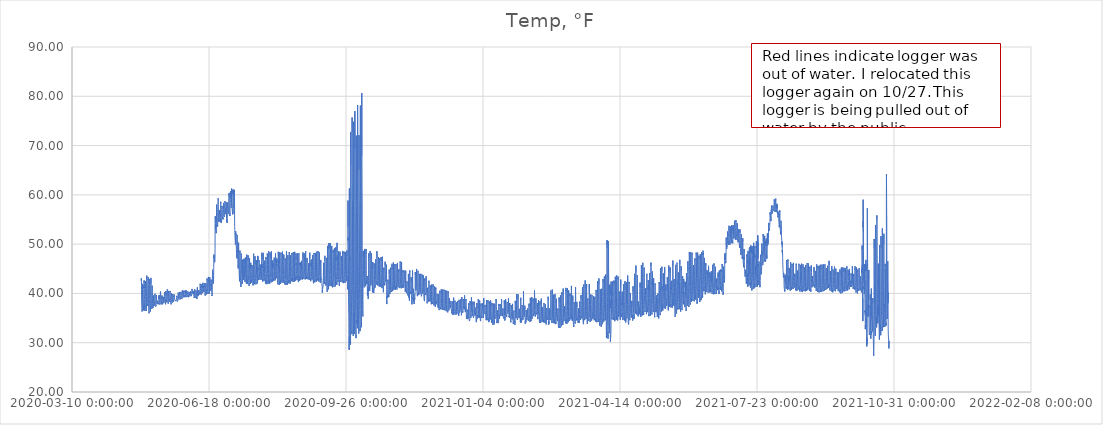
| Category | Temp, °F |
|---|---|
| 43950.547002314815 | 42.613 |
| 43950.58866898149 | 43.057 |
| 43950.63033564815 | 42.999 |
| 43950.672002314815 | 42.439 |
| 43950.71366898149 | 41.648 |
| 43950.75533564815 | 40.74 |
| 43950.797002314815 | 39.659 |
| 43950.83866898149 | 38.636 |
| 43950.88033564815 | 38.038 |
| 43950.922002314815 | 37.555 |
| 43950.96366898149 | 37.188 |
| 43951.00533564815 | 36.899 |
| 43951.047002314815 | 36.648 |
| 43951.08866898149 | 36.474 |
| 43951.13033564815 | 36.339 |
| 43951.172002314815 | 36.281 |
| 43951.21366898149 | 36.165 |
| 43951.25533564815 | 36.184 |
| 43951.297002314815 | 36.319 |
| 43951.33866898149 | 36.609 |
| 43951.38033564815 | 37.42 |
| 43951.422002314815 | 38.906 |
| 43951.46366898149 | 40.779 |
| 43951.50533564815 | 41.937 |
| 43951.547002314815 | 42.13 |
| 43951.58866898149 | 40.991 |
| 43951.63033564815 | 40.914 |
| 43951.672002314815 | 41.512 |
| 43951.71366898149 | 41.281 |
| 43951.75533564815 | 40.084 |
| 43951.797002314815 | 39.312 |
| 43951.83866898149 | 38.829 |
| 43951.88033564815 | 38.288 |
| 43951.922002314815 | 37.98 |
| 43951.96366898149 | 37.69 |
| 43952.00533564815 | 37.42 |
| 43952.047002314815 | 37.169 |
| 43952.08866898149 | 36.995 |
| 43952.13033564815 | 36.841 |
| 43952.172002314815 | 36.667 |
| 43952.21366898149 | 36.57 |
| 43952.25533564815 | 36.435 |
| 43952.297002314815 | 36.416 |
| 43952.33866898149 | 36.705 |
| 43952.38033564815 | 37.671 |
| 43952.422002314815 | 39.234 |
| 43952.46366898149 | 40.547 |
| 43952.50533564815 | 41.435 |
| 43952.547002314815 | 41.146 |
| 43952.58866898149 | 41.821 |
| 43952.63033564815 | 42.651 |
| 43952.672002314815 | 42.767 |
| 43952.71366898149 | 42.014 |
| 43952.75533564815 | 40.76 |
| 43952.797002314815 | 39.717 |
| 43952.83866898149 | 38.752 |
| 43952.88033564815 | 38.134 |
| 43952.922002314815 | 37.651 |
| 43952.96366898149 | 37.246 |
| 43953.00533564815 | 36.995 |
| 43953.047002314815 | 36.86 |
| 43953.08866898149 | 36.686 |
| 43953.13033564815 | 36.551 |
| 43953.172002314815 | 36.435 |
| 43953.21366898149 | 36.339 |
| 43953.25533564815 | 36.281 |
| 43953.297002314815 | 36.3 |
| 43953.33866898149 | 36.609 |
| 43953.38033564815 | 37.632 |
| 43953.422002314815 | 38.752 |
| 43953.46366898149 | 39.678 |
| 43953.50533564815 | 41.223 |
| 43953.547002314815 | 42.014 |
| 43953.58866898149 | 42.478 |
| 43953.63033564815 | 42.362 |
| 43953.672002314815 | 42.014 |
| 43953.71366898149 | 41.03 |
| 43953.75533564815 | 40.161 |
| 43953.797002314815 | 39.466 |
| 43953.83866898149 | 38.926 |
| 43953.88033564815 | 38.559 |
| 43953.922002314815 | 38.231 |
| 43953.96366898149 | 37.883 |
| 43954.00533564815 | 37.497 |
| 43954.047002314815 | 37.207 |
| 43954.08866898149 | 36.956 |
| 43954.13033564815 | 36.783 |
| 43954.172002314815 | 36.648 |
| 43954.21366898149 | 36.532 |
| 43954.25533564815 | 36.435 |
| 43954.297002314815 | 36.474 |
| 43954.33866898149 | 36.821 |
| 43954.38033564815 | 37.825 |
| 43954.422002314815 | 39.37 |
| 43954.46366898149 | 41.03 |
| 43954.50533564815 | 42.42 |
| 43954.547002314815 | 43.346 |
| 43954.58866898149 | 43.617 |
| 43954.63033564815 | 43.636 |
| 43954.672002314815 | 43.153 |
| 43954.71366898149 | 42.42 |
| 43954.75533564815 | 41.455 |
| 43954.797002314815 | 40.47 |
| 43954.83866898149 | 39.485 |
| 43954.88033564815 | 38.733 |
| 43954.922002314815 | 38.153 |
| 43954.96366898149 | 37.941 |
| 43955.00533564815 | 37.806 |
| 43955.047002314815 | 37.709 |
| 43955.08866898149 | 37.594 |
| 43955.13033564815 | 37.555 |
| 43955.172002314815 | 37.516 |
| 43955.21366898149 | 37.458 |
| 43955.25533564815 | 37.4 |
| 43955.297002314815 | 37.381 |
| 43955.33866898149 | 37.594 |
| 43955.38033564815 | 37.864 |
| 43955.422002314815 | 39.505 |
| 43955.46366898149 | 40.702 |
| 43955.50533564815 | 41.802 |
| 43955.547002314815 | 42.922 |
| 43955.58866898149 | 43.308 |
| 43955.63033564815 | 43.308 |
| 43955.672002314815 | 42.632 |
| 43955.71366898149 | 41.783 |
| 43955.75533564815 | 40.953 |
| 43955.797002314815 | 39.852 |
| 43955.83866898149 | 38.675 |
| 43955.88033564815 | 37.902 |
| 43955.922002314815 | 37.458 |
| 43955.96366898149 | 37.13 |
| 43956.00533564815 | 36.802 |
| 43956.047002314815 | 36.532 |
| 43956.08866898149 | 36.377 |
| 43956.13033564815 | 36.261 |
| 43956.172002314815 | 36.146 |
| 43956.21366898149 | 35.972 |
| 43956.25533564815 | 35.875 |
| 43956.297002314815 | 35.837 |
| 43956.33866898149 | 36.204 |
| 43956.38033564815 | 37.246 |
| 43956.422002314815 | 38.733 |
| 43956.46366898149 | 40.335 |
| 43956.50533564815 | 41.609 |
| 43956.547002314815 | 42.478 |
| 43956.58866898149 | 42.941 |
| 43956.63033564815 | 42.864 |
| 43956.672002314815 | 42.4 |
| 43956.71366898149 | 41.628 |
| 43956.75533564815 | 40.721 |
| 43956.797002314815 | 39.717 |
| 43956.83866898149 | 38.829 |
| 43956.88033564815 | 38.269 |
| 43956.922002314815 | 37.864 |
| 43956.96366898149 | 37.516 |
| 43957.00533564815 | 37.285 |
| 43957.047002314815 | 37.092 |
| 43957.08866898149 | 36.86 |
| 43957.13033564815 | 36.744 |
| 43957.172002314815 | 36.57 |
| 43957.21366898149 | 36.339 |
| 43957.25533564815 | 36.204 |
| 43957.297002314815 | 36.223 |
| 43957.33866898149 | 36.59 |
| 43957.38033564815 | 37.497 |
| 43957.422002314815 | 38.983 |
| 43957.46366898149 | 40.663 |
| 43957.50533564815 | 41.686 |
| 43957.547002314815 | 42.613 |
| 43957.58866898149 | 43.153 |
| 43957.63033564815 | 43.076 |
| 43957.672002314815 | 41.976 |
| 43957.71366898149 | 40.779 |
| 43957.75533564815 | 40.084 |
| 43957.797002314815 | 39.621 |
| 43957.83866898149 | 39.119 |
| 43957.88033564815 | 38.636 |
| 43957.922002314815 | 38.269 |
| 43957.96366898149 | 37.999 |
| 43958.00533564815 | 37.748 |
| 43958.047002314815 | 37.574 |
| 43958.08866898149 | 37.381 |
| 43958.13033564815 | 37.227 |
| 43958.172002314815 | 37.092 |
| 43958.21366898149 | 36.956 |
| 43958.25533564815 | 36.879 |
| 43958.297002314815 | 36.918 |
| 43958.33866898149 | 37.188 |
| 43958.38033564815 | 37.922 |
| 43958.422002314815 | 39.331 |
| 43958.46366898149 | 41.03 |
| 43958.50533564815 | 41.57 |
| 43958.547002314815 | 41.667 |
| 43958.58866898149 | 41.165 |
| 43958.63033564815 | 40.47 |
| 43958.672002314815 | 39.505 |
| 43958.71366898149 | 38.983 |
| 43958.75533564815 | 38.462 |
| 43958.797002314815 | 38.018 |
| 43958.83866898149 | 37.651 |
| 43958.88033564815 | 37.497 |
| 43958.922002314815 | 37.323 |
| 43958.96366898149 | 37.323 |
| 43959.00533564815 | 37.265 |
| 43959.047002314815 | 37.285 |
| 43959.08866898149 | 37.246 |
| 43959.13033564815 | 37.072 |
| 43959.172002314815 | 37.014 |
| 43959.21366898149 | 37.014 |
| 43959.25533564815 | 36.995 |
| 43959.297002314815 | 36.995 |
| 43959.33866898149 | 37.188 |
| 43959.38033564815 | 37.651 |
| 43959.422002314815 | 38.288 |
| 43959.46366898149 | 38.829 |
| 43959.50533564815 | 39.331 |
| 43959.547002314815 | 39.582 |
| 43959.58866898149 | 39.64 |
| 43959.63033564815 | 39.582 |
| 43959.672002314815 | 39.08 |
| 43959.71366898149 | 39.08 |
| 43959.75533564815 | 38.733 |
| 43959.797002314815 | 38.327 |
| 43959.83866898149 | 38.192 |
| 43959.88033564815 | 38.057 |
| 43959.922002314815 | 37.98 |
| 43959.96366898149 | 37.941 |
| 43960.00533564815 | 37.825 |
| 43960.047002314815 | 37.806 |
| 43960.08866898149 | 37.767 |
| 43960.13033564815 | 37.709 |
| 43960.172002314815 | 37.516 |
| 43960.21366898149 | 37.439 |
| 43960.25533564815 | 37.42 |
| 43960.297002314815 | 37.478 |
| 43960.33866898149 | 37.69 |
| 43960.38033564815 | 38.173 |
| 43960.422002314815 | 38.848 |
| 43960.46366898149 | 39.35 |
| 43960.50533564815 | 39.717 |
| 43960.547002314815 | 39.91 |
| 43960.58866898149 | 39.949 |
| 43960.63033564815 | 39.717 |
| 43960.672002314815 | 39.003 |
| 43960.71366898149 | 38.539 |
| 43960.75533564815 | 38.385 |
| 43960.797002314815 | 38.038 |
| 43960.83866898149 | 37.825 |
| 43960.88033564815 | 37.806 |
| 43960.922002314815 | 37.709 |
| 43960.96366898149 | 37.651 |
| 43961.00533564815 | 37.594 |
| 43961.047002314815 | 37.478 |
| 43961.08866898149 | 37.4 |
| 43961.13033564815 | 37.323 |
| 43961.172002314815 | 37.285 |
| 43961.21366898149 | 37.246 |
| 43961.25533564815 | 37.169 |
| 43961.297002314815 | 37.188 |
| 43961.33866898149 | 37.536 |
| 43961.38033564815 | 38.076 |
| 43961.422002314815 | 38.752 |
| 43961.46366898149 | 39.138 |
| 43961.50533564815 | 39.621 |
| 43961.547002314815 | 39.312 |
| 43961.58866898149 | 39.621 |
| 43961.63033564815 | 39.563 |
| 43961.672002314815 | 39.601 |
| 43961.71366898149 | 39.196 |
| 43961.75533564815 | 38.733 |
| 43961.797002314815 | 38.482 |
| 43961.83866898149 | 38.25 |
| 43961.88033564815 | 38.173 |
| 43961.922002314815 | 38.153 |
| 43961.96366898149 | 38.115 |
| 43962.00533564815 | 38.038 |
| 43962.047002314815 | 38.038 |
| 43962.08866898149 | 38.038 |
| 43962.13033564815 | 37.98 |
| 43962.172002314815 | 37.902 |
| 43962.21366898149 | 37.825 |
| 43962.25533564815 | 37.825 |
| 43962.297002314815 | 37.922 |
| 43962.33866898149 | 38.115 |
| 43962.38033564815 | 38.211 |
| 43962.422002314815 | 38.153 |
| 43962.46366898149 | 38.288 |
| 43962.50533564815 | 38.52 |
| 43962.547002314815 | 38.578 |
| 43962.58866898149 | 38.578 |
| 43962.63033564815 | 38.424 |
| 43962.672002314815 | 38.636 |
| 43962.71366898149 | 38.597 |
| 43962.75533564815 | 38.443 |
| 43962.797002314815 | 38.25 |
| 43962.83866898149 | 38.192 |
| 43962.88033564815 | 38.173 |
| 43962.922002314815 | 38.038 |
| 43962.96366898149 | 37.98 |
| 43963.00533564815 | 38.038 |
| 43963.047002314815 | 37.883 |
| 43963.08866898149 | 37.864 |
| 43963.13033564815 | 37.883 |
| 43963.172002314815 | 37.806 |
| 43963.21366898149 | 37.806 |
| 43963.25533564815 | 37.767 |
| 43963.297002314815 | 37.864 |
| 43963.33866898149 | 38.095 |
| 43963.38033564815 | 38.578 |
| 43963.422002314815 | 39.312 |
| 43963.46366898149 | 39.041 |
| 43963.50533564815 | 39.408 |
| 43963.547002314815 | 38.848 |
| 43963.58866898149 | 38.926 |
| 43963.63033564815 | 39.659 |
| 43963.672002314815 | 39.119 |
| 43963.71366898149 | 39.408 |
| 43963.75533564815 | 39.099 |
| 43963.797002314815 | 38.752 |
| 43963.83866898149 | 38.424 |
| 43963.88033564815 | 38.211 |
| 43963.922002314815 | 38.115 |
| 43963.96366898149 | 37.999 |
| 43964.00533564815 | 37.98 |
| 43964.047002314815 | 37.825 |
| 43964.08866898149 | 37.767 |
| 43964.13033564815 | 37.69 |
| 43964.172002314815 | 37.729 |
| 43964.21366898149 | 37.671 |
| 43964.25533564815 | 37.632 |
| 43964.297002314815 | 37.69 |
| 43964.33866898149 | 37.999 |
| 43964.38033564815 | 38.462 |
| 43964.422002314815 | 39.177 |
| 43964.46366898149 | 39.678 |
| 43964.50533564815 | 40.103 |
| 43964.547002314815 | 40.238 |
| 43964.58866898149 | 40.393 |
| 43964.63033564815 | 40.2 |
| 43964.672002314815 | 39.64 |
| 43964.71366898149 | 39.35 |
| 43964.75533564815 | 39.119 |
| 43964.797002314815 | 38.829 |
| 43964.83866898149 | 38.559 |
| 43964.88033564815 | 38.346 |
| 43964.922002314815 | 38.308 |
| 43964.96366898149 | 38.269 |
| 43965.00533564815 | 38.173 |
| 43965.047002314815 | 38.153 |
| 43965.08866898149 | 37.999 |
| 43965.13033564815 | 37.922 |
| 43965.172002314815 | 37.806 |
| 43965.21366898149 | 37.806 |
| 43965.25533564815 | 37.787 |
| 43965.297002314815 | 37.825 |
| 43965.33866898149 | 37.999 |
| 43965.38033564815 | 38.192 |
| 43965.422002314815 | 38.713 |
| 43965.46366898149 | 38.887 |
| 43965.50533564815 | 38.887 |
| 43965.547002314815 | 39.254 |
| 43965.58866898149 | 38.848 |
| 43965.63033564815 | 38.964 |
| 43965.672002314815 | 39.563 |
| 43965.71366898149 | 39.408 |
| 43965.75533564815 | 39.177 |
| 43965.797002314815 | 38.81 |
| 43965.83866898149 | 38.501 |
| 43965.88033564815 | 38.288 |
| 43965.922002314815 | 38.211 |
| 43965.96366898149 | 38.134 |
| 43966.00533564815 | 38.057 |
| 43966.047002314815 | 37.98 |
| 43966.08866898149 | 37.883 |
| 43966.13033564815 | 37.806 |
| 43966.172002314815 | 37.767 |
| 43966.21366898149 | 37.825 |
| 43966.25533564815 | 37.806 |
| 43966.297002314815 | 37.883 |
| 43966.33866898149 | 38.115 |
| 43966.38033564815 | 38.385 |
| 43966.422002314815 | 38.655 |
| 43966.46366898149 | 39.061 |
| 43966.50533564815 | 38.964 |
| 43966.547002314815 | 39.003 |
| 43966.58866898149 | 39.138 |
| 43966.63033564815 | 39.292 |
| 43966.672002314815 | 39.273 |
| 43966.71366898149 | 39.312 |
| 43966.75533564815 | 38.906 |
| 43966.797002314815 | 38.655 |
| 43966.83866898149 | 38.462 |
| 43966.88033564815 | 38.385 |
| 43966.922002314815 | 38.25 |
| 43966.96366898149 | 38.231 |
| 43967.00533564815 | 38.115 |
| 43967.047002314815 | 38.115 |
| 43967.08866898149 | 38.115 |
| 43967.13033564815 | 38.115 |
| 43967.172002314815 | 38.095 |
| 43967.21366898149 | 38.038 |
| 43967.25533564815 | 38.115 |
| 43967.297002314815 | 38.115 |
| 43967.33866898149 | 38.269 |
| 43967.38033564815 | 38.694 |
| 43967.422002314815 | 39.254 |
| 43967.46366898149 | 39.717 |
| 43967.50533564815 | 40.026 |
| 43967.547002314815 | 40.238 |
| 43967.58866898149 | 40.2 |
| 43967.63033564815 | 40.2 |
| 43967.672002314815 | 40.026 |
| 43967.71366898149 | 39.621 |
| 43967.75533564815 | 39.292 |
| 43967.797002314815 | 39.061 |
| 43967.83866898149 | 38.79 |
| 43967.88033564815 | 38.655 |
| 43967.922002314815 | 38.539 |
| 43967.96366898149 | 38.385 |
| 43968.00533564815 | 38.25 |
| 43968.047002314815 | 38.115 |
| 43968.08866898149 | 38.018 |
| 43968.13033564815 | 37.941 |
| 43968.172002314815 | 37.941 |
| 43968.21366898149 | 37.864 |
| 43968.25533564815 | 37.806 |
| 43968.297002314815 | 37.844 |
| 43968.33866898149 | 38.115 |
| 43968.38033564815 | 38.636 |
| 43968.422002314815 | 39.331 |
| 43968.46366898149 | 39.91 |
| 43968.50533564815 | 40.18 |
| 43968.547002314815 | 40.489 |
| 43968.58866898149 | 40.354 |
| 43968.63033564815 | 40.026 |
| 43968.672002314815 | 39.794 |
| 43968.71366898149 | 40.084 |
| 43968.75533564815 | 39.659 |
| 43968.797002314815 | 39.408 |
| 43968.83866898149 | 39.041 |
| 43968.88033564815 | 38.887 |
| 43968.922002314815 | 38.733 |
| 43968.96366898149 | 38.617 |
| 43969.00533564815 | 38.462 |
| 43969.047002314815 | 38.346 |
| 43969.08866898149 | 38.288 |
| 43969.13033564815 | 38.211 |
| 43969.172002314815 | 38.269 |
| 43969.21366898149 | 38.153 |
| 43969.25533564815 | 38.115 |
| 43969.297002314815 | 38.115 |
| 43969.33866898149 | 38.385 |
| 43969.38033564815 | 38.733 |
| 43969.422002314815 | 39.505 |
| 43969.46366898149 | 40.2 |
| 43969.50533564815 | 40.567 |
| 43969.547002314815 | 40.76 |
| 43969.58866898149 | 40.817 |
| 43969.63033564815 | 40.895 |
| 43969.672002314815 | 40.682 |
| 43969.71366898149 | 40.373 |
| 43969.75533564815 | 39.929 |
| 43969.797002314815 | 39.717 |
| 43969.83866898149 | 39.292 |
| 43969.88033564815 | 38.983 |
| 43969.922002314815 | 38.733 |
| 43969.96366898149 | 38.559 |
| 43970.00533564815 | 38.404 |
| 43970.047002314815 | 38.308 |
| 43970.08866898149 | 38.173 |
| 43970.13033564815 | 38.153 |
| 43970.172002314815 | 38.095 |
| 43970.21366898149 | 37.98 |
| 43970.25533564815 | 37.922 |
| 43970.297002314815 | 37.999 |
| 43970.33866898149 | 38.327 |
| 43970.38033564815 | 38.945 |
| 43970.422002314815 | 39.678 |
| 43970.46366898149 | 40.238 |
| 43970.50533564815 | 40.354 |
| 43970.547002314815 | 40.509 |
| 43970.58866898149 | 40.547 |
| 43970.63033564815 | 40.045 |
| 43970.672002314815 | 39.929 |
| 43970.71366898149 | 39.698 |
| 43970.75533564815 | 39.485 |
| 43970.797002314815 | 39.215 |
| 43970.83866898149 | 39.119 |
| 43970.88033564815 | 39.022 |
| 43970.922002314815 | 38.868 |
| 43970.96366898149 | 38.79 |
| 43971.00533564815 | 38.694 |
| 43971.047002314815 | 38.578 |
| 43971.08866898149 | 38.578 |
| 43971.13033564815 | 38.424 |
| 43971.172002314815 | 38.366 |
| 43971.21366898149 | 38.346 |
| 43971.25533564815 | 38.327 |
| 43971.297002314815 | 38.288 |
| 43971.33866898149 | 38.52 |
| 43971.38033564815 | 39.003 |
| 43971.422002314815 | 39.408 |
| 43971.46366898149 | 39.872 |
| 43971.50533564815 | 40.103 |
| 43971.547002314815 | 40.296 |
| 43971.58866898149 | 40.509 |
| 43971.63033564815 | 40.489 |
| 43971.672002314815 | 40.238 |
| 43971.71366898149 | 39.968 |
| 43971.75533564815 | 39.601 |
| 43971.797002314815 | 39.254 |
| 43971.83866898149 | 38.868 |
| 43971.88033564815 | 38.694 |
| 43971.922002314815 | 38.559 |
| 43971.96366898149 | 38.443 |
| 43972.00533564815 | 38.231 |
| 43972.047002314815 | 38.115 |
| 43972.08866898149 | 37.999 |
| 43972.13033564815 | 37.922 |
| 43972.172002314815 | 37.902 |
| 43972.21366898149 | 37.806 |
| 43972.25533564815 | 37.825 |
| 43972.297002314815 | 37.787 |
| 43972.33866898149 | 38.095 |
| 43972.38033564815 | 38.443 |
| 43972.422002314815 | 38.964 |
| 43972.46366898149 | 39.389 |
| 43972.50533564815 | 39.736 |
| 43972.547002314815 | 40.045 |
| 43972.58866898149 | 40.084 |
| 43972.63033564815 | 39.852 |
| 43972.672002314815 | 39.717 |
| 43972.71366898149 | 39.659 |
| 43972.75533564815 | 39.35 |
| 43972.797002314815 | 39.119 |
| 43972.83866898149 | 38.926 |
| 43972.88033564815 | 38.752 |
| 43972.922002314815 | 38.636 |
| 43972.96366898149 | 38.559 |
| 43973.00533564815 | 38.52 |
| 43973.047002314815 | 38.366 |
| 43973.08866898149 | 38.134 |
| 43973.13033564815 | 38.115 |
| 43973.172002314815 | 38.018 |
| 43973.21366898149 | 38.095 |
| 43973.25533564815 | 38.095 |
| 43973.297002314815 | 38.057 |
| 43973.33866898149 | 38.327 |
| 43973.38033564815 | 38.79 |
| 43973.422002314815 | 39.177 |
| 43973.46366898149 | 39.485 |
| 43973.50533564815 | 39.678 |
| 43973.547002314815 | 39.852 |
| 43973.58866898149 | 39.872 |
| 43973.63033564815 | 39.794 |
| 43973.672002314815 | 39.621 |
| 43973.71366898149 | 39.447 |
| 43973.75533564815 | 39.234 |
| 43973.797002314815 | 38.926 |
| 43973.83866898149 | 38.79 |
| 43973.88033564815 | 38.636 |
| 43973.922002314815 | 38.578 |
| 43973.96366898149 | 38.52 |
| 43974.00533564815 | 38.443 |
| 43974.047002314815 | 38.308 |
| 43974.08866898149 | 38.25 |
| 43974.13033564815 | 38.211 |
| 43974.172002314815 | 38.192 |
| 43974.21366898149 | 38.153 |
| 43974.25533564815 | 38.192 |
| 43974.297002314815 | 38.288 |
| 43974.33866898149 | 38.578 |
| 43974.38033564815 | 38.964 |
| 43974.422002314815 | 39.119 |
| 43974.46366898149 | 39.505 |
| 43974.50533564815 | 39.273 |
| 43974.547002314815 | 39.331 |
| 43974.58866898149 | 39.756 |
| 43974.63033564815 | 39.736 |
| 43974.672002314815 | 39.814 |
| 43974.71366898149 | 39.698 |
| 43974.75533564815 | 39.678 |
| 43974.797002314815 | 39.389 |
| 43974.83866898149 | 39.177 |
| 43974.88033564815 | 39.061 |
| 43974.922002314815 | 38.906 |
| 43974.96366898149 | 38.868 |
| 43975.00533564815 | 38.752 |
| 43975.047002314815 | 38.733 |
| 43975.08866898149 | 38.733 |
| 43975.13033564815 | 38.694 |
| 43975.172002314815 | 38.655 |
| 43975.21366898149 | 38.636 |
| 43975.25533564815 | 38.578 |
| 43975.297002314815 | 38.713 |
| 43975.33866898149 | 38.597 |
| 43975.38033564815 | 38.694 |
| 43975.422002314815 | 38.868 |
| 43975.46366898149 | 38.848 |
| 43975.50533564815 | 38.501 |
| 43975.547002314815 | 38.79 |
| 43975.58866898149 | 38.52 |
| 43975.63033564815 | 38.752 |
| 43975.672002314815 | 38.52 |
| 43975.71366898149 | 38.636 |
| 43975.75533564815 | 38.636 |
| 43975.797002314815 | 38.655 |
| 43975.83866898149 | 38.52 |
| 43975.88033564815 | 38.404 |
| 43975.922002314815 | 38.346 |
| 43975.96366898149 | 38.308 |
| 43976.00533564815 | 38.346 |
| 43976.047002314815 | 38.346 |
| 43976.08866898149 | 38.269 |
| 43976.13033564815 | 38.288 |
| 43976.172002314815 | 38.327 |
| 43976.21366898149 | 38.462 |
| 43976.25533564815 | 38.539 |
| 43976.297002314815 | 38.52 |
| 43976.33866898149 | 38.559 |
| 43976.38033564815 | 38.81 |
| 43976.422002314815 | 39.119 |
| 43976.46366898149 | 39.273 |
| 43976.50533564815 | 39.505 |
| 43976.547002314815 | 39.292 |
| 43976.58866898149 | 39.37 |
| 43976.63033564815 | 39.428 |
| 43976.672002314815 | 39.138 |
| 43976.71366898149 | 39.234 |
| 43976.75533564815 | 38.945 |
| 43976.797002314815 | 38.79 |
| 43976.83866898149 | 38.559 |
| 43976.88033564815 | 38.52 |
| 43976.922002314815 | 38.482 |
| 43976.96366898149 | 38.385 |
| 43977.00533564815 | 38.346 |
| 43977.047002314815 | 38.327 |
| 43977.08866898149 | 38.269 |
| 43977.13033564815 | 38.327 |
| 43977.172002314815 | 38.366 |
| 43977.21366898149 | 38.443 |
| 43977.25533564815 | 38.462 |
| 43977.297002314815 | 38.559 |
| 43977.33866898149 | 38.81 |
| 43977.38033564815 | 39.196 |
| 43977.422002314815 | 39.736 |
| 43977.46366898149 | 39.814 |
| 43977.50533564815 | 39.659 |
| 43977.547002314815 | 39.717 |
| 43977.58866898149 | 40.161 |
| 43977.63033564815 | 39.756 |
| 43977.672002314815 | 39.485 |
| 43977.71366898149 | 39.273 |
| 43977.75533564815 | 39.466 |
| 43977.797002314815 | 39.196 |
| 43977.83866898149 | 38.983 |
| 43977.88033564815 | 38.906 |
| 43977.922002314815 | 38.926 |
| 43977.96366898149 | 38.887 |
| 43978.00533564815 | 38.848 |
| 43978.047002314815 | 38.771 |
| 43978.08866898149 | 38.79 |
| 43978.13033564815 | 38.752 |
| 43978.172002314815 | 38.79 |
| 43978.21366898149 | 38.829 |
| 43978.25533564815 | 38.887 |
| 43978.297002314815 | 39.022 |
| 43978.33866898149 | 39.196 |
| 43978.38033564815 | 39.582 |
| 43978.422002314815 | 39.968 |
| 43978.46366898149 | 40.219 |
| 43978.50533564815 | 39.872 |
| 43978.547002314815 | 40.007 |
| 43978.58866898149 | 40.18 |
| 43978.63033564815 | 40.238 |
| 43978.672002314815 | 39.64 |
| 43978.71366898149 | 39.447 |
| 43978.75533564815 | 39.234 |
| 43978.797002314815 | 39.273 |
| 43978.83866898149 | 39.061 |
| 43978.88033564815 | 39.003 |
| 43978.922002314815 | 38.906 |
| 43978.96366898149 | 38.829 |
| 43979.00533564815 | 38.79 |
| 43979.047002314815 | 38.79 |
| 43979.08866898149 | 38.752 |
| 43979.13033564815 | 38.79 |
| 43979.172002314815 | 38.752 |
| 43979.21366898149 | 38.733 |
| 43979.25533564815 | 38.79 |
| 43979.297002314815 | 38.887 |
| 43979.33866898149 | 39.099 |
| 43979.38033564815 | 39.505 |
| 43979.422002314815 | 39.833 |
| 43979.46366898149 | 40.103 |
| 43979.50533564815 | 40.316 |
| 43979.547002314815 | 40.354 |
| 43979.58866898149 | 40.451 |
| 43979.63033564815 | 40.316 |
| 43979.672002314815 | 40.373 |
| 43979.71366898149 | 40.007 |
| 43979.75533564815 | 39.91 |
| 43979.797002314815 | 39.621 |
| 43979.83866898149 | 39.428 |
| 43979.88033564815 | 39.389 |
| 43979.922002314815 | 39.254 |
| 43979.96366898149 | 39.119 |
| 43980.00533564815 | 39.08 |
| 43980.047002314815 | 39.061 |
| 43980.08866898149 | 38.983 |
| 43980.13033564815 | 38.945 |
| 43980.172002314815 | 38.906 |
| 43980.21366898149 | 38.868 |
| 43980.25533564815 | 38.945 |
| 43980.297002314815 | 38.964 |
| 43980.33866898149 | 39.177 |
| 43980.38033564815 | 39.428 |
| 43980.422002314815 | 39.891 |
| 43980.46366898149 | 40.335 |
| 43980.50533564815 | 40.316 |
| 43980.547002314815 | 40.624 |
| 43980.58866898149 | 40.682 |
| 43980.63033564815 | 40.316 |
| 43980.672002314815 | 39.987 |
| 43980.71366898149 | 40.084 |
| 43980.75533564815 | 39.833 |
| 43980.797002314815 | 39.736 |
| 43980.83866898149 | 39.601 |
| 43980.88033564815 | 39.428 |
| 43980.922002314815 | 39.234 |
| 43980.96366898149 | 39.196 |
| 43981.00533564815 | 39.215 |
| 43981.047002314815 | 39.138 |
| 43981.08866898149 | 39.157 |
| 43981.13033564815 | 39.138 |
| 43981.172002314815 | 39.061 |
| 43981.21366898149 | 39.061 |
| 43981.25533564815 | 39.061 |
| 43981.297002314815 | 39.099 |
| 43981.33866898149 | 39.331 |
| 43981.38033564815 | 39.563 |
| 43981.422002314815 | 39.968 |
| 43981.46366898149 | 40.528 |
| 43981.50533564815 | 40.528 |
| 43981.547002314815 | 40.489 |
| 43981.58866898149 | 40.065 |
| 43981.63033564815 | 39.91 |
| 43981.672002314815 | 39.794 |
| 43981.71366898149 | 39.717 |
| 43981.75533564815 | 39.678 |
| 43981.797002314815 | 39.621 |
| 43981.83866898149 | 39.447 |
| 43981.88033564815 | 39.331 |
| 43981.922002314815 | 39.234 |
| 43981.96366898149 | 39.157 |
| 43982.00533564815 | 39.215 |
| 43982.047002314815 | 39.254 |
| 43982.08866898149 | 39.37 |
| 43982.13033564815 | 39.312 |
| 43982.172002314815 | 39.292 |
| 43982.21366898149 | 39.234 |
| 43982.25533564815 | 39.177 |
| 43982.297002314815 | 39.138 |
| 43982.33866898149 | 39.312 |
| 43982.38033564815 | 39.698 |
| 43982.422002314815 | 39.949 |
| 43982.46366898149 | 39.929 |
| 43982.50533564815 | 40.084 |
| 43982.547002314815 | 40.567 |
| 43982.58866898149 | 40.373 |
| 43982.63033564815 | 40.258 |
| 43982.672002314815 | 40.451 |
| 43982.71366898149 | 40.547 |
| 43982.75533564815 | 40.354 |
| 43982.797002314815 | 40.065 |
| 43982.83866898149 | 39.794 |
| 43982.88033564815 | 39.621 |
| 43982.922002314815 | 39.485 |
| 43982.96366898149 | 39.389 |
| 43983.00533564815 | 39.389 |
| 43983.047002314815 | 39.331 |
| 43983.08866898149 | 39.312 |
| 43983.13033564815 | 39.35 |
| 43983.172002314815 | 39.234 |
| 43983.21366898149 | 39.138 |
| 43983.25533564815 | 39.215 |
| 43983.297002314815 | 39.312 |
| 43983.33866898149 | 39.37 |
| 43983.38033564815 | 39.543 |
| 43983.422002314815 | 39.91 |
| 43983.46366898149 | 40.2 |
| 43983.50533564815 | 39.987 |
| 43983.547002314815 | 40.567 |
| 43983.58866898149 | 40.373 |
| 43983.63033564815 | 40.393 |
| 43983.672002314815 | 40.431 |
| 43983.71366898149 | 40.065 |
| 43983.75533564815 | 40.007 |
| 43983.797002314815 | 39.814 |
| 43983.83866898149 | 39.582 |
| 43983.88033564815 | 39.466 |
| 43983.922002314815 | 39.428 |
| 43983.96366898149 | 39.389 |
| 43984.00533564815 | 39.292 |
| 43984.047002314815 | 39.312 |
| 43984.08866898149 | 39.273 |
| 43984.13033564815 | 39.312 |
| 43984.172002314815 | 39.37 |
| 43984.21366898149 | 39.505 |
| 43984.25533564815 | 39.428 |
| 43984.297002314815 | 39.408 |
| 43984.33866898149 | 39.485 |
| 43984.38033564815 | 39.621 |
| 43984.422002314815 | 39.814 |
| 43984.46366898149 | 39.794 |
| 43984.50533564815 | 40.18 |
| 43984.547002314815 | 40.412 |
| 43984.58866898149 | 40.586 |
| 43984.63033564815 | 40.354 |
| 43984.672002314815 | 40.258 |
| 43984.71366898149 | 40.277 |
| 43984.75533564815 | 40.142 |
| 43984.797002314815 | 39.968 |
| 43984.83866898149 | 39.717 |
| 43984.88033564815 | 39.466 |
| 43984.922002314815 | 39.331 |
| 43984.96366898149 | 39.408 |
| 43985.00533564815 | 39.331 |
| 43985.047002314815 | 39.234 |
| 43985.08866898149 | 39.35 |
| 43985.13033564815 | 39.466 |
| 43985.172002314815 | 39.312 |
| 43985.21366898149 | 39.312 |
| 43985.25533564815 | 39.447 |
| 43985.297002314815 | 39.659 |
| 43985.33866898149 | 39.621 |
| 43985.38033564815 | 39.659 |
| 43985.422002314815 | 39.833 |
| 43985.46366898149 | 39.949 |
| 43985.50533564815 | 39.775 |
| 43985.547002314815 | 39.852 |
| 43985.58866898149 | 40.238 |
| 43985.63033564815 | 40.354 |
| 43985.672002314815 | 40.2 |
| 43985.71366898149 | 39.968 |
| 43985.75533564815 | 39.929 |
| 43985.797002314815 | 39.64 |
| 43985.83866898149 | 39.621 |
| 43985.88033564815 | 39.466 |
| 43985.922002314815 | 39.389 |
| 43985.96366898149 | 39.331 |
| 43986.00533564815 | 39.35 |
| 43986.047002314815 | 39.37 |
| 43986.08866898149 | 39.37 |
| 43986.13033564815 | 39.505 |
| 43986.172002314815 | 39.428 |
| 43986.21366898149 | 39.292 |
| 43986.25533564815 | 39.234 |
| 43986.297002314815 | 39.312 |
| 43986.33866898149 | 39.601 |
| 43986.38033564815 | 39.949 |
| 43986.422002314815 | 40.393 |
| 43986.46366898149 | 40.258 |
| 43986.50533564815 | 40.412 |
| 43986.547002314815 | 40.065 |
| 43986.58866898149 | 40.2 |
| 43986.63033564815 | 39.949 |
| 43986.672002314815 | 40.316 |
| 43986.71366898149 | 40.18 |
| 43986.75533564815 | 39.968 |
| 43986.797002314815 | 39.794 |
| 43986.83866898149 | 39.678 |
| 43986.88033564815 | 39.621 |
| 43986.922002314815 | 39.485 |
| 43986.96366898149 | 39.447 |
| 43987.00533564815 | 39.485 |
| 43987.047002314815 | 39.582 |
| 43987.08866898149 | 39.466 |
| 43987.13033564815 | 39.408 |
| 43987.172002314815 | 39.37 |
| 43987.21366898149 | 39.428 |
| 43987.25533564815 | 39.524 |
| 43987.297002314815 | 39.447 |
| 43987.33866898149 | 39.717 |
| 43987.38033564815 | 39.968 |
| 43987.422002314815 | 40.161 |
| 43987.46366898149 | 40.354 |
| 43987.50533564815 | 40.335 |
| 43987.547002314815 | 40.624 |
| 43987.58866898149 | 40.798 |
| 43987.63033564815 | 40.914 |
| 43987.672002314815 | 40.779 |
| 43987.71366898149 | 40.528 |
| 43987.75533564815 | 40.296 |
| 43987.797002314815 | 40.2 |
| 43987.83866898149 | 39.968 |
| 43987.88033564815 | 39.852 |
| 43987.922002314815 | 39.929 |
| 43987.96366898149 | 39.833 |
| 43988.00533564815 | 39.872 |
| 43988.047002314815 | 39.891 |
| 43988.08866898149 | 39.852 |
| 43988.13033564815 | 39.833 |
| 43988.172002314815 | 39.833 |
| 43988.21366898149 | 39.852 |
| 43988.25533564815 | 39.852 |
| 43988.297002314815 | 39.794 |
| 43988.33866898149 | 39.91 |
| 43988.38033564815 | 39.891 |
| 43988.422002314815 | 40.026 |
| 43988.46366898149 | 40.142 |
| 43988.50533564815 | 40.065 |
| 43988.547002314815 | 40.509 |
| 43988.58866898149 | 40.509 |
| 43988.63033564815 | 40.065 |
| 43988.672002314815 | 40.18 |
| 43988.71366898149 | 40.277 |
| 43988.75533564815 | 40.219 |
| 43988.797002314815 | 40.122 |
| 43988.83866898149 | 39.794 |
| 43988.88033564815 | 39.794 |
| 43988.922002314815 | 39.756 |
| 43988.96366898149 | 39.736 |
| 43989.00533564815 | 39.621 |
| 43989.047002314815 | 39.37 |
| 43989.08866898149 | 39.331 |
| 43989.13033564815 | 39.099 |
| 43989.172002314815 | 39.061 |
| 43989.21366898149 | 39.003 |
| 43989.25533564815 | 39.003 |
| 43989.297002314815 | 39.138 |
| 43989.33866898149 | 39.35 |
| 43989.38033564815 | 39.852 |
| 43989.422002314815 | 40.296 |
| 43989.46366898149 | 40.605 |
| 43989.50533564815 | 40.837 |
| 43989.547002314815 | 40.895 |
| 43989.58866898149 | 40.914 |
| 43989.63033564815 | 40.953 |
| 43989.672002314815 | 40.721 |
| 43989.71366898149 | 40.74 |
| 43989.75533564815 | 40.721 |
| 43989.797002314815 | 40.528 |
| 43989.83866898149 | 40.142 |
| 43989.88033564815 | 39.852 |
| 43989.922002314815 | 39.621 |
| 43989.96366898149 | 39.563 |
| 43990.00533564815 | 39.447 |
| 43990.047002314815 | 39.331 |
| 43990.08866898149 | 39.312 |
| 43990.13033564815 | 39.196 |
| 43990.172002314815 | 39.215 |
| 43990.21366898149 | 39.157 |
| 43990.25533564815 | 39.119 |
| 43990.297002314815 | 39.119 |
| 43990.33866898149 | 39.331 |
| 43990.38033564815 | 39.563 |
| 43990.422002314815 | 39.91 |
| 43990.46366898149 | 40.373 |
| 43990.50533564815 | 40.47 |
| 43990.547002314815 | 40.509 |
| 43990.58866898149 | 40.586 |
| 43990.63033564815 | 40.682 |
| 43990.672002314815 | 40.682 |
| 43990.71366898149 | 40.624 |
| 43990.75533564815 | 40.489 |
| 43990.797002314815 | 40.238 |
| 43990.83866898149 | 39.852 |
| 43990.88033564815 | 39.659 |
| 43990.922002314815 | 39.505 |
| 43990.96366898149 | 39.678 |
| 43991.00533564815 | 39.331 |
| 43991.047002314815 | 39.119 |
| 43991.08866898149 | 39.099 |
| 43991.13033564815 | 38.868 |
| 43991.172002314815 | 38.906 |
| 43991.21366898149 | 38.906 |
| 43991.25533564815 | 39.003 |
| 43991.297002314815 | 39.234 |
| 43991.33866898149 | 39.37 |
| 43991.38033564815 | 39.389 |
| 43991.422002314815 | 39.543 |
| 43991.46366898149 | 40.373 |
| 43991.50533564815 | 41.242 |
| 43991.547002314815 | 40.489 |
| 43991.58866898149 | 40.007 |
| 43991.63033564815 | 40.084 |
| 43991.672002314815 | 39.717 |
| 43991.71366898149 | 39.64 |
| 43991.75533564815 | 39.659 |
| 43991.797002314815 | 39.563 |
| 43991.83866898149 | 39.447 |
| 43991.88033564815 | 39.485 |
| 43991.922002314815 | 39.582 |
| 43991.96366898149 | 39.717 |
| 43992.00533564815 | 39.736 |
| 43992.047002314815 | 39.601 |
| 43992.08866898149 | 39.659 |
| 43992.13033564815 | 39.717 |
| 43992.172002314815 | 39.91 |
| 43992.21366898149 | 39.949 |
| 43992.25533564815 | 39.756 |
| 43992.297002314815 | 39.64 |
| 43992.33866898149 | 39.756 |
| 43992.38033564815 | 40.026 |
| 43992.422002314815 | 40.258 |
| 43992.46366898149 | 40.084 |
| 43992.50533564815 | 40.335 |
| 43992.547002314815 | 40.258 |
| 43992.58866898149 | 40.663 |
| 43992.63033564815 | 40.721 |
| 43992.672002314815 | 40.76 |
| 43992.71366898149 | 40.682 |
| 43992.75533564815 | 40.489 |
| 43992.797002314815 | 40.296 |
| 43992.83866898149 | 40.18 |
| 43992.88033564815 | 40.103 |
| 43992.922002314815 | 40.026 |
| 43992.96366898149 | 40.026 |
| 43993.00533564815 | 40.026 |
| 43993.047002314815 | 39.929 |
| 43993.08866898149 | 39.794 |
| 43993.13033564815 | 39.756 |
| 43993.172002314815 | 39.678 |
| 43993.21366898149 | 39.678 |
| 43993.25533564815 | 39.698 |
| 43993.297002314815 | 39.678 |
| 43993.33866898149 | 39.872 |
| 43993.38033564815 | 40.258 |
| 43993.422002314815 | 40.837 |
| 43993.46366898149 | 41.3 |
| 43993.50533564815 | 41.609 |
| 43993.547002314815 | 41.956 |
| 43993.58866898149 | 41.976 |
| 43993.63033564815 | 41.686 |
| 43993.672002314815 | 41.628 |
| 43993.71366898149 | 41.609 |
| 43993.75533564815 | 41.319 |
| 43993.797002314815 | 40.933 |
| 43993.83866898149 | 40.605 |
| 43993.88033564815 | 40.296 |
| 43993.922002314815 | 40.2 |
| 43993.96366898149 | 40.065 |
| 43994.00533564815 | 39.968 |
| 43994.047002314815 | 39.91 |
| 43994.08866898149 | 39.929 |
| 43994.13033564815 | 39.891 |
| 43994.172002314815 | 39.872 |
| 43994.21366898149 | 39.736 |
| 43994.25533564815 | 39.678 |
| 43994.297002314815 | 39.736 |
| 43994.33866898149 | 40.007 |
| 43994.38033564815 | 40.47 |
| 43994.422002314815 | 41.011 |
| 43994.46366898149 | 41.532 |
| 43994.50533564815 | 41.821 |
| 43994.547002314815 | 41.937 |
| 43994.58866898149 | 41.879 |
| 43994.63033564815 | 41.821 |
| 43994.672002314815 | 41.319 |
| 43994.71366898149 | 41.03 |
| 43994.75533564815 | 41.049 |
| 43994.797002314815 | 40.837 |
| 43994.83866898149 | 40.509 |
| 43994.88033564815 | 40.354 |
| 43994.922002314815 | 40.258 |
| 43994.96366898149 | 40.122 |
| 43995.00533564815 | 40.026 |
| 43995.047002314815 | 39.968 |
| 43995.08866898149 | 39.929 |
| 43995.13033564815 | 39.929 |
| 43995.172002314815 | 39.949 |
| 43995.21366898149 | 40.007 |
| 43995.25533564815 | 39.949 |
| 43995.297002314815 | 39.987 |
| 43995.33866898149 | 40.412 |
| 43995.38033564815 | 40.547 |
| 43995.422002314815 | 40.972 |
| 43995.46366898149 | 41.455 |
| 43995.50533564815 | 41.744 |
| 43995.547002314815 | 42.15 |
| 43995.58866898149 | 41.339 |
| 43995.63033564815 | 41.03 |
| 43995.672002314815 | 41.474 |
| 43995.71366898149 | 41.377 |
| 43995.75533564815 | 41.319 |
| 43995.797002314815 | 41.242 |
| 43995.83866898149 | 41.03 |
| 43995.88033564815 | 40.875 |
| 43995.922002314815 | 40.837 |
| 43995.96366898149 | 40.721 |
| 43996.00533564815 | 40.528 |
| 43996.047002314815 | 40.528 |
| 43996.08866898149 | 40.489 |
| 43996.13033564815 | 40.316 |
| 43996.172002314815 | 40.258 |
| 43996.21366898149 | 40.316 |
| 43996.25533564815 | 40.238 |
| 43996.297002314815 | 40.219 |
| 43996.33866898149 | 40.316 |
| 43996.38033564815 | 40.528 |
| 43996.422002314815 | 40.663 |
| 43996.46366898149 | 41.493 |
| 43996.50533564815 | 41.802 |
| 43996.547002314815 | 41.783 |
| 43996.58866898149 | 41.725 |
| 43996.63033564815 | 41.899 |
| 43996.672002314815 | 42.053 |
| 43996.71366898149 | 41.802 |
| 43996.75533564815 | 41.59 |
| 43996.797002314815 | 41.242 |
| 43996.83866898149 | 40.972 |
| 43996.88033564815 | 40.837 |
| 43996.922002314815 | 40.702 |
| 43996.96366898149 | 40.586 |
| 43997.00533564815 | 40.489 |
| 43997.047002314815 | 40.354 |
| 43997.08866898149 | 40.122 |
| 43997.13033564815 | 39.794 |
| 43997.172002314815 | 39.698 |
| 43997.21366898149 | 39.563 |
| 43997.25533564815 | 39.466 |
| 43997.297002314815 | 39.678 |
| 43997.33866898149 | 39.91 |
| 43997.38033564815 | 40.354 |
| 43997.422002314815 | 40.74 |
| 43997.46366898149 | 40.798 |
| 43997.50533564815 | 41.049 |
| 43997.547002314815 | 41.763 |
| 43997.58866898149 | 42.034 |
| 43997.63033564815 | 42.188 |
| 43997.672002314815 | 42.111 |
| 43997.71366898149 | 42.092 |
| 43997.75533564815 | 41.725 |
| 43997.797002314815 | 41.397 |
| 43997.83866898149 | 41.146 |
| 43997.88033564815 | 40.991 |
| 43997.922002314815 | 40.875 |
| 43997.96366898149 | 40.817 |
| 43998.00533564815 | 40.702 |
| 43998.047002314815 | 40.509 |
| 43998.08866898149 | 40.296 |
| 43998.13033564815 | 40.084 |
| 43998.172002314815 | 39.929 |
| 43998.21366898149 | 39.814 |
| 43998.25533564815 | 39.794 |
| 43998.297002314815 | 39.794 |
| 43998.33866898149 | 40.219 |
| 43998.38033564815 | 40.702 |
| 43998.422002314815 | 41.184 |
| 43998.46366898149 | 41.763 |
| 43998.50533564815 | 42.207 |
| 43998.547002314815 | 42.362 |
| 43998.58866898149 | 43.018 |
| 43998.63033564815 | 42.902 |
| 43998.672002314815 | 42.651 |
| 43998.71366898149 | 42.343 |
| 43998.75533564815 | 42.111 |
| 43998.797002314815 | 41.551 |
| 43998.83866898149 | 41.242 |
| 43998.88033564815 | 40.991 |
| 43998.922002314815 | 40.817 |
| 43998.96366898149 | 40.702 |
| 43999.00533564815 | 40.547 |
| 43999.047002314815 | 40.412 |
| 43999.08866898149 | 40.316 |
| 43999.13033564815 | 40.2 |
| 43999.172002314815 | 40.026 |
| 43999.21366898149 | 40.007 |
| 43999.25533564815 | 39.929 |
| 43999.297002314815 | 39.929 |
| 43999.33866898149 | 40.219 |
| 43999.38033564815 | 40.914 |
| 43999.422002314815 | 41.744 |
| 43999.46366898149 | 42.4 |
| 43999.50533564815 | 42.941 |
| 43999.547002314815 | 43.346 |
| 43999.58866898149 | 43.424 |
| 43999.63033564815 | 43.385 |
| 43999.672002314815 | 43.134 |
| 43999.71366898149 | 42.96 |
| 43999.75533564815 | 42.632 |
| 43999.797002314815 | 42.285 |
| 43999.83866898149 | 41.976 |
| 43999.88033564815 | 41.609 |
| 43999.922002314815 | 41.416 |
| 43999.96366898149 | 41.107 |
| 44000.00533564815 | 40.895 |
| 44000.047002314815 | 40.663 |
| 44000.08866898149 | 40.354 |
| 44000.13033564815 | 40.122 |
| 44000.172002314815 | 39.949 |
| 44000.21366898149 | 39.891 |
| 44000.25533564815 | 39.814 |
| 44000.297002314815 | 39.852 |
| 44000.33866898149 | 40.084 |
| 44000.38033564815 | 40.644 |
| 44000.422002314815 | 41.512 |
| 44000.46366898149 | 41.995 |
| 44000.50533564815 | 42.516 |
| 44000.547002314815 | 43.308 |
| 44000.58866898149 | 42.15 |
| 44000.63033564815 | 41.86 |
| 44000.672002314815 | 41.937 |
| 44000.71366898149 | 41.551 |
| 44000.75533564815 | 41.474 |
| 44000.797002314815 | 41.377 |
| 44000.83866898149 | 41.126 |
| 44000.88033564815 | 41.049 |
| 44000.922002314815 | 40.779 |
| 44000.96366898149 | 40.663 |
| 44001.00533564815 | 40.663 |
| 44001.047002314815 | 40.547 |
| 44001.08866898149 | 40.605 |
| 44001.13033564815 | 40.74 |
| 44001.172002314815 | 40.74 |
| 44001.21366898149 | 40.605 |
| 44001.25533564815 | 40.76 |
| 44001.297002314815 | 40.74 |
| 44001.33866898149 | 40.663 |
| 44001.38033564815 | 40.76 |
| 44001.422002314815 | 40.895 |
| 44001.46366898149 | 41.319 |
| 44001.50533564815 | 42.806 |
| 44001.547002314815 | 42.246 |
| 44001.58866898149 | 41.377 |
| 44001.63033564815 | 41.435 |
| 44001.672002314815 | 41.937 |
| 44001.71366898149 | 41.899 |
| 44001.75533564815 | 41.841 |
| 44001.797002314815 | 41.59 |
| 44001.83866898149 | 41.146 |
| 44001.88033564815 | 40.837 |
| 44001.922002314815 | 40.663 |
| 44001.96366898149 | 40.47 |
| 44002.00533564815 | 40.335 |
| 44002.047002314815 | 40.142 |
| 44002.08866898149 | 40.007 |
| 44002.13033564815 | 39.756 |
| 44002.172002314815 | 39.505 |
| 44002.21366898149 | 39.408 |
| 44002.25533564815 | 39.312 |
| 44002.297002314815 | 39.35 |
| 44002.33866898149 | 39.775 |
| 44002.38033564815 | 40.489 |
| 44002.422002314815 | 41.551 |
| 44002.46366898149 | 42.787 |
| 44002.50533564815 | 43.694 |
| 44002.547002314815 | 44.447 |
| 44002.58866898149 | 44.794 |
| 44002.63033564815 | 44.91 |
| 44002.672002314815 | 44.814 |
| 44002.71366898149 | 44.466 |
| 44002.75533564815 | 43.945 |
| 44002.797002314815 | 43.559 |
| 44002.83866898149 | 43.211 |
| 44002.88033564815 | 42.787 |
| 44002.922002314815 | 42.439 |
| 44002.96366898149 | 42.227 |
| 44003.00533564815 | 42.265 |
| 44003.047002314815 | 42.362 |
| 44003.08866898149 | 42.323 |
| 44003.13033564815 | 42.092 |
| 44003.172002314815 | 42.014 |
| 44003.21366898149 | 42.014 |
| 44003.25533564815 | 42.034 |
| 44003.297002314815 | 42.169 |
| 44003.33866898149 | 42.671 |
| 44003.38033564815 | 43.559 |
| 44003.422002314815 | 44.64 |
| 44003.46366898149 | 45.277 |
| 44003.50533564815 | 46.204 |
| 44003.547002314815 | 47.632 |
| 44003.58866898149 | 47.15 |
| 44003.63033564815 | 47.439 |
| 44003.672002314815 | 47.883 |
| 44003.71366898149 | 47.632 |
| 44003.75533564815 | 47.265 |
| 44003.797002314815 | 47.343 |
| 44003.83866898149 | 46.841 |
| 44003.88033564815 | 46.532 |
| 44003.922002314815 | 46.358 |
| 44003.96366898149 | 46.416 |
| 44004.00533564815 | 46.3 |
| 44004.047002314815 | 46.281 |
| 44004.08866898149 | 46.204 |
| 44004.13033564815 | 46.165 |
| 44004.172002314815 | 46.184 |
| 44004.21366898149 | 46.204 |
| 44004.25533564815 | 46.165 |
| 44004.297002314815 | 46.281 |
| 44004.33866898149 | 46.628 |
| 44004.38033564815 | 47.42 |
| 44004.422002314815 | 49.177 |
| 44004.46366898149 | 54.119 |
| 44004.50533564815 | 55.026 |
| 44004.547002314815 | 55.431 |
| 44004.58866898149 | 55.625 |
| 44004.63033564815 | 55.682 |
| 44004.672002314815 | 54.852 |
| 44004.71366898149 | 54.196 |
| 44004.75533564815 | 53.25 |
| 44004.797002314815 | 53.038 |
| 44004.83866898149 | 53.984 |
| 44004.88033564815 | 53.655 |
| 44004.922002314815 | 53.385 |
| 44004.96366898149 | 53.211 |
| 44005.00533564815 | 53.076 |
| 44005.047002314815 | 52.922 |
| 44005.08866898149 | 52.69 |
| 44005.13033564815 | 52.555 |
| 44005.172002314815 | 52.458 |
| 44005.21366898149 | 52.285 |
| 44005.25533564815 | 52.227 |
| 44005.297002314815 | 52.227 |
| 44005.33866898149 | 52.652 |
| 44005.38033564815 | 53.443 |
| 44005.422002314815 | 54.698 |
| 44005.46366898149 | 55.682 |
| 44005.50533564815 | 56.416 |
| 44005.547002314815 | 57.671 |
| 44005.58866898149 | 58.018 |
| 44005.63033564815 | 57.922 |
| 44005.672002314815 | 57.478 |
| 44005.71366898149 | 56.686 |
| 44005.75533564815 | 56.107 |
| 44005.797002314815 | 55.489 |
| 44005.83866898149 | 55.219 |
| 44005.88033564815 | 54.852 |
| 44005.922002314815 | 54.389 |
| 44005.96366898149 | 54.157 |
| 44006.00533564815 | 53.984 |
| 44006.047002314815 | 53.964 |
| 44006.08866898149 | 53.829 |
| 44006.13033564815 | 53.829 |
| 44006.172002314815 | 53.694 |
| 44006.21366898149 | 53.52 |
| 44006.25533564815 | 53.482 |
| 44006.297002314815 | 53.559 |
| 44006.33866898149 | 53.829 |
| 44006.38033564815 | 54.563 |
| 44006.422002314815 | 55.586 |
| 44006.46366898149 | 56.474 |
| 44006.50533564815 | 56.609 |
| 44006.547002314815 | 57.555 |
| 44006.58866898149 | 57.767 |
| 44006.63033564815 | 58.076 |
| 44006.672002314815 | 59.293 |
| 44006.71366898149 | 59.08 |
| 44006.75533564815 | 57.883 |
| 44006.797002314815 | 56.551 |
| 44006.83866898149 | 56.339 |
| 44006.88033564815 | 55.702 |
| 44006.922002314815 | 55.374 |
| 44006.96366898149 | 55.161 |
| 44007.00533564815 | 54.987 |
| 44007.047002314815 | 54.814 |
| 44007.08866898149 | 54.698 |
| 44007.13033564815 | 54.505 |
| 44007.172002314815 | 54.486 |
| 44007.21366898149 | 54.582 |
| 44007.25533564815 | 54.524 |
| 44007.297002314815 | 54.524 |
| 44007.33866898149 | 54.698 |
| 44007.38033564815 | 55.296 |
| 44007.422002314815 | 55.933 |
| 44007.46366898149 | 56.551 |
| 44007.50533564815 | 56.899 |
| 44007.547002314815 | 56.995 |
| 44007.58866898149 | 55.972 |
| 44007.63033564815 | 56.088 |
| 44007.672002314815 | 56.764 |
| 44007.71366898149 | 56.686 |
| 44007.75533564815 | 56.204 |
| 44007.797002314815 | 55.798 |
| 44007.83866898149 | 55.586 |
| 44007.88033564815 | 55.084 |
| 44007.922002314815 | 54.659 |
| 44007.96366898149 | 54.756 |
| 44008.00533564815 | 54.949 |
| 44008.047002314815 | 54.968 |
| 44008.08866898149 | 54.852 |
| 44008.13033564815 | 54.775 |
| 44008.172002314815 | 54.698 |
| 44008.21366898149 | 54.543 |
| 44008.25533564815 | 54.486 |
| 44008.297002314815 | 54.563 |
| 44008.33866898149 | 54.872 |
| 44008.38033564815 | 55.451 |
| 44008.422002314815 | 56.242 |
| 44008.46366898149 | 57.208 |
| 44008.50533564815 | 58.057 |
| 44008.547002314815 | 58.598 |
| 44008.58866898149 | 58.269 |
| 44008.63033564815 | 58.038 |
| 44008.672002314815 | 57.903 |
| 44008.71366898149 | 57.401 |
| 44008.75533564815 | 56.551 |
| 44008.797002314815 | 56.339 |
| 44008.83866898149 | 55.393 |
| 44008.88033564815 | 54.698 |
| 44008.922002314815 | 54.35 |
| 44008.96366898149 | 54.466 |
| 44009.00533564815 | 54.659 |
| 44009.047002314815 | 54.505 |
| 44009.08866898149 | 54.312 |
| 44009.13033564815 | 54.312 |
| 44009.172002314815 | 54.621 |
| 44009.21366898149 | 54.756 |
| 44009.25533564815 | 54.852 |
| 44009.297002314815 | 55.084 |
| 44009.33866898149 | 55.451 |
| 44009.38033564815 | 56.011 |
| 44009.422002314815 | 56.686 |
| 44009.46366898149 | 57.053 |
| 44009.50533564815 | 57.401 |
| 44009.547002314815 | 57.748 |
| 44009.58866898149 | 57.381 |
| 44009.63033564815 | 57.092 |
| 44009.672002314815 | 56.513 |
| 44009.71366898149 | 56.146 |
| 44009.75533564815 | 55.663 |
| 44009.797002314815 | 55.2 |
| 44009.83866898149 | 55.219 |
| 44009.88033564815 | 55.489 |
| 44009.922002314815 | 55.605 |
| 44009.96366898149 | 55.625 |
| 44010.00533564815 | 55.412 |
| 44010.047002314815 | 55.374 |
| 44010.08866898149 | 55.277 |
| 44010.13033564815 | 55.181 |
| 44010.172002314815 | 55.219 |
| 44010.21366898149 | 55.123 |
| 44010.25533564815 | 55.026 |
| 44010.297002314815 | 55.142 |
| 44010.33866898149 | 55.412 |
| 44010.38033564815 | 55.914 |
| 44010.422002314815 | 55.972 |
| 44010.46366898149 | 56.069 |
| 44010.50533564815 | 56.957 |
| 44010.547002314815 | 57.71 |
| 44010.58866898149 | 58.366 |
| 44010.63033564815 | 58.366 |
| 44010.672002314815 | 58.25 |
| 44010.71366898149 | 57.825 |
| 44010.75533564815 | 57.227 |
| 44010.797002314815 | 56.86 |
| 44010.83866898149 | 56.435 |
| 44010.88033564815 | 56.204 |
| 44010.922002314815 | 55.991 |
| 44010.96366898149 | 55.856 |
| 44011.00533564815 | 55.779 |
| 44011.047002314815 | 55.702 |
| 44011.08866898149 | 55.644 |
| 44011.13033564815 | 55.682 |
| 44011.172002314815 | 55.682 |
| 44011.21366898149 | 55.644 |
| 44011.25533564815 | 55.528 |
| 44011.297002314815 | 55.567 |
| 44011.33866898149 | 55.76 |
| 44011.38033564815 | 56.088 |
| 44011.422002314815 | 56.918 |
| 44011.46366898149 | 58.154 |
| 44011.50533564815 | 58.462 |
| 44011.547002314815 | 58.617 |
| 44011.58866898149 | 58.752 |
| 44011.63033564815 | 58.636 |
| 44011.672002314815 | 58.849 |
| 44011.71366898149 | 58.578 |
| 44011.75533564815 | 58.52 |
| 44011.797002314815 | 58.231 |
| 44011.83866898149 | 58.192 |
| 44011.88033564815 | 57.941 |
| 44011.922002314815 | 57.671 |
| 44011.96366898149 | 57.401 |
| 44012.00533564815 | 57.15 |
| 44012.047002314815 | 56.841 |
| 44012.08866898149 | 56.686 |
| 44012.13033564815 | 56.416 |
| 44012.172002314815 | 56.262 |
| 44012.21366898149 | 56.088 |
| 44012.25533564815 | 55.991 |
| 44012.297002314815 | 55.933 |
| 44012.33866898149 | 55.953 |
| 44012.38033564815 | 56.049 |
| 44012.422002314815 | 57.072 |
| 44012.46366898149 | 57.632 |
| 44012.50533564815 | 58.018 |
| 44012.547002314815 | 58.289 |
| 44012.58866898149 | 58.52 |
| 44012.63033564815 | 58.057 |
| 44012.672002314815 | 57.748 |
| 44012.71366898149 | 56.937 |
| 44012.75533564815 | 56.146 |
| 44012.797002314815 | 55.277 |
| 44012.83866898149 | 54.891 |
| 44012.88033564815 | 54.563 |
| 44012.922002314815 | 54.524 |
| 44012.96366898149 | 54.563 |
| 44013.00533564815 | 54.794 |
| 44013.047002314815 | 54.794 |
| 44013.08866898149 | 54.659 |
| 44013.13033564815 | 54.601 |
| 44013.172002314815 | 54.524 |
| 44013.21366898149 | 54.35 |
| 44013.25533564815 | 54.312 |
| 44013.297002314815 | 54.37 |
| 44013.33866898149 | 54.582 |
| 44013.38033564815 | 55.451 |
| 44013.422002314815 | 56.455 |
| 44013.46366898149 | 57.208 |
| 44013.50533564815 | 57.922 |
| 44013.547002314815 | 58.424 |
| 44013.58866898149 | 58.52 |
| 44013.63033564815 | 58.617 |
| 44013.672002314815 | 58.308 |
| 44013.71366898149 | 57.632 |
| 44013.75533564815 | 57.806 |
| 44013.797002314815 | 57.767 |
| 44013.83866898149 | 57.478 |
| 44013.88033564815 | 57.323 |
| 44013.922002314815 | 57.246 |
| 44013.96366898149 | 57.439 |
| 44014.00533564815 | 57.13 |
| 44014.047002314815 | 56.995 |
| 44014.08866898149 | 56.783 |
| 44014.13033564815 | 56.493 |
| 44014.172002314815 | 56.3 |
| 44014.21366898149 | 56.126 |
| 44014.25533564815 | 55.953 |
| 44014.297002314815 | 55.972 |
| 44014.33866898149 | 56.242 |
| 44014.38033564815 | 56.802 |
| 44014.422002314815 | 57.883 |
| 44014.46366898149 | 58.81 |
| 44014.50533564815 | 59.196 |
| 44014.547002314815 | 59.466 |
| 44014.58866898149 | 59.794 |
| 44014.63033564815 | 60.354 |
| 44014.672002314815 | 59.717 |
| 44014.71366898149 | 59.37 |
| 44014.75533564815 | 58.366 |
| 44014.797002314815 | 58.154 |
| 44014.83866898149 | 57.71 |
| 44014.88033564815 | 57.304 |
| 44014.922002314815 | 57.072 |
| 44014.96366898149 | 56.957 |
| 44015.00533564815 | 56.86 |
| 44015.047002314815 | 56.783 |
| 44015.08866898149 | 56.628 |
| 44015.13033564815 | 56.377 |
| 44015.172002314815 | 56.146 |
| 44015.21366898149 | 55.933 |
| 44015.25533564815 | 55.76 |
| 44015.297002314815 | 55.721 |
| 44015.33866898149 | 56.262 |
| 44015.38033564815 | 56.937 |
| 44015.422002314815 | 58.211 |
| 44015.46366898149 | 59.119 |
| 44015.50533564815 | 59.949 |
| 44015.547002314815 | 60.47 |
| 44015.58866898149 | 59.389 |
| 44015.63033564815 | 59.852 |
| 44015.672002314815 | 60.779 |
| 44015.71366898149 | 60.895 |
| 44015.75533564815 | 60.354 |
| 44015.797002314815 | 59.563 |
| 44015.83866898149 | 59.37 |
| 44015.88033564815 | 59.235 |
| 44015.922002314815 | 59.042 |
| 44015.96366898149 | 58.926 |
| 44016.00533564815 | 58.598 |
| 44016.047002314815 | 58.462 |
| 44016.08866898149 | 58.231 |
| 44016.13033564815 | 58.038 |
| 44016.172002314815 | 57.883 |
| 44016.21366898149 | 57.671 |
| 44016.25533564815 | 57.478 |
| 44016.297002314815 | 57.401 |
| 44016.33866898149 | 57.632 |
| 44016.38033564815 | 58.269 |
| 44016.422002314815 | 59.428 |
| 44016.46366898149 | 60.567 |
| 44016.50533564815 | 61.281 |
| 44016.547002314815 | 61.397 |
| 44016.58866898149 | 59.621 |
| 44016.63033564815 | 58.945 |
| 44016.672002314815 | 58.289 |
| 44016.71366898149 | 58.057 |
| 44016.75533564815 | 58.134 |
| 44016.797002314815 | 57.941 |
| 44016.83866898149 | 57.69 |
| 44016.88033564815 | 57.401 |
| 44016.922002314815 | 57.169 |
| 44016.96366898149 | 56.899 |
| 44017.00533564815 | 56.744 |
| 44017.047002314815 | 56.59 |
| 44017.08866898149 | 56.397 |
| 44017.13033564815 | 56.281 |
| 44017.172002314815 | 56.146 |
| 44017.21366898149 | 56.049 |
| 44017.25533564815 | 55.856 |
| 44017.297002314815 | 55.856 |
| 44017.33866898149 | 56.184 |
| 44017.38033564815 | 56.86 |
| 44017.422002314815 | 58.154 |
| 44017.46366898149 | 59.37 |
| 44017.50533564815 | 60.47 |
| 44017.547002314815 | 60.142 |
| 44017.58866898149 | 61.049 |
| 44017.63033564815 | 60.296 |
| 44017.672002314815 | 60.991 |
| 44017.71366898149 | 60.412 |
| 44017.75533564815 | 59.563 |
| 44017.797002314815 | 59.157 |
| 44017.83866898149 | 58.81 |
| 44017.88033564815 | 58.501 |
| 44017.922002314815 | 58.211 |
| 44017.96366898149 | 57.729 |
| 44018.00533564815 | 57.265 |
| 44018.047002314815 | 57.13 |
| 44018.08866898149 | 57.015 |
| 44018.13033564815 | 56.783 |
| 44018.172002314815 | 56.57 |
| 44018.21366898149 | 56.358 |
| 44018.25533564815 | 56.204 |
| 44018.297002314815 | 56.146 |
| 44018.33866898149 | 56.397 |
| 44018.38033564815 | 57.092 |
| 44018.422002314815 | 58.462 |
| 44018.46366898149 | 59.91 |
| 44018.50533564815 | 59.582 |
| 44018.547002314815 | 61.011 |
| 44018.58866898149 | 60.721 |
| 44018.63033564815 | 60.528 |
| 44018.672002314815 | 57.285 |
| 44018.71366898149 | 54.408 |
| 44018.75533564815 | 53.617 |
| 44018.797002314815 | 53.018 |
| 44018.83866898149 | 52.729 |
| 44018.88033564815 | 52.304 |
| 44018.922002314815 | 52.053 |
| 44018.96366898149 | 51.802 |
| 44019.00533564815 | 51.397 |
| 44019.047002314815 | 51.223 |
| 44019.08866898149 | 51.069 |
| 44019.13033564815 | 51.069 |
| 44019.172002314815 | 50.605 |
| 44019.21366898149 | 50.393 |
| 44019.25533564815 | 50.161 |
| 44019.297002314815 | 49.93 |
| 44019.33866898149 | 50.258 |
| 44019.38033564815 | 50.798 |
| 44019.422002314815 | 51.86 |
| 44019.46366898149 | 52.613 |
| 44019.50533564815 | 52.208 |
| 44019.547002314815 | 51.802 |
| 44019.58866898149 | 51.86 |
| 44019.63033564815 | 52.111 |
| 44019.672002314815 | 52.265 |
| 44019.71366898149 | 52.285 |
| 44019.75533564815 | 51.802 |
| 44019.797002314815 | 51.339 |
| 44019.83866898149 | 50.682 |
| 44019.88033564815 | 49.987 |
| 44019.922002314815 | 49.466 |
| 44019.96366898149 | 49.157 |
| 44020.00533564815 | 48.964 |
| 44020.047002314815 | 48.636 |
| 44020.08866898149 | 48.308 |
| 44020.13033564815 | 48.018 |
| 44020.172002314815 | 47.729 |
| 44020.21366898149 | 47.401 |
| 44020.25533564815 | 47.15 |
| 44020.297002314815 | 47.15 |
| 44020.33866898149 | 47.343 |
| 44020.38033564815 | 47.98 |
| 44020.422002314815 | 49.331 |
| 44020.46366898149 | 50.47 |
| 44020.50533564815 | 51.281 |
| 44020.547002314815 | 51.86 |
| 44020.58866898149 | 51.995 |
| 44020.63033564815 | 51.609 |
| 44020.672002314815 | 50.953 |
| 44020.71366898149 | 50.335 |
| 44020.75533564815 | 49.582 |
| 44020.797002314815 | 48.848 |
| 44020.83866898149 | 48.096 |
| 44020.88033564815 | 47.748 |
| 44020.922002314815 | 47.458 |
| 44020.96366898149 | 47.265 |
| 44021.00533564815 | 46.899 |
| 44021.047002314815 | 46.667 |
| 44021.08866898149 | 46.397 |
| 44021.13033564815 | 46.068 |
| 44021.172002314815 | 45.76 |
| 44021.21366898149 | 45.451 |
| 44021.25533564815 | 45.258 |
| 44021.297002314815 | 45.084 |
| 44021.33866898149 | 45.277 |
| 44021.38033564815 | 45.837 |
| 44021.422002314815 | 47.053 |
| 44021.46366898149 | 47.709 |
| 44021.50533564815 | 49.312 |
| 44021.547002314815 | 50.084 |
| 44021.58866898149 | 50.296 |
| 44021.63033564815 | 49.93 |
| 44021.672002314815 | 49.679 |
| 44021.71366898149 | 48.984 |
| 44021.75533564815 | 48.153 |
| 44021.797002314815 | 47.265 |
| 44021.83866898149 | 46.474 |
| 44021.88033564815 | 45.76 |
| 44021.922002314815 | 45.123 |
| 44021.96366898149 | 44.756 |
| 44022.00533564815 | 44.466 |
| 44022.047002314815 | 44.196 |
| 44022.08866898149 | 43.771 |
| 44022.13033564815 | 43.482 |
| 44022.172002314815 | 43.134 |
| 44022.21366898149 | 42.883 |
| 44022.25533564815 | 42.98 |
| 44022.297002314815 | 42.458 |
| 44022.33866898149 | 42.613 |
| 44022.38033564815 | 43.327 |
| 44022.422002314815 | 44.698 |
| 44022.46366898149 | 46.358 |
| 44022.50533564815 | 47.458 |
| 44022.547002314815 | 48.25 |
| 44022.58866898149 | 48.694 |
| 44022.63033564815 | 48.694 |
| 44022.672002314815 | 48.231 |
| 44022.71366898149 | 47.401 |
| 44022.75533564815 | 46.59 |
| 44022.797002314815 | 45.779 |
| 44022.83866898149 | 44.929 |
| 44022.88033564815 | 44.177 |
| 44022.922002314815 | 43.617 |
| 44022.96366898149 | 43.25 |
| 44023.00533564815 | 42.941 |
| 44023.047002314815 | 42.594 |
| 44023.08866898149 | 42.304 |
| 44023.13033564815 | 42.072 |
| 44023.172002314815 | 41.841 |
| 44023.21366898149 | 41.59 |
| 44023.25533564815 | 41.339 |
| 44023.297002314815 | 41.204 |
| 44023.33866898149 | 41.377 |
| 44023.38033564815 | 42.092 |
| 44023.422002314815 | 43.482 |
| 44023.46366898149 | 45.296 |
| 44023.50533564815 | 46.783 |
| 44023.547002314815 | 47.787 |
| 44023.58866898149 | 48.076 |
| 44023.63033564815 | 48.192 |
| 44023.672002314815 | 47.767 |
| 44023.71366898149 | 47.072 |
| 44023.75533564815 | 46.262 |
| 44023.797002314815 | 45.451 |
| 44023.83866898149 | 44.814 |
| 44023.88033564815 | 44.35 |
| 44023.922002314815 | 43.81 |
| 44023.96366898149 | 43.424 |
| 44024.00533564815 | 43.134 |
| 44024.047002314815 | 43.057 |
| 44024.08866898149 | 42.613 |
| 44024.13033564815 | 42.478 |
| 44024.172002314815 | 42.285 |
| 44024.21366898149 | 42.092 |
| 44024.25533564815 | 41.918 |
| 44024.297002314815 | 41.802 |
| 44024.33866898149 | 42.014 |
| 44024.38033564815 | 42.729 |
| 44024.422002314815 | 44.08 |
| 44024.46366898149 | 45.702 |
| 44024.50533564815 | 46.648 |
| 44024.547002314815 | 46.57 |
| 44024.58866898149 | 45.277 |
| 44024.63033564815 | 44.331 |
| 44024.672002314815 | 45.721 |
| 44024.71366898149 | 46.86 |
| 44024.75533564815 | 46.609 |
| 44024.797002314815 | 45.644 |
| 44024.83866898149 | 44.543 |
| 44024.88033564815 | 44.157 |
| 44024.922002314815 | 43.868 |
| 44024.96366898149 | 43.578 |
| 44025.00533564815 | 43.482 |
| 44025.047002314815 | 43.79 |
| 44025.08866898149 | 43.559 |
| 44025.13033564815 | 43.501 |
| 44025.172002314815 | 43.173 |
| 44025.21366898149 | 42.941 |
| 44025.25533564815 | 42.729 |
| 44025.297002314815 | 42.748 |
| 44025.33866898149 | 42.845 |
| 44025.38033564815 | 43.501 |
| 44025.422002314815 | 44.485 |
| 44025.46366898149 | 44.292 |
| 44025.50533564815 | 43.926 |
| 44025.547002314815 | 45.74 |
| 44025.58866898149 | 47.053 |
| 44025.63033564815 | 46.57 |
| 44025.672002314815 | 46.841 |
| 44025.71366898149 | 45.953 |
| 44025.75533564815 | 45.76 |
| 44025.797002314815 | 45.161 |
| 44025.83866898149 | 44.215 |
| 44025.88033564815 | 43.559 |
| 44025.922002314815 | 43.366 |
| 44025.96366898149 | 43.231 |
| 44026.00533564815 | 43.192 |
| 44026.047002314815 | 43.057 |
| 44026.08866898149 | 42.787 |
| 44026.13033564815 | 42.613 |
| 44026.172002314815 | 42.362 |
| 44026.21366898149 | 42.285 |
| 44026.25533564815 | 42.265 |
| 44026.297002314815 | 42.227 |
| 44026.33866898149 | 42.362 |
| 44026.38033564815 | 42.825 |
| 44026.422002314815 | 43.54 |
| 44026.46366898149 | 45.026 |
| 44026.50533564815 | 45.76 |
| 44026.547002314815 | 46.744 |
| 44026.58866898149 | 47.265 |
| 44026.63033564815 | 47.053 |
| 44026.672002314815 | 45.373 |
| 44026.71366898149 | 44.814 |
| 44026.75533564815 | 44.601 |
| 44026.797002314815 | 44.119 |
| 44026.83866898149 | 43.636 |
| 44026.88033564815 | 43.366 |
| 44026.922002314815 | 43.192 |
| 44026.96366898149 | 43.25 |
| 44027.00533564815 | 43.269 |
| 44027.047002314815 | 43.038 |
| 44027.08866898149 | 42.632 |
| 44027.13033564815 | 42.458 |
| 44027.172002314815 | 42.343 |
| 44027.21366898149 | 42.227 |
| 44027.25533564815 | 42.014 |
| 44027.297002314815 | 41.956 |
| 44027.33866898149 | 42.014 |
| 44027.38033564815 | 42.69 |
| 44027.422002314815 | 44.099 |
| 44027.46366898149 | 46.455 |
| 44027.50533564815 | 47.246 |
| 44027.547002314815 | 47.864 |
| 44027.58866898149 | 47.709 |
| 44027.63033564815 | 46.513 |
| 44027.672002314815 | 46.397 |
| 44027.71366898149 | 45.798 |
| 44027.75533564815 | 44.949 |
| 44027.797002314815 | 44.35 |
| 44027.83866898149 | 44.003 |
| 44027.88033564815 | 43.617 |
| 44027.922002314815 | 43.327 |
| 44027.96366898149 | 43.038 |
| 44028.00533564815 | 42.709 |
| 44028.047002314815 | 42.574 |
| 44028.08866898149 | 42.362 |
| 44028.13033564815 | 42.15 |
| 44028.172002314815 | 42.034 |
| 44028.21366898149 | 41.976 |
| 44028.25533564815 | 41.899 |
| 44028.297002314815 | 41.841 |
| 44028.33866898149 | 41.995 |
| 44028.38033564815 | 42.69 |
| 44028.422002314815 | 43.945 |
| 44028.46366898149 | 45.779 |
| 44028.50533564815 | 46.783 |
| 44028.547002314815 | 47.729 |
| 44028.58866898149 | 46.686 |
| 44028.63033564815 | 44.987 |
| 44028.672002314815 | 44.292 |
| 44028.71366898149 | 44.119 |
| 44028.75533564815 | 43.578 |
| 44028.797002314815 | 43.424 |
| 44028.83866898149 | 43.346 |
| 44028.88033564815 | 43.134 |
| 44028.922002314815 | 42.98 |
| 44028.96366898149 | 42.651 |
| 44029.00533564815 | 42.439 |
| 44029.047002314815 | 42.285 |
| 44029.08866898149 | 42.188 |
| 44029.13033564815 | 41.995 |
| 44029.172002314815 | 41.821 |
| 44029.21366898149 | 41.686 |
| 44029.25533564815 | 41.532 |
| 44029.297002314815 | 41.628 |
| 44029.33866898149 | 41.918 |
| 44029.38033564815 | 42.555 |
| 44029.422002314815 | 43.868 |
| 44029.46366898149 | 45.798 |
| 44029.50533564815 | 45.103 |
| 44029.547002314815 | 46.59 |
| 44029.58866898149 | 47.169 |
| 44029.63033564815 | 46.609 |
| 44029.672002314815 | 45.837 |
| 44029.71366898149 | 45.895 |
| 44029.75533564815 | 45.2 |
| 44029.797002314815 | 44.119 |
| 44029.83866898149 | 43.829 |
| 44029.88033564815 | 43.327 |
| 44029.922002314815 | 42.902 |
| 44029.96366898149 | 42.806 |
| 44030.00533564815 | 42.748 |
| 44030.047002314815 | 42.497 |
| 44030.08866898149 | 42.362 |
| 44030.13033564815 | 42.227 |
| 44030.172002314815 | 42.169 |
| 44030.21366898149 | 42.053 |
| 44030.25533564815 | 41.918 |
| 44030.297002314815 | 41.841 |
| 44030.33866898149 | 41.976 |
| 44030.38033564815 | 42.748 |
| 44030.422002314815 | 44.408 |
| 44030.46366898149 | 46.223 |
| 44030.50533564815 | 46.377 |
| 44030.547002314815 | 45.644 |
| 44030.58866898149 | 45.219 |
| 44030.63033564815 | 45.509 |
| 44030.672002314815 | 45.412 |
| 44030.71366898149 | 45.74 |
| 44030.75533564815 | 45.316 |
| 44030.797002314815 | 44.428 |
| 44030.83866898149 | 43.926 |
| 44030.88033564815 | 43.346 |
| 44030.922002314815 | 43.018 |
| 44030.96366898149 | 42.69 |
| 44031.00533564815 | 42.516 |
| 44031.047002314815 | 42.42 |
| 44031.08866898149 | 42.265 |
| 44031.13033564815 | 42.188 |
| 44031.172002314815 | 42.111 |
| 44031.21366898149 | 42.034 |
| 44031.25533564815 | 42.034 |
| 44031.297002314815 | 42.072 |
| 44031.33866898149 | 42.265 |
| 44031.38033564815 | 42.806 |
| 44031.422002314815 | 43.964 |
| 44031.46366898149 | 45.47 |
| 44031.50533564815 | 45.721 |
| 44031.547002314815 | 45.451 |
| 44031.58866898149 | 44.775 |
| 44031.63033564815 | 44.292 |
| 44031.672002314815 | 43.868 |
| 44031.71366898149 | 43.984 |
| 44031.75533564815 | 43.829 |
| 44031.797002314815 | 43.52 |
| 44031.83866898149 | 43.153 |
| 44031.88033564815 | 42.941 |
| 44031.922002314815 | 42.825 |
| 44031.96366898149 | 42.536 |
| 44032.00533564815 | 42.265 |
| 44032.047002314815 | 42.111 |
| 44032.08866898149 | 41.937 |
| 44032.13033564815 | 41.783 |
| 44032.172002314815 | 41.628 |
| 44032.21366898149 | 41.551 |
| 44032.25533564815 | 41.493 |
| 44032.297002314815 | 41.551 |
| 44032.33866898149 | 41.744 |
| 44032.38033564815 | 42.497 |
| 44032.422002314815 | 43.926 |
| 44032.46366898149 | 45.76 |
| 44032.50533564815 | 47.092 |
| 44032.547002314815 | 48.057 |
| 44032.58866898149 | 47.883 |
| 44032.63033564815 | 47.42 |
| 44032.672002314815 | 46.995 |
| 44032.71366898149 | 46.493 |
| 44032.75533564815 | 45.509 |
| 44032.797002314815 | 44.524 |
| 44032.83866898149 | 43.733 |
| 44032.88033564815 | 43.095 |
| 44032.922002314815 | 42.709 |
| 44032.96366898149 | 42.516 |
| 44033.00533564815 | 42.343 |
| 44033.047002314815 | 42.246 |
| 44033.08866898149 | 42.13 |
| 44033.13033564815 | 42.072 |
| 44033.172002314815 | 41.879 |
| 44033.21366898149 | 41.802 |
| 44033.25533564815 | 41.706 |
| 44033.297002314815 | 41.686 |
| 44033.33866898149 | 41.918 |
| 44033.38033564815 | 42.632 |
| 44033.422002314815 | 44.138 |
| 44033.46366898149 | 45.798 |
| 44033.50533564815 | 46.783 |
| 44033.547002314815 | 46.937 |
| 44033.58866898149 | 47.536 |
| 44033.63033564815 | 47.69 |
| 44033.672002314815 | 45.914 |
| 44033.71366898149 | 45.103 |
| 44033.75533564815 | 44.563 |
| 44033.797002314815 | 44.254 |
| 44033.83866898149 | 43.926 |
| 44033.88033564815 | 43.269 |
| 44033.922002314815 | 42.96 |
| 44033.96366898149 | 42.864 |
| 44034.00533564815 | 42.69 |
| 44034.047002314815 | 42.439 |
| 44034.08866898149 | 42.343 |
| 44034.13033564815 | 42.265 |
| 44034.172002314815 | 42.13 |
| 44034.21366898149 | 41.976 |
| 44034.25533564815 | 41.841 |
| 44034.297002314815 | 41.937 |
| 44034.33866898149 | 42.092 |
| 44034.38033564815 | 42.69 |
| 44034.422002314815 | 43.984 |
| 44034.46366898149 | 45.238 |
| 44034.50533564815 | 45.393 |
| 44034.547002314815 | 46.744 |
| 44034.58866898149 | 45.644 |
| 44034.63033564815 | 45.296 |
| 44034.672002314815 | 45.509 |
| 44034.71366898149 | 44.157 |
| 44034.75533564815 | 43.868 |
| 44034.797002314815 | 43.964 |
| 44034.83866898149 | 43.617 |
| 44034.88033564815 | 43.289 |
| 44034.922002314815 | 42.98 |
| 44034.96366898149 | 42.787 |
| 44035.00533564815 | 42.671 |
| 44035.047002314815 | 42.594 |
| 44035.08866898149 | 42.536 |
| 44035.13033564815 | 42.516 |
| 44035.172002314815 | 42.381 |
| 44035.21366898149 | 42.207 |
| 44035.25533564815 | 42.034 |
| 44035.297002314815 | 41.918 |
| 44035.33866898149 | 42.13 |
| 44035.38033564815 | 42.825 |
| 44035.422002314815 | 44.254 |
| 44035.46366898149 | 45.991 |
| 44035.50533564815 | 47.401 |
| 44035.547002314815 | 46.455 |
| 44035.58866898149 | 46.493 |
| 44035.63033564815 | 47.613 |
| 44035.672002314815 | 46.474 |
| 44035.71366898149 | 44.833 |
| 44035.75533564815 | 45.2 |
| 44035.797002314815 | 44.872 |
| 44035.83866898149 | 44.119 |
| 44035.88033564815 | 43.713 |
| 44035.922002314815 | 43.501 |
| 44035.96366898149 | 43.462 |
| 44036.00533564815 | 43.134 |
| 44036.047002314815 | 42.922 |
| 44036.08866898149 | 42.883 |
| 44036.13033564815 | 42.845 |
| 44036.172002314815 | 42.748 |
| 44036.21366898149 | 42.709 |
| 44036.25533564815 | 42.651 |
| 44036.297002314815 | 42.651 |
| 44036.33866898149 | 42.709 |
| 44036.38033564815 | 43.057 |
| 44036.422002314815 | 44.331 |
| 44036.46366898149 | 44.814 |
| 44036.50533564815 | 45.798 |
| 44036.547002314815 | 46.686 |
| 44036.58866898149 | 46.841 |
| 44036.63033564815 | 46.339 |
| 44036.672002314815 | 46.493 |
| 44036.71366898149 | 46.03 |
| 44036.75533564815 | 45.045 |
| 44036.797002314815 | 44.428 |
| 44036.83866898149 | 44.061 |
| 44036.88033564815 | 43.655 |
| 44036.922002314815 | 43.424 |
| 44036.96366898149 | 43.54 |
| 44037.00533564815 | 43.79 |
| 44037.047002314815 | 43.559 |
| 44037.08866898149 | 43.25 |
| 44037.13033564815 | 43.095 |
| 44037.172002314815 | 43.018 |
| 44037.21366898149 | 42.941 |
| 44037.25533564815 | 42.787 |
| 44037.297002314815 | 42.767 |
| 44037.33866898149 | 43.076 |
| 44037.38033564815 | 43.559 |
| 44037.422002314815 | 44.022 |
| 44037.46366898149 | 45.103 |
| 44037.50533564815 | 45.084 |
| 44037.547002314815 | 44.64 |
| 44037.58866898149 | 44.273 |
| 44037.63033564815 | 45.412 |
| 44037.672002314815 | 45.837 |
| 44037.71366898149 | 45.084 |
| 44037.75533564815 | 44.794 |
| 44037.797002314815 | 44.679 |
| 44037.83866898149 | 44.234 |
| 44037.88033564815 | 44.003 |
| 44037.922002314815 | 44.234 |
| 44037.96366898149 | 44.177 |
| 44038.00533564815 | 43.829 |
| 44038.047002314815 | 43.424 |
| 44038.08866898149 | 43.231 |
| 44038.13033564815 | 43.038 |
| 44038.172002314815 | 42.825 |
| 44038.21366898149 | 42.748 |
| 44038.25533564815 | 42.69 |
| 44038.297002314815 | 42.69 |
| 44038.33866898149 | 42.941 |
| 44038.38033564815 | 43.424 |
| 44038.422002314815 | 44.543 |
| 44038.46366898149 | 46.435 |
| 44038.50533564815 | 46.86 |
| 44038.547002314815 | 47.922 |
| 44038.58866898149 | 48.25 |
| 44038.63033564815 | 46.937 |
| 44038.672002314815 | 45.74 |
| 44038.71366898149 | 45.431 |
| 44038.75533564815 | 45.895 |
| 44038.797002314815 | 45.161 |
| 44038.83866898149 | 44.466 |
| 44038.88033564815 | 43.887 |
| 44038.922002314815 | 43.52 |
| 44038.96366898149 | 43.211 |
| 44039.00533564815 | 43.057 |
| 44039.047002314815 | 42.98 |
| 44039.08866898149 | 42.845 |
| 44039.13033564815 | 42.709 |
| 44039.172002314815 | 42.555 |
| 44039.21366898149 | 42.4 |
| 44039.25533564815 | 42.343 |
| 44039.297002314815 | 42.227 |
| 44039.33866898149 | 42.42 |
| 44039.38033564815 | 43.038 |
| 44039.422002314815 | 44.196 |
| 44039.46366898149 | 45.605 |
| 44039.50533564815 | 47.092 |
| 44039.547002314815 | 48.231 |
| 44039.58866898149 | 48.076 |
| 44039.63033564815 | 46.841 |
| 44039.672002314815 | 46.763 |
| 44039.71366898149 | 46.455 |
| 44039.75533564815 | 45.644 |
| 44039.797002314815 | 45.103 |
| 44039.83866898149 | 44.273 |
| 44039.88033564815 | 43.713 |
| 44039.922002314815 | 43.308 |
| 44039.96366898149 | 43.038 |
| 44040.00533564815 | 42.922 |
| 44040.047002314815 | 42.806 |
| 44040.08866898149 | 42.69 |
| 44040.13033564815 | 42.632 |
| 44040.172002314815 | 42.555 |
| 44040.21366898149 | 42.497 |
| 44040.25533564815 | 42.42 |
| 44040.297002314815 | 42.478 |
| 44040.33866898149 | 42.632 |
| 44040.38033564815 | 42.96 |
| 44040.422002314815 | 43.269 |
| 44040.46366898149 | 44.041 |
| 44040.50533564815 | 44.756 |
| 44040.547002314815 | 45.296 |
| 44040.58866898149 | 44.659 |
| 44040.63033564815 | 45.605 |
| 44040.672002314815 | 46.648 |
| 44040.71366898149 | 45.953 |
| 44040.75533564815 | 44.64 |
| 44040.797002314815 | 44.466 |
| 44040.83866898149 | 44.003 |
| 44040.88033564815 | 43.366 |
| 44040.922002314815 | 42.941 |
| 44040.96366898149 | 42.709 |
| 44041.00533564815 | 42.651 |
| 44041.047002314815 | 42.536 |
| 44041.08866898149 | 42.478 |
| 44041.13033564815 | 42.439 |
| 44041.172002314815 | 42.227 |
| 44041.21366898149 | 41.995 |
| 44041.25533564815 | 41.879 |
| 44041.297002314815 | 41.937 |
| 44041.33866898149 | 42.13 |
| 44041.38033564815 | 42.787 |
| 44041.422002314815 | 44.041 |
| 44041.46366898149 | 45.76 |
| 44041.50533564815 | 47.053 |
| 44041.547002314815 | 47.381 |
| 44041.58866898149 | 47.207 |
| 44041.63033564815 | 46.937 |
| 44041.672002314815 | 46.416 |
| 44041.71366898149 | 46.204 |
| 44041.75533564815 | 45.547 |
| 44041.797002314815 | 44.775 |
| 44041.83866898149 | 43.79 |
| 44041.88033564815 | 43.173 |
| 44041.922002314815 | 42.806 |
| 44041.96366898149 | 42.632 |
| 44042.00533564815 | 42.458 |
| 44042.047002314815 | 42.323 |
| 44042.08866898149 | 42.188 |
| 44042.13033564815 | 42.13 |
| 44042.172002314815 | 41.995 |
| 44042.21366898149 | 41.879 |
| 44042.25533564815 | 41.706 |
| 44042.297002314815 | 41.725 |
| 44042.33866898149 | 41.995 |
| 44042.38033564815 | 42.787 |
| 44042.422002314815 | 44.177 |
| 44042.46366898149 | 46.068 |
| 44042.50533564815 | 47.285 |
| 44042.547002314815 | 48.096 |
| 44042.58866898149 | 48.192 |
| 44042.63033564815 | 48.153 |
| 44042.672002314815 | 47.671 |
| 44042.71366898149 | 46.918 |
| 44042.75533564815 | 45.895 |
| 44042.797002314815 | 44.833 |
| 44042.83866898149 | 44.061 |
| 44042.88033564815 | 43.52 |
| 44042.922002314815 | 43.231 |
| 44042.96366898149 | 43.095 |
| 44043.00533564815 | 42.864 |
| 44043.047002314815 | 42.651 |
| 44043.08866898149 | 42.497 |
| 44043.13033564815 | 42.304 |
| 44043.172002314815 | 42.13 |
| 44043.21366898149 | 41.995 |
| 44043.25533564815 | 41.899 |
| 44043.297002314815 | 41.841 |
| 44043.33866898149 | 42.014 |
| 44043.38033564815 | 42.651 |
| 44043.422002314815 | 44.022 |
| 44043.46366898149 | 45.895 |
| 44043.50533564815 | 47.265 |
| 44043.547002314815 | 48.153 |
| 44043.58866898149 | 48.559 |
| 44043.63033564815 | 48.25 |
| 44043.672002314815 | 47.304 |
| 44043.71366898149 | 46.455 |
| 44043.75533564815 | 45.74 |
| 44043.797002314815 | 45.2 |
| 44043.83866898149 | 44.312 |
| 44043.88033564815 | 43.578 |
| 44043.922002314815 | 43.308 |
| 44043.96366898149 | 43.115 |
| 44044.00533564815 | 42.941 |
| 44044.047002314815 | 42.748 |
| 44044.08866898149 | 42.574 |
| 44044.13033564815 | 42.516 |
| 44044.172002314815 | 42.381 |
| 44044.21366898149 | 42.227 |
| 44044.25533564815 | 42.053 |
| 44044.297002314815 | 41.956 |
| 44044.33866898149 | 42.13 |
| 44044.38033564815 | 42.806 |
| 44044.422002314815 | 44.08 |
| 44044.46366898149 | 45.76 |
| 44044.50533564815 | 47.053 |
| 44044.547002314815 | 47.98 |
| 44044.58866898149 | 48.327 |
| 44044.63033564815 | 48.308 |
| 44044.672002314815 | 47.13 |
| 44044.71366898149 | 45.489 |
| 44044.75533564815 | 45.103 |
| 44044.797002314815 | 44.621 |
| 44044.83866898149 | 44.138 |
| 44044.88033564815 | 43.733 |
| 44044.922002314815 | 43.578 |
| 44044.96366898149 | 43.617 |
| 44045.00533564815 | 43.308 |
| 44045.047002314815 | 42.96 |
| 44045.08866898149 | 42.806 |
| 44045.13033564815 | 42.748 |
| 44045.172002314815 | 42.574 |
| 44045.21366898149 | 42.497 |
| 44045.25533564815 | 42.362 |
| 44045.297002314815 | 42.246 |
| 44045.33866898149 | 42.362 |
| 44045.38033564815 | 42.96 |
| 44045.422002314815 | 44.292 |
| 44045.46366898149 | 46.03 |
| 44045.50533564815 | 47.343 |
| 44045.547002314815 | 47.864 |
| 44045.58866898149 | 48.559 |
| 44045.63033564815 | 48.153 |
| 44045.672002314815 | 46.821 |
| 44045.71366898149 | 45.586 |
| 44045.75533564815 | 45.18 |
| 44045.797002314815 | 44.833 |
| 44045.83866898149 | 44.138 |
| 44045.88033564815 | 43.713 |
| 44045.922002314815 | 43.308 |
| 44045.96366898149 | 43.076 |
| 44046.00533564815 | 42.883 |
| 44046.047002314815 | 42.748 |
| 44046.08866898149 | 42.69 |
| 44046.13033564815 | 42.536 |
| 44046.172002314815 | 42.439 |
| 44046.21366898149 | 42.323 |
| 44046.25533564815 | 42.227 |
| 44046.297002314815 | 42.227 |
| 44046.33866898149 | 42.42 |
| 44046.38033564815 | 43.018 |
| 44046.422002314815 | 44.37 |
| 44046.46366898149 | 46.262 |
| 44046.50533564815 | 46.686 |
| 44046.547002314815 | 45.702 |
| 44046.58866898149 | 45.624 |
| 44046.63033564815 | 45.316 |
| 44046.672002314815 | 46.126 |
| 44046.71366898149 | 45.933 |
| 44046.75533564815 | 45.123 |
| 44046.797002314815 | 44.466 |
| 44046.83866898149 | 43.81 |
| 44046.88033564815 | 43.52 |
| 44046.922002314815 | 43.25 |
| 44046.96366898149 | 43.173 |
| 44047.00533564815 | 43.095 |
| 44047.047002314815 | 42.922 |
| 44047.08866898149 | 42.922 |
| 44047.13033564815 | 42.902 |
| 44047.172002314815 | 42.806 |
| 44047.21366898149 | 42.536 |
| 44047.25533564815 | 42.478 |
| 44047.297002314815 | 42.497 |
| 44047.33866898149 | 42.748 |
| 44047.38033564815 | 43.308 |
| 44047.422002314815 | 44.428 |
| 44047.46366898149 | 46.011 |
| 44047.50533564815 | 46.879 |
| 44047.547002314815 | 47.053 |
| 44047.58866898149 | 46.841 |
| 44047.63033564815 | 47.246 |
| 44047.672002314815 | 46.397 |
| 44047.71366898149 | 46.03 |
| 44047.75533564815 | 45.509 |
| 44047.797002314815 | 44.64 |
| 44047.83866898149 | 43.945 |
| 44047.88033564815 | 43.462 |
| 44047.922002314815 | 43.173 |
| 44047.96366898149 | 42.941 |
| 44048.00533564815 | 43.057 |
| 44048.047002314815 | 43.115 |
| 44048.08866898149 | 43.173 |
| 44048.13033564815 | 42.941 |
| 44048.172002314815 | 42.806 |
| 44048.21366898149 | 42.748 |
| 44048.25533564815 | 42.651 |
| 44048.297002314815 | 42.555 |
| 44048.33866898149 | 42.748 |
| 44048.38033564815 | 43.308 |
| 44048.422002314815 | 44.582 |
| 44048.46366898149 | 46.184 |
| 44048.50533564815 | 47.516 |
| 44048.547002314815 | 48.134 |
| 44048.58866898149 | 47.034 |
| 44048.63033564815 | 47.362 |
| 44048.672002314815 | 47.072 |
| 44048.71366898149 | 46.821 |
| 44048.75533564815 | 45.991 |
| 44048.797002314815 | 45.103 |
| 44048.83866898149 | 44.485 |
| 44048.88033564815 | 43.655 |
| 44048.922002314815 | 43.346 |
| 44048.96366898149 | 43.327 |
| 44049.00533564815 | 43.25 |
| 44049.047002314815 | 43.095 |
| 44049.08866898149 | 42.999 |
| 44049.13033564815 | 43.038 |
| 44049.172002314815 | 42.999 |
| 44049.21366898149 | 42.98 |
| 44049.25533564815 | 42.98 |
| 44049.297002314815 | 42.98 |
| 44049.33866898149 | 43.057 |
| 44049.38033564815 | 43.636 |
| 44049.422002314815 | 44.428 |
| 44049.46366898149 | 46.493 |
| 44049.50533564815 | 46.223 |
| 44049.547002314815 | 47.053 |
| 44049.58866898149 | 46.397 |
| 44049.63033564815 | 46.165 |
| 44049.672002314815 | 45.644 |
| 44049.71366898149 | 45.875 |
| 44049.75533564815 | 45.509 |
| 44049.797002314815 | 44.601 |
| 44049.83866898149 | 43.868 |
| 44049.88033564815 | 43.733 |
| 44049.922002314815 | 43.134 |
| 44049.96366898149 | 42.787 |
| 44050.00533564815 | 42.536 |
| 44050.047002314815 | 42.304 |
| 44050.08866898149 | 42.188 |
| 44050.13033564815 | 42.092 |
| 44050.172002314815 | 42.014 |
| 44050.21366898149 | 41.937 |
| 44050.25533564815 | 41.86 |
| 44050.297002314815 | 41.821 |
| 44050.33866898149 | 42.072 |
| 44050.38033564815 | 42.709 |
| 44050.422002314815 | 44.196 |
| 44050.46366898149 | 46.068 |
| 44050.50533564815 | 47.323 |
| 44050.547002314815 | 48.038 |
| 44050.58866898149 | 48.443 |
| 44050.63033564815 | 48.385 |
| 44050.672002314815 | 47.748 |
| 44050.71366898149 | 46.783 |
| 44050.75533564815 | 45.721 |
| 44050.797002314815 | 44.698 |
| 44050.83866898149 | 43.887 |
| 44050.88033564815 | 43.385 |
| 44050.922002314815 | 42.98 |
| 44050.96366898149 | 42.787 |
| 44051.00533564815 | 42.574 |
| 44051.047002314815 | 42.381 |
| 44051.08866898149 | 42.188 |
| 44051.13033564815 | 42.072 |
| 44051.172002314815 | 41.956 |
| 44051.21366898149 | 41.86 |
| 44051.25533564815 | 41.802 |
| 44051.297002314815 | 41.706 |
| 44051.33866898149 | 41.899 |
| 44051.38033564815 | 42.613 |
| 44051.422002314815 | 44.041 |
| 44051.46366898149 | 45.856 |
| 44051.50533564815 | 47.15 |
| 44051.547002314815 | 47.922 |
| 44051.58866898149 | 48.327 |
| 44051.63033564815 | 48.192 |
| 44051.672002314815 | 47.613 |
| 44051.71366898149 | 46.725 |
| 44051.75533564815 | 45.644 |
| 44051.797002314815 | 44.466 |
| 44051.83866898149 | 43.675 |
| 44051.88033564815 | 43.134 |
| 44051.922002314815 | 42.922 |
| 44051.96366898149 | 42.748 |
| 44052.00533564815 | 42.536 |
| 44052.047002314815 | 42.42 |
| 44052.08866898149 | 42.304 |
| 44052.13033564815 | 42.188 |
| 44052.172002314815 | 42.111 |
| 44052.21366898149 | 41.937 |
| 44052.25533564815 | 41.899 |
| 44052.297002314815 | 41.899 |
| 44052.33866898149 | 42.092 |
| 44052.38033564815 | 42.69 |
| 44052.422002314815 | 44.022 |
| 44052.46366898149 | 45.991 |
| 44052.50533564815 | 47.207 |
| 44052.547002314815 | 47.98 |
| 44052.58866898149 | 48.25 |
| 44052.63033564815 | 47.941 |
| 44052.672002314815 | 47.343 |
| 44052.71366898149 | 46.532 |
| 44052.75533564815 | 45.47 |
| 44052.797002314815 | 44.582 |
| 44052.83866898149 | 43.829 |
| 44052.88033564815 | 43.424 |
| 44052.922002314815 | 43.115 |
| 44052.96366898149 | 42.922 |
| 44053.00533564815 | 42.787 |
| 44053.047002314815 | 42.69 |
| 44053.08866898149 | 42.594 |
| 44053.13033564815 | 42.439 |
| 44053.172002314815 | 42.343 |
| 44053.21366898149 | 42.323 |
| 44053.25533564815 | 42.285 |
| 44053.297002314815 | 42.188 |
| 44053.33866898149 | 42.323 |
| 44053.38033564815 | 42.902 |
| 44053.422002314815 | 44.138 |
| 44053.46366898149 | 45.76 |
| 44053.50533564815 | 46.493 |
| 44053.547002314815 | 47.613 |
| 44053.58866898149 | 48.482 |
| 44053.63033564815 | 48.057 |
| 44053.672002314815 | 47.053 |
| 44053.71366898149 | 45.875 |
| 44053.75533564815 | 45.084 |
| 44053.797002314815 | 44.505 |
| 44053.83866898149 | 43.906 |
| 44053.88033564815 | 43.443 |
| 44053.922002314815 | 43.231 |
| 44053.96366898149 | 42.941 |
| 44054.00533564815 | 42.671 |
| 44054.047002314815 | 42.516 |
| 44054.08866898149 | 42.42 |
| 44054.13033564815 | 42.343 |
| 44054.172002314815 | 42.323 |
| 44054.21366898149 | 42.285 |
| 44054.25533564815 | 42.246 |
| 44054.297002314815 | 42.188 |
| 44054.33866898149 | 42.42 |
| 44054.38033564815 | 42.787 |
| 44054.422002314815 | 43.906 |
| 44054.46366898149 | 45.316 |
| 44054.50533564815 | 45.412 |
| 44054.547002314815 | 46.474 |
| 44054.58866898149 | 47.883 |
| 44054.63033564815 | 47.053 |
| 44054.672002314815 | 47.207 |
| 44054.71366898149 | 46.57 |
| 44054.75533564815 | 45.451 |
| 44054.797002314815 | 44.756 |
| 44054.83866898149 | 43.771 |
| 44054.88033564815 | 43.211 |
| 44054.922002314815 | 42.864 |
| 44054.96366898149 | 42.651 |
| 44055.00533564815 | 42.42 |
| 44055.047002314815 | 42.285 |
| 44055.08866898149 | 42.227 |
| 44055.13033564815 | 42.072 |
| 44055.172002314815 | 42.053 |
| 44055.21366898149 | 41.899 |
| 44055.25533564815 | 41.841 |
| 44055.297002314815 | 41.821 |
| 44055.33866898149 | 42.169 |
| 44055.38033564815 | 42.748 |
| 44055.422002314815 | 43.887 |
| 44055.46366898149 | 45.663 |
| 44055.50533564815 | 46.011 |
| 44055.547002314815 | 46.744 |
| 44055.58866898149 | 47.111 |
| 44055.63033564815 | 47.111 |
| 44055.672002314815 | 46.628 |
| 44055.71366898149 | 46.281 |
| 44055.75533564815 | 45.123 |
| 44055.797002314815 | 44.35 |
| 44055.83866898149 | 43.559 |
| 44055.88033564815 | 43.038 |
| 44055.922002314815 | 42.825 |
| 44055.96366898149 | 42.69 |
| 44056.00533564815 | 42.42 |
| 44056.047002314815 | 42.188 |
| 44056.08866898149 | 42.111 |
| 44056.13033564815 | 41.976 |
| 44056.172002314815 | 41.879 |
| 44056.21366898149 | 41.725 |
| 44056.25533564815 | 41.628 |
| 44056.297002314815 | 41.551 |
| 44056.33866898149 | 41.899 |
| 44056.38033564815 | 42.613 |
| 44056.422002314815 | 44.37 |
| 44056.46366898149 | 46.319 |
| 44056.50533564815 | 48.25 |
| 44056.547002314815 | 48.578 |
| 44056.58866898149 | 48.482 |
| 44056.63033564815 | 48.192 |
| 44056.672002314815 | 47.748 |
| 44056.71366898149 | 46.879 |
| 44056.75533564815 | 45.605 |
| 44056.797002314815 | 44.524 |
| 44056.83866898149 | 43.829 |
| 44056.88033564815 | 43.308 |
| 44056.922002314815 | 42.902 |
| 44056.96366898149 | 42.69 |
| 44057.00533564815 | 42.632 |
| 44057.047002314815 | 42.536 |
| 44057.08866898149 | 42.4 |
| 44057.13033564815 | 42.304 |
| 44057.172002314815 | 42.092 |
| 44057.21366898149 | 41.899 |
| 44057.25533564815 | 41.763 |
| 44057.297002314815 | 41.706 |
| 44057.33866898149 | 41.976 |
| 44057.38033564815 | 42.651 |
| 44057.422002314815 | 44.041 |
| 44057.46366898149 | 45.682 |
| 44057.50533564815 | 46.918 |
| 44057.547002314815 | 47.748 |
| 44057.58866898149 | 47.941 |
| 44057.63033564815 | 47.671 |
| 44057.672002314815 | 47.034 |
| 44057.71366898149 | 46.011 |
| 44057.75533564815 | 45.045 |
| 44057.797002314815 | 44.292 |
| 44057.83866898149 | 43.694 |
| 44057.88033564815 | 43.346 |
| 44057.922002314815 | 43.018 |
| 44057.96366898149 | 42.767 |
| 44058.00533564815 | 42.574 |
| 44058.047002314815 | 42.516 |
| 44058.08866898149 | 42.4 |
| 44058.13033564815 | 42.304 |
| 44058.172002314815 | 42.169 |
| 44058.21366898149 | 42.072 |
| 44058.25533564815 | 41.976 |
| 44058.297002314815 | 41.899 |
| 44058.33866898149 | 42.13 |
| 44058.38033564815 | 42.806 |
| 44058.422002314815 | 44.157 |
| 44058.46366898149 | 45.991 |
| 44058.50533564815 | 47.458 |
| 44058.547002314815 | 48.153 |
| 44058.58866898149 | 48.385 |
| 44058.63033564815 | 48.076 |
| 44058.672002314815 | 47.343 |
| 44058.71366898149 | 46.397 |
| 44058.75533564815 | 45.412 |
| 44058.797002314815 | 44.466 |
| 44058.83866898149 | 43.694 |
| 44058.88033564815 | 43.211 |
| 44058.922002314815 | 42.845 |
| 44058.96366898149 | 42.613 |
| 44059.00533564815 | 42.458 |
| 44059.047002314815 | 42.304 |
| 44059.08866898149 | 42.207 |
| 44059.13033564815 | 42.227 |
| 44059.172002314815 | 42.111 |
| 44059.21366898149 | 41.976 |
| 44059.25533564815 | 41.879 |
| 44059.297002314815 | 41.918 |
| 44059.33866898149 | 42.13 |
| 44059.38033564815 | 42.748 |
| 44059.422002314815 | 43.984 |
| 44059.46366898149 | 45.47 |
| 44059.50533564815 | 46.532 |
| 44059.547002314815 | 47.304 |
| 44059.58866898149 | 47.767 |
| 44059.63033564815 | 47.748 |
| 44059.672002314815 | 47.15 |
| 44059.71366898149 | 46.377 |
| 44059.75533564815 | 45.547 |
| 44059.797002314815 | 44.582 |
| 44059.83866898149 | 43.733 |
| 44059.88033564815 | 43.327 |
| 44059.922002314815 | 43.115 |
| 44059.96366898149 | 42.941 |
| 44060.00533564815 | 42.709 |
| 44060.047002314815 | 42.632 |
| 44060.08866898149 | 42.594 |
| 44060.13033564815 | 42.555 |
| 44060.172002314815 | 42.478 |
| 44060.21366898149 | 42.458 |
| 44060.25533564815 | 42.362 |
| 44060.297002314815 | 42.362 |
| 44060.33866898149 | 42.555 |
| 44060.38033564815 | 43.153 |
| 44060.422002314815 | 44.292 |
| 44060.46366898149 | 45.875 |
| 44060.50533564815 | 47.207 |
| 44060.547002314815 | 47.98 |
| 44060.58866898149 | 48.211 |
| 44060.63033564815 | 47.806 |
| 44060.672002314815 | 47.304 |
| 44060.71366898149 | 46.397 |
| 44060.75533564815 | 45.586 |
| 44060.797002314815 | 44.756 |
| 44060.83866898149 | 43.926 |
| 44060.88033564815 | 43.771 |
| 44060.922002314815 | 43.482 |
| 44060.96366898149 | 43.231 |
| 44061.00533564815 | 43.076 |
| 44061.047002314815 | 42.922 |
| 44061.08866898149 | 42.922 |
| 44061.13033564815 | 42.767 |
| 44061.172002314815 | 42.671 |
| 44061.21366898149 | 42.536 |
| 44061.25533564815 | 42.381 |
| 44061.297002314815 | 42.4 |
| 44061.33866898149 | 42.574 |
| 44061.38033564815 | 43.231 |
| 44061.422002314815 | 44.447 |
| 44061.46366898149 | 45.895 |
| 44061.50533564815 | 47.343 |
| 44061.547002314815 | 48.366 |
| 44061.58866898149 | 48.482 |
| 44061.63033564815 | 47.864 |
| 44061.672002314815 | 46.262 |
| 44061.71366898149 | 45.798 |
| 44061.75533564815 | 45.296 |
| 44061.797002314815 | 44.794 |
| 44061.83866898149 | 43.984 |
| 44061.88033564815 | 43.424 |
| 44061.922002314815 | 43.192 |
| 44061.96366898149 | 43.018 |
| 44062.00533564815 | 42.941 |
| 44062.047002314815 | 42.787 |
| 44062.08866898149 | 42.613 |
| 44062.13033564815 | 42.516 |
| 44062.172002314815 | 42.516 |
| 44062.21366898149 | 42.478 |
| 44062.25533564815 | 42.323 |
| 44062.297002314815 | 42.323 |
| 44062.33866898149 | 42.497 |
| 44062.38033564815 | 43.134 |
| 44062.422002314815 | 44.389 |
| 44062.46366898149 | 46.068 |
| 44062.50533564815 | 47.652 |
| 44062.547002314815 | 48.443 |
| 44062.58866898149 | 47.941 |
| 44062.63033564815 | 47.555 |
| 44062.672002314815 | 47.246 |
| 44062.71366898149 | 45.837 |
| 44062.75533564815 | 44.814 |
| 44062.797002314815 | 44.292 |
| 44062.83866898149 | 43.733 |
| 44062.88033564815 | 43.655 |
| 44062.922002314815 | 43.655 |
| 44062.96366898149 | 43.501 |
| 44063.00533564815 | 43.327 |
| 44063.047002314815 | 43.211 |
| 44063.08866898149 | 43.018 |
| 44063.13033564815 | 42.845 |
| 44063.172002314815 | 42.69 |
| 44063.21366898149 | 42.555 |
| 44063.25533564815 | 42.536 |
| 44063.297002314815 | 42.516 |
| 44063.33866898149 | 42.729 |
| 44063.38033564815 | 43.424 |
| 44063.422002314815 | 44.756 |
| 44063.46366898149 | 46.493 |
| 44063.50533564815 | 48.096 |
| 44063.547002314815 | 48.192 |
| 44063.58866898149 | 46.763 |
| 44063.63033564815 | 45.779 |
| 44063.672002314815 | 46.184 |
| 44063.71366898149 | 45.74 |
| 44063.75533564815 | 45.393 |
| 44063.797002314815 | 44.987 |
| 44063.83866898149 | 44.466 |
| 44063.88033564815 | 44.292 |
| 44063.922002314815 | 44.099 |
| 44063.96366898149 | 43.848 |
| 44064.00533564815 | 43.617 |
| 44064.047002314815 | 43.308 |
| 44064.08866898149 | 43.173 |
| 44064.13033564815 | 42.999 |
| 44064.172002314815 | 42.825 |
| 44064.21366898149 | 42.748 |
| 44064.25533564815 | 42.69 |
| 44064.297002314815 | 42.709 |
| 44064.33866898149 | 42.922 |
| 44064.38033564815 | 43.617 |
| 44064.422002314815 | 44.775 |
| 44064.46366898149 | 46.262 |
| 44064.50533564815 | 47.613 |
| 44064.547002314815 | 48.134 |
| 44064.58866898149 | 48.308 |
| 44064.63033564815 | 48.038 |
| 44064.672002314815 | 47.246 |
| 44064.71366898149 | 46.435 |
| 44064.75533564815 | 45.586 |
| 44064.797002314815 | 44.794 |
| 44064.83866898149 | 44.041 |
| 44064.88033564815 | 43.52 |
| 44064.922002314815 | 43.173 |
| 44064.96366898149 | 42.999 |
| 44065.00533564815 | 42.845 |
| 44065.047002314815 | 42.671 |
| 44065.08866898149 | 42.613 |
| 44065.13033564815 | 42.536 |
| 44065.172002314815 | 42.594 |
| 44065.21366898149 | 42.439 |
| 44065.25533564815 | 42.304 |
| 44065.297002314815 | 42.227 |
| 44065.33866898149 | 42.458 |
| 44065.38033564815 | 42.999 |
| 44065.422002314815 | 44.08 |
| 44065.46366898149 | 45.624 |
| 44065.50533564815 | 46.976 |
| 44065.547002314815 | 47.864 |
| 44065.58866898149 | 48.153 |
| 44065.63033564815 | 47.902 |
| 44065.672002314815 | 47.362 |
| 44065.71366898149 | 46.455 |
| 44065.75533564815 | 45.451 |
| 44065.797002314815 | 44.64 |
| 44065.83866898149 | 43.829 |
| 44065.88033564815 | 43.54 |
| 44065.922002314815 | 43.327 |
| 44065.96366898149 | 43.211 |
| 44066.00533564815 | 43.057 |
| 44066.047002314815 | 42.902 |
| 44066.08866898149 | 42.787 |
| 44066.13033564815 | 42.69 |
| 44066.172002314815 | 42.574 |
| 44066.21366898149 | 42.478 |
| 44066.25533564815 | 42.458 |
| 44066.297002314815 | 42.458 |
| 44066.33866898149 | 42.729 |
| 44066.38033564815 | 43.404 |
| 44066.422002314815 | 44.119 |
| 44066.46366898149 | 45.258 |
| 44066.50533564815 | 46.165 |
| 44066.547002314815 | 45.624 |
| 44066.58866898149 | 46.262 |
| 44066.63033564815 | 46.397 |
| 44066.672002314815 | 45.586 |
| 44066.71366898149 | 45.045 |
| 44066.75533564815 | 44.601 |
| 44066.797002314815 | 44.292 |
| 44066.83866898149 | 43.848 |
| 44066.88033564815 | 43.559 |
| 44066.922002314815 | 43.346 |
| 44066.96366898149 | 43.095 |
| 44067.00533564815 | 42.98 |
| 44067.047002314815 | 42.806 |
| 44067.08866898149 | 42.748 |
| 44067.13033564815 | 42.69 |
| 44067.172002314815 | 42.748 |
| 44067.21366898149 | 42.748 |
| 44067.25533564815 | 42.787 |
| 44067.297002314815 | 42.767 |
| 44067.33866898149 | 42.902 |
| 44067.38033564815 | 43.501 |
| 44067.422002314815 | 44.273 |
| 44067.46366898149 | 45.586 |
| 44067.50533564815 | 46.068 |
| 44067.547002314815 | 46.609 |
| 44067.58866898149 | 45.953 |
| 44067.63033564815 | 45.509 |
| 44067.672002314815 | 46.068 |
| 44067.71366898149 | 46.242 |
| 44067.75533564815 | 44.891 |
| 44067.797002314815 | 44.582 |
| 44067.83866898149 | 44.157 |
| 44067.88033564815 | 43.848 |
| 44067.922002314815 | 43.829 |
| 44067.96366898149 | 43.713 |
| 44068.00533564815 | 43.578 |
| 44068.047002314815 | 43.308 |
| 44068.08866898149 | 43.076 |
| 44068.13033564815 | 42.96 |
| 44068.172002314815 | 42.941 |
| 44068.21366898149 | 42.845 |
| 44068.25533564815 | 42.787 |
| 44068.297002314815 | 42.767 |
| 44068.33866898149 | 42.864 |
| 44068.38033564815 | 43.366 |
| 44068.422002314815 | 44.485 |
| 44068.46366898149 | 45.991 |
| 44068.50533564815 | 47.401 |
| 44068.547002314815 | 47.767 |
| 44068.58866898149 | 48.308 |
| 44068.63033564815 | 47.072 |
| 44068.672002314815 | 45.682 |
| 44068.71366898149 | 45.161 |
| 44068.75533564815 | 44.736 |
| 44068.797002314815 | 44.563 |
| 44068.83866898149 | 44.099 |
| 44068.88033564815 | 43.694 |
| 44068.922002314815 | 43.52 |
| 44068.96366898149 | 43.443 |
| 44069.00533564815 | 43.25 |
| 44069.047002314815 | 43.231 |
| 44069.08866898149 | 43.289 |
| 44069.13033564815 | 43.173 |
| 44069.172002314815 | 43.076 |
| 44069.21366898149 | 42.98 |
| 44069.25533564815 | 42.883 |
| 44069.297002314815 | 43.018 |
| 44069.33866898149 | 43.269 |
| 44069.38033564815 | 43.81 |
| 44069.422002314815 | 44.35 |
| 44069.46366898149 | 46.184 |
| 44069.50533564815 | 47.613 |
| 44069.547002314815 | 48.115 |
| 44069.58866898149 | 46.513 |
| 44069.63033564815 | 45.258 |
| 44069.672002314815 | 44.968 |
| 44069.71366898149 | 44.968 |
| 44069.75533564815 | 44.949 |
| 44069.797002314815 | 44.505 |
| 44069.83866898149 | 44.138 |
| 44069.88033564815 | 43.771 |
| 44069.922002314815 | 43.617 |
| 44069.96366898149 | 43.424 |
| 44070.00533564815 | 43.385 |
| 44070.047002314815 | 43.25 |
| 44070.08866898149 | 43.192 |
| 44070.13033564815 | 42.999 |
| 44070.172002314815 | 43.134 |
| 44070.21366898149 | 42.845 |
| 44070.25533564815 | 42.748 |
| 44070.297002314815 | 42.787 |
| 44070.33866898149 | 42.922 |
| 44070.38033564815 | 43.501 |
| 44070.422002314815 | 44.64 |
| 44070.46366898149 | 46.339 |
| 44070.50533564815 | 47.574 |
| 44070.547002314815 | 48.578 |
| 44070.58866898149 | 48.231 |
| 44070.63033564815 | 47.362 |
| 44070.672002314815 | 46.532 |
| 44070.71366898149 | 46.725 |
| 44070.75533564815 | 45.76 |
| 44070.797002314815 | 44.91 |
| 44070.83866898149 | 44.312 |
| 44070.88033564815 | 43.829 |
| 44070.922002314815 | 43.578 |
| 44070.96366898149 | 43.482 |
| 44071.00533564815 | 43.25 |
| 44071.047002314815 | 43.076 |
| 44071.08866898149 | 42.941 |
| 44071.13033564815 | 42.883 |
| 44071.172002314815 | 42.864 |
| 44071.21366898149 | 42.922 |
| 44071.25533564815 | 42.96 |
| 44071.297002314815 | 42.941 |
| 44071.33866898149 | 43.038 |
| 44071.38033564815 | 43.54 |
| 44071.422002314815 | 44.234 |
| 44071.46366898149 | 45.219 |
| 44071.50533564815 | 47.207 |
| 44071.547002314815 | 46.319 |
| 44071.58866898149 | 45.045 |
| 44071.63033564815 | 44.852 |
| 44071.672002314815 | 44.621 |
| 44071.71366898149 | 44.37 |
| 44071.75533564815 | 44.254 |
| 44071.797002314815 | 43.964 |
| 44071.83866898149 | 43.694 |
| 44071.88033564815 | 43.501 |
| 44071.922002314815 | 43.424 |
| 44071.96366898149 | 43.269 |
| 44072.00533564815 | 43.095 |
| 44072.047002314815 | 42.941 |
| 44072.08866898149 | 42.922 |
| 44072.13033564815 | 42.883 |
| 44072.172002314815 | 42.787 |
| 44072.21366898149 | 42.748 |
| 44072.25533564815 | 42.864 |
| 44072.297002314815 | 42.922 |
| 44072.33866898149 | 43.057 |
| 44072.38033564815 | 43.385 |
| 44072.422002314815 | 43.675 |
| 44072.46366898149 | 43.675 |
| 44072.50533564815 | 44.138 |
| 44072.547002314815 | 44.331 |
| 44072.58866898149 | 44.505 |
| 44072.63033564815 | 45.547 |
| 44072.672002314815 | 46.146 |
| 44072.71366898149 | 45.895 |
| 44072.75533564815 | 45.354 |
| 44072.797002314815 | 44.679 |
| 44072.83866898149 | 44.022 |
| 44072.88033564815 | 43.655 |
| 44072.922002314815 | 43.308 |
| 44072.96366898149 | 43.095 |
| 44073.00533564815 | 43.153 |
| 44073.047002314815 | 43.095 |
| 44073.08866898149 | 42.98 |
| 44073.13033564815 | 42.767 |
| 44073.172002314815 | 42.613 |
| 44073.21366898149 | 42.594 |
| 44073.25533564815 | 42.574 |
| 44073.297002314815 | 42.574 |
| 44073.33866898149 | 42.748 |
| 44073.38033564815 | 43.289 |
| 44073.422002314815 | 44.524 |
| 44073.46366898149 | 46.223 |
| 44073.50533564815 | 47.169 |
| 44073.547002314815 | 48.269 |
| 44073.58866898149 | 47.169 |
| 44073.63033564815 | 45.431 |
| 44073.672002314815 | 44.968 |
| 44073.71366898149 | 45.065 |
| 44073.75533564815 | 44.987 |
| 44073.797002314815 | 44.37 |
| 44073.83866898149 | 43.81 |
| 44073.88033564815 | 43.501 |
| 44073.922002314815 | 43.289 |
| 44073.96366898149 | 43.424 |
| 44074.00533564815 | 43.289 |
| 44074.047002314815 | 42.98 |
| 44074.08866898149 | 42.806 |
| 44074.13033564815 | 42.69 |
| 44074.172002314815 | 42.594 |
| 44074.21366898149 | 42.478 |
| 44074.25533564815 | 42.381 |
| 44074.297002314815 | 42.304 |
| 44074.33866898149 | 42.362 |
| 44074.38033564815 | 42.999 |
| 44074.422002314815 | 44.157 |
| 44074.46366898149 | 45.682 |
| 44074.50533564815 | 46.146 |
| 44074.547002314815 | 45.451 |
| 44074.58866898149 | 46.377 |
| 44074.63033564815 | 46.3 |
| 44074.672002314815 | 46.879 |
| 44074.71366898149 | 45.586 |
| 44074.75533564815 | 44.524 |
| 44074.797002314815 | 44.099 |
| 44074.83866898149 | 43.713 |
| 44074.88033564815 | 43.54 |
| 44074.922002314815 | 43.424 |
| 44074.96366898149 | 43.346 |
| 44075.00533564815 | 43.25 |
| 44075.047002314815 | 43.231 |
| 44075.08866898149 | 43.134 |
| 44075.13033564815 | 43.038 |
| 44075.172002314815 | 42.941 |
| 44075.21366898149 | 42.806 |
| 44075.25533564815 | 42.69 |
| 44075.297002314815 | 42.748 |
| 44075.33866898149 | 42.941 |
| 44075.38033564815 | 43.269 |
| 44075.422002314815 | 44.157 |
| 44075.46366898149 | 44.524 |
| 44075.50533564815 | 45.837 |
| 44075.547002314815 | 46.976 |
| 44075.58866898149 | 47.748 |
| 44075.63033564815 | 47.632 |
| 44075.672002314815 | 47.034 |
| 44075.71366898149 | 46.204 |
| 44075.75533564815 | 45.296 |
| 44075.797002314815 | 44.37 |
| 44075.83866898149 | 43.694 |
| 44075.88033564815 | 43.366 |
| 44075.922002314815 | 43.076 |
| 44075.96366898149 | 42.922 |
| 44076.00533564815 | 42.632 |
| 44076.047002314815 | 42.516 |
| 44076.08866898149 | 42.458 |
| 44076.13033564815 | 42.362 |
| 44076.172002314815 | 42.323 |
| 44076.21366898149 | 42.169 |
| 44076.25533564815 | 42.072 |
| 44076.297002314815 | 42.053 |
| 44076.33866898149 | 42.111 |
| 44076.38033564815 | 42.767 |
| 44076.422002314815 | 43.945 |
| 44076.46366898149 | 45.798 |
| 44076.50533564815 | 47.246 |
| 44076.547002314815 | 47.864 |
| 44076.58866898149 | 48.211 |
| 44076.63033564815 | 47.999 |
| 44076.672002314815 | 47.343 |
| 44076.71366898149 | 46.513 |
| 44076.75533564815 | 45.644 |
| 44076.797002314815 | 44.717 |
| 44076.83866898149 | 44.041 |
| 44076.88033564815 | 43.617 |
| 44076.922002314815 | 43.289 |
| 44076.96366898149 | 43.018 |
| 44077.00533564815 | 42.806 |
| 44077.047002314815 | 42.671 |
| 44077.08866898149 | 42.497 |
| 44077.13033564815 | 42.381 |
| 44077.172002314815 | 42.265 |
| 44077.21366898149 | 42.227 |
| 44077.25533564815 | 42.188 |
| 44077.297002314815 | 42.092 |
| 44077.33866898149 | 42.285 |
| 44077.38033564815 | 42.922 |
| 44077.422002314815 | 44.003 |
| 44077.46366898149 | 45.818 |
| 44077.50533564815 | 47.207 |
| 44077.547002314815 | 47.883 |
| 44077.58866898149 | 48.211 |
| 44077.63033564815 | 48.038 |
| 44077.672002314815 | 47.362 |
| 44077.71366898149 | 46.513 |
| 44077.75533564815 | 45.567 |
| 44077.797002314815 | 44.659 |
| 44077.83866898149 | 43.926 |
| 44077.88033564815 | 43.482 |
| 44077.922002314815 | 43.269 |
| 44077.96366898149 | 43.076 |
| 44078.00533564815 | 42.922 |
| 44078.047002314815 | 42.845 |
| 44078.08866898149 | 42.767 |
| 44078.13033564815 | 42.632 |
| 44078.172002314815 | 42.536 |
| 44078.21366898149 | 42.362 |
| 44078.25533564815 | 42.285 |
| 44078.297002314815 | 42.265 |
| 44078.33866898149 | 42.362 |
| 44078.38033564815 | 42.999 |
| 44078.422002314815 | 44.138 |
| 44078.46366898149 | 45.991 |
| 44078.50533564815 | 47.439 |
| 44078.547002314815 | 48.115 |
| 44078.58866898149 | 48.462 |
| 44078.63033564815 | 48.231 |
| 44078.672002314815 | 47.516 |
| 44078.71366898149 | 46.706 |
| 44078.75533564815 | 45.624 |
| 44078.797002314815 | 44.833 |
| 44078.83866898149 | 44.196 |
| 44078.88033564815 | 43.848 |
| 44078.922002314815 | 43.655 |
| 44078.96366898149 | 43.462 |
| 44079.00533564815 | 43.308 |
| 44079.047002314815 | 43.211 |
| 44079.08866898149 | 43.057 |
| 44079.13033564815 | 42.902 |
| 44079.172002314815 | 42.806 |
| 44079.21366898149 | 42.651 |
| 44079.25533564815 | 42.613 |
| 44079.297002314815 | 42.555 |
| 44079.33866898149 | 42.632 |
| 44079.38033564815 | 43.134 |
| 44079.422002314815 | 44.312 |
| 44079.46366898149 | 46.223 |
| 44079.50533564815 | 47.574 |
| 44079.547002314815 | 48.308 |
| 44079.58866898149 | 48.597 |
| 44079.63033564815 | 48.192 |
| 44079.672002314815 | 47.401 |
| 44079.71366898149 | 46.493 |
| 44079.75533564815 | 45.489 |
| 44079.797002314815 | 44.601 |
| 44079.83866898149 | 43.926 |
| 44079.88033564815 | 43.482 |
| 44079.922002314815 | 43.211 |
| 44079.96366898149 | 43.076 |
| 44080.00533564815 | 42.922 |
| 44080.047002314815 | 42.767 |
| 44080.08866898149 | 42.594 |
| 44080.13033564815 | 42.458 |
| 44080.172002314815 | 42.381 |
| 44080.21366898149 | 42.343 |
| 44080.25533564815 | 42.285 |
| 44080.297002314815 | 42.207 |
| 44080.33866898149 | 42.42 |
| 44080.38033564815 | 43.095 |
| 44080.422002314815 | 44.273 |
| 44080.46366898149 | 45.933 |
| 44080.50533564815 | 47.381 |
| 44080.547002314815 | 47.96 |
| 44080.58866898149 | 48.308 |
| 44080.63033564815 | 47.787 |
| 44080.672002314815 | 46.957 |
| 44080.71366898149 | 45.933 |
| 44080.75533564815 | 45.316 |
| 44080.797002314815 | 44.601 |
| 44080.83866898149 | 43.926 |
| 44080.88033564815 | 43.597 |
| 44080.922002314815 | 43.501 |
| 44080.96366898149 | 43.346 |
| 44081.00533564815 | 43.095 |
| 44081.047002314815 | 42.922 |
| 44081.08866898149 | 42.864 |
| 44081.13033564815 | 42.69 |
| 44081.172002314815 | 42.458 |
| 44081.21366898149 | 42.304 |
| 44081.25533564815 | 42.265 |
| 44081.297002314815 | 42.188 |
| 44081.33866898149 | 42.362 |
| 44081.38033564815 | 42.941 |
| 44081.422002314815 | 43.868 |
| 44081.46366898149 | 45.316 |
| 44081.50533564815 | 46.455 |
| 44081.547002314815 | 46.783 |
| 44081.58866898149 | 46.725 |
| 44081.63033564815 | 46.609 |
| 44081.672002314815 | 46.204 |
| 44081.71366898149 | 45.74 |
| 44081.75533564815 | 45.026 |
| 44081.797002314815 | 44.254 |
| 44081.83866898149 | 43.617 |
| 44081.88033564815 | 43.269 |
| 44081.922002314815 | 43.115 |
| 44081.96366898149 | 43.095 |
| 44082.00533564815 | 43.134 |
| 44082.047002314815 | 43.153 |
| 44082.08866898149 | 43.192 |
| 44082.13033564815 | 43.134 |
| 44082.172002314815 | 42.96 |
| 44082.21366898149 | 42.806 |
| 44082.25533564815 | 42.613 |
| 44082.297002314815 | 42.458 |
| 44082.33866898149 | 42.246 |
| 44082.38033564815 | 41.976 |
| 44082.422002314815 | 41.995 |
| 44082.46366898149 | 42.15 |
| 44082.50533564815 | 42.15 |
| 44082.547002314815 | 42.15 |
| 44082.58866898149 | 41.937 |
| 44082.63033564815 | 41.358 |
| 44082.672002314815 | 41.358 |
| 44082.71366898149 | 40.47 |
| 44082.75533564815 | 40.161 |
| 44082.797002314815 | 40.76 |
| 44082.83866898149 | 40.895 |
| 44082.88033564815 | 40.875 |
| 44082.922002314815 | 40.895 |
| 44082.96366898149 | 40.953 |
| 44083.00533564815 | 40.991 |
| 44083.047002314815 | 41.068 |
| 44083.08866898149 | 41.146 |
| 44083.13033564815 | 41.223 |
| 44083.172002314815 | 41.146 |
| 44083.21366898149 | 41.242 |
| 44083.25533564815 | 41.281 |
| 44083.297002314815 | 41.319 |
| 44083.33866898149 | 41.532 |
| 44083.38033564815 | 41.783 |
| 44083.422002314815 | 42.304 |
| 44083.46366898149 | 43.617 |
| 44083.50533564815 | 44.215 |
| 44083.547002314815 | 44.37 |
| 44083.58866898149 | 45.161 |
| 44083.63033564815 | 46.204 |
| 44083.672002314815 | 45.451 |
| 44083.71366898149 | 44.428 |
| 44083.75533564815 | 43.733 |
| 44083.797002314815 | 43.134 |
| 44083.83866898149 | 42.748 |
| 44083.88033564815 | 42.497 |
| 44083.922002314815 | 42.381 |
| 44083.96366898149 | 42.246 |
| 44084.00533564815 | 42.169 |
| 44084.047002314815 | 42.072 |
| 44084.08866898149 | 42.014 |
| 44084.13033564815 | 41.976 |
| 44084.172002314815 | 42.053 |
| 44084.21366898149 | 42.227 |
| 44084.25533564815 | 42.15 |
| 44084.297002314815 | 42.169 |
| 44084.33866898149 | 41.976 |
| 44084.38033564815 | 42.265 |
| 44084.422002314815 | 43.173 |
| 44084.46366898149 | 45.509 |
| 44084.50533564815 | 46.937 |
| 44084.547002314815 | 47.632 |
| 44084.58866898149 | 46.918 |
| 44084.63033564815 | 45.567 |
| 44084.672002314815 | 44.814 |
| 44084.71366898149 | 44.196 |
| 44084.75533564815 | 43.636 |
| 44084.797002314815 | 42.902 |
| 44084.83866898149 | 42.4 |
| 44084.88033564815 | 42.092 |
| 44084.922002314815 | 41.976 |
| 44084.96366898149 | 41.86 |
| 44085.00533564815 | 41.744 |
| 44085.047002314815 | 41.686 |
| 44085.08866898149 | 41.628 |
| 44085.13033564815 | 41.57 |
| 44085.172002314815 | 41.648 |
| 44085.21366898149 | 41.59 |
| 44085.25533564815 | 41.667 |
| 44085.297002314815 | 41.628 |
| 44085.33866898149 | 41.763 |
| 44085.38033564815 | 41.841 |
| 44085.422002314815 | 42.111 |
| 44085.46366898149 | 42.632 |
| 44085.50533564815 | 43.095 |
| 44085.547002314815 | 44.698 |
| 44085.58866898149 | 46.86 |
| 44085.63033564815 | 47.207 |
| 44085.672002314815 | 46.648 |
| 44085.71366898149 | 45.76 |
| 44085.75533564815 | 45.277 |
| 44085.797002314815 | 43.868 |
| 44085.83866898149 | 42.806 |
| 44085.88033564815 | 42.15 |
| 44085.922002314815 | 41.686 |
| 44085.96366898149 | 41.377 |
| 44086.00533564815 | 41.165 |
| 44086.047002314815 | 40.972 |
| 44086.08866898149 | 40.875 |
| 44086.13033564815 | 40.817 |
| 44086.172002314815 | 40.721 |
| 44086.21366898149 | 40.586 |
| 44086.25533564815 | 40.393 |
| 44086.297002314815 | 40.316 |
| 44086.33866898149 | 40.702 |
| 44086.38033564815 | 41.918 |
| 44086.422002314815 | 43.52 |
| 44086.46366898149 | 48.115 |
| 44086.50533564815 | 49.408 |
| 44086.547002314815 | 49.061 |
| 44086.58866898149 | 49.64 |
| 44086.63033564815 | 49.177 |
| 44086.672002314815 | 48.462 |
| 44086.71366898149 | 47.439 |
| 44086.75533564815 | 46.146 |
| 44086.797002314815 | 44.698 |
| 44086.83866898149 | 43.733 |
| 44086.88033564815 | 43.231 |
| 44086.922002314815 | 42.825 |
| 44086.96366898149 | 42.536 |
| 44087.00533564815 | 42.169 |
| 44087.047002314815 | 41.841 |
| 44087.08866898149 | 41.667 |
| 44087.13033564815 | 41.455 |
| 44087.172002314815 | 41.088 |
| 44087.21366898149 | 40.837 |
| 44087.25533564815 | 40.663 |
| 44087.297002314815 | 40.663 |
| 44087.33866898149 | 40.914 |
| 44087.38033564815 | 42.13 |
| 44087.422002314815 | 43.675 |
| 44087.46366898149 | 49.331 |
| 44087.50533564815 | 49.852 |
| 44087.547002314815 | 49.119 |
| 44087.58866898149 | 50.2 |
| 44087.63033564815 | 49.582 |
| 44087.672002314815 | 48.791 |
| 44087.71366898149 | 48.096 |
| 44087.75533564815 | 46.725 |
| 44087.797002314815 | 45.644 |
| 44087.83866898149 | 45.084 |
| 44087.88033564815 | 44.138 |
| 44087.922002314815 | 43.713 |
| 44087.96366898149 | 42.999 |
| 44088.00533564815 | 42.651 |
| 44088.047002314815 | 42.478 |
| 44088.08866898149 | 42.285 |
| 44088.13033564815 | 42.111 |
| 44088.172002314815 | 41.899 |
| 44088.21366898149 | 41.706 |
| 44088.25533564815 | 41.532 |
| 44088.297002314815 | 41.397 |
| 44088.33866898149 | 41.667 |
| 44088.38033564815 | 42.709 |
| 44088.422002314815 | 44.119 |
| 44088.46366898149 | 48.289 |
| 44088.50533564815 | 49.563 |
| 44088.547002314815 | 49.37 |
| 44088.58866898149 | 50.219 |
| 44088.63033564815 | 49.949 |
| 44088.672002314815 | 49.061 |
| 44088.71366898149 | 47.806 |
| 44088.75533564815 | 46.435 |
| 44088.797002314815 | 45.489 |
| 44088.83866898149 | 44.601 |
| 44088.88033564815 | 43.848 |
| 44088.922002314815 | 43.25 |
| 44088.96366898149 | 42.922 |
| 44089.00533564815 | 42.69 |
| 44089.047002314815 | 42.478 |
| 44089.08866898149 | 42.265 |
| 44089.13033564815 | 42.014 |
| 44089.172002314815 | 41.802 |
| 44089.21366898149 | 41.648 |
| 44089.25533564815 | 41.455 |
| 44089.297002314815 | 41.339 |
| 44089.33866898149 | 41.493 |
| 44089.38033564815 | 42.439 |
| 44089.422002314815 | 43.829 |
| 44089.46366898149 | 48.192 |
| 44089.50533564815 | 49.138 |
| 44089.547002314815 | 49.254 |
| 44089.58866898149 | 49.64 |
| 44089.63033564815 | 48.964 |
| 44089.672002314815 | 48.134 |
| 44089.71366898149 | 47.323 |
| 44089.75533564815 | 46.204 |
| 44089.797002314815 | 44.891 |
| 44089.83866898149 | 44.08 |
| 44089.88033564815 | 43.404 |
| 44089.922002314815 | 42.883 |
| 44089.96366898149 | 42.516 |
| 44090.00533564815 | 42.15 |
| 44090.047002314815 | 41.918 |
| 44090.08866898149 | 41.725 |
| 44090.13033564815 | 41.532 |
| 44090.172002314815 | 41.339 |
| 44090.21366898149 | 41.242 |
| 44090.25533564815 | 41.146 |
| 44090.297002314815 | 41.049 |
| 44090.33866898149 | 41.435 |
| 44090.38033564815 | 42.381 |
| 44090.422002314815 | 43.559 |
| 44090.46366898149 | 47.227 |
| 44090.50533564815 | 47.922 |
| 44090.547002314815 | 48.54 |
| 44090.58866898149 | 48.868 |
| 44090.63033564815 | 48.752 |
| 44090.672002314815 | 48.115 |
| 44090.71366898149 | 47.188 |
| 44090.75533564815 | 45.914 |
| 44090.797002314815 | 44.929 |
| 44090.83866898149 | 44.157 |
| 44090.88033564815 | 43.713 |
| 44090.922002314815 | 43.25 |
| 44090.96366898149 | 43.038 |
| 44091.00533564815 | 42.709 |
| 44091.047002314815 | 42.478 |
| 44091.08866898149 | 42.246 |
| 44091.13033564815 | 41.976 |
| 44091.172002314815 | 41.821 |
| 44091.21366898149 | 41.59 |
| 44091.25533564815 | 41.358 |
| 44091.297002314815 | 41.3 |
| 44091.33866898149 | 41.59 |
| 44091.38033564815 | 42.574 |
| 44091.422002314815 | 44.003 |
| 44091.46366898149 | 47.922 |
| 44091.50533564815 | 48.366 |
| 44091.547002314815 | 48.771 |
| 44091.58866898149 | 49.196 |
| 44091.63033564815 | 48.829 |
| 44091.672002314815 | 48.25 |
| 44091.71366898149 | 47.458 |
| 44091.75533564815 | 46.474 |
| 44091.797002314815 | 45.007 |
| 44091.83866898149 | 43.945 |
| 44091.88033564815 | 43.694 |
| 44091.922002314815 | 43.385 |
| 44091.96366898149 | 43.038 |
| 44092.00533564815 | 42.632 |
| 44092.047002314815 | 42.4 |
| 44092.08866898149 | 42.072 |
| 44092.13033564815 | 41.879 |
| 44092.172002314815 | 41.744 |
| 44092.21366898149 | 41.57 |
| 44092.25533564815 | 41.435 |
| 44092.297002314815 | 41.416 |
| 44092.33866898149 | 41.725 |
| 44092.38033564815 | 42.902 |
| 44092.422002314815 | 44.428 |
| 44092.46366898149 | 48.694 |
| 44092.50533564815 | 49.37 |
| 44092.547002314815 | 48.636 |
| 44092.58866898149 | 48.134 |
| 44092.63033564815 | 47.227 |
| 44092.672002314815 | 46.86 |
| 44092.71366898149 | 47.188 |
| 44092.75533564815 | 46.513 |
| 44092.797002314815 | 45.412 |
| 44092.83866898149 | 44.428 |
| 44092.88033564815 | 44.099 |
| 44092.922002314815 | 43.655 |
| 44092.96366898149 | 43.269 |
| 44093.00533564815 | 42.845 |
| 44093.047002314815 | 42.941 |
| 44093.08866898149 | 43.018 |
| 44093.13033564815 | 42.613 |
| 44093.172002314815 | 42.516 |
| 44093.21366898149 | 42.304 |
| 44093.25533564815 | 41.976 |
| 44093.297002314815 | 41.725 |
| 44093.33866898149 | 42.4 |
| 44093.38033564815 | 43.269 |
| 44093.422002314815 | 44.466 |
| 44093.46366898149 | 50.258 |
| 44093.50533564815 | 48.443 |
| 44093.547002314815 | 47.613 |
| 44093.58866898149 | 46.995 |
| 44093.63033564815 | 47.439 |
| 44093.672002314815 | 47.709 |
| 44093.71366898149 | 47.439 |
| 44093.75533564815 | 46.319 |
| 44093.797002314815 | 45.103 |
| 44093.83866898149 | 44.408 |
| 44093.88033564815 | 43.52 |
| 44093.922002314815 | 43.385 |
| 44093.96366898149 | 43.018 |
| 44094.00533564815 | 43.327 |
| 44094.047002314815 | 43.115 |
| 44094.08866898149 | 43.269 |
| 44094.13033564815 | 43.269 |
| 44094.172002314815 | 42.806 |
| 44094.21366898149 | 42.381 |
| 44094.25533564815 | 42.323 |
| 44094.297002314815 | 42.343 |
| 44094.33866898149 | 42.709 |
| 44094.38033564815 | 43.424 |
| 44094.422002314815 | 44.003 |
| 44094.46366898149 | 44.756 |
| 44094.50533564815 | 45.47 |
| 44094.547002314815 | 46.435 |
| 44094.58866898149 | 47.999 |
| 44094.63033564815 | 48.54 |
| 44094.672002314815 | 47.632 |
| 44094.71366898149 | 46.59 |
| 44094.75533564815 | 45.451 |
| 44094.797002314815 | 44.447 |
| 44094.83866898149 | 43.578 |
| 44094.88033564815 | 43.211 |
| 44094.922002314815 | 42.864 |
| 44094.96366898149 | 42.536 |
| 44095.00533564815 | 42.014 |
| 44095.047002314815 | 41.995 |
| 44095.08866898149 | 41.821 |
| 44095.13033564815 | 41.725 |
| 44095.172002314815 | 41.512 |
| 44095.21366898149 | 42.188 |
| 44095.25533564815 | 42.15 |
| 44095.297002314815 | 42.111 |
| 44095.33866898149 | 42.285 |
| 44095.38033564815 | 42.825 |
| 44095.422002314815 | 43.945 |
| 44095.46366898149 | 46.262 |
| 44095.50533564815 | 47.458 |
| 44095.547002314815 | 47.458 |
| 44095.58866898149 | 48.462 |
| 44095.63033564815 | 47.69 |
| 44095.672002314815 | 46.648 |
| 44095.71366898149 | 45.74 |
| 44095.75533564815 | 45.238 |
| 44095.797002314815 | 44.736 |
| 44095.83866898149 | 44.041 |
| 44095.88033564815 | 43.617 |
| 44095.922002314815 | 43.385 |
| 44095.96366898149 | 43.173 |
| 44096.00533564815 | 42.98 |
| 44096.047002314815 | 42.787 |
| 44096.08866898149 | 42.632 |
| 44096.13033564815 | 42.536 |
| 44096.172002314815 | 42.42 |
| 44096.21366898149 | 42.323 |
| 44096.25533564815 | 42.246 |
| 44096.297002314815 | 42.188 |
| 44096.33866898149 | 42.227 |
| 44096.38033564815 | 42.69 |
| 44096.422002314815 | 43.81 |
| 44096.46366898149 | 46.068 |
| 44096.50533564815 | 47.613 |
| 44096.547002314815 | 47.458 |
| 44096.58866898149 | 46.513 |
| 44096.63033564815 | 45.431 |
| 44096.672002314815 | 44.891 |
| 44096.71366898149 | 44.736 |
| 44096.75533564815 | 44.428 |
| 44096.797002314815 | 43.964 |
| 44096.83866898149 | 43.636 |
| 44096.88033564815 | 43.501 |
| 44096.922002314815 | 43.482 |
| 44096.96366898149 | 43.308 |
| 44097.00533564815 | 43.115 |
| 44097.047002314815 | 42.902 |
| 44097.08866898149 | 42.845 |
| 44097.13033564815 | 42.941 |
| 44097.172002314815 | 42.941 |
| 44097.21366898149 | 42.671 |
| 44097.25533564815 | 42.458 |
| 44097.297002314815 | 42.265 |
| 44097.33866898149 | 42.246 |
| 44097.38033564815 | 42.748 |
| 44097.422002314815 | 43.752 |
| 44097.46366898149 | 46.011 |
| 44097.50533564815 | 47.729 |
| 44097.547002314815 | 48.231 |
| 44097.58866898149 | 48.617 |
| 44097.63033564815 | 47.999 |
| 44097.672002314815 | 46.609 |
| 44097.71366898149 | 45.296 |
| 44097.75533564815 | 44.621 |
| 44097.797002314815 | 44.003 |
| 44097.83866898149 | 43.617 |
| 44097.88033564815 | 43.346 |
| 44097.922002314815 | 43.115 |
| 44097.96366898149 | 42.864 |
| 44098.00533564815 | 42.632 |
| 44098.047002314815 | 42.555 |
| 44098.08866898149 | 42.304 |
| 44098.13033564815 | 42.285 |
| 44098.172002314815 | 42.169 |
| 44098.21366898149 | 42.092 |
| 44098.25533564815 | 42.034 |
| 44098.297002314815 | 41.899 |
| 44098.33866898149 | 41.995 |
| 44098.38033564815 | 42.516 |
| 44098.422002314815 | 43.771 |
| 44098.46366898149 | 45.219 |
| 44098.50533564815 | 46.609 |
| 44098.547002314815 | 47.497 |
| 44098.58866898149 | 48.482 |
| 44098.63033564815 | 48.636 |
| 44098.672002314815 | 47.883 |
| 44098.71366898149 | 46.802 |
| 44098.75533564815 | 45.798 |
| 44098.797002314815 | 44.659 |
| 44098.83866898149 | 43.887 |
| 44098.88033564815 | 43.482 |
| 44098.922002314815 | 43.231 |
| 44098.96366898149 | 42.999 |
| 44099.00533564815 | 42.864 |
| 44099.047002314815 | 42.69 |
| 44099.08866898149 | 42.555 |
| 44099.13033564815 | 42.362 |
| 44099.172002314815 | 42.362 |
| 44099.21366898149 | 42.265 |
| 44099.25533564815 | 42.15 |
| 44099.297002314815 | 42.13 |
| 44099.33866898149 | 42.169 |
| 44099.38033564815 | 42.632 |
| 44099.422002314815 | 43.771 |
| 44099.46366898149 | 46.319 |
| 44099.50533564815 | 47.883 |
| 44099.547002314815 | 48.173 |
| 44099.58866898149 | 48.385 |
| 44099.63033564815 | 48.366 |
| 44099.672002314815 | 47.594 |
| 44099.71366898149 | 46.513 |
| 44099.75533564815 | 45.412 |
| 44099.797002314815 | 44.466 |
| 44099.83866898149 | 43.829 |
| 44099.88033564815 | 43.482 |
| 44099.922002314815 | 43.269 |
| 44099.96366898149 | 43.173 |
| 44100.00533564815 | 42.999 |
| 44100.047002314815 | 42.864 |
| 44100.08866898149 | 42.748 |
| 44100.13033564815 | 42.651 |
| 44100.172002314815 | 42.478 |
| 44100.21366898149 | 42.439 |
| 44100.25533564815 | 42.381 |
| 44100.297002314815 | 42.381 |
| 44100.33866898149 | 42.536 |
| 44100.38033564815 | 43.018 |
| 44100.422002314815 | 43.771 |
| 44100.46366898149 | 45.74 |
| 44100.50533564815 | 47.207 |
| 44100.547002314815 | 47.458 |
| 44100.58866898149 | 48.462 |
| 44100.63033564815 | 48.713 |
| 44100.672002314815 | 47.555 |
| 44100.71366898149 | 46.455 |
| 44100.75533564815 | 45.412 |
| 44100.797002314815 | 44.505 |
| 44100.83866898149 | 43.868 |
| 44100.88033564815 | 43.617 |
| 44100.922002314815 | 43.482 |
| 44100.96366898149 | 43.482 |
| 44101.00533564815 | 43.308 |
| 44101.047002314815 | 43.289 |
| 44101.08866898149 | 43.269 |
| 44101.13033564815 | 43.095 |
| 44101.172002314815 | 42.922 |
| 44101.21366898149 | 42.748 |
| 44101.25533564815 | 42.246 |
| 44101.297002314815 | 40.837 |
| 44101.33866898149 | 41.667 |
| 44101.38033564815 | 43.713 |
| 44101.422002314815 | 46.397 |
| 44101.46366898149 | 58.849 |
| 44101.50533564815 | 53.424 |
| 44101.547002314815 | 50.818 |
| 44101.58866898149 | 51.3 |
| 44101.63033564815 | 50.489 |
| 44101.672002314815 | 49.987 |
| 44101.71366898149 | 49.485 |
| 44101.75533564815 | 47.458 |
| 44101.797002314815 | 43.771 |
| 44101.83866898149 | 41.3 |
| 44101.88033564815 | 39.312 |
| 44101.922002314815 | 37.516 |
| 44101.96366898149 | 37.072 |
| 44102.00533564815 | 36.204 |
| 44102.047002314815 | 36.126 |
| 44102.08866898149 | 35.47 |
| 44102.13033564815 | 35.238 |
| 44102.172002314815 | 34.138 |
| 44102.21366898149 | 31.397 |
| 44102.25533564815 | 29.833 |
| 44102.297002314815 | 28.559 |
| 44102.33866898149 | 28.404 |
| 44102.38033564815 | 31.377 |
| 44102.422002314815 | 35.721 |
| 44102.46366898149 | 61.3 |
| 44102.50533564815 | 53.984 |
| 44102.547002314815 | 49.254 |
| 44102.58866898149 | 48.231 |
| 44102.63033564815 | 46.995 |
| 44102.672002314815 | 47.401 |
| 44102.71366898149 | 47.478 |
| 44102.75533564815 | 46.59 |
| 44102.797002314815 | 43.057 |
| 44102.83866898149 | 40.277 |
| 44102.88033564815 | 38.192 |
| 44102.922002314815 | 35.644 |
| 44102.96366898149 | 32.767 |
| 44103.00533564815 | 31.628 |
| 44103.047002314815 | 30.721 |
| 44103.08866898149 | 30.315 |
| 44103.13033564815 | 30.084 |
| 44103.172002314815 | 30.412 |
| 44103.21366898149 | 29.601 |
| 44103.25533564815 | 30.258 |
| 44103.297002314815 | 29.717 |
| 44103.33866898149 | 30.084 |
| 44103.38033564815 | 33.964 |
| 44103.422002314815 | 38.617 |
| 44103.46366898149 | 72.768 |
| 44103.50533564815 | 66.03 |
| 44103.547002314815 | 61.899 |
| 44103.58866898149 | 60.586 |
| 44103.63033564815 | 58.52 |
| 44103.672002314815 | 57.922 |
| 44103.71366898149 | 57.632 |
| 44103.75533564815 | 54.794 |
| 44103.797002314815 | 49.254 |
| 44103.83866898149 | 44.428 |
| 44103.88033564815 | 40.972 |
| 44103.922002314815 | 39.485 |
| 44103.96366898149 | 38.076 |
| 44104.00533564815 | 36.705 |
| 44104.047002314815 | 36.377 |
| 44104.08866898149 | 35.624 |
| 44104.13033564815 | 35.122 |
| 44104.172002314815 | 34.157 |
| 44104.21366898149 | 33.366 |
| 44104.25533564815 | 32.304 |
| 44104.297002314815 | 31.744 |
| 44104.33866898149 | 32.574 |
| 44104.38033564815 | 37.304 |
| 44104.422002314815 | 42.188 |
| 44104.46366898149 | 75.702 |
| 44104.50533564815 | 72.69 |
| 44104.547002314815 | 63.791 |
| 44104.58866898149 | 62.362 |
| 44104.63033564815 | 59.756 |
| 44104.672002314815 | 59.08 |
| 44104.71366898149 | 58.347 |
| 44104.75533564815 | 55.914 |
| 44104.797002314815 | 49.466 |
| 44104.83866898149 | 44.987 |
| 44104.88033564815 | 41.763 |
| 44104.922002314815 | 39.543 |
| 44104.96366898149 | 38.095 |
| 44105.00533564815 | 37.806 |
| 44105.047002314815 | 36.841 |
| 44105.08866898149 | 35.837 |
| 44105.13033564815 | 35.103 |
| 44105.172002314815 | 34.138 |
| 44105.21366898149 | 33.404 |
| 44105.25533564815 | 32.825 |
| 44105.297002314815 | 31.667 |
| 44105.33866898149 | 31.358 |
| 44105.38033564815 | 36.165 |
| 44105.422002314815 | 41.358 |
| 44105.46366898149 | 74.833 |
| 44105.50533564815 | 71.185 |
| 44105.547002314815 | 61.455 |
| 44105.58866898149 | 59.563 |
| 44105.63033564815 | 57.536 |
| 44105.672002314815 | 56.879 |
| 44105.71366898149 | 56.532 |
| 44105.75533564815 | 54.292 |
| 44105.797002314815 | 48.443 |
| 44105.83866898149 | 43.848 |
| 44105.88033564815 | 40.682 |
| 44105.922002314815 | 39.003 |
| 44105.96366898149 | 38.462 |
| 44106.00533564815 | 36.59 |
| 44106.047002314815 | 35.431 |
| 44106.08866898149 | 35.875 |
| 44106.13033564815 | 34.891 |
| 44106.172002314815 | 33.52 |
| 44106.21366898149 | 32.883 |
| 44106.25533564815 | 32.729 |
| 44106.297002314815 | 31.802 |
| 44106.33866898149 | 33.462 |
| 44106.38033564815 | 37.748 |
| 44106.422002314815 | 42.265 |
| 44106.46366898149 | 76.995 |
| 44106.50533564815 | 69.37 |
| 44106.547002314815 | 63.038 |
| 44106.58866898149 | 59.968 |
| 44106.63033564815 | 59.601 |
| 44106.672002314815 | 57.825 |
| 44106.71366898149 | 56.783 |
| 44106.75533564815 | 54.099 |
| 44106.797002314815 | 49.717 |
| 44106.83866898149 | 44.91 |
| 44106.88033564815 | 41.319 |
| 44106.922002314815 | 38.829 |
| 44106.96366898149 | 38.25 |
| 44107.00533564815 | 37.014 |
| 44107.047002314815 | 36.551 |
| 44107.08866898149 | 35.817 |
| 44107.13033564815 | 34.891 |
| 44107.172002314815 | 33.037 |
| 44107.21366898149 | 32.4 |
| 44107.25533564815 | 31.763 |
| 44107.297002314815 | 30.933 |
| 44107.33866898149 | 31.841 |
| 44107.38033564815 | 36.03 |
| 44107.422002314815 | 41.551 |
| 44107.46366898149 | 72.015 |
| 44107.50533564815 | 71.841 |
| 44107.547002314815 | 58.964 |
| 44107.58866898149 | 57.806 |
| 44107.63033564815 | 56.532 |
| 44107.672002314815 | 56.165 |
| 44107.71366898149 | 55.625 |
| 44107.75533564815 | 53.404 |
| 44107.797002314815 | 47.922 |
| 44107.83866898149 | 43.52 |
| 44107.88033564815 | 40.972 |
| 44107.922002314815 | 39.312 |
| 44107.96366898149 | 38.288 |
| 44108.00533564815 | 36.319 |
| 44108.047002314815 | 34.485 |
| 44108.08866898149 | 33.887 |
| 44108.13033564815 | 34.582 |
| 44108.172002314815 | 34.254 |
| 44108.21366898149 | 33.617 |
| 44108.25533564815 | 33.366 |
| 44108.297002314815 | 32.941 |
| 44108.33866898149 | 33.231 |
| 44108.38033564815 | 38.346 |
| 44108.422002314815 | 41.088 |
| 44108.46366898149 | 78.231 |
| 44108.50533564815 | 78.134 |
| 44108.547002314815 | 64.35 |
| 44108.58866898149 | 61.706 |
| 44108.63033564815 | 59.312 |
| 44108.672002314815 | 58.289 |
| 44108.71366898149 | 56.764 |
| 44108.75533564815 | 53.771 |
| 44108.797002314815 | 48.675 |
| 44108.83866898149 | 46.184 |
| 44108.88033564815 | 44.775 |
| 44108.922002314815 | 42.439 |
| 44108.96366898149 | 40.065 |
| 44109.00533564815 | 38.559 |
| 44109.047002314815 | 37.497 |
| 44109.08866898149 | 35.856 |
| 44109.13033564815 | 34.833 |
| 44109.172002314815 | 33.81 |
| 44109.21366898149 | 33.095 |
| 44109.25533564815 | 32.362 |
| 44109.297002314815 | 31.86 |
| 44109.33866898149 | 32.227 |
| 44109.38033564815 | 36.512 |
| 44109.422002314815 | 41.686 |
| 44109.46366898149 | 69.293 |
| 44109.50533564815 | 72.111 |
| 44109.547002314815 | 65.065 |
| 44109.58866898149 | 61.262 |
| 44109.63033564815 | 59.196 |
| 44109.672002314815 | 57.98 |
| 44109.71366898149 | 56.667 |
| 44109.75533564815 | 54.061 |
| 44109.797002314815 | 48.945 |
| 44109.83866898149 | 44.466 |
| 44109.88033564815 | 41.628 |
| 44109.922002314815 | 39.987 |
| 44109.96366898149 | 38.79 |
| 44110.00533564815 | 37.536 |
| 44110.047002314815 | 36.57 |
| 44110.08866898149 | 35.644 |
| 44110.13033564815 | 34.891 |
| 44110.172002314815 | 34.389 |
| 44110.21366898149 | 33.52 |
| 44110.25533564815 | 32.343 |
| 44110.297002314815 | 32.42 |
| 44110.33866898149 | 33.366 |
| 44110.38033564815 | 36.744 |
| 44110.422002314815 | 40.991 |
| 44110.46366898149 | 73.791 |
| 44110.50533564815 | 78.096 |
| 44110.547002314815 | 67.073 |
| 44110.58866898149 | 62.922 |
| 44110.63033564815 | 60.663 |
| 44110.672002314815 | 58.906 |
| 44110.71366898149 | 57.188 |
| 44110.75533564815 | 53.308 |
| 44110.797002314815 | 48.153 |
| 44110.83866898149 | 44.679 |
| 44110.88033564815 | 42.227 |
| 44110.922002314815 | 40.065 |
| 44110.96366898149 | 39.099 |
| 44111.00533564815 | 38.655 |
| 44111.047002314815 | 38.038 |
| 44111.08866898149 | 37.014 |
| 44111.13033564815 | 35.953 |
| 44111.172002314815 | 35.161 |
| 44111.21366898149 | 33.404 |
| 44111.25533564815 | 33.153 |
| 44111.297002314815 | 33.636 |
| 44111.33866898149 | 34.543 |
| 44111.38033564815 | 37.767 |
| 44111.422002314815 | 42.034 |
| 44111.46366898149 | 78.366 |
| 44111.50533564815 | 80.644 |
| 44111.547002314815 | 67.941 |
| 44111.58866898149 | 64.1 |
| 44111.63033564815 | 62.246 |
| 44111.672002314815 | 60.528 |
| 44111.71366898149 | 58.887 |
| 44111.75533564815 | 55.451 |
| 44111.797002314815 | 49.698 |
| 44111.83866898149 | 46.319 |
| 44111.88033564815 | 44.814 |
| 44111.922002314815 | 42.13 |
| 44111.96366898149 | 42.42 |
| 44112.00533564815 | 41.068 |
| 44112.047002314815 | 39.968 |
| 44112.08866898149 | 38.578 |
| 44112.13033564815 | 37.478 |
| 44112.172002314815 | 37.285 |
| 44112.21366898149 | 36.57 |
| 44112.25533564815 | 36.01 |
| 44112.297002314815 | 35.354 |
| 44112.33866898149 | 35.663 |
| 44112.38033564815 | 39.022 |
| 44112.422002314815 | 43.192 |
| 44112.46366898149 | 44.949 |
| 44112.50533564815 | 46.899 |
| 44112.547002314815 | 48.269 |
| 44112.58866898149 | 48.636 |
| 44112.63033564815 | 48.443 |
| 44112.672002314815 | 47.458 |
| 44112.71366898149 | 46.126 |
| 44112.75533564815 | 44.833 |
| 44112.797002314815 | 43.829 |
| 44112.83866898149 | 43.25 |
| 44112.88033564815 | 42.941 |
| 44112.922002314815 | 42.632 |
| 44112.96366898149 | 42.42 |
| 44113.00533564815 | 42.246 |
| 44113.047002314815 | 42.072 |
| 44113.08866898149 | 41.937 |
| 44113.13033564815 | 41.841 |
| 44113.172002314815 | 41.783 |
| 44113.21366898149 | 41.551 |
| 44113.25533564815 | 41.397 |
| 44113.297002314815 | 41.242 |
| 44113.33866898149 | 41.223 |
| 44113.38033564815 | 41.57 |
| 44113.422002314815 | 42.516 |
| 44113.46366898149 | 44.775 |
| 44113.50533564815 | 46.899 |
| 44113.547002314815 | 48.404 |
| 44113.58866898149 | 49.022 |
| 44113.63033564815 | 48.829 |
| 44113.672002314815 | 47.381 |
| 44113.71366898149 | 46.3 |
| 44113.75533564815 | 45.451 |
| 44113.797002314815 | 44.601 |
| 44113.83866898149 | 44.119 |
| 44113.88033564815 | 43.655 |
| 44113.922002314815 | 43.308 |
| 44113.96366898149 | 43.038 |
| 44114.00533564815 | 42.787 |
| 44114.047002314815 | 42.497 |
| 44114.08866898149 | 42.246 |
| 44114.13033564815 | 42.111 |
| 44114.172002314815 | 41.937 |
| 44114.21366898149 | 41.821 |
| 44114.25533564815 | 41.686 |
| 44114.297002314815 | 41.532 |
| 44114.33866898149 | 41.474 |
| 44114.38033564815 | 41.667 |
| 44114.422002314815 | 42.69 |
| 44114.46366898149 | 44.814 |
| 44114.50533564815 | 46.821 |
| 44114.547002314815 | 48.173 |
| 44114.58866898149 | 49.022 |
| 44114.63033564815 | 48.887 |
| 44114.672002314815 | 47.98 |
| 44114.71366898149 | 46.937 |
| 44114.75533564815 | 45.702 |
| 44114.797002314815 | 44.621 |
| 44114.83866898149 | 43.984 |
| 44114.88033564815 | 43.617 |
| 44114.922002314815 | 43.25 |
| 44114.96366898149 | 42.883 |
| 44115.00533564815 | 42.555 |
| 44115.047002314815 | 42.304 |
| 44115.08866898149 | 42.111 |
| 44115.13033564815 | 41.918 |
| 44115.172002314815 | 41.841 |
| 44115.21366898149 | 41.744 |
| 44115.25533564815 | 41.783 |
| 44115.297002314815 | 41.725 |
| 44115.33866898149 | 41.821 |
| 44115.38033564815 | 42.381 |
| 44115.422002314815 | 43.076 |
| 44115.46366898149 | 43.54 |
| 44115.50533564815 | 43.424 |
| 44115.547002314815 | 43.308 |
| 44115.58866898149 | 41.551 |
| 44115.63033564815 | 40.238 |
| 44115.672002314815 | 39.582 |
| 44115.71366898149 | 40.489 |
| 44115.75533564815 | 41.204 |
| 44115.797002314815 | 41.088 |
| 44115.83866898149 | 40.837 |
| 44115.88033564815 | 40.431 |
| 44115.922002314815 | 39.736 |
| 44115.96366898149 | 39.466 |
| 44116.00533564815 | 39.389 |
| 44116.047002314815 | 39.254 |
| 44116.08866898149 | 39.099 |
| 44116.13033564815 | 39.138 |
| 44116.172002314815 | 38.887 |
| 44116.21366898149 | 38.79 |
| 44116.25533564815 | 38.906 |
| 44116.297002314815 | 38.829 |
| 44116.33866898149 | 38.926 |
| 44116.38033564815 | 39.196 |
| 44116.422002314815 | 40.219 |
| 44116.46366898149 | 42.574 |
| 44116.50533564815 | 44.814 |
| 44116.547002314815 | 46.435 |
| 44116.58866898149 | 47.845 |
| 44116.63033564815 | 48.134 |
| 44116.672002314815 | 47.053 |
| 44116.71366898149 | 45.567 |
| 44116.75533564815 | 44.466 |
| 44116.797002314815 | 43.173 |
| 44116.83866898149 | 42.072 |
| 44116.88033564815 | 41.628 |
| 44116.922002314815 | 41.474 |
| 44116.96366898149 | 41.377 |
| 44117.00533564815 | 41.261 |
| 44117.047002314815 | 41.088 |
| 44117.08866898149 | 40.933 |
| 44117.13033564815 | 40.817 |
| 44117.172002314815 | 40.779 |
| 44117.21366898149 | 40.682 |
| 44117.25533564815 | 40.624 |
| 44117.297002314815 | 40.509 |
| 44117.33866898149 | 40.489 |
| 44117.38033564815 | 40.702 |
| 44117.422002314815 | 41.744 |
| 44117.46366898149 | 44.003 |
| 44117.50533564815 | 46.03 |
| 44117.547002314815 | 47.401 |
| 44117.58866898149 | 48.289 |
| 44117.63033564815 | 48.617 |
| 44117.672002314815 | 47.458 |
| 44117.71366898149 | 46.204 |
| 44117.75533564815 | 44.929 |
| 44117.797002314815 | 43.848 |
| 44117.83866898149 | 43.057 |
| 44117.88033564815 | 42.729 |
| 44117.922002314815 | 42.4 |
| 44117.96366898149 | 42.188 |
| 44118.00533564815 | 41.918 |
| 44118.047002314815 | 41.841 |
| 44118.08866898149 | 41.667 |
| 44118.13033564815 | 41.686 |
| 44118.172002314815 | 41.59 |
| 44118.21366898149 | 41.512 |
| 44118.25533564815 | 41.628 |
| 44118.297002314815 | 41.609 |
| 44118.33866898149 | 41.609 |
| 44118.38033564815 | 41.821 |
| 44118.422002314815 | 42.632 |
| 44118.46366898149 | 44.679 |
| 44118.50533564815 | 46.319 |
| 44118.547002314815 | 47.516 |
| 44118.58866898149 | 48.115 |
| 44118.63033564815 | 48.115 |
| 44118.672002314815 | 47.188 |
| 44118.71366898149 | 45.972 |
| 44118.75533564815 | 44.833 |
| 44118.797002314815 | 43.964 |
| 44118.83866898149 | 43.501 |
| 44118.88033564815 | 43.173 |
| 44118.922002314815 | 42.748 |
| 44118.96366898149 | 42.343 |
| 44119.00533564815 | 41.956 |
| 44119.047002314815 | 41.744 |
| 44119.08866898149 | 41.609 |
| 44119.13033564815 | 41.435 |
| 44119.172002314815 | 41.242 |
| 44119.21366898149 | 40.895 |
| 44119.25533564815 | 40.702 |
| 44119.297002314815 | 40.489 |
| 44119.33866898149 | 40.219 |
| 44119.38033564815 | 40.354 |
| 44119.422002314815 | 41.068 |
| 44119.46366898149 | 42.767 |
| 44119.50533564815 | 44.35 |
| 44119.547002314815 | 45.624 |
| 44119.58866898149 | 46.358 |
| 44119.63033564815 | 46.223 |
| 44119.672002314815 | 45.007 |
| 44119.71366898149 | 43.655 |
| 44119.75533564815 | 42.536 |
| 44119.797002314815 | 41.628 |
| 44119.83866898149 | 41.146 |
| 44119.88033564815 | 41.03 |
| 44119.922002314815 | 40.875 |
| 44119.96366898149 | 40.817 |
| 44120.00533564815 | 40.624 |
| 44120.047002314815 | 40.47 |
| 44120.08866898149 | 40.373 |
| 44120.13033564815 | 40.296 |
| 44120.172002314815 | 40.2 |
| 44120.21366898149 | 40.084 |
| 44120.25533564815 | 40.007 |
| 44120.297002314815 | 39.91 |
| 44120.33866898149 | 39.987 |
| 44120.38033564815 | 40.277 |
| 44120.422002314815 | 41.146 |
| 44120.46366898149 | 43.559 |
| 44120.50533564815 | 45.373 |
| 44120.547002314815 | 46.088 |
| 44120.58866898149 | 45.895 |
| 44120.63033564815 | 45.837 |
| 44120.672002314815 | 45.509 |
| 44120.71366898149 | 44.698 |
| 44120.75533564815 | 43.675 |
| 44120.797002314815 | 42.767 |
| 44120.83866898149 | 42.188 |
| 44120.88033564815 | 41.86 |
| 44120.922002314815 | 41.609 |
| 44120.96366898149 | 41.493 |
| 44121.00533564815 | 41.397 |
| 44121.047002314815 | 41.377 |
| 44121.08866898149 | 41.319 |
| 44121.13033564815 | 41.146 |
| 44121.172002314815 | 41.165 |
| 44121.21366898149 | 41.146 |
| 44121.25533564815 | 41.165 |
| 44121.297002314815 | 41.165 |
| 44121.33866898149 | 41.126 |
| 44121.38033564815 | 41.725 |
| 44121.422002314815 | 42.613 |
| 44121.46366898149 | 43.578 |
| 44121.50533564815 | 43.964 |
| 44121.547002314815 | 45.084 |
| 44121.58866898149 | 46.223 |
| 44121.63033564815 | 46.899 |
| 44121.672002314815 | 46.165 |
| 44121.71366898149 | 44.968 |
| 44121.75533564815 | 43.926 |
| 44121.797002314815 | 43.018 |
| 44121.83866898149 | 42.651 |
| 44121.88033564815 | 42.536 |
| 44121.922002314815 | 42.478 |
| 44121.96366898149 | 42.323 |
| 44122.00533564815 | 42.188 |
| 44122.047002314815 | 42.014 |
| 44122.08866898149 | 41.918 |
| 44122.13033564815 | 41.802 |
| 44122.172002314815 | 41.706 |
| 44122.21366898149 | 41.609 |
| 44122.25533564815 | 41.686 |
| 44122.297002314815 | 41.744 |
| 44122.33866898149 | 41.783 |
| 44122.38033564815 | 42.169 |
| 44122.422002314815 | 42.767 |
| 44122.46366898149 | 44.543 |
| 44122.50533564815 | 46.3 |
| 44122.547002314815 | 47.767 |
| 44122.58866898149 | 48.559 |
| 44122.63033564815 | 48.424 |
| 44122.672002314815 | 47.304 |
| 44122.71366898149 | 46.165 |
| 44122.75533564815 | 44.872 |
| 44122.797002314815 | 43.829 |
| 44122.83866898149 | 43.501 |
| 44122.88033564815 | 43.289 |
| 44122.922002314815 | 42.98 |
| 44122.96366898149 | 42.632 |
| 44123.00533564815 | 42.42 |
| 44123.047002314815 | 42.188 |
| 44123.08866898149 | 42.034 |
| 44123.13033564815 | 41.841 |
| 44123.172002314815 | 41.628 |
| 44123.21366898149 | 41.609 |
| 44123.25533564815 | 41.628 |
| 44123.297002314815 | 41.706 |
| 44123.33866898149 | 41.706 |
| 44123.38033564815 | 41.821 |
| 44123.422002314815 | 42.555 |
| 44123.46366898149 | 44.234 |
| 44123.50533564815 | 45.779 |
| 44123.547002314815 | 46.879 |
| 44123.58866898149 | 47.034 |
| 44123.63033564815 | 47.343 |
| 44123.672002314815 | 46.976 |
| 44123.71366898149 | 45.798 |
| 44123.75533564815 | 44.543 |
| 44123.797002314815 | 43.482 |
| 44123.83866898149 | 42.922 |
| 44123.88033564815 | 42.651 |
| 44123.922002314815 | 42.594 |
| 44123.96366898149 | 42.42 |
| 44124.00533564815 | 42.227 |
| 44124.047002314815 | 42.014 |
| 44124.08866898149 | 41.918 |
| 44124.13033564815 | 41.744 |
| 44124.172002314815 | 41.686 |
| 44124.21366898149 | 41.57 |
| 44124.25533564815 | 41.397 |
| 44124.297002314815 | 41.358 |
| 44124.33866898149 | 41.3 |
| 44124.38033564815 | 41.3 |
| 44124.422002314815 | 42.111 |
| 44124.46366898149 | 44.138 |
| 44124.50533564815 | 45.895 |
| 44124.547002314815 | 46.937 |
| 44124.58866898149 | 47.188 |
| 44124.63033564815 | 47.227 |
| 44124.672002314815 | 46.783 |
| 44124.71366898149 | 45.76 |
| 44124.75533564815 | 44.621 |
| 44124.797002314815 | 43.655 |
| 44124.83866898149 | 43.115 |
| 44124.88033564815 | 42.806 |
| 44124.922002314815 | 42.555 |
| 44124.96366898149 | 42.265 |
| 44125.00533564815 | 41.995 |
| 44125.047002314815 | 41.821 |
| 44125.08866898149 | 41.648 |
| 44125.13033564815 | 41.493 |
| 44125.172002314815 | 41.358 |
| 44125.21366898149 | 41.319 |
| 44125.25533564815 | 41.339 |
| 44125.297002314815 | 41.223 |
| 44125.33866898149 | 41.223 |
| 44125.38033564815 | 41.319 |
| 44125.422002314815 | 42.15 |
| 44125.46366898149 | 43.984 |
| 44125.50533564815 | 45.354 |
| 44125.547002314815 | 46.513 |
| 44125.58866898149 | 47.381 |
| 44125.63033564815 | 47.516 |
| 44125.672002314815 | 46.59 |
| 44125.71366898149 | 45.354 |
| 44125.75533564815 | 44.234 |
| 44125.797002314815 | 43.346 |
| 44125.83866898149 | 42.902 |
| 44125.88033564815 | 42.497 |
| 44125.922002314815 | 42.227 |
| 44125.96366898149 | 41.976 |
| 44126.00533564815 | 41.763 |
| 44126.047002314815 | 41.628 |
| 44126.08866898149 | 41.416 |
| 44126.13033564815 | 41.339 |
| 44126.172002314815 | 41.261 |
| 44126.21366898149 | 41.242 |
| 44126.25533564815 | 41.088 |
| 44126.297002314815 | 41.068 |
| 44126.33866898149 | 41.165 |
| 44126.38033564815 | 41.242 |
| 44126.422002314815 | 42.092 |
| 44126.46366898149 | 44.022 |
| 44126.50533564815 | 45.779 |
| 44126.547002314815 | 46.995 |
| 44126.58866898149 | 47.439 |
| 44126.63033564815 | 47.169 |
| 44126.672002314815 | 46.262 |
| 44126.71366898149 | 45.026 |
| 44126.75533564815 | 43.848 |
| 44126.797002314815 | 42.98 |
| 44126.83866898149 | 42.536 |
| 44126.88033564815 | 42.092 |
| 44126.922002314815 | 41.686 |
| 44126.96366898149 | 41.474 |
| 44127.00533564815 | 41.493 |
| 44127.047002314815 | 41.377 |
| 44127.08866898149 | 41.126 |
| 44127.13033564815 | 40.779 |
| 44127.172002314815 | 40.586 |
| 44127.21366898149 | 40.47 |
| 44127.25533564815 | 40.431 |
| 44127.297002314815 | 40.238 |
| 44127.33866898149 | 40.18 |
| 44127.38033564815 | 40.528 |
| 44127.422002314815 | 41.416 |
| 44127.46366898149 | 42.651 |
| 44127.50533564815 | 43.887 |
| 44127.547002314815 | 44.968 |
| 44127.58866898149 | 45.2 |
| 44127.63033564815 | 45.103 |
| 44127.672002314815 | 44.794 |
| 44127.71366898149 | 44.119 |
| 44127.75533564815 | 43.269 |
| 44127.797002314815 | 42.516 |
| 44127.83866898149 | 42.111 |
| 44127.88033564815 | 42.072 |
| 44127.922002314815 | 42.072 |
| 44127.96366898149 | 42.188 |
| 44128.00533564815 | 42.15 |
| 44128.047002314815 | 41.879 |
| 44128.08866898149 | 41.725 |
| 44128.13033564815 | 41.706 |
| 44128.172002314815 | 41.706 |
| 44128.21366898149 | 41.648 |
| 44128.25533564815 | 41.57 |
| 44128.297002314815 | 41.493 |
| 44128.33866898149 | 41.493 |
| 44128.38033564815 | 41.628 |
| 44128.422002314815 | 42.13 |
| 44128.46366898149 | 43.617 |
| 44128.50533564815 | 45.373 |
| 44128.547002314815 | 46.435 |
| 44128.58866898149 | 45.76 |
| 44128.63033564815 | 44.91 |
| 44128.672002314815 | 44.447 |
| 44128.71366898149 | 44.003 |
| 44128.75533564815 | 43.617 |
| 44128.797002314815 | 43.25 |
| 44128.83866898149 | 43.038 |
| 44128.88033564815 | 42.825 |
| 44128.922002314815 | 42.594 |
| 44128.96366898149 | 42.497 |
| 44129.00533564815 | 42.381 |
| 44129.047002314815 | 42.381 |
| 44129.08866898149 | 42.458 |
| 44129.13033564815 | 42.381 |
| 44129.172002314815 | 42.381 |
| 44129.21366898149 | 42.323 |
| 44129.25533564815 | 42.246 |
| 44129.297002314815 | 42.227 |
| 44129.33866898149 | 42.323 |
| 44129.38033564815 | 42.439 |
| 44129.422002314815 | 42.883 |
| 44129.46366898149 | 44.157 |
| 44129.50533564815 | 45.837 |
| 44129.547002314815 | 45.393 |
| 44129.58866898149 | 43.868 |
| 44129.63033564815 | 42.458 |
| 44129.672002314815 | 40.721 |
| 44129.71366898149 | 39.543 |
| 44129.75533564815 | 38.385 |
| 44129.797002314815 | 37.844 |
| 44129.83866898149 | 38.404 |
| 44129.88033564815 | 39.138 |
| 44129.922002314815 | 39.408 |
| 44129.96366898149 | 39.215 |
| 44130.00533564815 | 39.234 |
| 44130.047002314815 | 39.099 |
| 44130.08866898149 | 39.389 |
| 44130.13033564815 | 39.621 |
| 44130.172002314815 | 39.582 |
| 44130.21366898149 | 39.408 |
| 44130.25533564815 | 39.312 |
| 44130.297002314815 | 39.408 |
| 44130.33866898149 | 39.312 |
| 44130.38033564815 | 39.254 |
| 44130.422002314815 | 39.698 |
| 44130.46366898149 | 40.277 |
| 44130.50533564815 | 40.798 |
| 44130.547002314815 | 41.783 |
| 44130.58866898149 | 42.497 |
| 44130.63033564815 | 42.787 |
| 44130.672002314815 | 42.227 |
| 44130.71366898149 | 41.281 |
| 44130.75533564815 | 40.509 |
| 44130.797002314815 | 39.949 |
| 44130.83866898149 | 39.717 |
| 44130.88033564815 | 39.601 |
| 44130.922002314815 | 39.428 |
| 44130.96366898149 | 39.659 |
| 44131.00533564815 | 39.91 |
| 44131.047002314815 | 39.852 |
| 44131.08866898149 | 39.485 |
| 44131.13033564815 | 39.234 |
| 44131.172002314815 | 39.138 |
| 44131.21366898149 | 39.177 |
| 44131.25533564815 | 39.196 |
| 44131.297002314815 | 39.177 |
| 44131.33866898149 | 39.234 |
| 44131.38033564815 | 39.505 |
| 44131.422002314815 | 40.393 |
| 44131.46366898149 | 41.995 |
| 44131.50533564815 | 43.713 |
| 44131.547002314815 | 44.833 |
| 44131.58866898149 | 44.987 |
| 44131.63033564815 | 43.984 |
| 44131.672002314815 | 42.883 |
| 44131.71366898149 | 41.59 |
| 44131.75533564815 | 40.779 |
| 44131.797002314815 | 40.354 |
| 44131.83866898149 | 40.219 |
| 44131.88033564815 | 40.103 |
| 44131.922002314815 | 40.084 |
| 44131.96366898149 | 40.026 |
| 44132.00533564815 | 39.872 |
| 44132.047002314815 | 39.852 |
| 44132.08866898149 | 39.736 |
| 44132.13033564815 | 39.775 |
| 44132.172002314815 | 39.794 |
| 44132.21366898149 | 39.756 |
| 44132.25533564815 | 39.814 |
| 44132.297002314815 | 39.891 |
| 44132.33866898149 | 39.929 |
| 44132.38033564815 | 40.122 |
| 44132.422002314815 | 40.817 |
| 44132.46366898149 | 42.362 |
| 44132.50533564815 | 44.061 |
| 44132.547002314815 | 44.968 |
| 44132.58866898149 | 45.219 |
| 44132.63033564815 | 44.872 |
| 44132.672002314815 | 44.022 |
| 44132.71366898149 | 42.864 |
| 44132.75533564815 | 41.918 |
| 44132.797002314815 | 41.416 |
| 44132.83866898149 | 41.146 |
| 44132.88033564815 | 40.953 |
| 44132.922002314815 | 40.76 |
| 44132.96366898149 | 40.644 |
| 44133.00533564815 | 40.547 |
| 44133.047002314815 | 40.354 |
| 44133.08866898149 | 40.316 |
| 44133.13033564815 | 40.277 |
| 44133.172002314815 | 40.258 |
| 44133.21366898149 | 40.277 |
| 44133.25533564815 | 40.277 |
| 44133.297002314815 | 40.316 |
| 44133.33866898149 | 40.373 |
| 44133.38033564815 | 40.586 |
| 44133.422002314815 | 41.532 |
| 44133.46366898149 | 43.173 |
| 44133.50533564815 | 44.621 |
| 44133.547002314815 | 45.605 |
| 44133.58866898149 | 46.011 |
| 44133.63033564815 | 45.818 |
| 44133.672002314815 | 44.794 |
| 44133.71366898149 | 43.559 |
| 44133.75533564815 | 42.574 |
| 44133.797002314815 | 41.763 |
| 44133.83866898149 | 41.3 |
| 44133.88033564815 | 41.03 |
| 44133.922002314815 | 40.798 |
| 44133.96366898149 | 40.721 |
| 44134.00533564815 | 40.624 |
| 44134.047002314815 | 40.47 |
| 44134.08866898149 | 40.47 |
| 44134.13033564815 | 40.509 |
| 44134.172002314815 | 40.47 |
| 44134.21366898149 | 40.431 |
| 44134.25533564815 | 40.431 |
| 44134.297002314815 | 40.373 |
| 44134.33866898149 | 40.393 |
| 44134.38033564815 | 40.605 |
| 44134.422002314815 | 41.435 |
| 44134.46366898149 | 42.98 |
| 44134.50533564815 | 44.485 |
| 44134.547002314815 | 45.76 |
| 44134.58866898149 | 46.262 |
| 44134.63033564815 | 45.837 |
| 44134.672002314815 | 44.794 |
| 44134.71366898149 | 43.733 |
| 44134.75533564815 | 42.632 |
| 44134.797002314815 | 41.899 |
| 44134.83866898149 | 41.512 |
| 44134.88033564815 | 41.204 |
| 44134.922002314815 | 40.991 |
| 44134.96366898149 | 40.914 |
| 44135.00533564815 | 40.856 |
| 44135.047002314815 | 40.779 |
| 44135.08866898149 | 40.702 |
| 44135.13033564815 | 40.702 |
| 44135.172002314815 | 40.76 |
| 44135.21366898149 | 40.779 |
| 44135.25533564815 | 40.74 |
| 44135.297002314815 | 40.76 |
| 44135.33866898149 | 40.779 |
| 44135.38033564815 | 40.914 |
| 44135.422002314815 | 41.802 |
| 44135.46366898149 | 43.269 |
| 44135.50533564815 | 44.601 |
| 44135.547002314815 | 45.412 |
| 44135.58866898149 | 45.933 |
| 44135.63033564815 | 45.682 |
| 44135.672002314815 | 44.833 |
| 44135.71366898149 | 43.733 |
| 44135.75533564815 | 42.729 |
| 44135.797002314815 | 41.976 |
| 44135.83866898149 | 41.551 |
| 44135.88033564815 | 41.204 |
| 44135.922002314815 | 40.991 |
| 44135.96366898149 | 40.856 |
| 44136.00533564815 | 40.798 |
| 44136.047002314815 | 40.721 |
| 44136.047002314815 | 40.644 |
| 44136.08866898149 | 40.586 |
| 44136.13033564815 | 40.567 |
| 44136.172002314815 | 40.586 |
| 44136.21366898149 | 40.586 |
| 44136.25533564815 | 40.605 |
| 44136.297002314815 | 40.605 |
| 44136.33866898149 | 40.76 |
| 44136.38033564815 | 41.57 |
| 44136.422002314815 | 43.076 |
| 44136.46366898149 | 44.582 |
| 44136.50533564815 | 45.586 |
| 44136.547002314815 | 45.933 |
| 44136.58866898149 | 45.605 |
| 44136.63033564815 | 44.872 |
| 44136.672002314815 | 43.848 |
| 44136.71366898149 | 42.883 |
| 44136.75533564815 | 42.169 |
| 44136.797002314815 | 41.706 |
| 44136.83866898149 | 41.416 |
| 44136.88033564815 | 41.223 |
| 44136.922002314815 | 41.03 |
| 44136.96366898149 | 40.914 |
| 44137.00533564815 | 40.875 |
| 44137.047002314815 | 40.837 |
| 44137.08866898149 | 40.856 |
| 44137.13033564815 | 40.798 |
| 44137.172002314815 | 40.779 |
| 44137.21366898149 | 40.76 |
| 44137.25533564815 | 40.76 |
| 44137.297002314815 | 40.76 |
| 44137.33866898149 | 41.011 |
| 44137.38033564815 | 41.725 |
| 44137.422002314815 | 43.153 |
| 44137.46366898149 | 44.601 |
| 44137.50533564815 | 45.875 |
| 44137.547002314815 | 46.184 |
| 44137.58866898149 | 45.818 |
| 44137.63033564815 | 45.026 |
| 44137.672002314815 | 44.022 |
| 44137.71366898149 | 43.076 |
| 44137.75533564815 | 42.381 |
| 44137.797002314815 | 41.995 |
| 44137.83866898149 | 41.706 |
| 44137.88033564815 | 41.435 |
| 44137.922002314815 | 41.281 |
| 44137.96366898149 | 41.204 |
| 44138.00533564815 | 41.126 |
| 44138.047002314815 | 41.107 |
| 44138.08866898149 | 41.107 |
| 44138.13033564815 | 41.088 |
| 44138.172002314815 | 41.068 |
| 44138.21366898149 | 41.068 |
| 44138.25533564815 | 41.126 |
| 44138.297002314815 | 41.204 |
| 44138.33866898149 | 41.416 |
| 44138.38033564815 | 41.841 |
| 44138.422002314815 | 42.941 |
| 44138.46366898149 | 43.559 |
| 44138.50533564815 | 44.447 |
| 44138.547002314815 | 44.91 |
| 44138.58866898149 | 45.084 |
| 44138.63033564815 | 44.987 |
| 44138.672002314815 | 44.292 |
| 44138.71366898149 | 43.597 |
| 44138.75533564815 | 42.922 |
| 44138.797002314815 | 42.381 |
| 44138.83866898149 | 41.879 |
| 44138.88033564815 | 41.57 |
| 44138.922002314815 | 41.435 |
| 44138.96366898149 | 41.3 |
| 44139.00533564815 | 41.242 |
| 44139.047002314815 | 41.184 |
| 44139.08866898149 | 41.088 |
| 44139.13033564815 | 41.107 |
| 44139.172002314815 | 41.068 |
| 44139.21366898149 | 41.088 |
| 44139.25533564815 | 41.088 |
| 44139.297002314815 | 41.126 |
| 44139.33866898149 | 41.339 |
| 44139.38033564815 | 42.188 |
| 44139.422002314815 | 43.636 |
| 44139.46366898149 | 44.968 |
| 44139.50533564815 | 46.011 |
| 44139.547002314815 | 46.493 |
| 44139.58866898149 | 46.262 |
| 44139.63033564815 | 45.065 |
| 44139.672002314815 | 44.157 |
| 44139.71366898149 | 43.404 |
| 44139.75533564815 | 42.902 |
| 44139.797002314815 | 42.536 |
| 44139.83866898149 | 42.111 |
| 44139.88033564815 | 41.841 |
| 44139.922002314815 | 41.667 |
| 44139.96366898149 | 41.512 |
| 44140.00533564815 | 41.435 |
| 44140.047002314815 | 41.358 |
| 44140.08866898149 | 41.261 |
| 44140.13033564815 | 41.184 |
| 44140.172002314815 | 41.204 |
| 44140.21366898149 | 41.088 |
| 44140.25533564815 | 41.049 |
| 44140.297002314815 | 41.049 |
| 44140.33866898149 | 41.184 |
| 44140.38033564815 | 41.841 |
| 44140.422002314815 | 43.231 |
| 44140.46366898149 | 44.756 |
| 44140.50533564815 | 45.953 |
| 44140.547002314815 | 46.377 |
| 44140.58866898149 | 46.165 |
| 44140.63033564815 | 45.393 |
| 44140.672002314815 | 44.389 |
| 44140.71366898149 | 43.501 |
| 44140.75533564815 | 42.825 |
| 44140.797002314815 | 42.323 |
| 44140.83866898149 | 42.014 |
| 44140.88033564815 | 41.783 |
| 44140.922002314815 | 41.609 |
| 44140.96366898149 | 41.416 |
| 44141.00533564815 | 41.339 |
| 44141.047002314815 | 41.242 |
| 44141.08866898149 | 41.146 |
| 44141.13033564815 | 41.126 |
| 44141.172002314815 | 41.088 |
| 44141.21366898149 | 41.03 |
| 44141.25533564815 | 40.972 |
| 44141.297002314815 | 41.03 |
| 44141.33866898149 | 41.184 |
| 44141.38033564815 | 41.667 |
| 44141.422002314815 | 42.69 |
| 44141.46366898149 | 43.964 |
| 44141.50533564815 | 44.717 |
| 44141.547002314815 | 44.563 |
| 44141.58866898149 | 44.254 |
| 44141.63033564815 | 43.906 |
| 44141.672002314815 | 43.617 |
| 44141.71366898149 | 43.192 |
| 44141.75533564815 | 42.864 |
| 44141.797002314815 | 42.536 |
| 44141.83866898149 | 42.304 |
| 44141.88033564815 | 42.13 |
| 44141.922002314815 | 41.956 |
| 44141.96366898149 | 41.725 |
| 44142.00533564815 | 41.377 |
| 44142.047002314815 | 41.223 |
| 44142.08866898149 | 41.165 |
| 44142.13033564815 | 41.088 |
| 44142.172002314815 | 41.068 |
| 44142.21366898149 | 41.146 |
| 44142.25533564815 | 41.165 |
| 44142.297002314815 | 41.223 |
| 44142.33866898149 | 41.377 |
| 44142.38033564815 | 42.072 |
| 44142.422002314815 | 43.54 |
| 44142.46366898149 | 44.621 |
| 44142.50533564815 | 44.601 |
| 44142.547002314815 | 44.35 |
| 44142.58866898149 | 44.312 |
| 44142.63033564815 | 44.196 |
| 44142.672002314815 | 44.099 |
| 44142.71366898149 | 43.675 |
| 44142.75533564815 | 43.211 |
| 44142.797002314815 | 42.845 |
| 44142.83866898149 | 42.671 |
| 44142.88033564815 | 42.516 |
| 44142.922002314815 | 42.458 |
| 44142.96366898149 | 42.362 |
| 44143.00533564815 | 42.265 |
| 44143.047002314815 | 42.227 |
| 44143.08866898149 | 42.188 |
| 44143.13033564815 | 41.474 |
| 44143.172002314815 | 41.049 |
| 44143.21366898149 | 40.74 |
| 44143.25533564815 | 40.702 |
| 44143.297002314815 | 40.335 |
| 44143.33866898149 | 40.277 |
| 44143.38033564815 | 40.933 |
| 44143.422002314815 | 41.744 |
| 44143.46366898149 | 42.941 |
| 44143.50533564815 | 44.215 |
| 44143.547002314815 | 44.621 |
| 44143.58866898149 | 44.621 |
| 44143.63033564815 | 44.041 |
| 44143.672002314815 | 43.115 |
| 44143.71366898149 | 42.111 |
| 44143.75533564815 | 41.474 |
| 44143.797002314815 | 41.126 |
| 44143.83866898149 | 40.953 |
| 44143.88033564815 | 41.126 |
| 44143.922002314815 | 41.068 |
| 44143.96366898149 | 40.991 |
| 44144.00533564815 | 40.489 |
| 44144.047002314815 | 40.354 |
| 44144.08866898149 | 40.065 |
| 44144.13033564815 | 40.219 |
| 44144.172002314815 | 40.065 |
| 44144.21366898149 | 40.219 |
| 44144.25533564815 | 40.238 |
| 44144.297002314815 | 40.18 |
| 44144.33866898149 | 40.431 |
| 44144.38033564815 | 40.914 |
| 44144.422002314815 | 41.184 |
| 44144.46366898149 | 41.686 |
| 44144.50533564815 | 42.439 |
| 44144.547002314815 | 42.536 |
| 44144.58866898149 | 41.976 |
| 44144.63033564815 | 41.146 |
| 44144.672002314815 | 40.47 |
| 44144.71366898149 | 40.605 |
| 44144.75533564815 | 40.354 |
| 44144.797002314815 | 40.084 |
| 44144.83866898149 | 40.103 |
| 44144.88033564815 | 39.968 |
| 44144.922002314815 | 39.814 |
| 44144.96366898149 | 39.929 |
| 44145.00533564815 | 39.949 |
| 44145.047002314815 | 39.987 |
| 44145.08866898149 | 39.929 |
| 44145.13033564815 | 39.949 |
| 44145.172002314815 | 39.814 |
| 44145.21366898149 | 39.621 |
| 44145.25533564815 | 39.582 |
| 44145.297002314815 | 39.466 |
| 44145.33866898149 | 39.563 |
| 44145.38033564815 | 40.065 |
| 44145.422002314815 | 40.933 |
| 44145.46366898149 | 42.13 |
| 44145.50533564815 | 43.211 |
| 44145.547002314815 | 43.964 |
| 44145.58866898149 | 43.578 |
| 44145.63033564815 | 42.671 |
| 44145.672002314815 | 41.319 |
| 44145.71366898149 | 40.335 |
| 44145.75533564815 | 39.929 |
| 44145.797002314815 | 39.601 |
| 44145.83866898149 | 39.447 |
| 44145.88033564815 | 39.312 |
| 44145.922002314815 | 39.428 |
| 44145.96366898149 | 39.331 |
| 44146.00533564815 | 39.582 |
| 44146.047002314815 | 39.678 |
| 44146.08866898149 | 39.331 |
| 44146.13033564815 | 39.041 |
| 44146.172002314815 | 39.389 |
| 44146.21366898149 | 39.949 |
| 44146.25533564815 | 38.81 |
| 44146.297002314815 | 38.501 |
| 44146.33866898149 | 38.443 |
| 44146.38033564815 | 39.138 |
| 44146.422002314815 | 40.972 |
| 44146.46366898149 | 42.536 |
| 44146.50533564815 | 43.906 |
| 44146.547002314815 | 44.659 |
| 44146.58866898149 | 44.312 |
| 44146.63033564815 | 43.115 |
| 44146.672002314815 | 41.667 |
| 44146.71366898149 | 40.702 |
| 44146.75533564815 | 40.219 |
| 44146.797002314815 | 39.872 |
| 44146.83866898149 | 39.852 |
| 44146.88033564815 | 39.852 |
| 44146.922002314815 | 39.929 |
| 44146.96366898149 | 40.065 |
| 44147.00533564815 | 40.238 |
| 44147.047002314815 | 40.373 |
| 44147.08866898149 | 40.431 |
| 44147.13033564815 | 40.258 |
| 44147.172002314815 | 40.373 |
| 44147.21366898149 | 40.161 |
| 44147.25533564815 | 39.987 |
| 44147.297002314815 | 39.852 |
| 44147.33866898149 | 39.891 |
| 44147.38033564815 | 40.258 |
| 44147.422002314815 | 40.644 |
| 44147.46366898149 | 41.821 |
| 44147.50533564815 | 42.729 |
| 44147.547002314815 | 43.289 |
| 44147.58866898149 | 43.192 |
| 44147.63033564815 | 42.285 |
| 44147.672002314815 | 41.455 |
| 44147.71366898149 | 40.509 |
| 44147.75533564815 | 39.852 |
| 44147.797002314815 | 39.234 |
| 44147.83866898149 | 38.829 |
| 44147.88033564815 | 38.501 |
| 44147.922002314815 | 38.25 |
| 44147.96366898149 | 38.018 |
| 44148.00533564815 | 37.922 |
| 44148.047002314815 | 37.844 |
| 44148.08866898149 | 37.787 |
| 44148.13033564815 | 37.709 |
| 44148.172002314815 | 37.748 |
| 44148.21366898149 | 37.709 |
| 44148.25533564815 | 37.883 |
| 44148.297002314815 | 37.902 |
| 44148.33866898149 | 37.864 |
| 44148.38033564815 | 39.254 |
| 44148.422002314815 | 40.991 |
| 44148.46366898149 | 42.13 |
| 44148.50533564815 | 44.003 |
| 44148.547002314815 | 44.679 |
| 44148.58866898149 | 44.505 |
| 44148.63033564815 | 43.79 |
| 44148.672002314815 | 42.536 |
| 44148.71366898149 | 41.435 |
| 44148.75533564815 | 40.779 |
| 44148.797002314815 | 40.586 |
| 44148.83866898149 | 40.451 |
| 44148.88033564815 | 40.065 |
| 44148.922002314815 | 40.142 |
| 44148.96366898149 | 40.431 |
| 44149.00533564815 | 40.393 |
| 44149.047002314815 | 40.451 |
| 44149.08866898149 | 40.393 |
| 44149.13033564815 | 40.451 |
| 44149.172002314815 | 40.933 |
| 44149.21366898149 | 40.817 |
| 44149.25533564815 | 40.528 |
| 44149.297002314815 | 40.007 |
| 44149.33866898149 | 40.045 |
| 44149.38033564815 | 38.366 |
| 44149.422002314815 | 38.404 |
| 44149.46366898149 | 39.157 |
| 44149.50533564815 | 39.698 |
| 44149.547002314815 | 39.968 |
| 44149.58866898149 | 40.026 |
| 44149.63033564815 | 39.659 |
| 44149.672002314815 | 38.501 |
| 44149.71366898149 | 37.864 |
| 44149.75533564815 | 37.844 |
| 44149.797002314815 | 38.057 |
| 44149.83866898149 | 38.327 |
| 44149.88033564815 | 38.752 |
| 44149.922002314815 | 39.157 |
| 44149.96366898149 | 39.234 |
| 44150.00533564815 | 39.041 |
| 44150.047002314815 | 38.617 |
| 44150.08866898149 | 38.617 |
| 44150.13033564815 | 38.752 |
| 44150.172002314815 | 38.752 |
| 44150.21366898149 | 38.79 |
| 44150.25533564815 | 39.099 |
| 44150.297002314815 | 39.37 |
| 44150.33866898149 | 39.485 |
| 44150.38033564815 | 39.929 |
| 44150.422002314815 | 40.431 |
| 44150.46366898149 | 40.953 |
| 44150.50533564815 | 41.841 |
| 44150.547002314815 | 43.559 |
| 44150.58866898149 | 44.35 |
| 44150.63033564815 | 43.713 |
| 44150.672002314815 | 42.594 |
| 44150.71366898149 | 41.763 |
| 44150.75533564815 | 41.339 |
| 44150.797002314815 | 41.126 |
| 44150.83866898149 | 40.972 |
| 44150.88033564815 | 40.914 |
| 44150.922002314815 | 40.856 |
| 44150.96366898149 | 40.798 |
| 44151.00533564815 | 40.779 |
| 44151.047002314815 | 40.76 |
| 44151.08866898149 | 40.663 |
| 44151.13033564815 | 40.605 |
| 44151.172002314815 | 40.509 |
| 44151.21366898149 | 40.682 |
| 44151.25533564815 | 40.895 |
| 44151.297002314815 | 40.991 |
| 44151.33866898149 | 40.953 |
| 44151.38033564815 | 41.03 |
| 44151.422002314815 | 41.937 |
| 44151.46366898149 | 43.076 |
| 44151.50533564815 | 44.389 |
| 44151.547002314815 | 44.968 |
| 44151.58866898149 | 44.814 |
| 44151.63033564815 | 43.984 |
| 44151.672002314815 | 42.806 |
| 44151.71366898149 | 41.763 |
| 44151.75533564815 | 41.068 |
| 44151.797002314815 | 40.528 |
| 44151.83866898149 | 40.296 |
| 44151.88033564815 | 40.065 |
| 44151.922002314815 | 39.929 |
| 44151.96366898149 | 39.717 |
| 44152.00533564815 | 39.601 |
| 44152.047002314815 | 39.563 |
| 44152.08866898149 | 39.447 |
| 44152.13033564815 | 39.331 |
| 44152.172002314815 | 39.312 |
| 44152.21366898149 | 39.331 |
| 44152.25533564815 | 39.331 |
| 44152.297002314815 | 39.35 |
| 44152.33866898149 | 39.505 |
| 44152.38033564815 | 39.929 |
| 44152.422002314815 | 41.049 |
| 44152.46366898149 | 42.478 |
| 44152.50533564815 | 44.196 |
| 44152.547002314815 | 44.582 |
| 44152.58866898149 | 44.234 |
| 44152.63033564815 | 43.269 |
| 44152.672002314815 | 42.265 |
| 44152.71366898149 | 41.281 |
| 44152.75533564815 | 40.721 |
| 44152.797002314815 | 40.431 |
| 44152.83866898149 | 40.296 |
| 44152.88033564815 | 40.142 |
| 44152.922002314815 | 39.872 |
| 44152.96366898149 | 39.678 |
| 44153.00533564815 | 39.698 |
| 44153.047002314815 | 39.659 |
| 44153.08866898149 | 39.659 |
| 44153.13033564815 | 39.775 |
| 44153.172002314815 | 39.852 |
| 44153.21366898149 | 39.929 |
| 44153.25533564815 | 39.949 |
| 44153.297002314815 | 39.949 |
| 44153.33866898149 | 39.987 |
| 44153.38033564815 | 40.489 |
| 44153.422002314815 | 41.049 |
| 44153.46366898149 | 41.937 |
| 44153.50533564815 | 43.25 |
| 44153.547002314815 | 43.964 |
| 44153.58866898149 | 43.771 |
| 44153.63033564815 | 42.98 |
| 44153.672002314815 | 41.956 |
| 44153.71366898149 | 41.242 |
| 44153.75533564815 | 40.779 |
| 44153.797002314815 | 40.547 |
| 44153.83866898149 | 40.316 |
| 44153.88033564815 | 40.2 |
| 44153.922002314815 | 39.949 |
| 44153.96366898149 | 39.929 |
| 44154.00533564815 | 39.814 |
| 44154.047002314815 | 39.814 |
| 44154.08866898149 | 39.891 |
| 44154.13033564815 | 40.007 |
| 44154.172002314815 | 40.161 |
| 44154.21366898149 | 40.258 |
| 44154.25533564815 | 40.258 |
| 44154.297002314815 | 40.18 |
| 44154.33866898149 | 40.122 |
| 44154.38033564815 | 40.567 |
| 44154.422002314815 | 41.435 |
| 44154.46366898149 | 42.381 |
| 44154.50533564815 | 43.597 |
| 44154.547002314815 | 43.984 |
| 44154.58866898149 | 43.578 |
| 44154.63033564815 | 42.748 |
| 44154.672002314815 | 41.821 |
| 44154.71366898149 | 40.837 |
| 44154.75533564815 | 40.354 |
| 44154.797002314815 | 40.142 |
| 44154.83866898149 | 39.949 |
| 44154.88033564815 | 39.756 |
| 44154.922002314815 | 39.563 |
| 44154.96366898149 | 39.428 |
| 44155.00533564815 | 39.35 |
| 44155.047002314815 | 39.312 |
| 44155.08866898149 | 39.234 |
| 44155.13033564815 | 39.35 |
| 44155.172002314815 | 39.524 |
| 44155.21366898149 | 39.64 |
| 44155.25533564815 | 39.736 |
| 44155.297002314815 | 39.794 |
| 44155.33866898149 | 39.814 |
| 44155.38033564815 | 40.258 |
| 44155.422002314815 | 41.223 |
| 44155.46366898149 | 42.42 |
| 44155.50533564815 | 43.559 |
| 44155.547002314815 | 43.829 |
| 44155.58866898149 | 43.173 |
| 44155.63033564815 | 42.246 |
| 44155.672002314815 | 41.667 |
| 44155.71366898149 | 41.204 |
| 44155.75533564815 | 40.837 |
| 44155.797002314815 | 40.47 |
| 44155.83866898149 | 40.142 |
| 44155.88033564815 | 39.91 |
| 44155.922002314815 | 39.794 |
| 44155.96366898149 | 39.756 |
| 44156.00533564815 | 39.794 |
| 44156.047002314815 | 39.756 |
| 44156.08866898149 | 39.852 |
| 44156.13033564815 | 39.929 |
| 44156.172002314815 | 40.026 |
| 44156.21366898149 | 40.18 |
| 44156.25533564815 | 40.161 |
| 44156.297002314815 | 40.142 |
| 44156.33866898149 | 40.2 |
| 44156.38033564815 | 40.296 |
| 44156.422002314815 | 40.76 |
| 44156.46366898149 | 41.86 |
| 44156.50533564815 | 43.134 |
| 44156.547002314815 | 43.636 |
| 44156.58866898149 | 43.269 |
| 44156.63033564815 | 42.439 |
| 44156.672002314815 | 41.455 |
| 44156.71366898149 | 40.547 |
| 44156.75533564815 | 40.026 |
| 44156.797002314815 | 39.698 |
| 44156.83866898149 | 39.447 |
| 44156.88033564815 | 39.234 |
| 44156.922002314815 | 39.099 |
| 44156.96366898149 | 38.983 |
| 44157.00533564815 | 38.868 |
| 44157.047002314815 | 38.713 |
| 44157.08866898149 | 38.597 |
| 44157.13033564815 | 38.52 |
| 44157.172002314815 | 38.52 |
| 44157.21366898149 | 38.52 |
| 44157.25533564815 | 38.443 |
| 44157.297002314815 | 38.443 |
| 44157.33866898149 | 38.501 |
| 44157.38033564815 | 38.964 |
| 44157.422002314815 | 40.045 |
| 44157.46366898149 | 41.455 |
| 44157.50533564815 | 42.748 |
| 44157.547002314815 | 43.057 |
| 44157.58866898149 | 42.42 |
| 44157.63033564815 | 41.223 |
| 44157.672002314815 | 40.489 |
| 44157.71366898149 | 40.084 |
| 44157.75533564815 | 39.717 |
| 44157.797002314815 | 39.736 |
| 44157.83866898149 | 39.852 |
| 44157.88033564815 | 39.814 |
| 44157.922002314815 | 39.929 |
| 44157.96366898149 | 40.007 |
| 44158.00533564815 | 40.045 |
| 44158.047002314815 | 39.891 |
| 44158.08866898149 | 39.678 |
| 44158.13033564815 | 39.64 |
| 44158.172002314815 | 39.678 |
| 44158.21366898149 | 39.814 |
| 44158.25533564815 | 39.814 |
| 44158.297002314815 | 39.872 |
| 44158.33866898149 | 39.968 |
| 44158.38033564815 | 40.219 |
| 44158.422002314815 | 41.242 |
| 44158.46366898149 | 42.497 |
| 44158.50533564815 | 43.482 |
| 44158.547002314815 | 42.922 |
| 44158.58866898149 | 42.323 |
| 44158.63033564815 | 41.686 |
| 44158.672002314815 | 41.204 |
| 44158.71366898149 | 40.547 |
| 44158.75533564815 | 40.373 |
| 44158.797002314815 | 40.219 |
| 44158.83866898149 | 40.103 |
| 44158.88033564815 | 39.987 |
| 44158.922002314815 | 39.987 |
| 44158.96366898149 | 39.852 |
| 44159.00533564815 | 39.736 |
| 44159.047002314815 | 39.891 |
| 44159.08866898149 | 39.698 |
| 44159.13033564815 | 39.254 |
| 44159.172002314815 | 38.636 |
| 44159.21366898149 | 37.999 |
| 44159.25533564815 | 37.96 |
| 44159.297002314815 | 38.346 |
| 44159.33866898149 | 38.636 |
| 44159.38033564815 | 38.829 |
| 44159.422002314815 | 39.408 |
| 44159.46366898149 | 40.354 |
| 44159.50533564815 | 40.76 |
| 44159.547002314815 | 41.146 |
| 44159.58866898149 | 40.972 |
| 44159.63033564815 | 40.586 |
| 44159.672002314815 | 39.949 |
| 44159.71366898149 | 39.408 |
| 44159.75533564815 | 39.196 |
| 44159.797002314815 | 39.234 |
| 44159.83866898149 | 39.234 |
| 44159.88033564815 | 39.196 |
| 44159.922002314815 | 39.177 |
| 44159.96366898149 | 39.061 |
| 44160.00533564815 | 38.848 |
| 44160.047002314815 | 38.636 |
| 44160.08866898149 | 38.443 |
| 44160.13033564815 | 38.346 |
| 44160.172002314815 | 38.288 |
| 44160.21366898149 | 38.231 |
| 44160.25533564815 | 38.211 |
| 44160.297002314815 | 38.192 |
| 44160.33866898149 | 38.25 |
| 44160.38033564815 | 38.752 |
| 44160.422002314815 | 40.065 |
| 44160.46366898149 | 41.3 |
| 44160.50533564815 | 42.574 |
| 44160.547002314815 | 42.632 |
| 44160.58866898149 | 42.227 |
| 44160.63033564815 | 41.435 |
| 44160.672002314815 | 40.489 |
| 44160.71366898149 | 39.736 |
| 44160.75533564815 | 39.37 |
| 44160.797002314815 | 39.157 |
| 44160.83866898149 | 39.003 |
| 44160.88033564815 | 38.906 |
| 44160.922002314815 | 38.81 |
| 44160.96366898149 | 38.713 |
| 44161.00533564815 | 38.617 |
| 44161.047002314815 | 38.539 |
| 44161.08866898149 | 38.482 |
| 44161.13033564815 | 38.482 |
| 44161.172002314815 | 38.424 |
| 44161.21366898149 | 38.52 |
| 44161.25533564815 | 38.385 |
| 44161.297002314815 | 38.424 |
| 44161.33866898149 | 38.578 |
| 44161.38033564815 | 39.157 |
| 44161.422002314815 | 40.142 |
| 44161.46366898149 | 40.817 |
| 44161.50533564815 | 41.667 |
| 44161.547002314815 | 41.648 |
| 44161.58866898149 | 40.972 |
| 44161.63033564815 | 40.354 |
| 44161.672002314815 | 39.756 |
| 44161.71366898149 | 39.177 |
| 44161.75533564815 | 39.08 |
| 44161.797002314815 | 38.983 |
| 44161.83866898149 | 38.733 |
| 44161.88033564815 | 38.52 |
| 44161.922002314815 | 38.636 |
| 44161.96366898149 | 38.636 |
| 44162.00533564815 | 38.539 |
| 44162.047002314815 | 38.404 |
| 44162.08866898149 | 38.443 |
| 44162.13033564815 | 38.52 |
| 44162.172002314815 | 38.404 |
| 44162.21366898149 | 38.076 |
| 44162.25533564815 | 37.902 |
| 44162.297002314815 | 37.806 |
| 44162.33866898149 | 37.806 |
| 44162.38033564815 | 38.173 |
| 44162.422002314815 | 39.234 |
| 44162.46366898149 | 40.567 |
| 44162.50533564815 | 41.783 |
| 44162.547002314815 | 41.783 |
| 44162.58866898149 | 41.358 |
| 44162.63033564815 | 40.74 |
| 44162.672002314815 | 39.794 |
| 44162.71366898149 | 39.061 |
| 44162.75533564815 | 38.655 |
| 44162.797002314815 | 38.366 |
| 44162.83866898149 | 38.192 |
| 44162.88033564815 | 38.115 |
| 44162.922002314815 | 38.057 |
| 44162.96366898149 | 38.018 |
| 44163.00533564815 | 37.999 |
| 44163.047002314815 | 37.941 |
| 44163.08866898149 | 37.883 |
| 44163.13033564815 | 37.922 |
| 44163.172002314815 | 37.864 |
| 44163.21366898149 | 37.864 |
| 44163.25533564815 | 37.806 |
| 44163.297002314815 | 37.787 |
| 44163.33866898149 | 37.825 |
| 44163.38033564815 | 38.211 |
| 44163.422002314815 | 39.331 |
| 44163.46366898149 | 40.624 |
| 44163.50533564815 | 41.841 |
| 44163.547002314815 | 41.841 |
| 44163.58866898149 | 41.261 |
| 44163.63033564815 | 40.431 |
| 44163.672002314815 | 39.563 |
| 44163.71366898149 | 38.887 |
| 44163.75533564815 | 38.597 |
| 44163.797002314815 | 38.424 |
| 44163.83866898149 | 38.308 |
| 44163.88033564815 | 38.173 |
| 44163.922002314815 | 38.115 |
| 44163.96366898149 | 38.018 |
| 44164.00533564815 | 37.941 |
| 44164.047002314815 | 37.806 |
| 44164.08866898149 | 37.767 |
| 44164.13033564815 | 37.729 |
| 44164.172002314815 | 37.709 |
| 44164.21366898149 | 37.671 |
| 44164.25533564815 | 37.574 |
| 44164.297002314815 | 37.536 |
| 44164.33866898149 | 37.594 |
| 44164.38033564815 | 38.018 |
| 44164.422002314815 | 39.099 |
| 44164.46366898149 | 40.277 |
| 44164.50533564815 | 41.416 |
| 44164.547002314815 | 41.416 |
| 44164.58866898149 | 40.933 |
| 44164.63033564815 | 40.045 |
| 44164.672002314815 | 39.177 |
| 44164.71366898149 | 38.52 |
| 44164.75533564815 | 38.288 |
| 44164.797002314815 | 38.057 |
| 44164.83866898149 | 37.922 |
| 44164.88033564815 | 37.806 |
| 44164.922002314815 | 37.69 |
| 44164.96366898149 | 37.613 |
| 44165.00533564815 | 37.516 |
| 44165.047002314815 | 37.439 |
| 44165.08866898149 | 37.362 |
| 44165.13033564815 | 37.343 |
| 44165.172002314815 | 37.323 |
| 44165.21366898149 | 37.246 |
| 44165.25533564815 | 37.227 |
| 44165.297002314815 | 37.207 |
| 44165.33866898149 | 37.304 |
| 44165.38033564815 | 37.709 |
| 44165.422002314815 | 38.906 |
| 44165.46366898149 | 40.122 |
| 44165.50533564815 | 41.204 |
| 44165.547002314815 | 41.281 |
| 44165.58866898149 | 40.76 |
| 44165.63033564815 | 39.833 |
| 44165.672002314815 | 39.003 |
| 44165.71366898149 | 38.366 |
| 44165.75533564815 | 38.038 |
| 44165.797002314815 | 37.844 |
| 44165.83866898149 | 37.806 |
| 44165.88033564815 | 37.748 |
| 44165.922002314815 | 37.69 |
| 44165.96366898149 | 37.671 |
| 44166.00533564815 | 37.651 |
| 44166.047002314815 | 37.748 |
| 44166.08866898149 | 37.767 |
| 44166.13033564815 | 37.806 |
| 44166.172002314815 | 37.825 |
| 44166.21366898149 | 37.748 |
| 44166.25533564815 | 37.883 |
| 44166.297002314815 | 37.883 |
| 44166.33866898149 | 37.729 |
| 44166.38033564815 | 37.864 |
| 44166.422002314815 | 38.501 |
| 44166.46366898149 | 39.408 |
| 44166.50533564815 | 39.929 |
| 44166.547002314815 | 39.833 |
| 44166.58866898149 | 39.659 |
| 44166.63033564815 | 39.119 |
| 44166.672002314815 | 38.52 |
| 44166.71366898149 | 37.96 |
| 44166.75533564815 | 37.806 |
| 44166.797002314815 | 37.69 |
| 44166.83866898149 | 37.516 |
| 44166.88033564815 | 37.536 |
| 44166.922002314815 | 37.729 |
| 44166.96366898149 | 37.787 |
| 44167.00533564815 | 37.883 |
| 44167.047002314815 | 37.806 |
| 44167.08866898149 | 37.632 |
| 44167.13033564815 | 37.439 |
| 44167.172002314815 | 37.4 |
| 44167.21366898149 | 37.362 |
| 44167.25533564815 | 37.304 |
| 44167.297002314815 | 37.092 |
| 44167.33866898149 | 37.034 |
| 44167.38033564815 | 37.188 |
| 44167.422002314815 | 37.941 |
| 44167.46366898149 | 38.887 |
| 44167.50533564815 | 39.872 |
| 44167.547002314815 | 39.949 |
| 44167.58866898149 | 39.428 |
| 44167.63033564815 | 38.617 |
| 44167.672002314815 | 37.767 |
| 44167.71366898149 | 37.092 |
| 44167.75533564815 | 36.841 |
| 44167.797002314815 | 36.802 |
| 44167.83866898149 | 36.841 |
| 44167.88033564815 | 36.802 |
| 44167.922002314815 | 36.705 |
| 44167.96366898149 | 36.648 |
| 44168.00533564815 | 36.609 |
| 44168.047002314815 | 36.493 |
| 44168.08866898149 | 36.532 |
| 44168.13033564815 | 36.57 |
| 44168.172002314815 | 36.532 |
| 44168.21366898149 | 36.474 |
| 44168.25533564815 | 36.512 |
| 44168.297002314815 | 36.474 |
| 44168.33866898149 | 36.455 |
| 44168.38033564815 | 36.879 |
| 44168.422002314815 | 37.806 |
| 44168.46366898149 | 39.08 |
| 44168.50533564815 | 40.316 |
| 44168.547002314815 | 40.547 |
| 44168.58866898149 | 40.026 |
| 44168.63033564815 | 39.138 |
| 44168.672002314815 | 38.25 |
| 44168.71366898149 | 37.594 |
| 44168.75533564815 | 37.304 |
| 44168.797002314815 | 37.169 |
| 44168.83866898149 | 37.072 |
| 44168.88033564815 | 37.053 |
| 44168.922002314815 | 36.937 |
| 44168.96366898149 | 36.937 |
| 44169.00533564815 | 36.879 |
| 44169.047002314815 | 36.879 |
| 44169.08866898149 | 36.802 |
| 44169.13033564815 | 36.841 |
| 44169.172002314815 | 36.841 |
| 44169.21366898149 | 36.802 |
| 44169.25533564815 | 36.783 |
| 44169.297002314815 | 36.821 |
| 44169.33866898149 | 36.841 |
| 44169.38033564815 | 37.188 |
| 44169.422002314815 | 38.231 |
| 44169.46366898149 | 39.389 |
| 44169.50533564815 | 40.567 |
| 44169.547002314815 | 40.817 |
| 44169.58866898149 | 40.296 |
| 44169.63033564815 | 39.563 |
| 44169.672002314815 | 38.655 |
| 44169.71366898149 | 37.96 |
| 44169.75533564815 | 37.613 |
| 44169.797002314815 | 37.4 |
| 44169.83866898149 | 37.304 |
| 44169.88033564815 | 37.188 |
| 44169.922002314815 | 37.188 |
| 44169.96366898149 | 37.053 |
| 44170.00533564815 | 37.034 |
| 44170.047002314815 | 36.956 |
| 44170.08866898149 | 36.879 |
| 44170.13033564815 | 36.783 |
| 44170.172002314815 | 36.763 |
| 44170.21366898149 | 36.705 |
| 44170.25533564815 | 36.686 |
| 44170.297002314815 | 36.725 |
| 44170.33866898149 | 36.705 |
| 44170.38033564815 | 37.072 |
| 44170.422002314815 | 38.038 |
| 44170.46366898149 | 39.234 |
| 44170.50533564815 | 40.528 |
| 44170.547002314815 | 40.779 |
| 44170.58866898149 | 40.431 |
| 44170.63033564815 | 39.582 |
| 44170.672002314815 | 38.597 |
| 44170.71366898149 | 37.902 |
| 44170.75533564815 | 37.536 |
| 44170.797002314815 | 37.323 |
| 44170.83866898149 | 37.111 |
| 44170.88033564815 | 37.034 |
| 44170.922002314815 | 36.956 |
| 44170.96366898149 | 36.918 |
| 44171.00533564815 | 36.86 |
| 44171.047002314815 | 36.841 |
| 44171.08866898149 | 36.725 |
| 44171.13033564815 | 36.628 |
| 44171.172002314815 | 36.686 |
| 44171.21366898149 | 36.609 |
| 44171.25533564815 | 36.532 |
| 44171.297002314815 | 36.551 |
| 44171.33866898149 | 36.628 |
| 44171.38033564815 | 36.956 |
| 44171.422002314815 | 37.999 |
| 44171.46366898149 | 39.196 |
| 44171.50533564815 | 40.451 |
| 44171.547002314815 | 40.76 |
| 44171.58866898149 | 40.489 |
| 44171.63033564815 | 39.563 |
| 44171.672002314815 | 38.655 |
| 44171.71366898149 | 37.902 |
| 44171.75533564815 | 37.555 |
| 44171.797002314815 | 37.343 |
| 44171.83866898149 | 37.169 |
| 44171.88033564815 | 37.014 |
| 44171.922002314815 | 36.956 |
| 44171.96366898149 | 36.841 |
| 44172.00533564815 | 36.802 |
| 44172.047002314815 | 36.763 |
| 44172.08866898149 | 36.725 |
| 44172.13033564815 | 36.667 |
| 44172.172002314815 | 36.628 |
| 44172.21366898149 | 36.59 |
| 44172.25533564815 | 36.57 |
| 44172.297002314815 | 36.474 |
| 44172.33866898149 | 36.455 |
| 44172.38033564815 | 36.841 |
| 44172.422002314815 | 37.825 |
| 44172.46366898149 | 39.003 |
| 44172.50533564815 | 40.354 |
| 44172.547002314815 | 40.605 |
| 44172.58866898149 | 40.065 |
| 44172.63033564815 | 39.157 |
| 44172.672002314815 | 38.288 |
| 44172.71366898149 | 37.748 |
| 44172.75533564815 | 37.381 |
| 44172.797002314815 | 37.13 |
| 44172.83866898149 | 36.976 |
| 44172.88033564815 | 36.879 |
| 44172.922002314815 | 36.802 |
| 44172.96366898149 | 36.667 |
| 44173.00533564815 | 36.648 |
| 44173.047002314815 | 36.59 |
| 44173.08866898149 | 36.512 |
| 44173.13033564815 | 36.397 |
| 44173.172002314815 | 36.339 |
| 44173.21366898149 | 36.3 |
| 44173.25533564815 | 36.261 |
| 44173.297002314815 | 36.281 |
| 44173.33866898149 | 36.281 |
| 44173.38033564815 | 36.648 |
| 44173.422002314815 | 37.69 |
| 44173.46366898149 | 38.829 |
| 44173.50533564815 | 40.238 |
| 44173.547002314815 | 40.547 |
| 44173.58866898149 | 40.219 |
| 44173.63033564815 | 39.312 |
| 44173.672002314815 | 38.366 |
| 44173.71366898149 | 37.632 |
| 44173.75533564815 | 37.227 |
| 44173.797002314815 | 36.937 |
| 44173.83866898149 | 36.802 |
| 44173.88033564815 | 36.725 |
| 44173.922002314815 | 36.59 |
| 44173.96366898149 | 36.532 |
| 44174.00533564815 | 36.377 |
| 44174.047002314815 | 36.339 |
| 44174.08866898149 | 36.281 |
| 44174.13033564815 | 36.223 |
| 44174.172002314815 | 36.204 |
| 44174.21366898149 | 36.165 |
| 44174.25533564815 | 36.126 |
| 44174.297002314815 | 36.107 |
| 44174.33866898149 | 36.184 |
| 44174.38033564815 | 36.493 |
| 44174.422002314815 | 37.478 |
| 44174.46366898149 | 38.733 |
| 44174.50533564815 | 40.142 |
| 44174.547002314815 | 40.431 |
| 44174.58866898149 | 40.122 |
| 44174.63033564815 | 39.389 |
| 44174.672002314815 | 38.539 |
| 44174.71366898149 | 37.729 |
| 44174.75533564815 | 37.304 |
| 44174.797002314815 | 37.053 |
| 44174.83866898149 | 36.918 |
| 44174.88033564815 | 36.802 |
| 44174.922002314815 | 36.744 |
| 44174.96366898149 | 36.725 |
| 44175.00533564815 | 36.628 |
| 44175.047002314815 | 36.57 |
| 44175.08866898149 | 36.628 |
| 44175.13033564815 | 36.667 |
| 44175.172002314815 | 36.725 |
| 44175.21366898149 | 36.725 |
| 44175.25533564815 | 36.763 |
| 44175.297002314815 | 36.802 |
| 44175.33866898149 | 36.899 |
| 44175.38033564815 | 37.246 |
| 44175.422002314815 | 37.767 |
| 44175.46366898149 | 38.327 |
| 44175.50533564815 | 39.022 |
| 44175.547002314815 | 39.215 |
| 44175.58866898149 | 38.964 |
| 44175.63033564815 | 38.578 |
| 44175.672002314815 | 38.211 |
| 44175.71366898149 | 37.864 |
| 44175.75533564815 | 37.748 |
| 44175.797002314815 | 37.671 |
| 44175.83866898149 | 37.555 |
| 44175.88033564815 | 37.458 |
| 44175.922002314815 | 37.304 |
| 44175.96366898149 | 37.265 |
| 44176.00533564815 | 37.246 |
| 44176.047002314815 | 37.304 |
| 44176.08866898149 | 37.285 |
| 44176.13033564815 | 37.246 |
| 44176.172002314815 | 37.207 |
| 44176.21366898149 | 37.246 |
| 44176.25533564815 | 37.149 |
| 44176.297002314815 | 37.111 |
| 44176.33866898149 | 37.072 |
| 44176.38033564815 | 37.13 |
| 44176.422002314815 | 37.729 |
| 44176.46366898149 | 38.443 |
| 44176.50533564815 | 38.539 |
| 44176.547002314815 | 38.211 |
| 44176.58866898149 | 37.574 |
| 44176.63033564815 | 36.841 |
| 44176.672002314815 | 36.744 |
| 44176.71366898149 | 36.763 |
| 44176.75533564815 | 36.821 |
| 44176.797002314815 | 36.879 |
| 44176.83866898149 | 36.841 |
| 44176.88033564815 | 36.802 |
| 44176.922002314815 | 36.802 |
| 44176.96366898149 | 36.705 |
| 44177.00533564815 | 36.628 |
| 44177.047002314815 | 36.59 |
| 44177.08866898149 | 36.397 |
| 44177.13033564815 | 36.184 |
| 44177.172002314815 | 35.953 |
| 44177.21366898149 | 35.914 |
| 44177.25533564815 | 36.126 |
| 44177.297002314815 | 36.204 |
| 44177.33866898149 | 36.358 |
| 44177.38033564815 | 36.648 |
| 44177.422002314815 | 36.995 |
| 44177.46366898149 | 37.536 |
| 44177.50533564815 | 38.134 |
| 44177.547002314815 | 38.385 |
| 44177.58866898149 | 38.25 |
| 44177.63033564815 | 37.825 |
| 44177.672002314815 | 37.478 |
| 44177.71366898149 | 37.188 |
| 44177.75533564815 | 36.937 |
| 44177.797002314815 | 36.319 |
| 44177.83866898149 | 35.895 |
| 44177.88033564815 | 35.76 |
| 44177.922002314815 | 35.798 |
| 44177.96366898149 | 35.798 |
| 44178.00533564815 | 35.779 |
| 44178.047002314815 | 35.702 |
| 44178.08866898149 | 35.624 |
| 44178.13033564815 | 35.605 |
| 44178.172002314815 | 35.47 |
| 44178.21366898149 | 35.586 |
| 44178.25533564815 | 35.721 |
| 44178.297002314815 | 35.702 |
| 44178.33866898149 | 35.431 |
| 44178.38033564815 | 35.682 |
| 44178.422002314815 | 36.397 |
| 44178.46366898149 | 37.594 |
| 44178.50533564815 | 38.829 |
| 44178.547002314815 | 39.138 |
| 44178.58866898149 | 39.022 |
| 44178.63033564815 | 38.288 |
| 44178.672002314815 | 37.343 |
| 44178.71366898149 | 36.648 |
| 44178.75533564815 | 36.242 |
| 44178.797002314815 | 35.933 |
| 44178.83866898149 | 35.837 |
| 44178.88033564815 | 35.837 |
| 44178.922002314815 | 35.76 |
| 44178.96366898149 | 35.721 |
| 44179.00533564815 | 35.702 |
| 44179.047002314815 | 35.682 |
| 44179.08866898149 | 35.779 |
| 44179.13033564815 | 35.875 |
| 44179.172002314815 | 35.875 |
| 44179.21366898149 | 35.895 |
| 44179.25533564815 | 35.972 |
| 44179.297002314815 | 36.242 |
| 44179.33866898149 | 36.435 |
| 44179.38033564815 | 36.802 |
| 44179.422002314815 | 37.458 |
| 44179.46366898149 | 37.999 |
| 44179.50533564815 | 38.52 |
| 44179.547002314815 | 38.578 |
| 44179.58866898149 | 38.269 |
| 44179.63033564815 | 38.115 |
| 44179.672002314815 | 37.69 |
| 44179.71366898149 | 37.149 |
| 44179.75533564815 | 36.86 |
| 44179.797002314815 | 36.86 |
| 44179.83866898149 | 36.628 |
| 44179.88033564815 | 36.455 |
| 44179.922002314815 | 36.319 |
| 44179.96366898149 | 36.261 |
| 44180.00533564815 | 36.3 |
| 44180.047002314815 | 36.281 |
| 44180.08866898149 | 36.223 |
| 44180.13033564815 | 36.126 |
| 44180.172002314815 | 35.972 |
| 44180.21366898149 | 35.837 |
| 44180.25533564815 | 35.682 |
| 44180.297002314815 | 35.605 |
| 44180.33866898149 | 35.74 |
| 44180.38033564815 | 35.991 |
| 44180.422002314815 | 36.358 |
| 44180.46366898149 | 36.841 |
| 44180.50533564815 | 37.767 |
| 44180.547002314815 | 38.192 |
| 44180.58866898149 | 38.076 |
| 44180.63033564815 | 37.439 |
| 44180.672002314815 | 36.802 |
| 44180.71366898149 | 36.358 |
| 44180.75533564815 | 36.126 |
| 44180.797002314815 | 36.107 |
| 44180.83866898149 | 35.953 |
| 44180.88033564815 | 35.837 |
| 44180.922002314815 | 35.779 |
| 44180.96366898149 | 35.856 |
| 44181.00533564815 | 35.991 |
| 44181.047002314815 | 36.184 |
| 44181.08866898149 | 36.281 |
| 44181.13033564815 | 36.319 |
| 44181.172002314815 | 36.358 |
| 44181.21366898149 | 36.377 |
| 44181.25533564815 | 36.377 |
| 44181.297002314815 | 36.455 |
| 44181.33866898149 | 36.59 |
| 44181.38033564815 | 36.744 |
| 44181.422002314815 | 37.381 |
| 44181.46366898149 | 38.057 |
| 44181.50533564815 | 38.25 |
| 44181.547002314815 | 38.462 |
| 44181.58866898149 | 38.617 |
| 44181.63033564815 | 38.25 |
| 44181.672002314815 | 37.632 |
| 44181.71366898149 | 37.304 |
| 44181.75533564815 | 37.072 |
| 44181.797002314815 | 36.899 |
| 44181.83866898149 | 36.744 |
| 44181.88033564815 | 36.532 |
| 44181.922002314815 | 36.3 |
| 44181.96366898149 | 36.165 |
| 44182.00533564815 | 35.953 |
| 44182.047002314815 | 35.798 |
| 44182.08866898149 | 35.682 |
| 44182.13033564815 | 35.663 |
| 44182.172002314815 | 35.586 |
| 44182.21366898149 | 35.528 |
| 44182.25533564815 | 35.431 |
| 44182.297002314815 | 35.238 |
| 44182.33866898149 | 35.315 |
| 44182.38033564815 | 35.509 |
| 44182.422002314815 | 36.281 |
| 44182.46366898149 | 37.381 |
| 44182.50533564815 | 38.192 |
| 44182.547002314815 | 38.694 |
| 44182.58866898149 | 38.559 |
| 44182.63033564815 | 38.308 |
| 44182.672002314815 | 37.748 |
| 44182.71366898149 | 37.227 |
| 44182.75533564815 | 36.763 |
| 44182.797002314815 | 36.377 |
| 44182.83866898149 | 36.165 |
| 44182.88033564815 | 36.107 |
| 44182.922002314815 | 36.319 |
| 44182.96366898149 | 36.339 |
| 44183.00533564815 | 36.242 |
| 44183.047002314815 | 36.397 |
| 44183.08866898149 | 36.435 |
| 44183.13033564815 | 36.512 |
| 44183.172002314815 | 36.57 |
| 44183.21366898149 | 36.705 |
| 44183.25533564815 | 36.744 |
| 44183.297002314815 | 36.686 |
| 44183.33866898149 | 36.686 |
| 44183.38033564815 | 36.628 |
| 44183.422002314815 | 36.841 |
| 44183.46366898149 | 37.497 |
| 44183.50533564815 | 38.288 |
| 44183.547002314815 | 38.752 |
| 44183.58866898149 | 38.076 |
| 44183.63033564815 | 37.748 |
| 44183.672002314815 | 37.42 |
| 44183.71366898149 | 37.014 |
| 44183.75533564815 | 36.841 |
| 44183.797002314815 | 36.648 |
| 44183.83866898149 | 36.493 |
| 44183.88033564815 | 36.435 |
| 44183.922002314815 | 36.455 |
| 44183.96366898149 | 36.416 |
| 44184.00533564815 | 36.3 |
| 44184.047002314815 | 36.242 |
| 44184.08866898149 | 36.165 |
| 44184.13033564815 | 36.088 |
| 44184.172002314815 | 35.933 |
| 44184.21366898149 | 35.74 |
| 44184.25533564815 | 35.566 |
| 44184.297002314815 | 35.566 |
| 44184.33866898149 | 35.605 |
| 44184.38033564815 | 35.914 |
| 44184.422002314815 | 36.628 |
| 44184.46366898149 | 37.594 |
| 44184.50533564815 | 38.713 |
| 44184.547002314815 | 39.254 |
| 44184.58866898149 | 39.099 |
| 44184.63033564815 | 38.559 |
| 44184.672002314815 | 37.902 |
| 44184.71366898149 | 37.227 |
| 44184.75533564815 | 36.802 |
| 44184.797002314815 | 36.648 |
| 44184.83866898149 | 36.686 |
| 44184.88033564815 | 36.841 |
| 44184.922002314815 | 36.763 |
| 44184.96366898149 | 36.705 |
| 44185.00533564815 | 36.628 |
| 44185.047002314815 | 36.532 |
| 44185.08866898149 | 36.319 |
| 44185.13033564815 | 36.088 |
| 44185.172002314815 | 36.01 |
| 44185.21366898149 | 35.953 |
| 44185.25533564815 | 35.972 |
| 44185.297002314815 | 36.01 |
| 44185.33866898149 | 36.146 |
| 44185.38033564815 | 36.377 |
| 44185.422002314815 | 36.899 |
| 44185.46366898149 | 37.42 |
| 44185.50533564815 | 38.173 |
| 44185.547002314815 | 38.868 |
| 44185.58866898149 | 38.829 |
| 44185.63033564815 | 38.443 |
| 44185.672002314815 | 38.038 |
| 44185.71366898149 | 37.478 |
| 44185.75533564815 | 37.092 |
| 44185.797002314815 | 36.976 |
| 44185.83866898149 | 37.13 |
| 44185.88033564815 | 37.246 |
| 44185.922002314815 | 37.323 |
| 44185.96366898149 | 37.304 |
| 44186.00533564815 | 37.285 |
| 44186.047002314815 | 37.323 |
| 44186.08866898149 | 37.323 |
| 44186.13033564815 | 37.246 |
| 44186.172002314815 | 37.072 |
| 44186.21366898149 | 36.899 |
| 44186.25533564815 | 36.783 |
| 44186.297002314815 | 36.725 |
| 44186.33866898149 | 36.802 |
| 44186.38033564815 | 37.207 |
| 44186.422002314815 | 37.806 |
| 44186.46366898149 | 38.617 |
| 44186.50533564815 | 39.621 |
| 44186.547002314815 | 39.717 |
| 44186.58866898149 | 39.621 |
| 44186.63033564815 | 39.099 |
| 44186.672002314815 | 38.346 |
| 44186.71366898149 | 37.709 |
| 44186.75533564815 | 37.304 |
| 44186.797002314815 | 37.053 |
| 44186.83866898149 | 36.86 |
| 44186.88033564815 | 36.686 |
| 44186.922002314815 | 36.532 |
| 44186.96366898149 | 36.435 |
| 44187.00533564815 | 36.416 |
| 44187.047002314815 | 36.377 |
| 44187.08866898149 | 36.261 |
| 44187.13033564815 | 36.204 |
| 44187.172002314815 | 36.184 |
| 44187.21366898149 | 36.242 |
| 44187.25533564815 | 36.184 |
| 44187.297002314815 | 36.184 |
| 44187.33866898149 | 36.165 |
| 44187.38033564815 | 36.339 |
| 44187.422002314815 | 37.246 |
| 44187.46366898149 | 38.366 |
| 44187.50533564815 | 38.636 |
| 44187.547002314815 | 38.848 |
| 44187.58866898149 | 38.733 |
| 44187.63033564815 | 38.501 |
| 44187.672002314815 | 38.153 |
| 44187.71366898149 | 37.69 |
| 44187.75533564815 | 37.323 |
| 44187.797002314815 | 36.204 |
| 44187.83866898149 | 35.721 |
| 44187.88033564815 | 35.142 |
| 44187.922002314815 | 34.833 |
| 44187.96366898149 | 34.833 |
| 44188.00533564815 | 34.929 |
| 44188.047002314815 | 35.007 |
| 44188.08866898149 | 35.103 |
| 44188.13033564815 | 35.277 |
| 44188.172002314815 | 35.393 |
| 44188.21366898149 | 35.373 |
| 44188.25533564815 | 35.238 |
| 44188.297002314815 | 35.219 |
| 44188.33866898149 | 35.084 |
| 44188.38033564815 | 35.2 |
| 44188.422002314815 | 35.702 |
| 44188.46366898149 | 36.126 |
| 44188.50533564815 | 36.455 |
| 44188.547002314815 | 36.705 |
| 44188.58866898149 | 36.416 |
| 44188.63033564815 | 36.107 |
| 44188.672002314815 | 35.682 |
| 44188.71366898149 | 35.277 |
| 44188.75533564815 | 34.794 |
| 44188.797002314815 | 34.678 |
| 44188.83866898149 | 34.775 |
| 44188.88033564815 | 34.736 |
| 44188.922002314815 | 34.891 |
| 44188.96366898149 | 34.833 |
| 44189.00533564815 | 34.91 |
| 44189.047002314815 | 34.968 |
| 44189.08866898149 | 34.833 |
| 44189.13033564815 | 34.736 |
| 44189.172002314815 | 34.717 |
| 44189.21366898149 | 34.775 |
| 44189.25533564815 | 34.987 |
| 44189.297002314815 | 35.2 |
| 44189.33866898149 | 35.354 |
| 44189.38033564815 | 35.489 |
| 44189.422002314815 | 35.991 |
| 44189.46366898149 | 36.705 |
| 44189.50533564815 | 37.381 |
| 44189.547002314815 | 37.98 |
| 44189.58866898149 | 37.69 |
| 44189.63033564815 | 36.667 |
| 44189.672002314815 | 35.76 |
| 44189.71366898149 | 35.2 |
| 44189.75533564815 | 35.045 |
| 44189.797002314815 | 34.891 |
| 44189.83866898149 | 34.717 |
| 44189.88033564815 | 34.601 |
| 44189.922002314815 | 34.485 |
| 44189.96366898149 | 34.505 |
| 44190.00533564815 | 34.524 |
| 44190.047002314815 | 34.447 |
| 44190.08866898149 | 34.427 |
| 44190.13033564815 | 34.389 |
| 44190.172002314815 | 34.408 |
| 44190.21366898149 | 34.485 |
| 44190.25533564815 | 34.524 |
| 44190.297002314815 | 34.466 |
| 44190.33866898149 | 34.427 |
| 44190.38033564815 | 34.698 |
| 44190.422002314815 | 35.624 |
| 44190.46366898149 | 36.802 |
| 44190.50533564815 | 38.038 |
| 44190.547002314815 | 38.443 |
| 44190.58866898149 | 38.288 |
| 44190.63033564815 | 37.594 |
| 44190.672002314815 | 36.763 |
| 44190.71366898149 | 36.049 |
| 44190.75533564815 | 35.644 |
| 44190.797002314815 | 35.47 |
| 44190.83866898149 | 35.373 |
| 44190.88033564815 | 35.354 |
| 44190.922002314815 | 35.373 |
| 44190.96366898149 | 35.373 |
| 44191.00533564815 | 35.296 |
| 44191.047002314815 | 35.335 |
| 44191.08866898149 | 35.2 |
| 44191.13033564815 | 35.065 |
| 44191.172002314815 | 35.045 |
| 44191.21366898149 | 35.007 |
| 44191.25533564815 | 35.103 |
| 44191.297002314815 | 35.084 |
| 44191.33866898149 | 35.142 |
| 44191.38033564815 | 35.335 |
| 44191.422002314815 | 36.165 |
| 44191.46366898149 | 37.381 |
| 44191.50533564815 | 38.597 |
| 44191.547002314815 | 39.196 |
| 44191.58866898149 | 39.234 |
| 44191.63033564815 | 38.675 |
| 44191.672002314815 | 37.729 |
| 44191.71366898149 | 36.899 |
| 44191.75533564815 | 36.416 |
| 44191.797002314815 | 36.3 |
| 44191.83866898149 | 36.261 |
| 44191.88033564815 | 36.281 |
| 44191.922002314815 | 36.339 |
| 44191.96366898149 | 36.281 |
| 44192.00533564815 | 36.223 |
| 44192.047002314815 | 36.049 |
| 44192.08866898149 | 35.76 |
| 44192.13033564815 | 35.875 |
| 44192.172002314815 | 35.721 |
| 44192.21366898149 | 35.412 |
| 44192.25533564815 | 35.451 |
| 44192.297002314815 | 35.47 |
| 44192.33866898149 | 35.663 |
| 44192.38033564815 | 36.204 |
| 44192.422002314815 | 36.995 |
| 44192.46366898149 | 37.478 |
| 44192.50533564815 | 37.787 |
| 44192.547002314815 | 37.941 |
| 44192.58866898149 | 38.327 |
| 44192.63033564815 | 38.173 |
| 44192.672002314815 | 37.555 |
| 44192.71366898149 | 36.899 |
| 44192.75533564815 | 36.435 |
| 44192.797002314815 | 36.165 |
| 44192.83866898149 | 35.895 |
| 44192.88033564815 | 35.566 |
| 44192.922002314815 | 35.335 |
| 44192.96366898149 | 35.2 |
| 44193.00533564815 | 35.065 |
| 44193.047002314815 | 35.007 |
| 44193.08866898149 | 34.987 |
| 44193.13033564815 | 35.103 |
| 44193.172002314815 | 35.296 |
| 44193.21366898149 | 35.2 |
| 44193.25533564815 | 35.161 |
| 44193.297002314815 | 35.18 |
| 44193.33866898149 | 35.412 |
| 44193.38033564815 | 35.509 |
| 44193.422002314815 | 35.972 |
| 44193.46366898149 | 36.628 |
| 44193.50533564815 | 37.594 |
| 44193.547002314815 | 38.308 |
| 44193.58866898149 | 38.288 |
| 44193.63033564815 | 37.806 |
| 44193.672002314815 | 37.227 |
| 44193.71366898149 | 36.686 |
| 44193.75533564815 | 36.435 |
| 44193.797002314815 | 36.319 |
| 44193.83866898149 | 36.281 |
| 44193.88033564815 | 35.895 |
| 44193.922002314815 | 35.76 |
| 44193.96366898149 | 35.74 |
| 44194.00533564815 | 35.837 |
| 44194.047002314815 | 35.895 |
| 44194.08866898149 | 35.817 |
| 44194.13033564815 | 35.875 |
| 44194.172002314815 | 36.165 |
| 44194.21366898149 | 36.107 |
| 44194.25533564815 | 35.798 |
| 44194.297002314815 | 35.489 |
| 44194.33866898149 | 35.663 |
| 44194.38033564815 | 36.068 |
| 44194.422002314815 | 36.744 |
| 44194.46366898149 | 37.111 |
| 44194.50533564815 | 37.072 |
| 44194.547002314815 | 36.956 |
| 44194.58866898149 | 36.763 |
| 44194.63033564815 | 36.3 |
| 44194.672002314815 | 35.798 |
| 44194.71366898149 | 35.566 |
| 44194.75533564815 | 35.354 |
| 44194.797002314815 | 35.142 |
| 44194.83866898149 | 34.91 |
| 44194.88033564815 | 34.756 |
| 44194.922002314815 | 34.621 |
| 44194.96366898149 | 34.505 |
| 44195.00533564815 | 34.389 |
| 44195.047002314815 | 34.331 |
| 44195.08866898149 | 34.234 |
| 44195.13033564815 | 34.176 |
| 44195.172002314815 | 34.099 |
| 44195.21366898149 | 34.099 |
| 44195.25533564815 | 34.061 |
| 44195.297002314815 | 34.022 |
| 44195.33866898149 | 33.983 |
| 44195.38033564815 | 34.138 |
| 44195.422002314815 | 34.968 |
| 44195.46366898149 | 36.107 |
| 44195.50533564815 | 37.458 |
| 44195.547002314815 | 38.057 |
| 44195.58866898149 | 37.902 |
| 44195.63033564815 | 36.995 |
| 44195.672002314815 | 36.01 |
| 44195.71366898149 | 35.431 |
| 44195.75533564815 | 35.2 |
| 44195.797002314815 | 34.929 |
| 44195.83866898149 | 34.833 |
| 44195.88033564815 | 34.833 |
| 44195.922002314815 | 34.833 |
| 44195.96366898149 | 35.045 |
| 44196.00533564815 | 35.161 |
| 44196.047002314815 | 35.219 |
| 44196.08866898149 | 35.2 |
| 44196.13033564815 | 35.238 |
| 44196.172002314815 | 35.451 |
| 44196.21366898149 | 35.47 |
| 44196.25533564815 | 35.47 |
| 44196.297002314815 | 35.296 |
| 44196.33866898149 | 35.219 |
| 44196.38033564815 | 35.682 |
| 44196.422002314815 | 36.474 |
| 44196.46366898149 | 37.285 |
| 44196.50533564815 | 37.941 |
| 44196.547002314815 | 38.829 |
| 44196.58866898149 | 38.964 |
| 44196.63033564815 | 38.269 |
| 44196.672002314815 | 37.536 |
| 44196.71366898149 | 36.783 |
| 44196.75533564815 | 36.242 |
| 44196.797002314815 | 35.972 |
| 44196.83866898149 | 35.895 |
| 44196.88033564815 | 35.953 |
| 44196.922002314815 | 35.817 |
| 44196.96366898149 | 35.509 |
| 44197.00533564815 | 35.277 |
| 44197.047002314815 | 35.122 |
| 44197.08866898149 | 35.045 |
| 44197.13033564815 | 34.949 |
| 44197.172002314815 | 35.007 |
| 44197.21366898149 | 35.18 |
| 44197.25533564815 | 35.354 |
| 44197.297002314815 | 35.296 |
| 44197.33866898149 | 35.122 |
| 44197.38033564815 | 35.122 |
| 44197.422002314815 | 35.914 |
| 44197.46366898149 | 36.86 |
| 44197.50533564815 | 38.115 |
| 44197.547002314815 | 38.578 |
| 44197.58866898149 | 38.192 |
| 44197.63033564815 | 37.632 |
| 44197.672002314815 | 36.686 |
| 44197.71366898149 | 36.068 |
| 44197.75533564815 | 35.721 |
| 44197.797002314815 | 35.566 |
| 44197.83866898149 | 35.644 |
| 44197.88033564815 | 35.412 |
| 44197.922002314815 | 35.18 |
| 44197.96366898149 | 34.968 |
| 44198.00533564815 | 34.833 |
| 44198.047002314815 | 34.64 |
| 44198.08866898149 | 34.621 |
| 44198.13033564815 | 34.505 |
| 44198.172002314815 | 34.466 |
| 44198.21366898149 | 34.389 |
| 44198.25533564815 | 34.408 |
| 44198.297002314815 | 34.621 |
| 44198.33866898149 | 34.852 |
| 44198.38033564815 | 35.219 |
| 44198.422002314815 | 35.837 |
| 44198.46366898149 | 36.59 |
| 44198.50533564815 | 37.594 |
| 44198.547002314815 | 37.941 |
| 44198.58866898149 | 37.825 |
| 44198.63033564815 | 37.362 |
| 44198.672002314815 | 36.628 |
| 44198.71366898149 | 36.088 |
| 44198.75533564815 | 35.721 |
| 44198.797002314815 | 35.47 |
| 44198.83866898149 | 35.393 |
| 44198.88033564815 | 35.451 |
| 44198.922002314815 | 35.354 |
| 44198.96366898149 | 35.219 |
| 44199.00533564815 | 35.026 |
| 44199.047002314815 | 35.026 |
| 44199.08866898149 | 35.026 |
| 44199.13033564815 | 35.007 |
| 44199.172002314815 | 34.949 |
| 44199.21366898149 | 34.929 |
| 44199.25533564815 | 34.968 |
| 44199.297002314815 | 35.122 |
| 44199.33866898149 | 35.489 |
| 44199.38033564815 | 35.682 |
| 44199.422002314815 | 36.3 |
| 44199.46366898149 | 37.149 |
| 44199.50533564815 | 37.69 |
| 44199.547002314815 | 37.864 |
| 44199.58866898149 | 38.018 |
| 44199.63033564815 | 37.864 |
| 44199.672002314815 | 37.458 |
| 44199.71366898149 | 36.899 |
| 44199.75533564815 | 36.59 |
| 44199.797002314815 | 36.455 |
| 44199.83866898149 | 36.339 |
| 44199.88033564815 | 36.184 |
| 44199.922002314815 | 36.165 |
| 44199.96366898149 | 36.281 |
| 44200.00533564815 | 36.204 |
| 44200.047002314815 | 35.991 |
| 44200.08866898149 | 35.76 |
| 44200.13033564815 | 35.682 |
| 44200.172002314815 | 35.605 |
| 44200.21366898149 | 35.335 |
| 44200.25533564815 | 35.045 |
| 44200.297002314815 | 34.968 |
| 44200.33866898149 | 34.91 |
| 44200.38033564815 | 35.122 |
| 44200.422002314815 | 35.895 |
| 44200.46366898149 | 36.86 |
| 44200.50533564815 | 38.327 |
| 44200.547002314815 | 39.041 |
| 44200.58866898149 | 38.926 |
| 44200.63033564815 | 38.173 |
| 44200.672002314815 | 37.304 |
| 44200.71366898149 | 36.59 |
| 44200.75533564815 | 36.068 |
| 44200.797002314815 | 35.875 |
| 44200.83866898149 | 35.875 |
| 44200.88033564815 | 36.03 |
| 44200.922002314815 | 36.126 |
| 44200.96366898149 | 36.184 |
| 44201.00533564815 | 36.261 |
| 44201.047002314815 | 36.165 |
| 44201.08866898149 | 36.165 |
| 44201.13033564815 | 36.184 |
| 44201.172002314815 | 36.126 |
| 44201.21366898149 | 35.856 |
| 44201.25533564815 | 35.721 |
| 44201.297002314815 | 35.798 |
| 44201.33866898149 | 36.03 |
| 44201.38033564815 | 36.126 |
| 44201.422002314815 | 36.512 |
| 44201.46366898149 | 37.111 |
| 44201.50533564815 | 37.671 |
| 44201.547002314815 | 37.246 |
| 44201.58866898149 | 36.59 |
| 44201.63033564815 | 36.744 |
| 44201.672002314815 | 36.628 |
| 44201.71366898149 | 36.03 |
| 44201.75533564815 | 35.547 |
| 44201.797002314815 | 35.509 |
| 44201.83866898149 | 35.489 |
| 44201.88033564815 | 35.47 |
| 44201.922002314815 | 35.47 |
| 44201.96366898149 | 35.431 |
| 44202.00533564815 | 35.489 |
| 44202.047002314815 | 35.489 |
| 44202.08866898149 | 35.373 |
| 44202.13033564815 | 35.277 |
| 44202.172002314815 | 35.393 |
| 44202.21366898149 | 35.2 |
| 44202.25533564815 | 34.891 |
| 44202.297002314815 | 34.756 |
| 44202.33866898149 | 34.582 |
| 44202.38033564815 | 34.659 |
| 44202.422002314815 | 35.451 |
| 44202.46366898149 | 36.512 |
| 44202.50533564815 | 37.98 |
| 44202.547002314815 | 38.636 |
| 44202.58866898149 | 38.501 |
| 44202.63033564815 | 37.922 |
| 44202.672002314815 | 36.995 |
| 44202.71366898149 | 36.223 |
| 44202.75533564815 | 35.721 |
| 44202.797002314815 | 35.47 |
| 44202.83866898149 | 35.161 |
| 44202.88033564815 | 34.968 |
| 44202.922002314815 | 34.814 |
| 44202.96366898149 | 34.717 |
| 44203.00533564815 | 34.563 |
| 44203.047002314815 | 34.505 |
| 44203.08866898149 | 34.447 |
| 44203.13033564815 | 34.485 |
| 44203.172002314815 | 34.427 |
| 44203.21366898149 | 34.485 |
| 44203.25533564815 | 34.524 |
| 44203.297002314815 | 34.621 |
| 44203.33866898149 | 34.775 |
| 44203.38033564815 | 35.045 |
| 44203.422002314815 | 35.412 |
| 44203.46366898149 | 36.242 |
| 44203.50533564815 | 37.806 |
| 44203.547002314815 | 38.636 |
| 44203.58866898149 | 38.81 |
| 44203.63033564815 | 38.231 |
| 44203.672002314815 | 37.227 |
| 44203.71366898149 | 36.184 |
| 44203.75533564815 | 35.566 |
| 44203.797002314815 | 35.296 |
| 44203.83866898149 | 35.2 |
| 44203.88033564815 | 34.987 |
| 44203.922002314815 | 34.891 |
| 44203.96366898149 | 34.775 |
| 44204.00533564815 | 34.659 |
| 44204.047002314815 | 34.582 |
| 44204.08866898149 | 34.447 |
| 44204.13033564815 | 34.543 |
| 44204.172002314815 | 34.756 |
| 44204.21366898149 | 34.678 |
| 44204.25533564815 | 34.427 |
| 44204.297002314815 | 34.254 |
| 44204.33866898149 | 34.176 |
| 44204.38033564815 | 34.292 |
| 44204.422002314815 | 35.084 |
| 44204.46366898149 | 36.184 |
| 44204.50533564815 | 37.613 |
| 44204.547002314815 | 38.385 |
| 44204.58866898149 | 38.443 |
| 44204.63033564815 | 37.748 |
| 44204.672002314815 | 36.821 |
| 44204.71366898149 | 35.991 |
| 44204.75533564815 | 35.509 |
| 44204.797002314815 | 35.2 |
| 44204.83866898149 | 35.142 |
| 44204.88033564815 | 35.2 |
| 44204.922002314815 | 35.219 |
| 44204.96366898149 | 35.277 |
| 44205.00533564815 | 35.277 |
| 44205.047002314815 | 35.2 |
| 44205.08866898149 | 35.084 |
| 44205.13033564815 | 34.987 |
| 44205.172002314815 | 35.007 |
| 44205.21366898149 | 34.949 |
| 44205.25533564815 | 34.717 |
| 44205.297002314815 | 34.678 |
| 44205.33866898149 | 34.736 |
| 44205.38033564815 | 34.871 |
| 44205.422002314815 | 35.509 |
| 44205.46366898149 | 36.532 |
| 44205.50533564815 | 37.883 |
| 44205.547002314815 | 38.597 |
| 44205.58866898149 | 38.482 |
| 44205.63033564815 | 37.709 |
| 44205.672002314815 | 36.995 |
| 44205.71366898149 | 36.281 |
| 44205.75533564815 | 35.953 |
| 44205.797002314815 | 35.76 |
| 44205.83866898149 | 35.509 |
| 44205.88033564815 | 35.296 |
| 44205.922002314815 | 35.451 |
| 44205.96366898149 | 35.393 |
| 44206.00533564815 | 35.084 |
| 44206.047002314815 | 34.794 |
| 44206.08866898149 | 34.543 |
| 44206.13033564815 | 34.466 |
| 44206.172002314815 | 34.292 |
| 44206.21366898149 | 34.099 |
| 44206.25533564815 | 34.041 |
| 44206.297002314815 | 34.003 |
| 44206.33866898149 | 33.983 |
| 44206.38033564815 | 34.119 |
| 44206.422002314815 | 34.833 |
| 44206.46366898149 | 36.01 |
| 44206.50533564815 | 37.458 |
| 44206.547002314815 | 38.076 |
| 44206.58866898149 | 38.038 |
| 44206.63033564815 | 37.42 |
| 44206.672002314815 | 36.532 |
| 44206.71366898149 | 35.76 |
| 44206.75533564815 | 35.238 |
| 44206.797002314815 | 34.929 |
| 44206.83866898149 | 34.698 |
| 44206.88033564815 | 34.505 |
| 44206.922002314815 | 34.331 |
| 44206.96366898149 | 34.196 |
| 44207.00533564815 | 34.119 |
| 44207.047002314815 | 33.983 |
| 44207.08866898149 | 33.887 |
| 44207.13033564815 | 33.771 |
| 44207.172002314815 | 33.732 |
| 44207.21366898149 | 33.694 |
| 44207.25533564815 | 33.636 |
| 44207.297002314815 | 33.559 |
| 44207.33866898149 | 33.539 |
| 44207.38033564815 | 33.694 |
| 44207.422002314815 | 34.524 |
| 44207.46366898149 | 35.74 |
| 44207.50533564815 | 37.149 |
| 44207.547002314815 | 37.922 |
| 44207.58866898149 | 38.057 |
| 44207.63033564815 | 37.439 |
| 44207.672002314815 | 36.435 |
| 44207.71366898149 | 35.605 |
| 44207.75533564815 | 35.065 |
| 44207.797002314815 | 34.698 |
| 44207.83866898149 | 34.447 |
| 44207.88033564815 | 34.254 |
| 44207.922002314815 | 34.119 |
| 44207.96366898149 | 33.906 |
| 44208.00533564815 | 33.906 |
| 44208.047002314815 | 33.771 |
| 44208.08866898149 | 33.732 |
| 44208.13033564815 | 33.694 |
| 44208.172002314815 | 33.636 |
| 44208.21366898149 | 33.636 |
| 44208.25533564815 | 33.636 |
| 44208.297002314815 | 33.655 |
| 44208.33866898149 | 33.675 |
| 44208.38033564815 | 33.906 |
| 44208.422002314815 | 34.756 |
| 44208.46366898149 | 35.914 |
| 44208.50533564815 | 37.42 |
| 44208.547002314815 | 37.922 |
| 44208.58866898149 | 37.748 |
| 44208.63033564815 | 36.995 |
| 44208.672002314815 | 36.339 |
| 44208.71366898149 | 35.798 |
| 44208.75533564815 | 35.373 |
| 44208.797002314815 | 35.065 |
| 44208.83866898149 | 34.852 |
| 44208.88033564815 | 34.775 |
| 44208.922002314815 | 34.698 |
| 44208.96366898149 | 34.794 |
| 44209.00533564815 | 34.814 |
| 44209.047002314815 | 34.891 |
| 44209.08866898149 | 34.91 |
| 44209.13033564815 | 34.871 |
| 44209.172002314815 | 34.814 |
| 44209.21366898149 | 34.698 |
| 44209.25533564815 | 34.698 |
| 44209.297002314815 | 34.717 |
| 44209.33866898149 | 34.833 |
| 44209.38033564815 | 35.142 |
| 44209.422002314815 | 35.875 |
| 44209.46366898149 | 36.995 |
| 44209.50533564815 | 38.327 |
| 44209.547002314815 | 38.868 |
| 44209.58866898149 | 38.926 |
| 44209.63033564815 | 38.675 |
| 44209.672002314815 | 38.115 |
| 44209.71366898149 | 37.343 |
| 44209.75533564815 | 36.551 |
| 44209.797002314815 | 36.126 |
| 44209.83866898149 | 36.184 |
| 44209.88033564815 | 36.3 |
| 44209.922002314815 | 36.01 |
| 44209.96366898149 | 35.721 |
| 44210.00533564815 | 35.393 |
| 44210.047002314815 | 34.987 |
| 44210.08866898149 | 34.408 |
| 44210.13033564815 | 33.983 |
| 44210.172002314815 | 33.887 |
| 44210.21366898149 | 33.964 |
| 44210.25533564815 | 34.003 |
| 44210.297002314815 | 34.08 |
| 44210.33866898149 | 34.157 |
| 44210.38033564815 | 34.447 |
| 44210.422002314815 | 35.219 |
| 44210.46366898149 | 35.856 |
| 44210.50533564815 | 36.261 |
| 44210.547002314815 | 36.57 |
| 44210.58866898149 | 36.532 |
| 44210.63033564815 | 36.126 |
| 44210.672002314815 | 35.412 |
| 44210.71366898149 | 34.64 |
| 44210.75533564815 | 34.176 |
| 44210.797002314815 | 34.119 |
| 44210.83866898149 | 34.119 |
| 44210.88033564815 | 34.08 |
| 44210.922002314815 | 34.099 |
| 44210.96366898149 | 34.08 |
| 44211.00533564815 | 34.215 |
| 44211.047002314815 | 34.273 |
| 44211.08866898149 | 34.234 |
| 44211.13033564815 | 34.157 |
| 44211.172002314815 | 34.138 |
| 44211.21366898149 | 34.119 |
| 44211.25533564815 | 33.964 |
| 44211.297002314815 | 33.906 |
| 44211.33866898149 | 33.926 |
| 44211.38033564815 | 34.196 |
| 44211.422002314815 | 35.045 |
| 44211.46366898149 | 36.165 |
| 44211.50533564815 | 37.4 |
| 44211.547002314815 | 37.864 |
| 44211.58866898149 | 37.806 |
| 44211.63033564815 | 37.439 |
| 44211.672002314815 | 36.628 |
| 44211.71366898149 | 35.875 |
| 44211.75533564815 | 35.431 |
| 44211.797002314815 | 35.335 |
| 44211.83866898149 | 35.103 |
| 44211.88033564815 | 34.91 |
| 44211.922002314815 | 34.833 |
| 44211.96366898149 | 34.794 |
| 44212.00533564815 | 34.814 |
| 44212.047002314815 | 35.026 |
| 44212.08866898149 | 35.18 |
| 44212.13033564815 | 35.238 |
| 44212.172002314815 | 35.354 |
| 44212.21366898149 | 35.47 |
| 44212.25533564815 | 35.451 |
| 44212.297002314815 | 35.412 |
| 44212.33866898149 | 35.354 |
| 44212.38033564815 | 35.547 |
| 44212.422002314815 | 36.126 |
| 44212.46366898149 | 36.686 |
| 44212.50533564815 | 37.825 |
| 44212.547002314815 | 37.96 |
| 44212.58866898149 | 37.825 |
| 44212.63033564815 | 37.362 |
| 44212.672002314815 | 36.783 |
| 44212.71366898149 | 36.223 |
| 44212.75533564815 | 35.74 |
| 44212.797002314815 | 35.682 |
| 44212.83866898149 | 35.74 |
| 44212.88033564815 | 35.798 |
| 44212.922002314815 | 35.702 |
| 44212.96366898149 | 35.586 |
| 44213.00533564815 | 35.393 |
| 44213.047002314815 | 35.258 |
| 44213.08866898149 | 35.258 |
| 44213.13033564815 | 35.315 |
| 44213.172002314815 | 35.489 |
| 44213.21366898149 | 35.528 |
| 44213.25533564815 | 35.451 |
| 44213.297002314815 | 35.451 |
| 44213.33866898149 | 35.586 |
| 44213.38033564815 | 35.875 |
| 44213.422002314815 | 36.455 |
| 44213.46366898149 | 37.246 |
| 44213.50533564815 | 38.153 |
| 44213.547002314815 | 38.829 |
| 44213.58866898149 | 38.81 |
| 44213.63033564815 | 38.173 |
| 44213.672002314815 | 37.362 |
| 44213.71366898149 | 36.763 |
| 44213.75533564815 | 36.455 |
| 44213.797002314815 | 36.3 |
| 44213.83866898149 | 36.126 |
| 44213.88033564815 | 36.126 |
| 44213.922002314815 | 35.933 |
| 44213.96366898149 | 35.798 |
| 44214.00533564815 | 35.721 |
| 44214.047002314815 | 35.817 |
| 44214.08866898149 | 35.837 |
| 44214.13033564815 | 35.837 |
| 44214.172002314815 | 35.798 |
| 44214.21366898149 | 35.702 |
| 44214.25533564815 | 35.644 |
| 44214.297002314815 | 35.624 |
| 44214.33866898149 | 35.431 |
| 44214.38033564815 | 35.586 |
| 44214.422002314815 | 36.165 |
| 44214.46366898149 | 36.551 |
| 44214.50533564815 | 36.725 |
| 44214.547002314815 | 36.937 |
| 44214.58866898149 | 37.111 |
| 44214.63033564815 | 36.937 |
| 44214.672002314815 | 36.416 |
| 44214.71366898149 | 35.74 |
| 44214.75533564815 | 35.373 |
| 44214.797002314815 | 35.238 |
| 44214.83866898149 | 35.122 |
| 44214.88033564815 | 35.026 |
| 44214.922002314815 | 35.161 |
| 44214.96366898149 | 35.238 |
| 44215.00533564815 | 35.161 |
| 44215.047002314815 | 35.277 |
| 44215.08866898149 | 35.277 |
| 44215.13033564815 | 35.238 |
| 44215.172002314815 | 34.987 |
| 44215.21366898149 | 34.891 |
| 44215.25533564815 | 34.987 |
| 44215.297002314815 | 35.122 |
| 44215.33866898149 | 35.122 |
| 44215.38033564815 | 35.238 |
| 44215.422002314815 | 35.798 |
| 44215.46366898149 | 36.725 |
| 44215.50533564815 | 37.922 |
| 44215.547002314815 | 38.597 |
| 44215.58866898149 | 38.655 |
| 44215.63033564815 | 37.825 |
| 44215.672002314815 | 36.435 |
| 44215.71366898149 | 35.566 |
| 44215.75533564815 | 35.238 |
| 44215.797002314815 | 35.007 |
| 44215.83866898149 | 34.775 |
| 44215.88033564815 | 34.621 |
| 44215.922002314815 | 34.505 |
| 44215.96366898149 | 34.427 |
| 44216.00533564815 | 34.37 |
| 44216.047002314815 | 34.389 |
| 44216.08866898149 | 34.35 |
| 44216.13033564815 | 34.35 |
| 44216.172002314815 | 34.543 |
| 44216.21366898149 | 34.698 |
| 44216.25533564815 | 34.871 |
| 44216.297002314815 | 35.065 |
| 44216.33866898149 | 35.258 |
| 44216.38033564815 | 35.47 |
| 44216.422002314815 | 36.261 |
| 44216.46366898149 | 37.69 |
| 44216.50533564815 | 38.81 |
| 44216.547002314815 | 38.983 |
| 44216.58866898149 | 38.887 |
| 44216.63033564815 | 38.153 |
| 44216.672002314815 | 37.381 |
| 44216.71366898149 | 36.609 |
| 44216.75533564815 | 35.875 |
| 44216.797002314815 | 35.663 |
| 44216.83866898149 | 35.682 |
| 44216.88033564815 | 35.76 |
| 44216.922002314815 | 35.76 |
| 44216.96366898149 | 35.682 |
| 44217.00533564815 | 35.624 |
| 44217.047002314815 | 35.586 |
| 44217.08866898149 | 35.489 |
| 44217.13033564815 | 35.47 |
| 44217.172002314815 | 35.431 |
| 44217.21366898149 | 35.2 |
| 44217.25533564815 | 35.045 |
| 44217.297002314815 | 35.142 |
| 44217.33866898149 | 35.238 |
| 44217.38033564815 | 35.509 |
| 44217.422002314815 | 36.107 |
| 44217.46366898149 | 37.207 |
| 44217.50533564815 | 37.96 |
| 44217.547002314815 | 37.96 |
| 44217.58866898149 | 37.806 |
| 44217.63033564815 | 38.25 |
| 44217.672002314815 | 38.038 |
| 44217.71366898149 | 37.362 |
| 44217.75533564815 | 36.648 |
| 44217.797002314815 | 36.319 |
| 44217.83866898149 | 36.242 |
| 44217.88033564815 | 36.126 |
| 44217.922002314815 | 36.088 |
| 44217.96366898149 | 35.991 |
| 44218.00533564815 | 35.972 |
| 44218.047002314815 | 35.933 |
| 44218.08866898149 | 35.914 |
| 44218.13033564815 | 35.953 |
| 44218.172002314815 | 35.914 |
| 44218.21366898149 | 35.875 |
| 44218.25533564815 | 35.875 |
| 44218.297002314815 | 35.914 |
| 44218.33866898149 | 35.914 |
| 44218.38033564815 | 36.107 |
| 44218.422002314815 | 36.397 |
| 44218.46366898149 | 36.744 |
| 44218.50533564815 | 37.246 |
| 44218.547002314815 | 37.729 |
| 44218.58866898149 | 38.983 |
| 44218.63033564815 | 39.061 |
| 44218.672002314815 | 37.787 |
| 44218.71366898149 | 36.648 |
| 44218.75533564815 | 36.165 |
| 44218.797002314815 | 36.165 |
| 44218.83866898149 | 35.991 |
| 44218.88033564815 | 35.817 |
| 44218.922002314815 | 35.682 |
| 44218.96366898149 | 35.509 |
| 44219.00533564815 | 35.335 |
| 44219.047002314815 | 35.219 |
| 44219.08866898149 | 35.084 |
| 44219.13033564815 | 35.122 |
| 44219.172002314815 | 35.335 |
| 44219.21366898149 | 35.47 |
| 44219.25533564815 | 35.315 |
| 44219.297002314815 | 35.045 |
| 44219.33866898149 | 34.968 |
| 44219.38033564815 | 35.238 |
| 44219.422002314815 | 36.088 |
| 44219.46366898149 | 37.227 |
| 44219.50533564815 | 38.057 |
| 44219.547002314815 | 37.999 |
| 44219.58866898149 | 37.594 |
| 44219.63033564815 | 37.207 |
| 44219.672002314815 | 36.648 |
| 44219.71366898149 | 36.184 |
| 44219.75533564815 | 35.663 |
| 44219.797002314815 | 35.373 |
| 44219.83866898149 | 35.412 |
| 44219.88033564815 | 35.528 |
| 44219.922002314815 | 35.451 |
| 44219.96366898149 | 35.335 |
| 44220.00533564815 | 35.238 |
| 44220.047002314815 | 35.161 |
| 44220.08866898149 | 34.775 |
| 44220.13033564815 | 34.601 |
| 44220.172002314815 | 34.427 |
| 44220.21366898149 | 34.234 |
| 44220.25533564815 | 34.138 |
| 44220.297002314815 | 34.061 |
| 44220.33866898149 | 34.061 |
| 44220.38033564815 | 34.408 |
| 44220.422002314815 | 35.47 |
| 44220.46366898149 | 36.744 |
| 44220.50533564815 | 37.072 |
| 44220.547002314815 | 37.362 |
| 44220.58866898149 | 37.651 |
| 44220.63033564815 | 37.632 |
| 44220.672002314815 | 36.918 |
| 44220.71366898149 | 36.319 |
| 44220.75533564815 | 35.875 |
| 44220.797002314815 | 35.76 |
| 44220.83866898149 | 35.624 |
| 44220.88033564815 | 35.547 |
| 44220.922002314815 | 35.489 |
| 44220.96366898149 | 35.431 |
| 44221.00533564815 | 35.258 |
| 44221.047002314815 | 35.161 |
| 44221.08866898149 | 35.084 |
| 44221.13033564815 | 35.142 |
| 44221.172002314815 | 35.2 |
| 44221.21366898149 | 35.142 |
| 44221.25533564815 | 34.987 |
| 44221.297002314815 | 34.756 |
| 44221.33866898149 | 34.601 |
| 44221.38033564815 | 34.891 |
| 44221.422002314815 | 35.798 |
| 44221.46366898149 | 36.532 |
| 44221.50533564815 | 37.381 |
| 44221.547002314815 | 37.651 |
| 44221.58866898149 | 37.883 |
| 44221.63033564815 | 37.42 |
| 44221.672002314815 | 36.802 |
| 44221.71366898149 | 36.223 |
| 44221.75533564815 | 35.644 |
| 44221.797002314815 | 35.451 |
| 44221.83866898149 | 35.335 |
| 44221.88033564815 | 35.065 |
| 44221.922002314815 | 34.833 |
| 44221.96366898149 | 34.621 |
| 44222.00533564815 | 34.331 |
| 44222.047002314815 | 34.022 |
| 44222.08866898149 | 33.964 |
| 44222.13033564815 | 33.81 |
| 44222.172002314815 | 33.906 |
| 44222.21366898149 | 34.08 |
| 44222.25533564815 | 34.157 |
| 44222.297002314815 | 34.312 |
| 44222.33866898149 | 34.563 |
| 44222.38033564815 | 34.91 |
| 44222.422002314815 | 35.528 |
| 44222.46366898149 | 36.261 |
| 44222.50533564815 | 36.397 |
| 44222.547002314815 | 36.435 |
| 44222.58866898149 | 36.512 |
| 44222.63033564815 | 36.261 |
| 44222.672002314815 | 35.779 |
| 44222.71366898149 | 35.315 |
| 44222.75533564815 | 34.814 |
| 44222.797002314815 | 34.601 |
| 44222.83866898149 | 34.601 |
| 44222.88033564815 | 34.621 |
| 44222.922002314815 | 34.601 |
| 44222.96366898149 | 34.582 |
| 44223.00533564815 | 34.736 |
| 44223.047002314815 | 34.756 |
| 44223.08866898149 | 34.505 |
| 44223.13033564815 | 34.138 |
| 44223.172002314815 | 33.868 |
| 44223.21366898149 | 33.732 |
| 44223.25533564815 | 33.617 |
| 44223.297002314815 | 33.482 |
| 44223.33866898149 | 33.424 |
| 44223.38033564815 | 33.578 |
| 44223.422002314815 | 34.485 |
| 44223.46366898149 | 35.991 |
| 44223.50533564815 | 37.729 |
| 44223.547002314815 | 38.482 |
| 44223.58866898149 | 38.482 |
| 44223.63033564815 | 37.98 |
| 44223.672002314815 | 37.516 |
| 44223.71366898149 | 36.705 |
| 44223.75533564815 | 36.126 |
| 44223.797002314815 | 35.875 |
| 44223.83866898149 | 35.76 |
| 44223.88033564815 | 35.509 |
| 44223.922002314815 | 35.451 |
| 44223.96366898149 | 35.393 |
| 44224.00533564815 | 35.431 |
| 44224.047002314815 | 35.2 |
| 44224.08866898149 | 34.968 |
| 44224.13033564815 | 34.929 |
| 44224.172002314815 | 34.929 |
| 44224.21366898149 | 34.968 |
| 44224.25533564815 | 34.987 |
| 44224.297002314815 | 35.007 |
| 44224.33866898149 | 35.122 |
| 44224.38033564815 | 35.547 |
| 44224.422002314815 | 36.416 |
| 44224.46366898149 | 37.536 |
| 44224.50533564815 | 38.906 |
| 44224.547002314815 | 39.852 |
| 44224.58866898149 | 39.929 |
| 44224.63033564815 | 39.099 |
| 44224.672002314815 | 38.018 |
| 44224.71366898149 | 36.821 |
| 44224.75533564815 | 36.107 |
| 44224.797002314815 | 35.74 |
| 44224.83866898149 | 35.489 |
| 44224.88033564815 | 35.238 |
| 44224.922002314815 | 34.987 |
| 44224.96366898149 | 34.891 |
| 44225.00533564815 | 34.794 |
| 44225.047002314815 | 34.659 |
| 44225.08866898149 | 34.621 |
| 44225.13033564815 | 34.621 |
| 44225.172002314815 | 34.64 |
| 44225.21366898149 | 34.659 |
| 44225.25533564815 | 34.833 |
| 44225.297002314815 | 34.949 |
| 44225.33866898149 | 35.045 |
| 44225.38033564815 | 35.393 |
| 44225.422002314815 | 36.512 |
| 44225.46366898149 | 37.902 |
| 44225.50533564815 | 39.389 |
| 44225.547002314815 | 39.833 |
| 44225.58866898149 | 39.717 |
| 44225.63033564815 | 38.926 |
| 44225.672002314815 | 37.806 |
| 44225.71366898149 | 36.995 |
| 44225.75533564815 | 36.57 |
| 44225.797002314815 | 36.223 |
| 44225.83866898149 | 36.01 |
| 44225.88033564815 | 35.663 |
| 44225.922002314815 | 35.354 |
| 44225.96366898149 | 35.393 |
| 44226.00533564815 | 35.47 |
| 44226.047002314815 | 35.315 |
| 44226.08866898149 | 35.219 |
| 44226.13033564815 | 35.258 |
| 44226.172002314815 | 35.238 |
| 44226.21366898149 | 35.161 |
| 44226.25533564815 | 35.045 |
| 44226.297002314815 | 34.949 |
| 44226.33866898149 | 35.007 |
| 44226.38033564815 | 35.393 |
| 44226.422002314815 | 35.991 |
| 44226.46366898149 | 36.242 |
| 44226.50533564815 | 36.59 |
| 44226.547002314815 | 36.879 |
| 44226.58866898149 | 36.956 |
| 44226.63033564815 | 36.783 |
| 44226.672002314815 | 36.281 |
| 44226.71366898149 | 35.76 |
| 44226.75533564815 | 35.354 |
| 44226.797002314815 | 35.161 |
| 44226.83866898149 | 35.065 |
| 44226.88033564815 | 34.968 |
| 44226.922002314815 | 35.026 |
| 44226.96366898149 | 35.045 |
| 44227.00533564815 | 35.103 |
| 44227.047002314815 | 35.065 |
| 44227.08866898149 | 34.949 |
| 44227.13033564815 | 34.814 |
| 44227.172002314815 | 34.563 |
| 44227.21366898149 | 34.35 |
| 44227.25533564815 | 34.215 |
| 44227.297002314815 | 34.215 |
| 44227.33866898149 | 34.099 |
| 44227.38033564815 | 34.215 |
| 44227.422002314815 | 35.142 |
| 44227.46366898149 | 36.57 |
| 44227.50533564815 | 38.231 |
| 44227.547002314815 | 39.119 |
| 44227.58866898149 | 39.312 |
| 44227.63033564815 | 38.655 |
| 44227.672002314815 | 37.497 |
| 44227.71366898149 | 36.455 |
| 44227.75533564815 | 35.624 |
| 44227.797002314815 | 35.103 |
| 44227.83866898149 | 34.814 |
| 44227.88033564815 | 34.601 |
| 44227.922002314815 | 34.37 |
| 44227.96366898149 | 34.215 |
| 44228.00533564815 | 34.119 |
| 44228.047002314815 | 34.061 |
| 44228.08866898149 | 33.964 |
| 44228.13033564815 | 33.983 |
| 44228.172002314815 | 34.003 |
| 44228.21366898149 | 33.983 |
| 44228.25533564815 | 33.983 |
| 44228.297002314815 | 34.003 |
| 44228.33866898149 | 33.945 |
| 44228.38033564815 | 34.215 |
| 44228.422002314815 | 35.065 |
| 44228.46366898149 | 36.261 |
| 44228.50533564815 | 37.13 |
| 44228.547002314815 | 37.323 |
| 44228.58866898149 | 37.632 |
| 44228.63033564815 | 37.748 |
| 44228.672002314815 | 37.42 |
| 44228.71366898149 | 36.705 |
| 44228.75533564815 | 36.204 |
| 44228.797002314815 | 35.779 |
| 44228.83866898149 | 35.451 |
| 44228.88033564815 | 35.354 |
| 44228.922002314815 | 35.2 |
| 44228.96366898149 | 35.084 |
| 44229.00533564815 | 34.987 |
| 44229.047002314815 | 34.794 |
| 44229.08866898149 | 34.659 |
| 44229.13033564815 | 34.64 |
| 44229.172002314815 | 34.601 |
| 44229.21366898149 | 34.543 |
| 44229.25533564815 | 34.563 |
| 44229.297002314815 | 34.717 |
| 44229.33866898149 | 34.987 |
| 44229.38033564815 | 35.547 |
| 44229.422002314815 | 36.435 |
| 44229.46366898149 | 37.748 |
| 44229.50533564815 | 39.312 |
| 44229.547002314815 | 40.489 |
| 44229.58866898149 | 39.891 |
| 44229.63033564815 | 39.061 |
| 44229.672002314815 | 38.192 |
| 44229.71366898149 | 37.111 |
| 44229.75533564815 | 36.281 |
| 44229.797002314815 | 35.875 |
| 44229.83866898149 | 35.586 |
| 44229.88033564815 | 35.412 |
| 44229.922002314815 | 35.277 |
| 44229.96366898149 | 35.219 |
| 44230.00533564815 | 35.2 |
| 44230.047002314815 | 35.277 |
| 44230.08866898149 | 35.277 |
| 44230.13033564815 | 35.161 |
| 44230.172002314815 | 35.2 |
| 44230.21366898149 | 35.2 |
| 44230.25533564815 | 35.335 |
| 44230.297002314815 | 35.509 |
| 44230.33866898149 | 35.914 |
| 44230.38033564815 | 36.455 |
| 44230.422002314815 | 37.13 |
| 44230.46366898149 | 37.497 |
| 44230.50533564815 | 37.323 |
| 44230.547002314815 | 37.439 |
| 44230.58866898149 | 36.841 |
| 44230.63033564815 | 36.088 |
| 44230.672002314815 | 35.798 |
| 44230.71366898149 | 35.663 |
| 44230.75533564815 | 35.47 |
| 44230.797002314815 | 34.485 |
| 44230.83866898149 | 33.848 |
| 44230.88033564815 | 33.945 |
| 44230.922002314815 | 34.312 |
| 44230.96366898149 | 34.485 |
| 44231.00533564815 | 34.563 |
| 44231.047002314815 | 34.543 |
| 44231.08866898149 | 34.621 |
| 44231.13033564815 | 34.659 |
| 44231.172002314815 | 34.659 |
| 44231.21366898149 | 34.331 |
| 44231.25533564815 | 34.119 |
| 44231.297002314815 | 33.983 |
| 44231.33866898149 | 33.983 |
| 44231.38033564815 | 34.563 |
| 44231.422002314815 | 35.489 |
| 44231.46366898149 | 36.223 |
| 44231.50533564815 | 36.648 |
| 44231.547002314815 | 36.802 |
| 44231.58866898149 | 36.493 |
| 44231.63033564815 | 36.242 |
| 44231.672002314815 | 36.068 |
| 44231.71366898149 | 35.798 |
| 44231.75533564815 | 35.065 |
| 44231.797002314815 | 34.814 |
| 44231.83866898149 | 34.678 |
| 44231.88033564815 | 34.601 |
| 44231.922002314815 | 34.485 |
| 44231.96366898149 | 34.466 |
| 44232.00533564815 | 34.601 |
| 44232.047002314815 | 34.717 |
| 44232.08866898149 | 34.794 |
| 44232.13033564815 | 34.698 |
| 44232.172002314815 | 34.756 |
| 44232.21366898149 | 34.833 |
| 44232.25533564815 | 34.833 |
| 44232.297002314815 | 34.814 |
| 44232.33866898149 | 34.91 |
| 44232.38033564815 | 35.103 |
| 44232.422002314815 | 35.354 |
| 44232.46366898149 | 35.837 |
| 44232.50533564815 | 36.532 |
| 44232.547002314815 | 36.956 |
| 44232.58866898149 | 36.956 |
| 44232.63033564815 | 36.744 |
| 44232.672002314815 | 36.281 |
| 44232.71366898149 | 35.837 |
| 44232.75533564815 | 35.47 |
| 44232.797002314815 | 35.296 |
| 44232.83866898149 | 35.084 |
| 44232.88033564815 | 34.891 |
| 44232.922002314815 | 34.736 |
| 44232.96366898149 | 34.775 |
| 44233.00533564815 | 34.698 |
| 44233.047002314815 | 34.64 |
| 44233.08866898149 | 34.543 |
| 44233.13033564815 | 34.447 |
| 44233.172002314815 | 34.408 |
| 44233.21366898149 | 34.35 |
| 44233.25533564815 | 34.35 |
| 44233.297002314815 | 34.466 |
| 44233.33866898149 | 34.601 |
| 44233.38033564815 | 34.968 |
| 44233.422002314815 | 35.47 |
| 44233.46366898149 | 35.972 |
| 44233.50533564815 | 36.86 |
| 44233.547002314815 | 37.709 |
| 44233.58866898149 | 37.806 |
| 44233.63033564815 | 37.922 |
| 44233.672002314815 | 37.323 |
| 44233.71366898149 | 36.339 |
| 44233.75533564815 | 35.547 |
| 44233.797002314815 | 35.18 |
| 44233.83866898149 | 34.987 |
| 44233.88033564815 | 35.084 |
| 44233.922002314815 | 35.065 |
| 44233.96366898149 | 35.084 |
| 44234.00533564815 | 35.084 |
| 44234.047002314815 | 35.122 |
| 44234.08866898149 | 35.084 |
| 44234.13033564815 | 35.065 |
| 44234.172002314815 | 35.103 |
| 44234.21366898149 | 35.084 |
| 44234.25533564815 | 34.929 |
| 44234.297002314815 | 34.524 |
| 44234.33866898149 | 34.234 |
| 44234.38033564815 | 34.215 |
| 44234.422002314815 | 35.373 |
| 44234.46366898149 | 36.686 |
| 44234.50533564815 | 38.327 |
| 44234.547002314815 | 39.099 |
| 44234.58866898149 | 39.061 |
| 44234.63033564815 | 38.288 |
| 44234.672002314815 | 37.034 |
| 44234.71366898149 | 35.74 |
| 44234.75533564815 | 34.91 |
| 44234.797002314815 | 34.621 |
| 44234.83866898149 | 34.563 |
| 44234.88033564815 | 34.524 |
| 44234.922002314815 | 34.678 |
| 44234.96366898149 | 34.563 |
| 44235.00533564815 | 34.543 |
| 44235.047002314815 | 34.389 |
| 44235.08866898149 | 34.273 |
| 44235.13033564815 | 34.312 |
| 44235.172002314815 | 34.485 |
| 44235.21366898149 | 34.543 |
| 44235.25533564815 | 34.678 |
| 44235.297002314815 | 34.814 |
| 44235.33866898149 | 34.852 |
| 44235.38033564815 | 35.103 |
| 44235.422002314815 | 35.856 |
| 44235.46366898149 | 37.072 |
| 44235.50533564815 | 38.578 |
| 44235.547002314815 | 39.273 |
| 44235.58866898149 | 39.138 |
| 44235.63033564815 | 38.385 |
| 44235.672002314815 | 37.188 |
| 44235.71366898149 | 36.068 |
| 44235.75533564815 | 35.2 |
| 44235.797002314815 | 34.852 |
| 44235.83866898149 | 34.814 |
| 44235.88033564815 | 34.833 |
| 44235.922002314815 | 34.814 |
| 44235.96366898149 | 34.852 |
| 44236.00533564815 | 34.968 |
| 44236.047002314815 | 35.103 |
| 44236.08866898149 | 35.238 |
| 44236.13033564815 | 35.238 |
| 44236.172002314815 | 35.335 |
| 44236.21366898149 | 35.373 |
| 44236.25533564815 | 35.393 |
| 44236.297002314815 | 35.373 |
| 44236.33866898149 | 35.566 |
| 44236.38033564815 | 36.088 |
| 44236.422002314815 | 36.59 |
| 44236.46366898149 | 37.246 |
| 44236.50533564815 | 38.231 |
| 44236.547002314815 | 38.983 |
| 44236.58866898149 | 38.945 |
| 44236.63033564815 | 38.404 |
| 44236.672002314815 | 37.613 |
| 44236.71366898149 | 36.783 |
| 44236.75533564815 | 36.184 |
| 44236.797002314815 | 35.624 |
| 44236.83866898149 | 35.412 |
| 44236.88033564815 | 35.451 |
| 44236.922002314815 | 35.566 |
| 44236.96366898149 | 35.721 |
| 44237.00533564815 | 35.76 |
| 44237.047002314815 | 35.74 |
| 44237.08866898149 | 35.74 |
| 44237.13033564815 | 35.798 |
| 44237.172002314815 | 35.817 |
| 44237.21366898149 | 35.76 |
| 44237.25533564815 | 35.721 |
| 44237.297002314815 | 35.74 |
| 44237.33866898149 | 35.817 |
| 44237.38033564815 | 35.933 |
| 44237.422002314815 | 36.261 |
| 44237.46366898149 | 36.609 |
| 44237.50533564815 | 37.072 |
| 44237.547002314815 | 39.312 |
| 44237.58866898149 | 40.586 |
| 44237.63033564815 | 40.586 |
| 44237.672002314815 | 39.234 |
| 44237.71366898149 | 37.632 |
| 44237.75533564815 | 36.532 |
| 44237.797002314815 | 35.817 |
| 44237.83866898149 | 35.566 |
| 44237.88033564815 | 35.509 |
| 44237.922002314815 | 35.586 |
| 44237.96366898149 | 35.528 |
| 44238.00533564815 | 35.566 |
| 44238.047002314815 | 35.586 |
| 44238.08866898149 | 35.315 |
| 44238.13033564815 | 35.122 |
| 44238.172002314815 | 35.142 |
| 44238.21366898149 | 35.354 |
| 44238.25533564815 | 35.451 |
| 44238.297002314815 | 35.296 |
| 44238.33866898149 | 35.161 |
| 44238.38033564815 | 35.277 |
| 44238.422002314815 | 35.76 |
| 44238.46366898149 | 36.358 |
| 44238.50533564815 | 36.686 |
| 44238.547002314815 | 38.346 |
| 44238.58866898149 | 38.983 |
| 44238.63033564815 | 38.868 |
| 44238.672002314815 | 38.115 |
| 44238.71366898149 | 37.227 |
| 44238.75533564815 | 36.493 |
| 44238.797002314815 | 36.01 |
| 44238.83866898149 | 35.837 |
| 44238.88033564815 | 35.74 |
| 44238.922002314815 | 35.721 |
| 44238.96366898149 | 35.682 |
| 44239.00533564815 | 35.721 |
| 44239.047002314815 | 35.721 |
| 44239.08866898149 | 35.76 |
| 44239.13033564815 | 35.798 |
| 44239.172002314815 | 35.798 |
| 44239.21366898149 | 35.702 |
| 44239.25533564815 | 35.663 |
| 44239.297002314815 | 35.624 |
| 44239.33866898149 | 35.837 |
| 44239.38033564815 | 36.088 |
| 44239.422002314815 | 36.397 |
| 44239.46366898149 | 36.744 |
| 44239.50533564815 | 37.014 |
| 44239.547002314815 | 37.536 |
| 44239.58866898149 | 37.709 |
| 44239.63033564815 | 38.038 |
| 44239.672002314815 | 37.941 |
| 44239.71366898149 | 37.207 |
| 44239.75533564815 | 36.339 |
| 44239.797002314815 | 36.03 |
| 44239.83866898149 | 35.895 |
| 44239.88033564815 | 35.721 |
| 44239.922002314815 | 35.663 |
| 44239.96366898149 | 35.335 |
| 44240.00533564815 | 34.794 |
| 44240.047002314815 | 34.814 |
| 44240.08866898149 | 35.2 |
| 44240.13033564815 | 35.451 |
| 44240.172002314815 | 35.489 |
| 44240.21366898149 | 35.509 |
| 44240.25533564815 | 35.489 |
| 44240.297002314815 | 35.547 |
| 44240.33866898149 | 35.682 |
| 44240.38033564815 | 35.991 |
| 44240.422002314815 | 36.802 |
| 44240.46366898149 | 37.98 |
| 44240.50533564815 | 38.636 |
| 44240.547002314815 | 38.462 |
| 44240.58866898149 | 37.864 |
| 44240.63033564815 | 37.729 |
| 44240.672002314815 | 37.362 |
| 44240.71366898149 | 36.744 |
| 44240.75533564815 | 36.242 |
| 44240.797002314815 | 35.837 |
| 44240.83866898149 | 35.644 |
| 44240.88033564815 | 35.586 |
| 44240.922002314815 | 35.47 |
| 44240.96366898149 | 35.335 |
| 44241.00533564815 | 35.122 |
| 44241.047002314815 | 34.91 |
| 44241.08866898149 | 34.621 |
| 44241.13033564815 | 34.563 |
| 44241.172002314815 | 34.447 |
| 44241.21366898149 | 34.273 |
| 44241.25533564815 | 34.196 |
| 44241.297002314815 | 34.138 |
| 44241.33866898149 | 34.061 |
| 44241.38033564815 | 34.312 |
| 44241.422002314815 | 35.412 |
| 44241.46366898149 | 36.821 |
| 44241.50533564815 | 37.4 |
| 44241.547002314815 | 38.134 |
| 44241.58866898149 | 38.404 |
| 44241.63033564815 | 37.709 |
| 44241.672002314815 | 36.648 |
| 44241.71366898149 | 35.547 |
| 44241.75533564815 | 34.678 |
| 44241.797002314815 | 34.061 |
| 44241.83866898149 | 33.868 |
| 44241.88033564815 | 33.887 |
| 44241.922002314815 | 33.926 |
| 44241.96366898149 | 34.196 |
| 44242.00533564815 | 34.331 |
| 44242.047002314815 | 34.234 |
| 44242.08866898149 | 34.08 |
| 44242.13033564815 | 34.08 |
| 44242.172002314815 | 34.022 |
| 44242.21366898149 | 34.08 |
| 44242.25533564815 | 34.041 |
| 44242.297002314815 | 33.926 |
| 44242.33866898149 | 34.119 |
| 44242.38033564815 | 34.698 |
| 44242.422002314815 | 35.914 |
| 44242.46366898149 | 36.126 |
| 44242.50533564815 | 37.748 |
| 44242.547002314815 | 38.945 |
| 44242.58866898149 | 38.81 |
| 44242.63033564815 | 38.211 |
| 44242.672002314815 | 37.497 |
| 44242.71366898149 | 36.358 |
| 44242.75533564815 | 35.663 |
| 44242.797002314815 | 35.142 |
| 44242.83866898149 | 34.929 |
| 44242.88033564815 | 34.833 |
| 44242.922002314815 | 34.794 |
| 44242.96366898149 | 34.717 |
| 44243.00533564815 | 34.775 |
| 44243.047002314815 | 34.794 |
| 44243.08866898149 | 34.505 |
| 44243.13033564815 | 34.389 |
| 44243.172002314815 | 34.447 |
| 44243.21366898149 | 34.35 |
| 44243.25533564815 | 34.254 |
| 44243.297002314815 | 34.119 |
| 44243.33866898149 | 34.119 |
| 44243.38033564815 | 34.756 |
| 44243.422002314815 | 35.895 |
| 44243.46366898149 | 36.995 |
| 44243.50533564815 | 37.207 |
| 44243.547002314815 | 37.053 |
| 44243.58866898149 | 36.937 |
| 44243.63033564815 | 36.705 |
| 44243.672002314815 | 36.358 |
| 44243.71366898149 | 35.76 |
| 44243.75533564815 | 35.084 |
| 44243.797002314815 | 34.775 |
| 44243.83866898149 | 34.794 |
| 44243.88033564815 | 34.794 |
| 44243.922002314815 | 34.563 |
| 44243.96366898149 | 34.35 |
| 44244.00533564815 | 34.138 |
| 44244.047002314815 | 34.119 |
| 44244.08866898149 | 34.061 |
| 44244.13033564815 | 34.061 |
| 44244.172002314815 | 34.061 |
| 44244.21366898149 | 34.119 |
| 44244.25533564815 | 34.041 |
| 44244.297002314815 | 34.041 |
| 44244.33866898149 | 34.176 |
| 44244.38033564815 | 34.736 |
| 44244.422002314815 | 35.914 |
| 44244.46366898149 | 37.169 |
| 44244.50533564815 | 38.038 |
| 44244.547002314815 | 37.787 |
| 44244.58866898149 | 37.014 |
| 44244.63033564815 | 36.339 |
| 44244.672002314815 | 36.068 |
| 44244.71366898149 | 35.663 |
| 44244.75533564815 | 35.084 |
| 44244.797002314815 | 34.64 |
| 44244.83866898149 | 34.408 |
| 44244.88033564815 | 34.273 |
| 44244.922002314815 | 34.312 |
| 44244.96366898149 | 34.273 |
| 44245.00533564815 | 34.312 |
| 44245.047002314815 | 34.35 |
| 44245.08866898149 | 34.37 |
| 44245.13033564815 | 34.427 |
| 44245.172002314815 | 34.447 |
| 44245.21366898149 | 34.408 |
| 44245.25533564815 | 34.234 |
| 44245.297002314815 | 34.003 |
| 44245.33866898149 | 34.215 |
| 44245.38033564815 | 34.756 |
| 44245.422002314815 | 35.914 |
| 44245.46366898149 | 37.053 |
| 44245.50533564815 | 37.767 |
| 44245.547002314815 | 36.802 |
| 44245.58866898149 | 36.339 |
| 44245.63033564815 | 36.068 |
| 44245.672002314815 | 36.107 |
| 44245.71366898149 | 35.509 |
| 44245.75533564815 | 34.698 |
| 44245.797002314815 | 34.408 |
| 44245.83866898149 | 34.196 |
| 44245.88033564815 | 34.119 |
| 44245.922002314815 | 34.022 |
| 44245.96366898149 | 33.926 |
| 44246.00533564815 | 33.713 |
| 44246.047002314815 | 33.617 |
| 44246.08866898149 | 33.578 |
| 44246.13033564815 | 33.52 |
| 44246.172002314815 | 33.752 |
| 44246.21366898149 | 33.964 |
| 44246.25533564815 | 34.138 |
| 44246.297002314815 | 34.215 |
| 44246.33866898149 | 34.427 |
| 44246.38033564815 | 34.968 |
| 44246.422002314815 | 35.47 |
| 44246.46366898149 | 35.991 |
| 44246.50533564815 | 36.493 |
| 44246.547002314815 | 37.014 |
| 44246.58866898149 | 37.149 |
| 44246.63033564815 | 37.014 |
| 44246.672002314815 | 36.551 |
| 44246.71366898149 | 36.03 |
| 44246.75533564815 | 35.528 |
| 44246.797002314815 | 35.393 |
| 44246.83866898149 | 35.277 |
| 44246.88033564815 | 35.277 |
| 44246.922002314815 | 35.2 |
| 44246.96366898149 | 34.949 |
| 44247.00533564815 | 34.929 |
| 44247.047002314815 | 34.891 |
| 44247.08866898149 | 34.775 |
| 44247.13033564815 | 34.698 |
| 44247.172002314815 | 34.717 |
| 44247.21366898149 | 34.64 |
| 44247.25533564815 | 34.775 |
| 44247.297002314815 | 34.987 |
| 44247.33866898149 | 35.354 |
| 44247.38033564815 | 36.068 |
| 44247.422002314815 | 37.497 |
| 44247.46366898149 | 38.404 |
| 44247.50533564815 | 38.964 |
| 44247.547002314815 | 39.331 |
| 44247.58866898149 | 39.177 |
| 44247.63033564815 | 38.675 |
| 44247.672002314815 | 37.98 |
| 44247.71366898149 | 36.763 |
| 44247.75533564815 | 34.563 |
| 44247.797002314815 | 33.675 |
| 44247.83866898149 | 33.945 |
| 44247.88033564815 | 34.35 |
| 44247.922002314815 | 34.524 |
| 44247.96366898149 | 34.524 |
| 44248.00533564815 | 34.234 |
| 44248.047002314815 | 33.983 |
| 44248.08866898149 | 34.041 |
| 44248.13033564815 | 33.926 |
| 44248.172002314815 | 33.752 |
| 44248.21366898149 | 33.848 |
| 44248.25533564815 | 33.964 |
| 44248.297002314815 | 33.983 |
| 44248.33866898149 | 34.003 |
| 44248.38033564815 | 34.524 |
| 44248.422002314815 | 35.451 |
| 44248.46366898149 | 35.972 |
| 44248.50533564815 | 36.956 |
| 44248.547002314815 | 36.242 |
| 44248.58866898149 | 36.648 |
| 44248.63033564815 | 36.223 |
| 44248.672002314815 | 35.624 |
| 44248.71366898149 | 35.103 |
| 44248.75533564815 | 34.929 |
| 44248.797002314815 | 34.814 |
| 44248.83866898149 | 34.852 |
| 44248.88033564815 | 34.717 |
| 44248.922002314815 | 34.582 |
| 44248.96366898149 | 34.505 |
| 44249.00533564815 | 34.563 |
| 44249.047002314815 | 34.717 |
| 44249.08866898149 | 34.736 |
| 44249.13033564815 | 34.833 |
| 44249.172002314815 | 34.871 |
| 44249.21366898149 | 34.929 |
| 44249.25533564815 | 34.949 |
| 44249.297002314815 | 35.026 |
| 44249.33866898149 | 35.2 |
| 44249.38033564815 | 35.547 |
| 44249.422002314815 | 36.879 |
| 44249.46366898149 | 38.636 |
| 44249.50533564815 | 40.045 |
| 44249.547002314815 | 40.567 |
| 44249.58866898149 | 40.354 |
| 44249.63033564815 | 39.563 |
| 44249.672002314815 | 38.288 |
| 44249.71366898149 | 36.86 |
| 44249.75533564815 | 35.875 |
| 44249.797002314815 | 35.335 |
| 44249.83866898149 | 35.084 |
| 44249.88033564815 | 34.833 |
| 44249.922002314815 | 34.678 |
| 44249.96366898149 | 34.505 |
| 44250.00533564815 | 34.408 |
| 44250.047002314815 | 34.389 |
| 44250.08866898149 | 34.292 |
| 44250.13033564815 | 34.157 |
| 44250.172002314815 | 34.041 |
| 44250.21366898149 | 34.041 |
| 44250.25533564815 | 34.099 |
| 44250.297002314815 | 34.234 |
| 44250.33866898149 | 34.447 |
| 44250.38033564815 | 35.2 |
| 44250.422002314815 | 36.995 |
| 44250.46366898149 | 38.694 |
| 44250.50533564815 | 40.103 |
| 44250.547002314815 | 40.779 |
| 44250.58866898149 | 40.817 |
| 44250.63033564815 | 39.968 |
| 44250.672002314815 | 38.636 |
| 44250.71366898149 | 37.227 |
| 44250.75533564815 | 36.01 |
| 44250.797002314815 | 35.161 |
| 44250.83866898149 | 34.833 |
| 44250.88033564815 | 34.717 |
| 44250.922002314815 | 34.678 |
| 44250.96366898149 | 34.717 |
| 44251.00533564815 | 34.756 |
| 44251.047002314815 | 34.505 |
| 44251.08866898149 | 34.234 |
| 44251.13033564815 | 34.003 |
| 44251.172002314815 | 33.868 |
| 44251.21366898149 | 33.868 |
| 44251.25533564815 | 33.906 |
| 44251.297002314815 | 33.81 |
| 44251.33866898149 | 33.829 |
| 44251.38033564815 | 34.485 |
| 44251.422002314815 | 36.281 |
| 44251.46366898149 | 37.864 |
| 44251.50533564815 | 39.234 |
| 44251.547002314815 | 39.736 |
| 44251.58866898149 | 39.794 |
| 44251.63033564815 | 39.119 |
| 44251.672002314815 | 37.806 |
| 44251.71366898149 | 36.474 |
| 44251.75533564815 | 35.354 |
| 44251.797002314815 | 34.756 |
| 44251.83866898149 | 34.736 |
| 44251.88033564815 | 34.91 |
| 44251.922002314815 | 34.543 |
| 44251.96366898149 | 34.157 |
| 44252.00533564815 | 33.926 |
| 44252.047002314815 | 34.215 |
| 44252.08866898149 | 34.621 |
| 44252.13033564815 | 34.582 |
| 44252.172002314815 | 34.601 |
| 44252.21366898149 | 34.64 |
| 44252.25533564815 | 34.524 |
| 44252.297002314815 | 34.292 |
| 44252.33866898149 | 34.35 |
| 44252.38033564815 | 34.852 |
| 44252.422002314815 | 36.261 |
| 44252.46366898149 | 37.941 |
| 44252.50533564815 | 39.196 |
| 44252.547002314815 | 39.852 |
| 44252.58866898149 | 39.891 |
| 44252.63033564815 | 38.964 |
| 44252.672002314815 | 37.69 |
| 44252.71366898149 | 36.435 |
| 44252.75533564815 | 35.412 |
| 44252.797002314815 | 34.775 |
| 44252.83866898149 | 34.524 |
| 44252.88033564815 | 34.234 |
| 44252.922002314815 | 34.099 |
| 44252.96366898149 | 33.983 |
| 44253.00533564815 | 33.906 |
| 44253.047002314815 | 33.81 |
| 44253.08866898149 | 33.771 |
| 44253.13033564815 | 33.636 |
| 44253.172002314815 | 33.617 |
| 44253.21366898149 | 33.713 |
| 44253.25533564815 | 33.771 |
| 44253.297002314815 | 33.829 |
| 44253.33866898149 | 33.926 |
| 44253.38033564815 | 34.215 |
| 44253.422002314815 | 35.373 |
| 44253.46366898149 | 36.841 |
| 44253.50533564815 | 38.211 |
| 44253.547002314815 | 38.926 |
| 44253.58866898149 | 39.003 |
| 44253.63033564815 | 37.536 |
| 44253.672002314815 | 36.358 |
| 44253.71366898149 | 35.663 |
| 44253.75533564815 | 35.258 |
| 44253.797002314815 | 35.122 |
| 44253.83866898149 | 35.045 |
| 44253.88033564815 | 35.084 |
| 44253.922002314815 | 35.142 |
| 44253.96366898149 | 35.161 |
| 44254.00533564815 | 35.122 |
| 44254.047002314815 | 35.065 |
| 44254.08866898149 | 34.891 |
| 44254.13033564815 | 34.775 |
| 44254.172002314815 | 34.698 |
| 44254.21366898149 | 34.775 |
| 44254.25533564815 | 34.91 |
| 44254.297002314815 | 34.852 |
| 44254.33866898149 | 34.949 |
| 44254.38033564815 | 34.408 |
| 44254.422002314815 | 34.331 |
| 44254.46366898149 | 34.717 |
| 44254.50533564815 | 35.412 |
| 44254.547002314815 | 35.972 |
| 44254.58866898149 | 36.628 |
| 44254.63033564815 | 36.918 |
| 44254.672002314815 | 36.609 |
| 44254.71366898149 | 35.837 |
| 44254.75533564815 | 34.987 |
| 44254.797002314815 | 34.427 |
| 44254.83866898149 | 34.312 |
| 44254.88033564815 | 34.157 |
| 44254.922002314815 | 33.983 |
| 44254.96366898149 | 33.79 |
| 44255.00533564815 | 33.617 |
| 44255.047002314815 | 33.462 |
| 44255.08866898149 | 33.346 |
| 44255.13033564815 | 33.288 |
| 44255.172002314815 | 33.095 |
| 44255.21366898149 | 33.018 |
| 44255.25533564815 | 33.095 |
| 44255.297002314815 | 33.269 |
| 44255.33866898149 | 33.482 |
| 44255.38033564815 | 34.003 |
| 44255.422002314815 | 35.431 |
| 44255.46366898149 | 37.169 |
| 44255.50533564815 | 38.617 |
| 44255.547002314815 | 39.177 |
| 44255.58866898149 | 39.099 |
| 44255.63033564815 | 38.327 |
| 44255.672002314815 | 37.188 |
| 44255.71366898149 | 35.914 |
| 44255.75533564815 | 34.814 |
| 44255.797002314815 | 34.157 |
| 44255.83866898149 | 33.926 |
| 44255.88033564815 | 33.694 |
| 44255.922002314815 | 33.482 |
| 44255.96366898149 | 33.366 |
| 44256.00533564815 | 33.211 |
| 44256.047002314815 | 33.095 |
| 44256.08866898149 | 33.057 |
| 44256.13033564815 | 32.98 |
| 44256.172002314815 | 32.941 |
| 44256.21366898149 | 32.883 |
| 44256.25533564815 | 32.883 |
| 44256.297002314815 | 32.806 |
| 44256.33866898149 | 32.883 |
| 44256.38033564815 | 33.462 |
| 44256.422002314815 | 35.084 |
| 44256.46366898149 | 37.169 |
| 44256.50533564815 | 38.848 |
| 44256.547002314815 | 39.621 |
| 44256.58866898149 | 39.563 |
| 44256.63033564815 | 39.003 |
| 44256.672002314815 | 37.806 |
| 44256.71366898149 | 36.512 |
| 44256.75533564815 | 35.528 |
| 44256.797002314815 | 34.891 |
| 44256.83866898149 | 34.563 |
| 44256.88033564815 | 34.292 |
| 44256.922002314815 | 34.08 |
| 44256.96366898149 | 33.848 |
| 44257.00533564815 | 33.771 |
| 44257.047002314815 | 33.694 |
| 44257.08866898149 | 33.655 |
| 44257.13033564815 | 33.597 |
| 44257.172002314815 | 33.462 |
| 44257.21366898149 | 33.443 |
| 44257.25533564815 | 33.346 |
| 44257.297002314815 | 33.308 |
| 44257.33866898149 | 33.366 |
| 44257.38033564815 | 33.906 |
| 44257.422002314815 | 35.779 |
| 44257.46366898149 | 37.902 |
| 44257.50533564815 | 39.563 |
| 44257.547002314815 | 40.258 |
| 44257.58866898149 | 40.335 |
| 44257.63033564815 | 39.563 |
| 44257.672002314815 | 38.173 |
| 44257.71366898149 | 36.976 |
| 44257.75533564815 | 35.875 |
| 44257.797002314815 | 35.2 |
| 44257.83866898149 | 34.833 |
| 44257.88033564815 | 34.582 |
| 44257.922002314815 | 34.389 |
| 44257.96366898149 | 34.119 |
| 44258.00533564815 | 33.964 |
| 44258.047002314815 | 33.848 |
| 44258.08866898149 | 33.79 |
| 44258.13033564815 | 33.771 |
| 44258.172002314815 | 33.694 |
| 44258.21366898149 | 33.655 |
| 44258.25533564815 | 33.597 |
| 44258.297002314815 | 33.482 |
| 44258.33866898149 | 33.559 |
| 44258.38033564815 | 34.408 |
| 44258.422002314815 | 36.397 |
| 44258.46366898149 | 38.385 |
| 44258.50533564815 | 40.142 |
| 44258.547002314815 | 40.991 |
| 44258.58866898149 | 40.817 |
| 44258.63033564815 | 39.968 |
| 44258.672002314815 | 38.597 |
| 44258.71366898149 | 37.169 |
| 44258.75533564815 | 36.088 |
| 44258.797002314815 | 35.393 |
| 44258.83866898149 | 34.987 |
| 44258.88033564815 | 34.698 |
| 44258.922002314815 | 34.524 |
| 44258.96366898149 | 34.37 |
| 44259.00533564815 | 34.331 |
| 44259.047002314815 | 34.215 |
| 44259.08866898149 | 34.234 |
| 44259.13033564815 | 34.254 |
| 44259.172002314815 | 34.254 |
| 44259.21366898149 | 34.408 |
| 44259.25533564815 | 34.833 |
| 44259.297002314815 | 35.142 |
| 44259.33866898149 | 34.949 |
| 44259.38033564815 | 35.2 |
| 44259.422002314815 | 35.76 |
| 44259.46366898149 | 36.435 |
| 44259.50533564815 | 36.937 |
| 44259.547002314815 | 37.381 |
| 44259.58866898149 | 37.516 |
| 44259.63033564815 | 36.937 |
| 44259.672002314815 | 36.435 |
| 44259.71366898149 | 35.837 |
| 44259.75533564815 | 35.161 |
| 44259.797002314815 | 35.045 |
| 44259.83866898149 | 35.142 |
| 44259.88033564815 | 35.122 |
| 44259.922002314815 | 35.084 |
| 44259.96366898149 | 35.084 |
| 44260.00533564815 | 34.949 |
| 44260.047002314815 | 34.871 |
| 44260.08866898149 | 34.621 |
| 44260.13033564815 | 34.427 |
| 44260.172002314815 | 34.196 |
| 44260.21366898149 | 34.119 |
| 44260.25533564815 | 34.061 |
| 44260.297002314815 | 33.945 |
| 44260.33866898149 | 33.945 |
| 44260.38033564815 | 34.601 |
| 44260.422002314815 | 36.512 |
| 44260.46366898149 | 38.597 |
| 44260.50533564815 | 40.277 |
| 44260.547002314815 | 41.126 |
| 44260.58866898149 | 41.088 |
| 44260.63033564815 | 40.277 |
| 44260.672002314815 | 38.733 |
| 44260.71366898149 | 37.458 |
| 44260.75533564815 | 36.358 |
| 44260.797002314815 | 35.586 |
| 44260.83866898149 | 35.2 |
| 44260.88033564815 | 34.852 |
| 44260.922002314815 | 34.64 |
| 44260.96366898149 | 34.447 |
| 44261.00533564815 | 34.312 |
| 44261.047002314815 | 34.176 |
| 44261.08866898149 | 34.041 |
| 44261.13033564815 | 34.003 |
| 44261.172002314815 | 33.926 |
| 44261.21366898149 | 33.81 |
| 44261.25533564815 | 33.732 |
| 44261.297002314815 | 33.694 |
| 44261.33866898149 | 33.848 |
| 44261.38033564815 | 34.794 |
| 44261.422002314815 | 36.551 |
| 44261.46366898149 | 38.617 |
| 44261.50533564815 | 40.219 |
| 44261.547002314815 | 41.049 |
| 44261.58866898149 | 41.223 |
| 44261.63033564815 | 40.2 |
| 44261.672002314815 | 38.926 |
| 44261.71366898149 | 37.613 |
| 44261.75533564815 | 36.551 |
| 44261.797002314815 | 35.837 |
| 44261.83866898149 | 35.354 |
| 44261.88033564815 | 35.007 |
| 44261.922002314815 | 34.736 |
| 44261.96366898149 | 34.601 |
| 44262.00533564815 | 34.408 |
| 44262.047002314815 | 34.292 |
| 44262.08866898149 | 34.215 |
| 44262.13033564815 | 34.138 |
| 44262.172002314815 | 34.157 |
| 44262.21366898149 | 34.08 |
| 44262.25533564815 | 34.061 |
| 44262.297002314815 | 34.08 |
| 44262.33866898149 | 34.331 |
| 44262.38033564815 | 35.296 |
| 44262.422002314815 | 37.323 |
| 44262.46366898149 | 39.273 |
| 44262.50533564815 | 40.624 |
| 44262.547002314815 | 40.605 |
| 44262.58866898149 | 40.779 |
| 44262.63033564815 | 40.509 |
| 44262.672002314815 | 39.466 |
| 44262.71366898149 | 38.211 |
| 44262.75533564815 | 37.034 |
| 44262.797002314815 | 36.107 |
| 44262.83866898149 | 35.566 |
| 44262.88033564815 | 35.315 |
| 44262.922002314815 | 35.122 |
| 44262.96366898149 | 34.949 |
| 44263.00533564815 | 34.814 |
| 44263.047002314815 | 34.678 |
| 44263.08866898149 | 34.524 |
| 44263.13033564815 | 34.485 |
| 44263.172002314815 | 34.427 |
| 44263.21366898149 | 34.524 |
| 44263.25533564815 | 34.543 |
| 44263.297002314815 | 34.524 |
| 44263.33866898149 | 34.794 |
| 44263.38033564815 | 35.354 |
| 44263.422002314815 | 36.551 |
| 44263.46366898149 | 38.597 |
| 44263.50533564815 | 39.717 |
| 44263.547002314815 | 39.621 |
| 44263.58866898149 | 39.987 |
| 44263.63033564815 | 39.949 |
| 44263.672002314815 | 39.428 |
| 44263.71366898149 | 38.443 |
| 44263.75533564815 | 37.362 |
| 44263.797002314815 | 36.261 |
| 44263.83866898149 | 35.547 |
| 44263.88033564815 | 35.258 |
| 44263.922002314815 | 35.084 |
| 44263.96366898149 | 35.007 |
| 44264.00533564815 | 34.929 |
| 44264.047002314815 | 34.852 |
| 44264.08866898149 | 34.852 |
| 44264.13033564815 | 34.833 |
| 44264.172002314815 | 34.775 |
| 44264.21366898149 | 34.717 |
| 44264.25533564815 | 34.601 |
| 44264.297002314815 | 34.621 |
| 44264.33866898149 | 34.833 |
| 44264.38033564815 | 35.605 |
| 44264.422002314815 | 37.574 |
| 44264.46366898149 | 39.505 |
| 44264.50533564815 | 40.644 |
| 44264.547002314815 | 41.532 |
| 44264.58866898149 | 41.416 |
| 44264.63033564815 | 39.968 |
| 44264.672002314815 | 38.694 |
| 44264.71366898149 | 37.632 |
| 44264.75533564815 | 36.879 |
| 44264.797002314815 | 36.242 |
| 44264.83866898149 | 35.817 |
| 44264.88033564815 | 35.489 |
| 44264.922002314815 | 35.354 |
| 44264.96366898149 | 35.238 |
| 44265.00533564815 | 35.277 |
| 44265.047002314815 | 35.47 |
| 44265.08866898149 | 34.756 |
| 44265.13033564815 | 34.505 |
| 44265.172002314815 | 34.968 |
| 44265.21366898149 | 34.891 |
| 44265.25533564815 | 34.698 |
| 44265.297002314815 | 34.408 |
| 44265.33866898149 | 34.601 |
| 44265.38033564815 | 34.987 |
| 44265.422002314815 | 35.451 |
| 44265.46366898149 | 37.092 |
| 44265.50533564815 | 39.563 |
| 44265.547002314815 | 39.485 |
| 44265.58866898149 | 38.52 |
| 44265.63033564815 | 37.536 |
| 44265.672002314815 | 36.956 |
| 44265.71366898149 | 35.972 |
| 44265.75533564815 | 35.315 |
| 44265.797002314815 | 34.852 |
| 44265.83866898149 | 34.563 |
| 44265.88033564815 | 34.331 |
| 44265.922002314815 | 34.138 |
| 44265.96366898149 | 34.041 |
| 44266.00533564815 | 33.868 |
| 44266.047002314815 | 33.713 |
| 44266.08866898149 | 33.597 |
| 44266.13033564815 | 33.462 |
| 44266.172002314815 | 33.346 |
| 44266.21366898149 | 33.269 |
| 44266.25533564815 | 33.211 |
| 44266.297002314815 | 33.25 |
| 44266.33866898149 | 33.52 |
| 44266.38033564815 | 34.582 |
| 44266.422002314815 | 36.609 |
| 44266.46366898149 | 37.941 |
| 44266.50533564815 | 37.864 |
| 44266.547002314815 | 38.231 |
| 44266.58866898149 | 38.134 |
| 44266.63033564815 | 38.095 |
| 44266.672002314815 | 37.787 |
| 44266.71366898149 | 36.763 |
| 44266.75533564815 | 35.566 |
| 44266.797002314815 | 34.987 |
| 44266.83866898149 | 34.775 |
| 44266.88033564815 | 34.698 |
| 44266.922002314815 | 34.659 |
| 44266.96366898149 | 34.717 |
| 44267.00533564815 | 34.794 |
| 44267.047002314815 | 34.659 |
| 44267.08866898149 | 34.389 |
| 44267.13033564815 | 34.292 |
| 44267.172002314815 | 34.215 |
| 44267.21366898149 | 34.176 |
| 44267.25533564815 | 34.022 |
| 44267.297002314815 | 33.887 |
| 44267.33866898149 | 34.176 |
| 44267.38033564815 | 35.084 |
| 44267.422002314815 | 37.207 |
| 44267.46366898149 | 39.215 |
| 44267.50533564815 | 40.547 |
| 44267.547002314815 | 41.281 |
| 44267.58866898149 | 40.953 |
| 44267.63033564815 | 39.929 |
| 44267.672002314815 | 38.752 |
| 44267.71366898149 | 37.323 |
| 44267.75533564815 | 36.261 |
| 44267.797002314815 | 35.47 |
| 44267.83866898149 | 35.103 |
| 44267.88033564815 | 34.968 |
| 44267.922002314815 | 34.794 |
| 44267.96366898149 | 34.814 |
| 44268.00533564815 | 34.814 |
| 44268.047002314815 | 34.698 |
| 44268.08866898149 | 34.524 |
| 44268.13033564815 | 34.524 |
| 44268.172002314815 | 34.775 |
| 44268.21366898149 | 34.929 |
| 44268.25533564815 | 34.929 |
| 44268.297002314815 | 34.987 |
| 44268.33866898149 | 35.354 |
| 44268.38033564815 | 35.875 |
| 44268.422002314815 | 37.362 |
| 44268.46366898149 | 38.288 |
| 44268.50533564815 | 38.288 |
| 44268.547002314815 | 38.231 |
| 44268.58866898149 | 37.246 |
| 44268.63033564815 | 36.474 |
| 44268.672002314815 | 36.416 |
| 44268.71366898149 | 36.455 |
| 44268.75533564815 | 35.991 |
| 44268.797002314815 | 35.47 |
| 44268.83866898149 | 35.2 |
| 44268.88033564815 | 35.103 |
| 44268.922002314815 | 35.142 |
| 44268.96366898149 | 34.929 |
| 44269.00533564815 | 34.64 |
| 44269.047002314815 | 34.775 |
| 44269.13033564815 | 34.756 |
| 44269.172002314815 | 34.833 |
| 44269.21366898149 | 34.852 |
| 44269.25533564815 | 34.698 |
| 44269.297002314815 | 34.543 |
| 44269.33866898149 | 34.292 |
| 44269.38033564815 | 34.061 |
| 44269.422002314815 | 34.408 |
| 44269.46366898149 | 35.122 |
| 44269.50533564815 | 35.47 |
| 44269.547002314815 | 36.165 |
| 44269.58866898149 | 36.435 |
| 44269.63033564815 | 36.512 |
| 44269.672002314815 | 36.956 |
| 44269.71366898149 | 36.667 |
| 44269.75533564815 | 35.663 |
| 44269.797002314815 | 34.987 |
| 44269.83866898149 | 34.543 |
| 44269.88033564815 | 34.35 |
| 44269.922002314815 | 34.408 |
| 44269.96366898149 | 34.427 |
| 44270.00533564815 | 34.427 |
| 44270.047002314815 | 34.312 |
| 44270.08866898149 | 34.254 |
| 44270.13033564815 | 34.157 |
| 44270.172002314815 | 34.022 |
| 44270.21366898149 | 34.061 |
| 44270.25533564815 | 34.215 |
| 44270.297002314815 | 34.099 |
| 44270.33866898149 | 34.119 |
| 44270.38033564815 | 34.389 |
| 44270.422002314815 | 34.987 |
| 44270.46366898149 | 35.682 |
| 44270.50533564815 | 37.092 |
| 44270.547002314815 | 37.96 |
| 44270.58866898149 | 38.346 |
| 44270.63033564815 | 38.192 |
| 44270.672002314815 | 37.632 |
| 44270.71366898149 | 37.381 |
| 44270.75533564815 | 37.053 |
| 44270.797002314815 | 36.474 |
| 44270.83866898149 | 36.049 |
| 44270.88033564815 | 35.856 |
| 44270.922002314815 | 35.702 |
| 44270.96366898149 | 35.431 |
| 44271.00533564815 | 35.18 |
| 44271.047002314815 | 35.065 |
| 44271.08866898149 | 34.91 |
| 44271.13033564815 | 34.736 |
| 44271.172002314815 | 34.64 |
| 44271.21366898149 | 34.659 |
| 44271.25533564815 | 34.736 |
| 44271.297002314815 | 34.524 |
| 44271.33866898149 | 34.563 |
| 44271.38033564815 | 34.949 |
| 44271.422002314815 | 35.817 |
| 44271.46366898149 | 37.555 |
| 44271.50533564815 | 38.424 |
| 44271.547002314815 | 39.678 |
| 44271.58866898149 | 38.926 |
| 44271.63033564815 | 38.443 |
| 44271.672002314815 | 37.729 |
| 44271.71366898149 | 36.223 |
| 44271.75533564815 | 35.74 |
| 44271.797002314815 | 35.933 |
| 44271.83866898149 | 35.74 |
| 44271.88033564815 | 35.528 |
| 44271.922002314815 | 35.489 |
| 44271.96366898149 | 35.47 |
| 44272.00533564815 | 35.373 |
| 44272.047002314815 | 35.18 |
| 44272.08866898149 | 35.103 |
| 44272.13033564815 | 35.122 |
| 44272.172002314815 | 35.065 |
| 44272.21366898149 | 34.987 |
| 44272.25533564815 | 34.929 |
| 44272.297002314815 | 34.968 |
| 44272.33866898149 | 34.929 |
| 44272.38033564815 | 35.065 |
| 44272.422002314815 | 35.431 |
| 44272.46366898149 | 36.512 |
| 44272.50533564815 | 38.366 |
| 44272.547002314815 | 39.891 |
| 44272.58866898149 | 41.03 |
| 44272.63033564815 | 41.242 |
| 44272.672002314815 | 40.393 |
| 44272.71366898149 | 39.003 |
| 44272.75533564815 | 37.613 |
| 44272.797002314815 | 36.3 |
| 44272.83866898149 | 35.489 |
| 44272.88033564815 | 35.161 |
| 44272.922002314815 | 34.852 |
| 44272.96366898149 | 34.505 |
| 44273.00533564815 | 34.292 |
| 44273.047002314815 | 34.234 |
| 44273.08866898149 | 34.196 |
| 44273.13033564815 | 34.099 |
| 44273.172002314815 | 34.041 |
| 44273.21366898149 | 34.022 |
| 44273.25533564815 | 33.868 |
| 44273.297002314815 | 33.771 |
| 44273.33866898149 | 33.732 |
| 44273.38033564815 | 34.003 |
| 44273.422002314815 | 35.084 |
| 44273.46366898149 | 37.188 |
| 44273.50533564815 | 39.447 |
| 44273.547002314815 | 41.03 |
| 44273.58866898149 | 41.821 |
| 44273.63033564815 | 41.86 |
| 44273.672002314815 | 41.146 |
| 44273.71366898149 | 39.756 |
| 44273.75533564815 | 38.52 |
| 44273.797002314815 | 37.343 |
| 44273.83866898149 | 36.319 |
| 44273.88033564815 | 35.953 |
| 44273.922002314815 | 35.76 |
| 44273.96366898149 | 35.489 |
| 44274.00533564815 | 35.238 |
| 44274.047002314815 | 35.065 |
| 44274.08866898149 | 34.929 |
| 44274.13033564815 | 34.736 |
| 44274.172002314815 | 34.582 |
| 44274.21366898149 | 34.485 |
| 44274.25533564815 | 34.427 |
| 44274.297002314815 | 34.447 |
| 44274.33866898149 | 34.563 |
| 44274.38033564815 | 34.891 |
| 44274.422002314815 | 35.605 |
| 44274.46366898149 | 37.458 |
| 44274.50533564815 | 39.736 |
| 44274.547002314815 | 41.686 |
| 44274.58866898149 | 42.651 |
| 44274.63033564815 | 42.632 |
| 44274.672002314815 | 41.686 |
| 44274.71366898149 | 40.354 |
| 44274.75533564815 | 38.829 |
| 44274.797002314815 | 37.536 |
| 44274.83866898149 | 36.474 |
| 44274.88033564815 | 35.991 |
| 44274.922002314815 | 35.624 |
| 44274.96366898149 | 35.412 |
| 44275.00533564815 | 35.335 |
| 44275.047002314815 | 35.219 |
| 44275.08866898149 | 35.065 |
| 44275.13033564815 | 34.987 |
| 44275.172002314815 | 34.833 |
| 44275.21366898149 | 34.814 |
| 44275.25533564815 | 34.756 |
| 44275.297002314815 | 34.756 |
| 44275.33866898149 | 34.717 |
| 44275.38033564815 | 35.065 |
| 44275.422002314815 | 36.261 |
| 44275.46366898149 | 38.385 |
| 44275.50533564815 | 40.586 |
| 44275.547002314815 | 41.667 |
| 44275.58866898149 | 41.821 |
| 44275.63033564815 | 41.879 |
| 44275.672002314815 | 41.261 |
| 44275.71366898149 | 40.007 |
| 44275.75533564815 | 38.52 |
| 44275.797002314815 | 37.304 |
| 44275.83866898149 | 36.319 |
| 44275.88033564815 | 35.875 |
| 44275.922002314815 | 35.702 |
| 44275.96366898149 | 35.779 |
| 44276.00533564815 | 35.76 |
| 44276.047002314815 | 35.721 |
| 44276.08866898149 | 34.756 |
| 44276.13033564815 | 33.848 |
| 44276.172002314815 | 34.254 |
| 44276.21366898149 | 35.122 |
| 44276.25533564815 | 35.296 |
| 44276.297002314815 | 35.2 |
| 44276.33866898149 | 35.2 |
| 44276.38033564815 | 35.431 |
| 44276.422002314815 | 36.493 |
| 44276.46366898149 | 37.729 |
| 44276.50533564815 | 38.733 |
| 44276.547002314815 | 38.983 |
| 44276.58866898149 | 38.578 |
| 44276.63033564815 | 38.771 |
| 44276.672002314815 | 38.153 |
| 44276.71366898149 | 37.594 |
| 44276.75533564815 | 37.014 |
| 44276.797002314815 | 36.377 |
| 44276.83866898149 | 35.837 |
| 44276.88033564815 | 35.489 |
| 44276.922002314815 | 35.18 |
| 44276.96366898149 | 35.161 |
| 44277.00533564815 | 35.161 |
| 44277.047002314815 | 35.065 |
| 44277.08866898149 | 34.678 |
| 44277.13033564815 | 34.427 |
| 44277.172002314815 | 34.582 |
| 44277.21366898149 | 34.736 |
| 44277.25533564815 | 34.621 |
| 44277.297002314815 | 34.833 |
| 44277.33866898149 | 35.161 |
| 44277.38033564815 | 35.663 |
| 44277.422002314815 | 36.551 |
| 44277.46366898149 | 38.346 |
| 44277.50533564815 | 40.2 |
| 44277.547002314815 | 41.86 |
| 44277.58866898149 | 41.937 |
| 44277.63033564815 | 41.783 |
| 44277.672002314815 | 40.296 |
| 44277.71366898149 | 38.906 |
| 44277.75533564815 | 37.729 |
| 44277.797002314815 | 36.86 |
| 44277.83866898149 | 36.165 |
| 44277.88033564815 | 35.624 |
| 44277.922002314815 | 35.354 |
| 44277.96366898149 | 35.277 |
| 44278.00533564815 | 35.238 |
| 44278.047002314815 | 35.122 |
| 44278.08866898149 | 34.91 |
| 44278.13033564815 | 34.601 |
| 44278.172002314815 | 34.408 |
| 44278.21366898149 | 34.234 |
| 44278.25533564815 | 34.234 |
| 44278.297002314815 | 34.35 |
| 44278.33866898149 | 34.485 |
| 44278.38033564815 | 34.833 |
| 44278.422002314815 | 35.895 |
| 44278.46366898149 | 37.014 |
| 44278.50533564815 | 37.729 |
| 44278.547002314815 | 38.424 |
| 44278.58866898149 | 39.794 |
| 44278.63033564815 | 39.543 |
| 44278.672002314815 | 38.771 |
| 44278.71366898149 | 37.806 |
| 44278.75533564815 | 37.072 |
| 44278.797002314815 | 36.242 |
| 44278.83866898149 | 35.431 |
| 44278.88033564815 | 34.987 |
| 44278.922002314815 | 34.814 |
| 44278.96366898149 | 34.717 |
| 44279.00533564815 | 34.659 |
| 44279.047002314815 | 34.756 |
| 44279.08866898149 | 34.814 |
| 44279.13033564815 | 34.736 |
| 44279.172002314815 | 34.601 |
| 44279.21366898149 | 34.543 |
| 44279.25533564815 | 34.485 |
| 44279.297002314815 | 34.466 |
| 44279.33866898149 | 34.601 |
| 44279.38033564815 | 34.968 |
| 44279.422002314815 | 35.837 |
| 44279.46366898149 | 37.555 |
| 44279.50533564815 | 39.698 |
| 44279.547002314815 | 39.659 |
| 44279.58866898149 | 39.447 |
| 44279.63033564815 | 38.926 |
| 44279.672002314815 | 38.694 |
| 44279.71366898149 | 38.038 |
| 44279.75533564815 | 37.072 |
| 44279.797002314815 | 36.3 |
| 44279.83866898149 | 35.624 |
| 44279.88033564815 | 35.296 |
| 44279.922002314815 | 35.238 |
| 44279.96366898149 | 35.084 |
| 44280.00533564815 | 34.891 |
| 44280.047002314815 | 34.929 |
| 44280.08866898149 | 35.007 |
| 44280.13033564815 | 34.949 |
| 44280.172002314815 | 34.891 |
| 44280.21366898149 | 34.871 |
| 44280.25533564815 | 34.833 |
| 44280.297002314815 | 34.698 |
| 44280.33866898149 | 34.717 |
| 44280.38033564815 | 35.065 |
| 44280.422002314815 | 35.76 |
| 44280.46366898149 | 37.014 |
| 44280.50533564815 | 37.69 |
| 44280.547002314815 | 38.057 |
| 44280.58866898149 | 38.829 |
| 44280.63033564815 | 39.466 |
| 44280.672002314815 | 39.254 |
| 44280.71366898149 | 38.385 |
| 44280.75533564815 | 37.381 |
| 44280.797002314815 | 36.455 |
| 44280.83866898149 | 35.663 |
| 44280.88033564815 | 35.412 |
| 44280.922002314815 | 35.335 |
| 44280.96366898149 | 35.296 |
| 44281.00533564815 | 35.103 |
| 44281.047002314815 | 35.065 |
| 44281.08866898149 | 35.007 |
| 44281.13033564815 | 34.833 |
| 44281.172002314815 | 34.563 |
| 44281.21366898149 | 34.408 |
| 44281.25533564815 | 34.408 |
| 44281.297002314815 | 34.427 |
| 44281.33866898149 | 34.485 |
| 44281.38033564815 | 35.026 |
| 44281.422002314815 | 35.972 |
| 44281.46366898149 | 37.207 |
| 44281.50533564815 | 38.617 |
| 44281.547002314815 | 39.312 |
| 44281.58866898149 | 38.81 |
| 44281.63033564815 | 38.617 |
| 44281.672002314815 | 38.829 |
| 44281.71366898149 | 37.98 |
| 44281.75533564815 | 36.937 |
| 44281.797002314815 | 36.126 |
| 44281.83866898149 | 35.528 |
| 44281.88033564815 | 35.161 |
| 44281.922002314815 | 35.122 |
| 44281.96366898149 | 35.007 |
| 44282.00533564815 | 34.891 |
| 44282.047002314815 | 34.891 |
| 44282.08866898149 | 34.852 |
| 44282.13033564815 | 34.736 |
| 44282.172002314815 | 34.485 |
| 44282.21366898149 | 34.273 |
| 44282.25533564815 | 34.176 |
| 44282.297002314815 | 34.08 |
| 44282.33866898149 | 34.157 |
| 44282.38033564815 | 34.891 |
| 44282.422002314815 | 36.165 |
| 44282.46366898149 | 37.864 |
| 44282.50533564815 | 39.717 |
| 44282.547002314815 | 40.702 |
| 44282.58866898149 | 40.817 |
| 44282.63033564815 | 40.18 |
| 44282.672002314815 | 38.983 |
| 44282.71366898149 | 37.729 |
| 44282.75533564815 | 36.802 |
| 44282.797002314815 | 35.914 |
| 44282.83866898149 | 35.373 |
| 44282.88033564815 | 35.007 |
| 44282.922002314815 | 34.833 |
| 44282.96366898149 | 34.64 |
| 44283.00533564815 | 34.389 |
| 44283.047002314815 | 34.215 |
| 44283.08866898149 | 34.157 |
| 44283.13033564815 | 34.138 |
| 44283.172002314815 | 34.041 |
| 44283.21366898149 | 34.041 |
| 44283.25533564815 | 34.003 |
| 44283.297002314815 | 34.003 |
| 44283.33866898149 | 34.119 |
| 44283.38033564815 | 34.485 |
| 44283.422002314815 | 35.837 |
| 44283.46366898149 | 38.115 |
| 44283.50533564815 | 40.161 |
| 44283.547002314815 | 41.686 |
| 44283.58866898149 | 42.439 |
| 44283.63033564815 | 42.555 |
| 44283.672002314815 | 41.821 |
| 44283.71366898149 | 40.528 |
| 44283.75533564815 | 39.003 |
| 44283.797002314815 | 37.574 |
| 44283.83866898149 | 36.397 |
| 44283.88033564815 | 35.76 |
| 44283.922002314815 | 35.431 |
| 44283.96366898149 | 35.2 |
| 44284.00533564815 | 34.929 |
| 44284.047002314815 | 34.756 |
| 44284.08866898149 | 34.524 |
| 44284.13033564815 | 34.408 |
| 44284.172002314815 | 34.254 |
| 44284.21366898149 | 34.157 |
| 44284.25533564815 | 34.273 |
| 44284.297002314815 | 34.215 |
| 44284.33866898149 | 34.35 |
| 44284.38033564815 | 34.949 |
| 44284.422002314815 | 36.319 |
| 44284.46366898149 | 38.539 |
| 44284.50533564815 | 40.702 |
| 44284.547002314815 | 42.246 |
| 44284.58866898149 | 43.038 |
| 44284.63033564815 | 42.902 |
| 44284.672002314815 | 41.899 |
| 44284.71366898149 | 40.335 |
| 44284.75533564815 | 38.752 |
| 44284.797002314815 | 37.4 |
| 44284.83866898149 | 36.474 |
| 44284.88033564815 | 35.837 |
| 44284.922002314815 | 35.161 |
| 44284.96366898149 | 34.447 |
| 44285.00533564815 | 34.138 |
| 44285.047002314815 | 34.08 |
| 44285.08866898149 | 33.732 |
| 44285.13033564815 | 33.578 |
| 44285.172002314815 | 33.597 |
| 44285.21366898149 | 33.482 |
| 44285.25533564815 | 33.501 |
| 44285.297002314815 | 33.597 |
| 44285.33866898149 | 33.848 |
| 44285.38033564815 | 34.331 |
| 44285.422002314815 | 35.2 |
| 44285.46366898149 | 36.705 |
| 44285.50533564815 | 38.501 |
| 44285.547002314815 | 39.678 |
| 44285.58866898149 | 40.837 |
| 44285.63033564815 | 40.76 |
| 44285.672002314815 | 40.605 |
| 44285.71366898149 | 39.428 |
| 44285.75533564815 | 37.651 |
| 44285.797002314815 | 36.3 |
| 44285.83866898149 | 35.238 |
| 44285.88033564815 | 34.543 |
| 44285.922002314815 | 34.196 |
| 44285.96366898149 | 34.061 |
| 44286.00533564815 | 33.964 |
| 44286.047002314815 | 33.926 |
| 44286.08866898149 | 33.694 |
| 44286.13033564815 | 33.443 |
| 44286.172002314815 | 33.385 |
| 44286.21366898149 | 33.308 |
| 44286.25533564815 | 33.308 |
| 44286.297002314815 | 33.231 |
| 44286.33866898149 | 33.366 |
| 44286.38033564815 | 33.887 |
| 44286.422002314815 | 35.277 |
| 44286.46366898149 | 37.497 |
| 44286.50533564815 | 39.447 |
| 44286.547002314815 | 40.161 |
| 44286.58866898149 | 40.702 |
| 44286.63033564815 | 40.953 |
| 44286.672002314815 | 40.817 |
| 44286.71366898149 | 39.659 |
| 44286.75533564815 | 38.327 |
| 44286.797002314815 | 36.918 |
| 44286.83866898149 | 35.76 |
| 44286.88033564815 | 35.045 |
| 44286.922002314815 | 34.659 |
| 44286.96366898149 | 34.466 |
| 44287.00533564815 | 34.331 |
| 44287.047002314815 | 34.138 |
| 44287.08866898149 | 34.061 |
| 44287.13033564815 | 33.983 |
| 44287.172002314815 | 33.887 |
| 44287.21366898149 | 33.771 |
| 44287.25533564815 | 33.617 |
| 44287.297002314815 | 33.578 |
| 44287.33866898149 | 33.617 |
| 44287.38033564815 | 34.176 |
| 44287.422002314815 | 35.547 |
| 44287.46366898149 | 37.922 |
| 44287.50533564815 | 40.2 |
| 44287.547002314815 | 41.725 |
| 44287.58866898149 | 42.709 |
| 44287.63033564815 | 42.922 |
| 44287.672002314815 | 42.265 |
| 44287.71366898149 | 40.933 |
| 44287.75533564815 | 39.408 |
| 44287.797002314815 | 37.748 |
| 44287.83866898149 | 36.377 |
| 44287.88033564815 | 35.605 |
| 44287.922002314815 | 35.161 |
| 44287.96366898149 | 34.871 |
| 44288.00533564815 | 34.678 |
| 44288.047002314815 | 34.524 |
| 44288.08866898149 | 34.331 |
| 44288.13033564815 | 34.273 |
| 44288.172002314815 | 34.196 |
| 44288.21366898149 | 34.176 |
| 44288.25533564815 | 34.215 |
| 44288.297002314815 | 34.196 |
| 44288.33866898149 | 34.389 |
| 44288.38033564815 | 34.833 |
| 44288.422002314815 | 36.126 |
| 44288.46366898149 | 38.501 |
| 44288.50533564815 | 40.991 |
| 44288.547002314815 | 42.574 |
| 44288.58866898149 | 43.443 |
| 44288.63033564815 | 43.52 |
| 44288.672002314815 | 42.709 |
| 44288.71366898149 | 41.3 |
| 44288.75533564815 | 39.717 |
| 44288.797002314815 | 38.288 |
| 44288.83866898149 | 36.995 |
| 44288.88033564815 | 36.126 |
| 44288.922002314815 | 35.644 |
| 44288.96366898149 | 35.296 |
| 44289.00533564815 | 35.103 |
| 44289.047002314815 | 34.891 |
| 44289.08866898149 | 34.775 |
| 44289.13033564815 | 34.717 |
| 44289.172002314815 | 34.563 |
| 44289.21366898149 | 34.485 |
| 44289.25533564815 | 34.485 |
| 44289.297002314815 | 34.427 |
| 44289.33866898149 | 34.524 |
| 44289.38033564815 | 35.065 |
| 44289.422002314815 | 36.455 |
| 44289.46366898149 | 38.81 |
| 44289.50533564815 | 41.3 |
| 44289.547002314815 | 43.018 |
| 44289.58866898149 | 43.829 |
| 44289.63033564815 | 43.868 |
| 44289.672002314815 | 42.999 |
| 44289.71366898149 | 41.609 |
| 44289.75533564815 | 39.987 |
| 44289.797002314815 | 38.346 |
| 44289.83866898149 | 36.86 |
| 44289.88033564815 | 35.953 |
| 44289.922002314815 | 35.451 |
| 44289.96366898149 | 33.173 |
| 44290.00533564815 | 32.497 |
| 44290.047002314815 | 31.937 |
| 44290.08866898149 | 31.454 |
| 44290.13033564815 | 30.953 |
| 44290.172002314815 | 32.207 |
| 44290.21366898149 | 31.879 |
| 44290.25533564815 | 31.358 |
| 44290.297002314815 | 31.068 |
| 44290.33866898149 | 31.281 |
| 44290.38033564815 | 32.207 |
| 44290.422002314815 | 35.509 |
| 44290.46366898149 | 43.501 |
| 44290.50533564815 | 50.393 |
| 44290.547002314815 | 50.026 |
| 44290.58866898149 | 50.818 |
| 44290.63033564815 | 49.119 |
| 44290.672002314815 | 46.011 |
| 44290.71366898149 | 44.698 |
| 44290.75533564815 | 42.999 |
| 44290.797002314815 | 39.35 |
| 44290.83866898149 | 38.173 |
| 44290.88033564815 | 36.319 |
| 44290.922002314815 | 34.987 |
| 44290.96366898149 | 34.312 |
| 44291.00533564815 | 33.983 |
| 44291.047002314815 | 33.346 |
| 44291.08866898149 | 32.729 |
| 44291.13033564815 | 32.42 |
| 44291.172002314815 | 31.918 |
| 44291.21366898149 | 31.358 |
| 44291.25533564815 | 30.837 |
| 44291.297002314815 | 32.265 |
| 44291.33866898149 | 32.323 |
| 44291.38033564815 | 33.192 |
| 44291.422002314815 | 39.891 |
| 44291.46366898149 | 45.914 |
| 44291.50533564815 | 46.609 |
| 44291.547002314815 | 50.625 |
| 44291.58866898149 | 50.798 |
| 44291.63033564815 | 49.736 |
| 44291.672002314815 | 45.431 |
| 44291.71366898149 | 44.177 |
| 44291.75533564815 | 42.227 |
| 44291.797002314815 | 38.617 |
| 44291.83866898149 | 36.358 |
| 44291.88033564815 | 35.779 |
| 44291.922002314815 | 34.987 |
| 44291.96366898149 | 34.389 |
| 44292.00533564815 | 33.81 |
| 44292.047002314815 | 33.675 |
| 44292.08866898149 | 33.868 |
| 44292.13033564815 | 33.81 |
| 44292.172002314815 | 32.883 |
| 44292.21366898149 | 32.323 |
| 44292.25533564815 | 32.034 |
| 44292.297002314815 | 32.265 |
| 44292.33866898149 | 32.671 |
| 44292.38033564815 | 36.165 |
| 44292.422002314815 | 39.794 |
| 44292.46366898149 | 41.59 |
| 44292.50533564815 | 40.026 |
| 44292.547002314815 | 41.763 |
| 44292.58866898149 | 37.014 |
| 44292.63033564815 | 38.81 |
| 44292.672002314815 | 37.883 |
| 44292.71366898149 | 34.292 |
| 44292.75533564815 | 32.516 |
| 44292.797002314815 | 32.246 |
| 44292.83866898149 | 32.381 |
| 44292.88033564815 | 32.149 |
| 44292.922002314815 | 31.609 |
| 44292.96366898149 | 30.933 |
| 44293.00533564815 | 30.2 |
| 44293.047002314815 | 30.547 |
| 44293.08866898149 | 30.682 |
| 44293.13033564815 | 30.933 |
| 44293.172002314815 | 30.837 |
| 44293.21366898149 | 31.03 |
| 44293.25533564815 | 31.165 |
| 44293.297002314815 | 31.397 |
| 44293.33866898149 | 31.725 |
| 44293.38033564815 | 32.188 |
| 44293.422002314815 | 32.96 |
| 44293.46366898149 | 36.435 |
| 44293.50533564815 | 42.4 |
| 44293.547002314815 | 40.393 |
| 44293.58866898149 | 40.817 |
| 44293.63033564815 | 39.64 |
| 44293.672002314815 | 40.431 |
| 44293.71366898149 | 40.393 |
| 44293.75533564815 | 38.983 |
| 44293.797002314815 | 37.594 |
| 44293.83866898149 | 36.435 |
| 44293.88033564815 | 35.779 |
| 44293.922002314815 | 35.451 |
| 44293.96366898149 | 35.238 |
| 44294.00533564815 | 35.065 |
| 44294.047002314815 | 34.949 |
| 44294.08866898149 | 34.852 |
| 44294.13033564815 | 34.814 |
| 44294.172002314815 | 34.717 |
| 44294.21366898149 | 34.698 |
| 44294.25533564815 | 34.794 |
| 44294.297002314815 | 35.026 |
| 44294.33866898149 | 35.412 |
| 44294.38033564815 | 36.068 |
| 44294.422002314815 | 37.285 |
| 44294.46366898149 | 39.119 |
| 44294.50533564815 | 39.35 |
| 44294.547002314815 | 39.775 |
| 44294.58866898149 | 40.624 |
| 44294.63033564815 | 41.744 |
| 44294.672002314815 | 42.439 |
| 44294.71366898149 | 41.493 |
| 44294.75533564815 | 39.91 |
| 44294.797002314815 | 38.211 |
| 44294.83866898149 | 36.937 |
| 44294.88033564815 | 36.242 |
| 44294.922002314815 | 35.914 |
| 44294.96366898149 | 35.682 |
| 44295.00533564815 | 35.489 |
| 44295.047002314815 | 35.277 |
| 44295.08866898149 | 35.065 |
| 44295.13033564815 | 35.007 |
| 44295.172002314815 | 34.987 |
| 44295.21366898149 | 34.891 |
| 44295.25533564815 | 34.659 |
| 44295.297002314815 | 34.485 |
| 44295.33866898149 | 34.485 |
| 44295.38033564815 | 35.007 |
| 44295.422002314815 | 35.914 |
| 44295.46366898149 | 38.038 |
| 44295.50533564815 | 39.138 |
| 44295.547002314815 | 40.702 |
| 44295.58866898149 | 42.227 |
| 44295.63033564815 | 42.613 |
| 44295.672002314815 | 41.918 |
| 44295.71366898149 | 40.528 |
| 44295.75533564815 | 39.061 |
| 44295.797002314815 | 37.555 |
| 44295.83866898149 | 36.242 |
| 44295.88033564815 | 35.566 |
| 44295.922002314815 | 35.238 |
| 44295.96366898149 | 35.045 |
| 44296.00533564815 | 34.871 |
| 44296.047002314815 | 34.717 |
| 44296.08866898149 | 34.601 |
| 44296.13033564815 | 34.485 |
| 44296.172002314815 | 34.37 |
| 44296.21366898149 | 34.37 |
| 44296.25533564815 | 34.292 |
| 44296.297002314815 | 34.292 |
| 44296.33866898149 | 34.427 |
| 44296.38033564815 | 35.2 |
| 44296.422002314815 | 36.783 |
| 44296.46366898149 | 39.157 |
| 44296.50533564815 | 41.146 |
| 44296.547002314815 | 42.594 |
| 44296.58866898149 | 43.385 |
| 44296.63033564815 | 43.308 |
| 44296.672002314815 | 42.787 |
| 44296.71366898149 | 41.261 |
| 44296.75533564815 | 39.64 |
| 44296.797002314815 | 38.038 |
| 44296.83866898149 | 36.744 |
| 44296.88033564815 | 36.03 |
| 44296.922002314815 | 35.624 |
| 44296.96366898149 | 35.373 |
| 44297.00533564815 | 35.161 |
| 44297.047002314815 | 35.026 |
| 44297.08866898149 | 35.007 |
| 44297.13033564815 | 34.929 |
| 44297.172002314815 | 34.736 |
| 44297.21366898149 | 34.64 |
| 44297.25533564815 | 34.659 |
| 44297.297002314815 | 34.543 |
| 44297.33866898149 | 34.659 |
| 44297.38033564815 | 35.547 |
| 44297.422002314815 | 37.092 |
| 44297.46366898149 | 39.466 |
| 44297.50533564815 | 41.242 |
| 44297.547002314815 | 42.883 |
| 44297.58866898149 | 43.655 |
| 44297.63033564815 | 43.713 |
| 44297.672002314815 | 42.941 |
| 44297.71366898149 | 41.802 |
| 44297.75533564815 | 40.277 |
| 44297.797002314815 | 38.636 |
| 44297.83866898149 | 37.227 |
| 44297.88033564815 | 36.474 |
| 44297.922002314815 | 35.991 |
| 44297.96366898149 | 35.76 |
| 44298.00533564815 | 35.586 |
| 44298.047002314815 | 35.354 |
| 44298.08866898149 | 35.18 |
| 44298.13033564815 | 35.026 |
| 44298.172002314815 | 34.91 |
| 44298.21366898149 | 34.794 |
| 44298.25533564815 | 34.659 |
| 44298.297002314815 | 34.505 |
| 44298.33866898149 | 34.601 |
| 44298.38033564815 | 35.315 |
| 44298.422002314815 | 36.802 |
| 44298.46366898149 | 39.177 |
| 44298.50533564815 | 41.107 |
| 44298.547002314815 | 42.613 |
| 44298.58866898149 | 43.424 |
| 44298.63033564815 | 43.52 |
| 44298.672002314815 | 42.767 |
| 44298.71366898149 | 41.455 |
| 44298.75533564815 | 39.794 |
| 44298.797002314815 | 38.153 |
| 44298.83866898149 | 37.13 |
| 44298.88033564815 | 36.512 |
| 44298.922002314815 | 35.972 |
| 44298.96366898149 | 35.547 |
| 44299.00533564815 | 35.277 |
| 44299.047002314815 | 35.219 |
| 44299.08866898149 | 35.2 |
| 44299.13033564815 | 35.258 |
| 44299.172002314815 | 35.238 |
| 44299.21366898149 | 35.238 |
| 44299.25533564815 | 35.142 |
| 44299.297002314815 | 35.161 |
| 44299.33866898149 | 35.393 |
| 44299.38033564815 | 35.875 |
| 44299.422002314815 | 36.86 |
| 44299.46366898149 | 38.115 |
| 44299.50533564815 | 39.485 |
| 44299.547002314815 | 40.354 |
| 44299.58866898149 | 39.833 |
| 44299.63033564815 | 39.138 |
| 44299.672002314815 | 38.346 |
| 44299.71366898149 | 37.767 |
| 44299.75533564815 | 36.937 |
| 44299.797002314815 | 36.57 |
| 44299.83866898149 | 36.455 |
| 44299.88033564815 | 36.165 |
| 44299.922002314815 | 35.721 |
| 44299.96366898149 | 35.277 |
| 44300.00533564815 | 34.987 |
| 44300.047002314815 | 34.833 |
| 44300.08866898149 | 34.814 |
| 44300.13033564815 | 34.794 |
| 44300.172002314815 | 34.678 |
| 44300.21366898149 | 34.543 |
| 44300.25533564815 | 34.543 |
| 44300.297002314815 | 34.543 |
| 44300.33866898149 | 34.717 |
| 44300.38033564815 | 35.509 |
| 44300.422002314815 | 37.13 |
| 44300.46366898149 | 39.524 |
| 44300.50533564815 | 41.57 |
| 44300.547002314815 | 42.806 |
| 44300.58866898149 | 41.493 |
| 44300.63033564815 | 39.91 |
| 44300.672002314815 | 39.08 |
| 44300.71366898149 | 38.443 |
| 44300.75533564815 | 37.98 |
| 44300.797002314815 | 37.246 |
| 44300.83866898149 | 36.648 |
| 44300.88033564815 | 36.3 |
| 44300.922002314815 | 36.068 |
| 44300.96366898149 | 35.933 |
| 44301.00533564815 | 35.798 |
| 44301.047002314815 | 35.702 |
| 44301.08866898149 | 35.624 |
| 44301.13033564815 | 35.489 |
| 44301.172002314815 | 35.47 |
| 44301.21366898149 | 35.431 |
| 44301.25533564815 | 35.315 |
| 44301.297002314815 | 35.2 |
| 44301.33866898149 | 35.509 |
| 44301.38033564815 | 36.165 |
| 44301.422002314815 | 37.246 |
| 44301.46366898149 | 38.018 |
| 44301.50533564815 | 37.69 |
| 44301.547002314815 | 39.428 |
| 44301.58866898149 | 40.354 |
| 44301.63033564815 | 39.312 |
| 44301.672002314815 | 36.918 |
| 44301.71366898149 | 36.319 |
| 44301.75533564815 | 36.088 |
| 44301.797002314815 | 35.393 |
| 44301.83866898149 | 35.393 |
| 44301.88033564815 | 35.393 |
| 44301.922002314815 | 35.354 |
| 44301.96366898149 | 35.142 |
| 44302.00533564815 | 34.871 |
| 44302.047002314815 | 34.678 |
| 44302.08866898149 | 34.601 |
| 44302.13033564815 | 34.64 |
| 44302.172002314815 | 34.621 |
| 44302.21366898149 | 34.659 |
| 44302.25533564815 | 34.563 |
| 44302.297002314815 | 34.524 |
| 44302.33866898149 | 34.64 |
| 44302.38033564815 | 35.238 |
| 44302.422002314815 | 36.551 |
| 44302.46366898149 | 38.134 |
| 44302.50533564815 | 40.2 |
| 44302.547002314815 | 41.358 |
| 44302.58866898149 | 41.86 |
| 44302.63033564815 | 40.798 |
| 44302.672002314815 | 40.431 |
| 44302.71366898149 | 40.007 |
| 44302.75533564815 | 38.79 |
| 44302.797002314815 | 37.42 |
| 44302.83866898149 | 36.358 |
| 44302.88033564815 | 35.798 |
| 44302.922002314815 | 35.586 |
| 44302.96366898149 | 35.47 |
| 44303.00533564815 | 35.431 |
| 44303.047002314815 | 35.354 |
| 44303.08866898149 | 35.161 |
| 44303.13033564815 | 35.007 |
| 44303.172002314815 | 34.775 |
| 44303.21366898149 | 34.64 |
| 44303.25533564815 | 34.505 |
| 44303.297002314815 | 34.524 |
| 44303.33866898149 | 34.949 |
| 44303.38033564815 | 35.721 |
| 44303.422002314815 | 36.995 |
| 44303.46366898149 | 38.366 |
| 44303.50533564815 | 38.192 |
| 44303.547002314815 | 39.64 |
| 44303.58866898149 | 41.59 |
| 44303.63033564815 | 42.478 |
| 44303.672002314815 | 42.343 |
| 44303.71366898149 | 40.721 |
| 44303.75533564815 | 39.08 |
| 44303.797002314815 | 37.632 |
| 44303.83866898149 | 36.319 |
| 44303.88033564815 | 35.47 |
| 44303.922002314815 | 35.065 |
| 44303.96366898149 | 34.794 |
| 44304.00533564815 | 34.601 |
| 44304.047002314815 | 34.447 |
| 44304.08866898149 | 34.331 |
| 44304.13033564815 | 34.254 |
| 44304.172002314815 | 34.119 |
| 44304.21366898149 | 34.08 |
| 44304.25533564815 | 34.061 |
| 44304.297002314815 | 34.041 |
| 44304.33866898149 | 34.254 |
| 44304.38033564815 | 35.142 |
| 44304.422002314815 | 36.937 |
| 44304.46366898149 | 39.061 |
| 44304.50533564815 | 40.065 |
| 44304.547002314815 | 40.2 |
| 44304.58866898149 | 41.261 |
| 44304.63033564815 | 42.246 |
| 44304.672002314815 | 41.493 |
| 44304.71366898149 | 40.065 |
| 44304.75533564815 | 38.887 |
| 44304.797002314815 | 37.748 |
| 44304.83866898149 | 36.744 |
| 44304.88033564815 | 35.972 |
| 44304.922002314815 | 35.566 |
| 44304.96366898149 | 35.315 |
| 44305.00533564815 | 35.161 |
| 44305.047002314815 | 34.968 |
| 44305.08866898149 | 34.91 |
| 44305.13033564815 | 35.084 |
| 44305.172002314815 | 35.2 |
| 44305.21366898149 | 35.219 |
| 44305.25533564815 | 35.084 |
| 44305.297002314815 | 35.122 |
| 44305.33866898149 | 35.354 |
| 44305.38033564815 | 36.281 |
| 44305.422002314815 | 37.787 |
| 44305.46366898149 | 39.987 |
| 44305.50533564815 | 41.86 |
| 44305.547002314815 | 43.057 |
| 44305.58866898149 | 43.636 |
| 44305.63033564815 | 43.733 |
| 44305.672002314815 | 42.111 |
| 44305.71366898149 | 39.949 |
| 44305.75533564815 | 38.327 |
| 44305.797002314815 | 37.478 |
| 44305.83866898149 | 36.03 |
| 44305.88033564815 | 35.277 |
| 44305.922002314815 | 34.833 |
| 44305.96366898149 | 34.485 |
| 44306.00533564815 | 34.234 |
| 44306.047002314815 | 34.041 |
| 44306.08866898149 | 33.945 |
| 44306.13033564815 | 34.022 |
| 44306.172002314815 | 33.983 |
| 44306.21366898149 | 33.829 |
| 44306.25533564815 | 33.713 |
| 44306.297002314815 | 33.752 |
| 44306.33866898149 | 34.119 |
| 44306.38033564815 | 35.18 |
| 44306.422002314815 | 36.821 |
| 44306.46366898149 | 39.041 |
| 44306.50533564815 | 40.605 |
| 44306.547002314815 | 41.802 |
| 44306.58866898149 | 42.343 |
| 44306.63033564815 | 42.265 |
| 44306.672002314815 | 41.976 |
| 44306.71366898149 | 40.567 |
| 44306.75533564815 | 39.215 |
| 44306.797002314815 | 37.632 |
| 44306.83866898149 | 36.397 |
| 44306.88033564815 | 35.644 |
| 44306.922002314815 | 35.335 |
| 44306.96366898149 | 35.065 |
| 44307.00533564815 | 34.833 |
| 44307.047002314815 | 34.659 |
| 44307.08866898149 | 34.563 |
| 44307.13033564815 | 34.447 |
| 44307.172002314815 | 34.447 |
| 44307.21366898149 | 34.582 |
| 44307.25533564815 | 34.794 |
| 44307.297002314815 | 35.026 |
| 44307.33866898149 | 35.393 |
| 44307.38033564815 | 36.03 |
| 44307.422002314815 | 37.034 |
| 44307.46366898149 | 37.787 |
| 44307.50533564815 | 38.269 |
| 44307.547002314815 | 39.003 |
| 44307.58866898149 | 40.065 |
| 44307.63033564815 | 39.601 |
| 44307.672002314815 | 38.771 |
| 44307.71366898149 | 38.095 |
| 44307.75533564815 | 37.709 |
| 44307.797002314815 | 37.13 |
| 44307.83866898149 | 36.648 |
| 44307.88033564815 | 36.377 |
| 44307.922002314815 | 36.242 |
| 44307.96366898149 | 36.204 |
| 44308.00533564815 | 36.03 |
| 44308.047002314815 | 35.721 |
| 44308.08866898149 | 35.566 |
| 44308.13033564815 | 35.547 |
| 44308.172002314815 | 35.335 |
| 44308.21366898149 | 35.122 |
| 44308.25533564815 | 35.045 |
| 44308.297002314815 | 35.065 |
| 44308.33866898149 | 35.412 |
| 44308.38033564815 | 35.914 |
| 44308.422002314815 | 36.918 |
| 44308.46366898149 | 37.246 |
| 44308.50533564815 | 37.169 |
| 44308.547002314815 | 37.613 |
| 44308.58866898149 | 38.134 |
| 44308.63033564815 | 38.501 |
| 44308.672002314815 | 38.636 |
| 44308.71366898149 | 37.227 |
| 44308.75533564815 | 35.991 |
| 44308.797002314815 | 35.2 |
| 44308.83866898149 | 35.315 |
| 44308.88033564815 | 35.566 |
| 44308.922002314815 | 35.47 |
| 44308.96366898149 | 35.277 |
| 44309.00533564815 | 35.258 |
| 44309.047002314815 | 35.142 |
| 44309.08866898149 | 34.91 |
| 44309.13033564815 | 34.794 |
| 44309.172002314815 | 34.698 |
| 44309.21366898149 | 34.485 |
| 44309.25533564815 | 34.408 |
| 44309.297002314815 | 34.37 |
| 44309.33866898149 | 34.505 |
| 44309.38033564815 | 35.2 |
| 44309.422002314815 | 36.763 |
| 44309.46366898149 | 39.35 |
| 44309.50533564815 | 41.03 |
| 44309.547002314815 | 41.455 |
| 44309.58866898149 | 40.219 |
| 44309.63033564815 | 38.752 |
| 44309.672002314815 | 38.848 |
| 44309.71366898149 | 38.848 |
| 44309.75533564815 | 38.057 |
| 44309.797002314815 | 37.323 |
| 44309.83866898149 | 36.841 |
| 44309.88033564815 | 36.165 |
| 44309.922002314815 | 35.991 |
| 44309.96366898149 | 35.875 |
| 44310.00533564815 | 35.624 |
| 44310.047002314815 | 35.373 |
| 44310.08866898149 | 35.2 |
| 44310.13033564815 | 35.007 |
| 44310.172002314815 | 34.91 |
| 44310.21366898149 | 34.794 |
| 44310.25533564815 | 34.678 |
| 44310.297002314815 | 34.659 |
| 44310.33866898149 | 34.871 |
| 44310.38033564815 | 35.74 |
| 44310.422002314815 | 37.613 |
| 44310.46366898149 | 39.968 |
| 44310.50533564815 | 41.107 |
| 44310.547002314815 | 42.516 |
| 44310.58866898149 | 43.694 |
| 44310.63033564815 | 43.984 |
| 44310.672002314815 | 42.69 |
| 44310.71366898149 | 40.972 |
| 44310.75533564815 | 39.64 |
| 44310.797002314815 | 38.713 |
| 44310.83866898149 | 37.96 |
| 44310.88033564815 | 37.478 |
| 44310.922002314815 | 37.207 |
| 44310.96366898149 | 36.937 |
| 44311.00533564815 | 36.744 |
| 44311.047002314815 | 36.705 |
| 44311.08866898149 | 36.551 |
| 44311.13033564815 | 36.397 |
| 44311.172002314815 | 36.319 |
| 44311.21366898149 | 36.165 |
| 44311.25533564815 | 35.991 |
| 44311.297002314815 | 35.933 |
| 44311.33866898149 | 36.165 |
| 44311.38033564815 | 36.995 |
| 44311.422002314815 | 38.52 |
| 44311.46366898149 | 40.779 |
| 44311.50533564815 | 42.902 |
| 44311.547002314815 | 44.582 |
| 44311.58866898149 | 45.644 |
| 44311.63033564815 | 45.644 |
| 44311.672002314815 | 44.292 |
| 44311.71366898149 | 42.4 |
| 44311.75533564815 | 41.146 |
| 44311.797002314815 | 39.814 |
| 44311.83866898149 | 38.81 |
| 44311.88033564815 | 37.98 |
| 44311.922002314815 | 37.323 |
| 44311.96366898149 | 36.899 |
| 44312.00533564815 | 36.532 |
| 44312.047002314815 | 36.281 |
| 44312.08866898149 | 36.165 |
| 44312.13033564815 | 36.088 |
| 44312.172002314815 | 35.972 |
| 44312.21366898149 | 35.837 |
| 44312.25533564815 | 35.721 |
| 44312.297002314815 | 35.586 |
| 44312.33866898149 | 35.837 |
| 44312.38033564815 | 36.397 |
| 44312.422002314815 | 37.729 |
| 44312.46366898149 | 39.698 |
| 44312.50533564815 | 41.744 |
| 44312.547002314815 | 43.173 |
| 44312.58866898149 | 43.733 |
| 44312.63033564815 | 43.443 |
| 44312.672002314815 | 42.69 |
| 44312.71366898149 | 41.899 |
| 44312.75533564815 | 40.991 |
| 44312.797002314815 | 39.736 |
| 44312.83866898149 | 38.52 |
| 44312.88033564815 | 37.594 |
| 44312.922002314815 | 37.092 |
| 44312.96366898149 | 36.744 |
| 44313.00533564815 | 36.435 |
| 44313.047002314815 | 36.126 |
| 44313.08866898149 | 35.875 |
| 44313.13033564815 | 35.702 |
| 44313.172002314815 | 35.605 |
| 44313.21366898149 | 35.47 |
| 44313.25533564815 | 35.335 |
| 44313.297002314815 | 35.315 |
| 44313.33866898149 | 35.431 |
| 44313.38033564815 | 36.242 |
| 44313.422002314815 | 37.709 |
| 44313.46366898149 | 38.327 |
| 44313.50533564815 | 38.404 |
| 44313.547002314815 | 37.864 |
| 44313.58866898149 | 36.744 |
| 44313.63033564815 | 36.281 |
| 44313.672002314815 | 35.586 |
| 44313.71366898149 | 35.702 |
| 44313.75533564815 | 36.744 |
| 44313.797002314815 | 37.227 |
| 44313.83866898149 | 36.705 |
| 44313.88033564815 | 36.377 |
| 44313.922002314815 | 36.126 |
| 44313.96366898149 | 36.126 |
| 44314.00533564815 | 36.204 |
| 44314.047002314815 | 36.165 |
| 44314.08866898149 | 36.107 |
| 44314.13033564815 | 35.972 |
| 44314.172002314815 | 35.914 |
| 44314.21366898149 | 35.895 |
| 44314.25533564815 | 35.856 |
| 44314.297002314815 | 35.895 |
| 44314.33866898149 | 36.204 |
| 44314.38033564815 | 37.014 |
| 44314.422002314815 | 37.922 |
| 44314.46366898149 | 38.501 |
| 44314.50533564815 | 39.698 |
| 44314.547002314815 | 41.049 |
| 44314.58866898149 | 41.918 |
| 44314.63033564815 | 41.802 |
| 44314.672002314815 | 42.188 |
| 44314.71366898149 | 42.072 |
| 44314.75533564815 | 41.107 |
| 44314.797002314815 | 39.814 |
| 44314.83866898149 | 38.597 |
| 44314.88033564815 | 37.536 |
| 44314.922002314815 | 36.956 |
| 44314.96366898149 | 36.455 |
| 44315.00533564815 | 36.107 |
| 44315.047002314815 | 35.856 |
| 44315.08866898149 | 35.682 |
| 44315.13033564815 | 35.47 |
| 44315.172002314815 | 35.393 |
| 44315.21366898149 | 35.238 |
| 44315.25533564815 | 35.161 |
| 44315.297002314815 | 35.045 |
| 44315.33866898149 | 35.296 |
| 44315.38033564815 | 36.184 |
| 44315.422002314815 | 38.076 |
| 44315.46366898149 | 40.624 |
| 44315.50533564815 | 42.748 |
| 44315.547002314815 | 44.428 |
| 44315.58866898149 | 45.412 |
| 44315.63033564815 | 45.74 |
| 44315.672002314815 | 44.987 |
| 44315.71366898149 | 43.81 |
| 44315.75533564815 | 42.42 |
| 44315.797002314815 | 40.895 |
| 44315.83866898149 | 39.485 |
| 44315.88033564815 | 38.385 |
| 44315.922002314815 | 37.748 |
| 44315.96366898149 | 37.227 |
| 44316.00533564815 | 36.802 |
| 44316.047002314815 | 36.474 |
| 44316.08866898149 | 36.242 |
| 44316.13033564815 | 36.03 |
| 44316.172002314815 | 35.817 |
| 44316.21366898149 | 35.682 |
| 44316.25533564815 | 35.547 |
| 44316.297002314815 | 35.489 |
| 44316.33866898149 | 35.702 |
| 44316.38033564815 | 36.686 |
| 44316.422002314815 | 38.462 |
| 44316.46366898149 | 40.972 |
| 44316.50533564815 | 43.308 |
| 44316.547002314815 | 44.949 |
| 44316.58866898149 | 45.972 |
| 44316.63033564815 | 46.223 |
| 44316.672002314815 | 45.586 |
| 44316.71366898149 | 44.466 |
| 44316.75533564815 | 43.038 |
| 44316.797002314815 | 41.435 |
| 44316.83866898149 | 40.026 |
| 44316.88033564815 | 38.906 |
| 44316.922002314815 | 38.25 |
| 44316.96366898149 | 37.709 |
| 44317.00533564815 | 37.227 |
| 44317.047002314815 | 36.802 |
| 44317.08866898149 | 36.474 |
| 44317.13033564815 | 36.204 |
| 44317.172002314815 | 35.953 |
| 44317.21366898149 | 35.798 |
| 44317.25533564815 | 35.624 |
| 44317.297002314815 | 35.644 |
| 44317.33866898149 | 35.933 |
| 44317.38033564815 | 36.628 |
| 44317.422002314815 | 38.404 |
| 44317.46366898149 | 41.049 |
| 44317.50533564815 | 42.941 |
| 44317.547002314815 | 44.157 |
| 44317.58866898149 | 44.64 |
| 44317.63033564815 | 45.258 |
| 44317.672002314815 | 44.794 |
| 44317.71366898149 | 43.192 |
| 44317.75533564815 | 41.416 |
| 44317.797002314815 | 40.393 |
| 44317.83866898149 | 39.582 |
| 44317.88033564815 | 38.868 |
| 44317.922002314815 | 38.482 |
| 44317.96366898149 | 38.134 |
| 44318.00533564815 | 37.806 |
| 44318.047002314815 | 37.536 |
| 44318.08866898149 | 37.169 |
| 44318.13033564815 | 36.802 |
| 44318.172002314815 | 36.667 |
| 44318.21366898149 | 36.474 |
| 44318.25533564815 | 36.223 |
| 44318.297002314815 | 36.107 |
| 44318.33866898149 | 36.474 |
| 44318.38033564815 | 37.072 |
| 44318.422002314815 | 37.787 |
| 44318.46366898149 | 39.003 |
| 44318.50533564815 | 39.872 |
| 44318.547002314815 | 41.049 |
| 44318.58866898149 | 40.991 |
| 44318.63033564815 | 39.968 |
| 44318.672002314815 | 40.007 |
| 44318.71366898149 | 40.528 |
| 44318.75533564815 | 40.084 |
| 44318.797002314815 | 39.157 |
| 44318.83866898149 | 38.366 |
| 44318.88033564815 | 37.844 |
| 44318.922002314815 | 37.42 |
| 44318.96366898149 | 37.246 |
| 44319.00533564815 | 37.188 |
| 44319.047002314815 | 37.092 |
| 44319.08866898149 | 37.014 |
| 44319.13033564815 | 36.995 |
| 44319.172002314815 | 36.705 |
| 44319.21366898149 | 36.57 |
| 44319.25533564815 | 36.474 |
| 44319.297002314815 | 36.3 |
| 44319.33866898149 | 35.798 |
| 44319.38033564815 | 36.107 |
| 44319.422002314815 | 36.879 |
| 44319.46366898149 | 38.964 |
| 44319.50533564815 | 39.717 |
| 44319.547002314815 | 41.744 |
| 44319.58866898149 | 43.984 |
| 44319.63033564815 | 43.655 |
| 44319.672002314815 | 42.053 |
| 44319.71366898149 | 41.126 |
| 44319.75533564815 | 40.219 |
| 44319.797002314815 | 38.983 |
| 44319.83866898149 | 38.038 |
| 44319.88033564815 | 37.458 |
| 44319.922002314815 | 37.13 |
| 44319.96366898149 | 36.937 |
| 44320.00533564815 | 36.763 |
| 44320.047002314815 | 36.59 |
| 44320.08866898149 | 36.532 |
| 44320.13033564815 | 36.455 |
| 44320.172002314815 | 36.339 |
| 44320.21366898149 | 36.204 |
| 44320.25533564815 | 36.049 |
| 44320.297002314815 | 36.068 |
| 44320.33866898149 | 36.339 |
| 44320.38033564815 | 37.246 |
| 44320.422002314815 | 38.752 |
| 44320.46366898149 | 40.682 |
| 44320.50533564815 | 41.281 |
| 44320.547002314815 | 40.779 |
| 44320.58866898149 | 41.937 |
| 44320.63033564815 | 42.709 |
| 44320.672002314815 | 42.343 |
| 44320.71366898149 | 40.779 |
| 44320.75533564815 | 39.717 |
| 44320.797002314815 | 38.964 |
| 44320.83866898149 | 37.999 |
| 44320.88033564815 | 37.343 |
| 44320.922002314815 | 37.13 |
| 44320.96366898149 | 37.053 |
| 44321.00533564815 | 36.841 |
| 44321.047002314815 | 36.686 |
| 44321.08866898149 | 35.76 |
| 44321.13033564815 | 35.393 |
| 44321.172002314815 | 35.779 |
| 44321.21366898149 | 36.068 |
| 44321.25533564815 | 36.165 |
| 44321.297002314815 | 36.242 |
| 44321.33866898149 | 36.609 |
| 44321.38033564815 | 37.516 |
| 44321.422002314815 | 39.157 |
| 44321.46366898149 | 40.161 |
| 44321.50533564815 | 40.142 |
| 44321.547002314815 | 41.609 |
| 44321.58866898149 | 42.902 |
| 44321.63033564815 | 44.138 |
| 44321.672002314815 | 44.312 |
| 44321.71366898149 | 43.385 |
| 44321.75533564815 | 41.899 |
| 44321.797002314815 | 40.026 |
| 44321.83866898149 | 38.848 |
| 44321.88033564815 | 37.96 |
| 44321.922002314815 | 37.4 |
| 44321.96366898149 | 36.879 |
| 44322.00533564815 | 36.435 |
| 44322.047002314815 | 36.204 |
| 44322.08866898149 | 36.03 |
| 44322.13033564815 | 35.837 |
| 44322.172002314815 | 35.644 |
| 44322.21366898149 | 35.489 |
| 44322.25533564815 | 35.393 |
| 44322.297002314815 | 35.335 |
| 44322.33866898149 | 35.528 |
| 44322.38033564815 | 36.609 |
| 44322.422002314815 | 38.694 |
| 44322.46366898149 | 41.146 |
| 44322.50533564815 | 43.501 |
| 44322.547002314815 | 45.219 |
| 44322.58866898149 | 45.972 |
| 44322.63033564815 | 46.262 |
| 44322.672002314815 | 45.586 |
| 44322.71366898149 | 44.408 |
| 44322.75533564815 | 43.038 |
| 44322.797002314815 | 41.377 |
| 44322.83866898149 | 39.91 |
| 44322.88033564815 | 38.906 |
| 44322.922002314815 | 38.25 |
| 44322.96366898149 | 37.748 |
| 44323.00533564815 | 37.362 |
| 44323.047002314815 | 36.976 |
| 44323.08866898149 | 36.648 |
| 44323.13033564815 | 36.358 |
| 44323.172002314815 | 36.184 |
| 44323.21366898149 | 35.953 |
| 44323.25533564815 | 35.798 |
| 44323.297002314815 | 35.74 |
| 44323.33866898149 | 36.01 |
| 44323.38033564815 | 36.995 |
| 44323.422002314815 | 39.234 |
| 44323.46366898149 | 41.86 |
| 44323.50533564815 | 42.323 |
| 44323.547002314815 | 41.763 |
| 44323.58866898149 | 42.787 |
| 44323.63033564815 | 44.177 |
| 44323.672002314815 | 44.466 |
| 44323.71366898149 | 43.829 |
| 44323.75533564815 | 42.497 |
| 44323.797002314815 | 41.03 |
| 44323.83866898149 | 39.794 |
| 44323.88033564815 | 38.906 |
| 44323.922002314815 | 38.327 |
| 44323.96366898149 | 37.96 |
| 44324.00533564815 | 37.613 |
| 44324.047002314815 | 37.285 |
| 44324.08866898149 | 36.995 |
| 44324.13033564815 | 36.725 |
| 44324.172002314815 | 36.455 |
| 44324.21366898149 | 36.242 |
| 44324.25533564815 | 36.088 |
| 44324.297002314815 | 36.204 |
| 44324.33866898149 | 36.686 |
| 44324.38033564815 | 37.69 |
| 44324.422002314815 | 38.868 |
| 44324.46366898149 | 40.605 |
| 44324.50533564815 | 42.632 |
| 44324.547002314815 | 43.095 |
| 44324.58866898149 | 41.532 |
| 44324.63033564815 | 41.03 |
| 44324.672002314815 | 40.991 |
| 44324.71366898149 | 40.219 |
| 44324.75533564815 | 39.543 |
| 44324.797002314815 | 39.041 |
| 44324.83866898149 | 38.308 |
| 44324.88033564815 | 37.767 |
| 44324.922002314815 | 37.42 |
| 44324.96366898149 | 37.092 |
| 44325.00533564815 | 36.744 |
| 44325.047002314815 | 36.512 |
| 44325.08866898149 | 36.165 |
| 44325.13033564815 | 35.953 |
| 44325.172002314815 | 35.721 |
| 44325.21366898149 | 35.451 |
| 44325.25533564815 | 35.296 |
| 44325.297002314815 | 35.161 |
| 44325.33866898149 | 35.412 |
| 44325.38033564815 | 36.377 |
| 44325.422002314815 | 38.269 |
| 44325.46366898149 | 39.833 |
| 44325.50533564815 | 40.258 |
| 44325.547002314815 | 41.3 |
| 44325.58866898149 | 42.034 |
| 44325.63033564815 | 41.744 |
| 44325.672002314815 | 41.532 |
| 44325.71366898149 | 40.663 |
| 44325.75533564815 | 39.524 |
| 44325.797002314815 | 38.559 |
| 44325.83866898149 | 37.922 |
| 44325.88033564815 | 37.4 |
| 44325.922002314815 | 37.034 |
| 44325.96366898149 | 36.841 |
| 44326.00533564815 | 36.667 |
| 44326.047002314815 | 36.551 |
| 44326.08866898149 | 36.435 |
| 44326.13033564815 | 36.339 |
| 44326.172002314815 | 36.319 |
| 44326.21366898149 | 36.204 |
| 44326.25533564815 | 36.146 |
| 44326.297002314815 | 36.242 |
| 44326.33866898149 | 36.377 |
| 44326.38033564815 | 36.088 |
| 44326.422002314815 | 36.068 |
| 44326.46366898149 | 36.841 |
| 44326.50533564815 | 37.4 |
| 44326.547002314815 | 38.366 |
| 44326.58866898149 | 39.157 |
| 44326.63033564815 | 39.35 |
| 44326.672002314815 | 39.312 |
| 44326.71366898149 | 39.601 |
| 44326.75533564815 | 39.312 |
| 44326.797002314815 | 37.497 |
| 44326.83866898149 | 36.59 |
| 44326.88033564815 | 36.493 |
| 44326.922002314815 | 36.435 |
| 44326.96366898149 | 36.397 |
| 44327.00533564815 | 36.3 |
| 44327.047002314815 | 36.03 |
| 44327.08866898149 | 35.76 |
| 44327.13033564815 | 35.605 |
| 44327.172002314815 | 35.451 |
| 44327.21366898149 | 35.277 |
| 44327.25533564815 | 35.238 |
| 44327.297002314815 | 35.47 |
| 44327.33866898149 | 35.837 |
| 44327.38033564815 | 36.744 |
| 44327.422002314815 | 38.076 |
| 44327.46366898149 | 38.926 |
| 44327.50533564815 | 38.057 |
| 44327.547002314815 | 38.269 |
| 44327.58866898149 | 38.655 |
| 44327.63033564815 | 39.968 |
| 44327.672002314815 | 40.045 |
| 44327.71366898149 | 39.447 |
| 44327.75533564815 | 39.563 |
| 44327.797002314815 | 38.597 |
| 44327.83866898149 | 37.671 |
| 44327.88033564815 | 37.053 |
| 44327.922002314815 | 36.609 |
| 44327.96366898149 | 36.242 |
| 44328.00533564815 | 36.088 |
| 44328.047002314815 | 35.875 |
| 44328.08866898149 | 35.586 |
| 44328.13033564815 | 35.393 |
| 44328.172002314815 | 35.2 |
| 44328.21366898149 | 35.026 |
| 44328.25533564815 | 34.929 |
| 44328.297002314815 | 35.026 |
| 44328.33866898149 | 35.373 |
| 44328.38033564815 | 36.57 |
| 44328.422002314815 | 38.636 |
| 44328.46366898149 | 40.972 |
| 44328.50533564815 | 41.628 |
| 44328.547002314815 | 41.609 |
| 44328.58866898149 | 42.304 |
| 44328.63033564815 | 42.42 |
| 44328.672002314815 | 42.497 |
| 44328.71366898149 | 41.763 |
| 44328.75533564815 | 40.895 |
| 44328.797002314815 | 39.872 |
| 44328.83866898149 | 38.752 |
| 44328.88033564815 | 37.864 |
| 44328.922002314815 | 37.458 |
| 44328.96366898149 | 37.072 |
| 44329.00533564815 | 36.686 |
| 44329.047002314815 | 36.397 |
| 44329.08866898149 | 36.165 |
| 44329.13033564815 | 36.049 |
| 44329.172002314815 | 35.837 |
| 44329.21366898149 | 35.721 |
| 44329.25533564815 | 35.586 |
| 44329.297002314815 | 35.547 |
| 44329.33866898149 | 35.837 |
| 44329.38033564815 | 37.072 |
| 44329.422002314815 | 39.312 |
| 44329.46366898149 | 41.59 |
| 44329.50533564815 | 43.482 |
| 44329.547002314815 | 44.524 |
| 44329.58866898149 | 45.123 |
| 44329.63033564815 | 44.833 |
| 44329.672002314815 | 43.559 |
| 44329.71366898149 | 42.285 |
| 44329.75533564815 | 41.648 |
| 44329.797002314815 | 40.74 |
| 44329.83866898149 | 39.659 |
| 44329.88033564815 | 38.752 |
| 44329.922002314815 | 38.115 |
| 44329.96366898149 | 37.671 |
| 44330.00533564815 | 37.362 |
| 44330.047002314815 | 37.072 |
| 44330.08866898149 | 36.899 |
| 44330.13033564815 | 36.705 |
| 44330.172002314815 | 36.512 |
| 44330.21366898149 | 36.339 |
| 44330.25533564815 | 36.146 |
| 44330.297002314815 | 36.165 |
| 44330.33866898149 | 36.648 |
| 44330.38033564815 | 37.864 |
| 44330.422002314815 | 39.756 |
| 44330.46366898149 | 42.15 |
| 44330.50533564815 | 44.234 |
| 44330.547002314815 | 45.412 |
| 44330.58866898149 | 44.621 |
| 44330.63033564815 | 42.072 |
| 44330.672002314815 | 40.953 |
| 44330.71366898149 | 41.416 |
| 44330.75533564815 | 41.532 |
| 44330.797002314815 | 40.431 |
| 44330.83866898149 | 39.466 |
| 44330.88033564815 | 38.694 |
| 44330.922002314815 | 38.192 |
| 44330.96366898149 | 37.806 |
| 44331.00533564815 | 37.497 |
| 44331.047002314815 | 37.285 |
| 44331.08866898149 | 37.072 |
| 44331.13033564815 | 36.86 |
| 44331.172002314815 | 36.686 |
| 44331.21366898149 | 36.512 |
| 44331.25533564815 | 36.377 |
| 44331.297002314815 | 36.339 |
| 44331.33866898149 | 36.705 |
| 44331.38033564815 | 37.883 |
| 44331.422002314815 | 39.91 |
| 44331.46366898149 | 41.841 |
| 44331.50533564815 | 41.648 |
| 44331.547002314815 | 42.285 |
| 44331.58866898149 | 44.08 |
| 44331.63033564815 | 43.289 |
| 44331.672002314815 | 43.057 |
| 44331.71366898149 | 43.346 |
| 44331.75533564815 | 42.246 |
| 44331.797002314815 | 41.03 |
| 44331.83866898149 | 40.219 |
| 44331.88033564815 | 39.408 |
| 44331.922002314815 | 38.79 |
| 44331.96366898149 | 38.424 |
| 44332.00533564815 | 38.076 |
| 44332.047002314815 | 37.709 |
| 44332.08866898149 | 37.439 |
| 44332.13033564815 | 37.285 |
| 44332.172002314815 | 37.227 |
| 44332.21366898149 | 37.072 |
| 44332.25533564815 | 36.976 |
| 44332.297002314815 | 36.937 |
| 44332.33866898149 | 37.207 |
| 44332.38033564815 | 38.327 |
| 44332.422002314815 | 40.296 |
| 44332.46366898149 | 41.184 |
| 44332.50533564815 | 41.821 |
| 44332.547002314815 | 43.655 |
| 44332.58866898149 | 45.354 |
| 44332.63033564815 | 43.984 |
| 44332.672002314815 | 42.13 |
| 44332.71366898149 | 41.744 |
| 44332.75533564815 | 40.837 |
| 44332.797002314815 | 40.065 |
| 44332.83866898149 | 39.621 |
| 44332.88033564815 | 39.196 |
| 44332.922002314815 | 38.752 |
| 44332.96366898149 | 38.462 |
| 44333.00533564815 | 38.192 |
| 44333.047002314815 | 37.902 |
| 44333.08866898149 | 37.69 |
| 44333.13033564815 | 37.458 |
| 44333.172002314815 | 37.246 |
| 44333.21366898149 | 37.072 |
| 44333.25533564815 | 36.86 |
| 44333.297002314815 | 36.899 |
| 44333.33866898149 | 37.497 |
| 44333.38033564815 | 38.52 |
| 44333.422002314815 | 40.122 |
| 44333.46366898149 | 41.088 |
| 44333.50533564815 | 41.841 |
| 44333.547002314815 | 41.995 |
| 44333.58866898149 | 41.976 |
| 44333.63033564815 | 40.451 |
| 44333.672002314815 | 39.64 |
| 44333.71366898149 | 39.215 |
| 44333.75533564815 | 39.138 |
| 44333.797002314815 | 39.177 |
| 44333.83866898149 | 38.868 |
| 44333.88033564815 | 38.462 |
| 44333.922002314815 | 38.211 |
| 44333.96366898149 | 37.98 |
| 44334.00533564815 | 37.767 |
| 44334.047002314815 | 37.69 |
| 44334.08866898149 | 37.613 |
| 44334.13033564815 | 37.516 |
| 44334.172002314815 | 37.478 |
| 44334.21366898149 | 37.439 |
| 44334.25533564815 | 37.343 |
| 44334.297002314815 | 37.362 |
| 44334.33866898149 | 37.555 |
| 44334.38033564815 | 38.327 |
| 44334.422002314815 | 40.18 |
| 44334.46366898149 | 42.014 |
| 44334.50533564815 | 43.289 |
| 44334.547002314815 | 42.96 |
| 44334.58866898149 | 41.976 |
| 44334.63033564815 | 41.551 |
| 44334.672002314815 | 41.918 |
| 44334.71366898149 | 41.725 |
| 44334.75533564815 | 41.165 |
| 44334.797002314815 | 40.644 |
| 44334.83866898149 | 39.987 |
| 44334.88033564815 | 39.215 |
| 44334.922002314815 | 38.694 |
| 44334.96366898149 | 38.346 |
| 44335.00533564815 | 37.96 |
| 44335.047002314815 | 37.651 |
| 44335.08866898149 | 37.343 |
| 44335.13033564815 | 37.092 |
| 44335.172002314815 | 36.86 |
| 44335.21366898149 | 36.667 |
| 44335.25533564815 | 36.57 |
| 44335.297002314815 | 36.493 |
| 44335.33866898149 | 36.744 |
| 44335.38033564815 | 37.883 |
| 44335.422002314815 | 39.949 |
| 44335.46366898149 | 42.265 |
| 44335.50533564815 | 43.713 |
| 44335.547002314815 | 45.18 |
| 44335.58866898149 | 45.663 |
| 44335.63033564815 | 44.273 |
| 44335.672002314815 | 43.346 |
| 44335.71366898149 | 41.899 |
| 44335.75533564815 | 40.953 |
| 44335.797002314815 | 40.721 |
| 44335.83866898149 | 40.238 |
| 44335.88033564815 | 39.563 |
| 44335.922002314815 | 39.119 |
| 44335.96366898149 | 38.713 |
| 44336.00533564815 | 38.366 |
| 44336.047002314815 | 38.25 |
| 44336.08866898149 | 38.076 |
| 44336.13033564815 | 37.787 |
| 44336.172002314815 | 37.555 |
| 44336.21366898149 | 37.304 |
| 44336.25533564815 | 37.149 |
| 44336.297002314815 | 37.323 |
| 44336.33866898149 | 37.883 |
| 44336.38033564815 | 38.906 |
| 44336.422002314815 | 40.702 |
| 44336.46366898149 | 43.018 |
| 44336.50533564815 | 44.389 |
| 44336.547002314815 | 45.277 |
| 44336.58866898149 | 45.219 |
| 44336.63033564815 | 44.756 |
| 44336.672002314815 | 45.065 |
| 44336.71366898149 | 44.119 |
| 44336.75533564815 | 43.269 |
| 44336.797002314815 | 42.381 |
| 44336.83866898149 | 41.474 |
| 44336.88033564815 | 40.547 |
| 44336.922002314815 | 39.794 |
| 44336.96366898149 | 39.061 |
| 44337.00533564815 | 38.482 |
| 44337.047002314815 | 37.98 |
| 44337.08866898149 | 37.671 |
| 44337.13033564815 | 37.439 |
| 44337.172002314815 | 37.285 |
| 44337.21366898149 | 37.149 |
| 44337.25533564815 | 37.092 |
| 44337.297002314815 | 37.265 |
| 44337.33866898149 | 37.883 |
| 44337.38033564815 | 39.196 |
| 44337.422002314815 | 40.103 |
| 44337.46366898149 | 40.316 |
| 44337.50533564815 | 40.47 |
| 44337.547002314815 | 40.682 |
| 44337.58866898149 | 41.126 |
| 44337.63033564815 | 41.59 |
| 44337.672002314815 | 42.014 |
| 44337.71366898149 | 42.555 |
| 44337.75533564815 | 42.072 |
| 44337.797002314815 | 41.358 |
| 44337.83866898149 | 40.509 |
| 44337.88033564815 | 39.833 |
| 44337.922002314815 | 39.389 |
| 44337.96366898149 | 38.906 |
| 44338.00533564815 | 38.482 |
| 44338.047002314815 | 38.134 |
| 44338.08866898149 | 37.729 |
| 44338.13033564815 | 37.478 |
| 44338.172002314815 | 37.304 |
| 44338.21366898149 | 37.13 |
| 44338.25533564815 | 37.111 |
| 44338.297002314815 | 36.995 |
| 44338.33866898149 | 37.555 |
| 44338.38033564815 | 39.041 |
| 44338.422002314815 | 40.373 |
| 44338.46366898149 | 40.953 |
| 44338.50533564815 | 42.864 |
| 44338.547002314815 | 45.605 |
| 44338.58866898149 | 46.667 |
| 44338.63033564815 | 45.586 |
| 44338.672002314815 | 43.79 |
| 44338.71366898149 | 43.404 |
| 44338.75533564815 | 42.825 |
| 44338.797002314815 | 41.937 |
| 44338.83866898149 | 41.281 |
| 44338.88033564815 | 40.605 |
| 44338.922002314815 | 40.219 |
| 44338.96366898149 | 39.659 |
| 44339.00533564815 | 39.254 |
| 44339.047002314815 | 39.041 |
| 44339.08866898149 | 38.906 |
| 44339.13033564815 | 38.482 |
| 44339.172002314815 | 38.095 |
| 44339.21366898149 | 37.767 |
| 44339.25533564815 | 37.516 |
| 44339.297002314815 | 37.4 |
| 44339.33866898149 | 37.69 |
| 44339.38033564815 | 38.733 |
| 44339.422002314815 | 39.929 |
| 44339.46366898149 | 42.343 |
| 44339.50533564815 | 42.922 |
| 44339.547002314815 | 41.937 |
| 44339.58866898149 | 41.879 |
| 44339.63033564815 | 41.242 |
| 44339.672002314815 | 41.551 |
| 44339.71366898149 | 41.821 |
| 44339.75533564815 | 41.358 |
| 44339.797002314815 | 40.354 |
| 44339.83866898149 | 39.234 |
| 44339.88033564815 | 38.288 |
| 44339.922002314815 | 37.671 |
| 44339.96366898149 | 37.246 |
| 44340.00533564815 | 36.86 |
| 44340.047002314815 | 36.551 |
| 44340.08866898149 | 36.165 |
| 44340.13033564815 | 35.875 |
| 44340.172002314815 | 35.702 |
| 44340.21366898149 | 35.47 |
| 44340.25533564815 | 35.258 |
| 44340.297002314815 | 35.2 |
| 44340.33866898149 | 35.586 |
| 44340.38033564815 | 36.783 |
| 44340.422002314815 | 38.887 |
| 44340.46366898149 | 41.184 |
| 44340.50533564815 | 43.134 |
| 44340.547002314815 | 44.543 |
| 44340.58866898149 | 45.489 |
| 44340.63033564815 | 45.798 |
| 44340.672002314815 | 45.489 |
| 44340.71366898149 | 44.659 |
| 44340.75533564815 | 43.655 |
| 44340.797002314815 | 42.362 |
| 44340.83866898149 | 41.146 |
| 44340.88033564815 | 40.18 |
| 44340.922002314815 | 39.485 |
| 44340.96366898149 | 38.752 |
| 44341.00533564815 | 38.095 |
| 44341.047002314815 | 37.439 |
| 44341.08866898149 | 36.879 |
| 44341.13033564815 | 36.512 |
| 44341.172002314815 | 36.184 |
| 44341.21366898149 | 35.914 |
| 44341.25533564815 | 35.798 |
| 44341.297002314815 | 35.721 |
| 44341.33866898149 | 36.126 |
| 44341.38033564815 | 37.304 |
| 44341.422002314815 | 39.37 |
| 44341.46366898149 | 41.686 |
| 44341.50533564815 | 43.501 |
| 44341.547002314815 | 45.007 |
| 44341.58866898149 | 45.914 |
| 44341.63033564815 | 46.242 |
| 44341.672002314815 | 46.011 |
| 44341.71366898149 | 45.219 |
| 44341.75533564815 | 44.157 |
| 44341.797002314815 | 43.018 |
| 44341.83866898149 | 41.899 |
| 44341.88033564815 | 40.856 |
| 44341.922002314815 | 40.007 |
| 44341.96366898149 | 39.234 |
| 44342.00533564815 | 38.713 |
| 44342.047002314815 | 38.192 |
| 44342.08866898149 | 37.787 |
| 44342.13033564815 | 37.42 |
| 44342.172002314815 | 37.092 |
| 44342.21366898149 | 36.744 |
| 44342.25533564815 | 36.628 |
| 44342.297002314815 | 36.744 |
| 44342.33866898149 | 37.053 |
| 44342.38033564815 | 38.095 |
| 44342.422002314815 | 39.949 |
| 44342.46366898149 | 41.802 |
| 44342.50533564815 | 42.536 |
| 44342.547002314815 | 41.841 |
| 44342.58866898149 | 42.092 |
| 44342.63033564815 | 43.713 |
| 44342.672002314815 | 44.254 |
| 44342.71366898149 | 43.887 |
| 44342.75533564815 | 43.018 |
| 44342.797002314815 | 41.628 |
| 44342.83866898149 | 40.335 |
| 44342.88033564815 | 39.601 |
| 44342.922002314815 | 39.061 |
| 44342.96366898149 | 38.752 |
| 44343.00533564815 | 38.462 |
| 44343.047002314815 | 38.115 |
| 44343.08866898149 | 37.787 |
| 44343.13033564815 | 37.478 |
| 44343.172002314815 | 37.169 |
| 44343.21366898149 | 36.995 |
| 44343.25533564815 | 36.802 |
| 44343.297002314815 | 36.686 |
| 44343.33866898149 | 36.995 |
| 44343.38033564815 | 38.134 |
| 44343.422002314815 | 40.084 |
| 44343.46366898149 | 42.439 |
| 44343.50533564815 | 44.312 |
| 44343.547002314815 | 45.663 |
| 44343.58866898149 | 46.551 |
| 44343.63033564815 | 46.821 |
| 44343.672002314815 | 46.976 |
| 44343.71366898149 | 45.895 |
| 44343.75533564815 | 44.64 |
| 44343.797002314815 | 43.366 |
| 44343.83866898149 | 42.188 |
| 44343.88033564815 | 40.991 |
| 44343.922002314815 | 40.026 |
| 44343.96366898149 | 39.157 |
| 44344.00533564815 | 38.482 |
| 44344.047002314815 | 37.96 |
| 44344.08866898149 | 37.497 |
| 44344.13033564815 | 37.092 |
| 44344.172002314815 | 36.821 |
| 44344.21366898149 | 36.551 |
| 44344.25533564815 | 36.319 |
| 44344.297002314815 | 36.242 |
| 44344.33866898149 | 36.551 |
| 44344.38033564815 | 37.806 |
| 44344.422002314815 | 39.949 |
| 44344.46366898149 | 41.783 |
| 44344.50533564815 | 42.092 |
| 44344.547002314815 | 43.887 |
| 44344.58866898149 | 45.219 |
| 44344.63033564815 | 45.509 |
| 44344.672002314815 | 44.601 |
| 44344.71366898149 | 43.636 |
| 44344.75533564815 | 42.999 |
| 44344.797002314815 | 42.362 |
| 44344.83866898149 | 41.455 |
| 44344.88033564815 | 40.605 |
| 44344.922002314815 | 39.775 |
| 44344.96366898149 | 39.138 |
| 44345.00533564815 | 38.578 |
| 44345.047002314815 | 38.192 |
| 44345.08866898149 | 37.748 |
| 44345.13033564815 | 37.362 |
| 44345.172002314815 | 37.092 |
| 44345.21366898149 | 36.841 |
| 44345.25533564815 | 36.628 |
| 44345.297002314815 | 36.57 |
| 44345.33866898149 | 36.918 |
| 44345.38033564815 | 37.999 |
| 44345.422002314815 | 39.64 |
| 44345.46366898149 | 41.763 |
| 44345.50533564815 | 42.014 |
| 44345.547002314815 | 42.42 |
| 44345.58866898149 | 42.381 |
| 44345.63033564815 | 42.651 |
| 44345.672002314815 | 43.54 |
| 44345.71366898149 | 43.424 |
| 44345.75533564815 | 43.134 |
| 44345.797002314815 | 42.343 |
| 44345.83866898149 | 41.59 |
| 44345.88033564815 | 41.03 |
| 44345.922002314815 | 40.47 |
| 44345.96366898149 | 39.891 |
| 44346.00533564815 | 39.389 |
| 44346.047002314815 | 38.906 |
| 44346.08866898149 | 38.501 |
| 44346.13033564815 | 38.076 |
| 44346.172002314815 | 38.038 |
| 44346.21366898149 | 37.806 |
| 44346.25533564815 | 37.69 |
| 44346.297002314815 | 37.709 |
| 44346.33866898149 | 38.076 |
| 44346.38033564815 | 38.829 |
| 44346.422002314815 | 40.2 |
| 44346.46366898149 | 41.319 |
| 44346.50533564815 | 42.941 |
| 44346.547002314815 | 41.976 |
| 44346.58866898149 | 40.779 |
| 44346.63033564815 | 40.316 |
| 44346.672002314815 | 39.852 |
| 44346.71366898149 | 40.18 |
| 44346.75533564815 | 40.335 |
| 44346.797002314815 | 39.949 |
| 44346.83866898149 | 39.505 |
| 44346.88033564815 | 39.041 |
| 44346.922002314815 | 38.752 |
| 44346.96366898149 | 38.501 |
| 44347.00533564815 | 38.366 |
| 44347.047002314815 | 38.269 |
| 44347.08866898149 | 38.038 |
| 44347.13033564815 | 37.844 |
| 44347.172002314815 | 37.516 |
| 44347.21366898149 | 37.381 |
| 44347.25533564815 | 37.227 |
| 44347.297002314815 | 37.207 |
| 44347.33866898149 | 37.632 |
| 44347.38033564815 | 38.752 |
| 44347.422002314815 | 40.277 |
| 44347.46366898149 | 42.362 |
| 44347.50533564815 | 42.323 |
| 44347.547002314815 | 41.821 |
| 44347.58866898149 | 41.551 |
| 44347.63033564815 | 41.223 |
| 44347.672002314815 | 42.265 |
| 44347.71366898149 | 41.918 |
| 44347.75533564815 | 41.609 |
| 44347.797002314815 | 41.358 |
| 44347.83866898149 | 40.335 |
| 44347.88033564815 | 39.447 |
| 44347.922002314815 | 38.945 |
| 44347.96366898149 | 38.559 |
| 44348.00533564815 | 38.173 |
| 44348.047002314815 | 37.806 |
| 44348.08866898149 | 37.458 |
| 44348.13033564815 | 37.169 |
| 44348.172002314815 | 36.899 |
| 44348.21366898149 | 36.667 |
| 44348.25533564815 | 36.455 |
| 44348.297002314815 | 36.435 |
| 44348.33866898149 | 36.86 |
| 44348.38033564815 | 38.192 |
| 44348.422002314815 | 39.485 |
| 44348.46366898149 | 41.667 |
| 44348.50533564815 | 44.119 |
| 44348.547002314815 | 43.906 |
| 44348.58866898149 | 42.671 |
| 44348.63033564815 | 43.057 |
| 44348.672002314815 | 43.404 |
| 44348.71366898149 | 43.404 |
| 44348.75533564815 | 42.651 |
| 44348.797002314815 | 41.841 |
| 44348.83866898149 | 41.049 |
| 44348.88033564815 | 40.335 |
| 44348.922002314815 | 39.833 |
| 44348.96366898149 | 39.292 |
| 44349.00533564815 | 38.829 |
| 44349.047002314815 | 38.462 |
| 44349.08866898149 | 38.211 |
| 44349.13033564815 | 38.076 |
| 44349.172002314815 | 37.806 |
| 44349.21366898149 | 37.536 |
| 44349.25533564815 | 37.381 |
| 44349.297002314815 | 37.574 |
| 44349.33866898149 | 37.902 |
| 44349.38033564815 | 38.771 |
| 44349.422002314815 | 40.026 |
| 44349.46366898149 | 42.13 |
| 44349.50533564815 | 44.601 |
| 44349.547002314815 | 46.513 |
| 44349.58866898149 | 46.435 |
| 44349.63033564815 | 44.543 |
| 44349.672002314815 | 43.675 |
| 44349.71366898149 | 43.578 |
| 44349.75533564815 | 43.501 |
| 44349.797002314815 | 43.095 |
| 44349.83866898149 | 42.439 |
| 44349.88033564815 | 41.416 |
| 44349.922002314815 | 40.431 |
| 44349.96366898149 | 39.794 |
| 44350.00533564815 | 39.215 |
| 44350.047002314815 | 38.81 |
| 44350.08866898149 | 38.366 |
| 44350.13033564815 | 38.038 |
| 44350.172002314815 | 37.709 |
| 44350.21366898149 | 37.458 |
| 44350.25533564815 | 37.246 |
| 44350.297002314815 | 37.207 |
| 44350.33866898149 | 37.671 |
| 44350.38033564815 | 38.887 |
| 44350.422002314815 | 40.972 |
| 44350.46366898149 | 43.443 |
| 44350.50533564815 | 45.47 |
| 44350.547002314815 | 46.841 |
| 44350.58866898149 | 47.922 |
| 44350.63033564815 | 48.404 |
| 44350.672002314815 | 47.748 |
| 44350.71366898149 | 46.358 |
| 44350.75533564815 | 45.528 |
| 44350.797002314815 | 44.659 |
| 44350.83866898149 | 43.655 |
| 44350.88033564815 | 42.285 |
| 44350.922002314815 | 41.088 |
| 44350.96366898149 | 40.277 |
| 44351.00533564815 | 39.756 |
| 44351.047002314815 | 39.234 |
| 44351.08866898149 | 38.81 |
| 44351.13033564815 | 38.462 |
| 44351.172002314815 | 38.173 |
| 44351.21366898149 | 37.96 |
| 44351.25533564815 | 37.748 |
| 44351.297002314815 | 37.729 |
| 44351.33866898149 | 38.115 |
| 44351.38033564815 | 39.35 |
| 44351.422002314815 | 41.416 |
| 44351.46366898149 | 43.771 |
| 44351.50533564815 | 45.663 |
| 44351.547002314815 | 47.092 |
| 44351.58866898149 | 48.038 |
| 44351.63033564815 | 48.366 |
| 44351.672002314815 | 48.25 |
| 44351.71366898149 | 47.902 |
| 44351.75533564815 | 47.207 |
| 44351.797002314815 | 45.798 |
| 44351.83866898149 | 44.215 |
| 44351.88033564815 | 42.555 |
| 44351.922002314815 | 41.377 |
| 44351.96366898149 | 40.567 |
| 44352.00533564815 | 39.929 |
| 44352.047002314815 | 39.524 |
| 44352.08866898149 | 39.119 |
| 44352.13033564815 | 38.771 |
| 44352.172002314815 | 38.597 |
| 44352.21366898149 | 38.327 |
| 44352.25533564815 | 38.231 |
| 44352.297002314815 | 38.404 |
| 44352.33866898149 | 38.848 |
| 44352.38033564815 | 39.929 |
| 44352.422002314815 | 41.725 |
| 44352.46366898149 | 43.945 |
| 44352.50533564815 | 45.47 |
| 44352.547002314815 | 46.841 |
| 44352.58866898149 | 48.25 |
| 44352.63033564815 | 47.999 |
| 44352.672002314815 | 45.933 |
| 44352.71366898149 | 44.872 |
| 44352.75533564815 | 44.041 |
| 44352.797002314815 | 44.119 |
| 44352.83866898149 | 42.748 |
| 44352.88033564815 | 41.242 |
| 44352.922002314815 | 40.567 |
| 44352.96366898149 | 40.122 |
| 44353.00533564815 | 39.814 |
| 44353.047002314815 | 39.485 |
| 44353.08866898149 | 39.196 |
| 44353.13033564815 | 39.003 |
| 44353.172002314815 | 38.752 |
| 44353.21366898149 | 38.501 |
| 44353.25533564815 | 38.404 |
| 44353.297002314815 | 38.385 |
| 44353.33866898149 | 38.829 |
| 44353.38033564815 | 39.408 |
| 44353.422002314815 | 40.914 |
| 44353.46366898149 | 43.095 |
| 44353.50533564815 | 43.173 |
| 44353.547002314815 | 44.428 |
| 44353.58866898149 | 45.76 |
| 44353.63033564815 | 45.103 |
| 44353.672002314815 | 44.041 |
| 44353.71366898149 | 44.196 |
| 44353.75533564815 | 44.466 |
| 44353.797002314815 | 43.964 |
| 44353.83866898149 | 42.671 |
| 44353.88033564815 | 41.628 |
| 44353.922002314815 | 41.011 |
| 44353.96366898149 | 40.547 |
| 44354.00533564815 | 40.122 |
| 44354.047002314815 | 39.678 |
| 44354.08866898149 | 39.312 |
| 44354.13033564815 | 39.003 |
| 44354.172002314815 | 38.713 |
| 44354.21366898149 | 38.559 |
| 44354.25533564815 | 38.404 |
| 44354.297002314815 | 38.346 |
| 44354.33866898149 | 38.713 |
| 44354.38033564815 | 39.736 |
| 44354.422002314815 | 41.532 |
| 44354.46366898149 | 43.327 |
| 44354.50533564815 | 44.389 |
| 44354.547002314815 | 45.547 |
| 44354.58866898149 | 45.721 |
| 44354.63033564815 | 46.223 |
| 44354.672002314815 | 46.899 |
| 44354.71366898149 | 47.111 |
| 44354.75533564815 | 46.686 |
| 44354.797002314815 | 45.489 |
| 44354.83866898149 | 44.35 |
| 44354.88033564815 | 43.269 |
| 44354.922002314815 | 42.343 |
| 44354.96366898149 | 41.57 |
| 44355.00533564815 | 40.991 |
| 44355.047002314815 | 40.451 |
| 44355.08866898149 | 39.968 |
| 44355.13033564815 | 39.524 |
| 44355.172002314815 | 39.177 |
| 44355.21366898149 | 38.983 |
| 44355.25533564815 | 38.752 |
| 44355.297002314815 | 38.675 |
| 44355.33866898149 | 38.945 |
| 44355.38033564815 | 39.794 |
| 44355.422002314815 | 41.493 |
| 44355.46366898149 | 43.559 |
| 44355.50533564815 | 45.335 |
| 44355.547002314815 | 46.86 |
| 44355.58866898149 | 47.922 |
| 44355.63033564815 | 48.269 |
| 44355.672002314815 | 47.825 |
| 44355.71366898149 | 47.516 |
| 44355.75533564815 | 47.227 |
| 44355.797002314815 | 46.184 |
| 44355.83866898149 | 44.756 |
| 44355.88033564815 | 43.308 |
| 44355.922002314815 | 42.304 |
| 44355.96366898149 | 41.474 |
| 44356.00533564815 | 40.837 |
| 44356.047002314815 | 40.219 |
| 44356.08866898149 | 39.659 |
| 44356.13033564815 | 39.041 |
| 44356.172002314815 | 38.578 |
| 44356.21366898149 | 38.231 |
| 44356.25533564815 | 37.902 |
| 44356.297002314815 | 37.767 |
| 44356.33866898149 | 38.038 |
| 44356.38033564815 | 38.983 |
| 44356.422002314815 | 40.895 |
| 44356.46366898149 | 42.98 |
| 44356.50533564815 | 44.756 |
| 44356.547002314815 | 46.204 |
| 44356.58866898149 | 47.323 |
| 44356.63033564815 | 47.922 |
| 44356.672002314815 | 48.269 |
| 44356.71366898149 | 48.211 |
| 44356.75533564815 | 46.937 |
| 44356.797002314815 | 45.875 |
| 44356.83866898149 | 44.852 |
| 44356.88033564815 | 43.771 |
| 44356.922002314815 | 42.825 |
| 44356.96366898149 | 41.995 |
| 44357.00533564815 | 41.358 |
| 44357.047002314815 | 40.856 |
| 44357.08866898149 | 40.431 |
| 44357.13033564815 | 40.065 |
| 44357.172002314815 | 39.698 |
| 44357.21366898149 | 39.331 |
| 44357.25533564815 | 39.08 |
| 44357.297002314815 | 38.945 |
| 44357.33866898149 | 39.215 |
| 44357.38033564815 | 40.142 |
| 44357.422002314815 | 41.918 |
| 44357.46366898149 | 43.868 |
| 44357.50533564815 | 45.412 |
| 44357.547002314815 | 45.991 |
| 44357.58866898149 | 47.13 |
| 44357.63033564815 | 47.207 |
| 44357.672002314815 | 47.652 |
| 44357.71366898149 | 47.574 |
| 44357.75533564815 | 46.995 |
| 44357.797002314815 | 45.875 |
| 44357.83866898149 | 44.485 |
| 44357.88033564815 | 43.404 |
| 44357.922002314815 | 42.536 |
| 44357.96366898149 | 41.821 |
| 44358.00533564815 | 40.953 |
| 44358.047002314815 | 40.509 |
| 44358.08866898149 | 39.891 |
| 44358.13033564815 | 39.37 |
| 44358.172002314815 | 38.983 |
| 44358.21366898149 | 38.636 |
| 44358.25533564815 | 38.25 |
| 44358.297002314815 | 38.134 |
| 44358.33866898149 | 38.308 |
| 44358.38033564815 | 39.234 |
| 44358.422002314815 | 40.933 |
| 44358.46366898149 | 43.018 |
| 44358.50533564815 | 44.852 |
| 44358.547002314815 | 46.319 |
| 44358.58866898149 | 47.362 |
| 44358.63033564815 | 47.96 |
| 44358.672002314815 | 48.134 |
| 44358.71366898149 | 47.864 |
| 44358.75533564815 | 47.381 |
| 44358.797002314815 | 46.532 |
| 44358.83866898149 | 45.316 |
| 44358.88033564815 | 44.099 |
| 44358.922002314815 | 43.115 |
| 44358.96366898149 | 42.304 |
| 44359.00533564815 | 41.551 |
| 44359.047002314815 | 40.991 |
| 44359.08866898149 | 40.373 |
| 44359.13033564815 | 39.852 |
| 44359.172002314815 | 39.408 |
| 44359.21366898149 | 39.003 |
| 44359.25533564815 | 38.655 |
| 44359.297002314815 | 38.501 |
| 44359.33866898149 | 38.752 |
| 44359.38033564815 | 39.756 |
| 44359.422002314815 | 41.609 |
| 44359.46366898149 | 43.655 |
| 44359.50533564815 | 45.316 |
| 44359.547002314815 | 46.744 |
| 44359.58866898149 | 47.748 |
| 44359.63033564815 | 48.327 |
| 44359.672002314815 | 48.424 |
| 44359.71366898149 | 48.231 |
| 44359.75533564815 | 47.69 |
| 44359.797002314815 | 46.821 |
| 44359.83866898149 | 45.624 |
| 44359.88033564815 | 44.485 |
| 44359.922002314815 | 43.501 |
| 44359.96366898149 | 42.671 |
| 44360.00533564815 | 41.956 |
| 44360.047002314815 | 41.242 |
| 44360.08866898149 | 40.644 |
| 44360.13033564815 | 40.18 |
| 44360.172002314815 | 39.794 |
| 44360.21366898149 | 39.447 |
| 44360.25533564815 | 39.157 |
| 44360.297002314815 | 39.099 |
| 44360.33866898149 | 39.389 |
| 44360.38033564815 | 40.431 |
| 44360.422002314815 | 42.285 |
| 44360.46366898149 | 44.292 |
| 44360.50533564815 | 46.165 |
| 44360.547002314815 | 47.748 |
| 44360.58866898149 | 48.675 |
| 44360.63033564815 | 48.404 |
| 44360.672002314815 | 47.864 |
| 44360.71366898149 | 48.211 |
| 44360.75533564815 | 47.709 |
| 44360.797002314815 | 46.899 |
| 44360.83866898149 | 45.779 |
| 44360.88033564815 | 44.698 |
| 44360.922002314815 | 44.022 |
| 44360.96366898149 | 43.462 |
| 44361.00533564815 | 42.825 |
| 44361.047002314815 | 42.362 |
| 44361.08866898149 | 41.821 |
| 44361.13033564815 | 41.358 |
| 44361.172002314815 | 40.991 |
| 44361.21366898149 | 40.663 |
| 44361.25533564815 | 40.431 |
| 44361.297002314815 | 40.296 |
| 44361.33866898149 | 40.47 |
| 44361.38033564815 | 41.397 |
| 44361.422002314815 | 43.095 |
| 44361.46366898149 | 44.814 |
| 44361.50533564815 | 45.431 |
| 44361.547002314815 | 46.358 |
| 44361.58866898149 | 46.976 |
| 44361.63033564815 | 47.207 |
| 44361.672002314815 | 46.551 |
| 44361.71366898149 | 45.76 |
| 44361.75533564815 | 45.238 |
| 44361.797002314815 | 44.466 |
| 44361.83866898149 | 43.655 |
| 44361.88033564815 | 42.825 |
| 44361.922002314815 | 42.285 |
| 44361.96366898149 | 41.783 |
| 44362.00533564815 | 41.339 |
| 44362.047002314815 | 40.991 |
| 44362.08866898149 | 40.702 |
| 44362.13033564815 | 40.412 |
| 44362.172002314815 | 40.142 |
| 44362.21366898149 | 39.949 |
| 44362.25533564815 | 39.833 |
| 44362.297002314815 | 39.794 |
| 44362.33866898149 | 40.2 |
| 44362.38033564815 | 41.011 |
| 44362.422002314815 | 42.42 |
| 44362.46366898149 | 43.829 |
| 44362.50533564815 | 44.949 |
| 44362.547002314815 | 45.74 |
| 44362.58866898149 | 46.146 |
| 44362.63033564815 | 46.165 |
| 44362.672002314815 | 45.991 |
| 44362.71366898149 | 45.682 |
| 44362.75533564815 | 45.045 |
| 44362.797002314815 | 44.312 |
| 44362.83866898149 | 43.733 |
| 44362.88033564815 | 43.115 |
| 44362.922002314815 | 42.536 |
| 44362.96366898149 | 42.092 |
| 44363.00533564815 | 41.763 |
| 44363.047002314815 | 41.358 |
| 44363.08866898149 | 41.107 |
| 44363.13033564815 | 40.817 |
| 44363.172002314815 | 40.528 |
| 44363.21366898149 | 40.296 |
| 44363.25533564815 | 40.122 |
| 44363.297002314815 | 40.161 |
| 44363.33866898149 | 40.509 |
| 44363.38033564815 | 41.223 |
| 44363.422002314815 | 42.381 |
| 44363.46366898149 | 43.636 |
| 44363.50533564815 | 43.984 |
| 44363.547002314815 | 44.698 |
| 44363.58866898149 | 43.906 |
| 44363.63033564815 | 44.138 |
| 44363.672002314815 | 44.254 |
| 44363.71366898149 | 43.945 |
| 44363.75533564815 | 43.945 |
| 44363.797002314815 | 43.617 |
| 44363.83866898149 | 43.134 |
| 44363.88033564815 | 42.787 |
| 44363.922002314815 | 42.42 |
| 44363.96366898149 | 41.995 |
| 44364.00533564815 | 41.628 |
| 44364.047002314815 | 41.416 |
| 44364.08866898149 | 41.184 |
| 44364.13033564815 | 40.895 |
| 44364.172002314815 | 40.624 |
| 44364.21366898149 | 40.373 |
| 44364.25533564815 | 40.238 |
| 44364.297002314815 | 40.142 |
| 44364.33866898149 | 40.373 |
| 44364.38033564815 | 41.068 |
| 44364.422002314815 | 42.362 |
| 44364.46366898149 | 43.675 |
| 44364.50533564815 | 44.099 |
| 44364.547002314815 | 44.466 |
| 44364.58866898149 | 44.968 |
| 44364.63033564815 | 45.605 |
| 44364.672002314815 | 45.663 |
| 44364.71366898149 | 44.389 |
| 44364.75533564815 | 43.559 |
| 44364.797002314815 | 43.269 |
| 44364.83866898149 | 43.038 |
| 44364.88033564815 | 42.536 |
| 44364.922002314815 | 42.169 |
| 44364.96366898149 | 41.995 |
| 44365.00533564815 | 41.821 |
| 44365.047002314815 | 41.455 |
| 44365.08866898149 | 41.184 |
| 44365.13033564815 | 40.895 |
| 44365.172002314815 | 40.663 |
| 44365.21366898149 | 40.47 |
| 44365.25533564815 | 40.219 |
| 44365.297002314815 | 40.219 |
| 44365.33866898149 | 40.451 |
| 44365.38033564815 | 41.011 |
| 44365.422002314815 | 41.879 |
| 44365.46366898149 | 42.304 |
| 44365.50533564815 | 42.806 |
| 44365.547002314815 | 43.366 |
| 44365.58866898149 | 44.292 |
| 44365.63033564815 | 44.138 |
| 44365.672002314815 | 43.173 |
| 44365.71366898149 | 43.153 |
| 44365.75533564815 | 42.806 |
| 44365.797002314815 | 42.381 |
| 44365.83866898149 | 42.111 |
| 44365.88033564815 | 41.899 |
| 44365.922002314815 | 41.667 |
| 44365.96366898149 | 41.551 |
| 44366.00533564815 | 41.223 |
| 44366.047002314815 | 40.933 |
| 44366.08866898149 | 40.682 |
| 44366.13033564815 | 40.586 |
| 44366.172002314815 | 40.509 |
| 44366.21366898149 | 40.238 |
| 44366.25533564815 | 40.103 |
| 44366.297002314815 | 40.122 |
| 44366.33866898149 | 40.258 |
| 44366.38033564815 | 40.605 |
| 44366.422002314815 | 42.15 |
| 44366.46366898149 | 43.926 |
| 44366.50533564815 | 42.632 |
| 44366.547002314815 | 42.285 |
| 44366.58866898149 | 42.748 |
| 44366.63033564815 | 44.485 |
| 44366.672002314815 | 43.906 |
| 44366.71366898149 | 42.999 |
| 44366.75533564815 | 42.651 |
| 44366.797002314815 | 42.516 |
| 44366.83866898149 | 42.304 |
| 44366.88033564815 | 41.783 |
| 44366.922002314815 | 41.435 |
| 44366.96366898149 | 41.223 |
| 44367.00533564815 | 40.933 |
| 44367.047002314815 | 40.624 |
| 44367.08866898149 | 40.431 |
| 44367.13033564815 | 40.258 |
| 44367.172002314815 | 40.142 |
| 44367.21366898149 | 39.929 |
| 44367.25533564815 | 39.736 |
| 44367.297002314815 | 39.794 |
| 44367.33866898149 | 40.219 |
| 44367.38033564815 | 40.779 |
| 44367.422002314815 | 42.265 |
| 44367.46366898149 | 43.694 |
| 44367.50533564815 | 44.698 |
| 44367.547002314815 | 45.798 |
| 44367.58866898149 | 44.428 |
| 44367.63033564815 | 43.308 |
| 44367.672002314815 | 43.424 |
| 44367.71366898149 | 42.922 |
| 44367.75533564815 | 42.883 |
| 44367.797002314815 | 42.304 |
| 44367.83866898149 | 41.86 |
| 44367.88033564815 | 41.532 |
| 44367.922002314815 | 41.242 |
| 44367.96366898149 | 41.011 |
| 44368.00533564815 | 40.991 |
| 44368.047002314815 | 40.837 |
| 44368.08866898149 | 40.528 |
| 44368.13033564815 | 40.316 |
| 44368.172002314815 | 40.103 |
| 44368.21366898149 | 39.949 |
| 44368.25533564815 | 39.833 |
| 44368.297002314815 | 39.833 |
| 44368.33866898149 | 40.219 |
| 44368.38033564815 | 41.068 |
| 44368.422002314815 | 42.362 |
| 44368.46366898149 | 43.752 |
| 44368.50533564815 | 44.891 |
| 44368.547002314815 | 45.605 |
| 44368.58866898149 | 46.088 |
| 44368.63033564815 | 46.088 |
| 44368.672002314815 | 45.509 |
| 44368.71366898149 | 44.505 |
| 44368.75533564815 | 44.177 |
| 44368.797002314815 | 43.578 |
| 44368.83866898149 | 42.767 |
| 44368.88033564815 | 42.092 |
| 44368.922002314815 | 41.59 |
| 44368.96366898149 | 41.242 |
| 44369.00533564815 | 40.933 |
| 44369.047002314815 | 40.702 |
| 44369.08866898149 | 40.489 |
| 44369.13033564815 | 40.316 |
| 44369.172002314815 | 40.084 |
| 44369.21366898149 | 39.872 |
| 44369.25533564815 | 39.698 |
| 44369.297002314815 | 39.717 |
| 44369.33866898149 | 40.103 |
| 44369.38033564815 | 40.953 |
| 44369.422002314815 | 42.323 |
| 44369.46366898149 | 43.424 |
| 44369.50533564815 | 43.501 |
| 44369.547002314815 | 44.428 |
| 44369.58866898149 | 45.412 |
| 44369.63033564815 | 44.543 |
| 44369.672002314815 | 44.08 |
| 44369.71366898149 | 43.829 |
| 44369.75533564815 | 43.54 |
| 44369.797002314815 | 43.095 |
| 44369.83866898149 | 42.169 |
| 44369.88033564815 | 41.474 |
| 44369.922002314815 | 41.261 |
| 44369.96366898149 | 41.088 |
| 44370.00533564815 | 40.933 |
| 44370.047002314815 | 40.702 |
| 44370.08866898149 | 40.567 |
| 44370.13033564815 | 40.316 |
| 44370.172002314815 | 40.084 |
| 44370.21366898149 | 39.872 |
| 44370.25533564815 | 39.794 |
| 44370.297002314815 | 39.872 |
| 44370.33866898149 | 40.219 |
| 44370.38033564815 | 40.933 |
| 44370.422002314815 | 41.763 |
| 44370.46366898149 | 42.4 |
| 44370.50533564815 | 42.864 |
| 44370.547002314815 | 42.497 |
| 44370.58866898149 | 42.285 |
| 44370.63033564815 | 42.825 |
| 44370.672002314815 | 43.038 |
| 44370.71366898149 | 43.115 |
| 44370.75533564815 | 42.613 |
| 44370.797002314815 | 41.937 |
| 44370.83866898149 | 41.455 |
| 44370.88033564815 | 41.184 |
| 44370.922002314815 | 41.088 |
| 44370.96366898149 | 41.107 |
| 44371.00533564815 | 41.146 |
| 44371.047002314815 | 41.049 |
| 44371.08866898149 | 40.914 |
| 44371.13033564815 | 40.798 |
| 44371.172002314815 | 40.817 |
| 44371.21366898149 | 40.817 |
| 44371.25533564815 | 40.663 |
| 44371.297002314815 | 40.605 |
| 44371.33866898149 | 40.76 |
| 44371.38033564815 | 41.512 |
| 44371.422002314815 | 41.628 |
| 44371.46366898149 | 41.783 |
| 44371.50533564815 | 41.821 |
| 44371.547002314815 | 43.327 |
| 44371.58866898149 | 44.234 |
| 44371.63033564815 | 43.192 |
| 44371.672002314815 | 42.632 |
| 44371.71366898149 | 42.014 |
| 44371.75533564815 | 42.034 |
| 44371.797002314815 | 41.648 |
| 44371.83866898149 | 41.416 |
| 44371.88033564815 | 41.319 |
| 44371.922002314815 | 41.146 |
| 44371.96366898149 | 40.856 |
| 44372.00533564815 | 40.605 |
| 44372.047002314815 | 40.412 |
| 44372.08866898149 | 40.316 |
| 44372.13033564815 | 40.122 |
| 44372.172002314815 | 40.084 |
| 44372.21366898149 | 39.987 |
| 44372.25533564815 | 39.872 |
| 44372.297002314815 | 39.91 |
| 44372.33866898149 | 39.949 |
| 44372.38033564815 | 40.586 |
| 44372.422002314815 | 42.285 |
| 44372.46366898149 | 43.346 |
| 44372.50533564815 | 44.659 |
| 44372.547002314815 | 44.64 |
| 44372.58866898149 | 43.559 |
| 44372.63033564815 | 43.424 |
| 44372.672002314815 | 43.964 |
| 44372.71366898149 | 43.366 |
| 44372.75533564815 | 42.651 |
| 44372.797002314815 | 42.632 |
| 44372.83866898149 | 41.86 |
| 44372.88033564815 | 41.435 |
| 44372.922002314815 | 41.242 |
| 44372.96366898149 | 41.358 |
| 44373.00533564815 | 41.319 |
| 44373.047002314815 | 41.146 |
| 44373.08866898149 | 40.895 |
| 44373.13033564815 | 40.953 |
| 44373.172002314815 | 41.126 |
| 44373.21366898149 | 41.146 |
| 44373.25533564815 | 40.933 |
| 44373.297002314815 | 40.76 |
| 44373.33866898149 | 41.068 |
| 44373.38033564815 | 41.609 |
| 44373.422002314815 | 42.574 |
| 44373.46366898149 | 42.922 |
| 44373.50533564815 | 43.308 |
| 44373.547002314815 | 44.794 |
| 44373.58866898149 | 44.389 |
| 44373.63033564815 | 44.814 |
| 44373.672002314815 | 44.505 |
| 44373.71366898149 | 43.54 |
| 44373.75533564815 | 43.076 |
| 44373.797002314815 | 42.227 |
| 44373.83866898149 | 41.455 |
| 44373.88033564815 | 41.339 |
| 44373.922002314815 | 41.146 |
| 44373.96366898149 | 40.895 |
| 44374.00533564815 | 40.663 |
| 44374.047002314815 | 40.547 |
| 44374.08866898149 | 40.547 |
| 44374.13033564815 | 40.412 |
| 44374.172002314815 | 40.528 |
| 44374.21366898149 | 40.586 |
| 44374.25533564815 | 40.509 |
| 44374.297002314815 | 40.373 |
| 44374.33866898149 | 40.586 |
| 44374.38033564815 | 41.358 |
| 44374.422002314815 | 42.555 |
| 44374.46366898149 | 43.655 |
| 44374.50533564815 | 44.138 |
| 44374.547002314815 | 44.949 |
| 44374.58866898149 | 45.972 |
| 44374.63033564815 | 45.431 |
| 44374.672002314815 | 44.138 |
| 44374.71366898149 | 43.385 |
| 44374.75533564815 | 43.231 |
| 44374.797002314815 | 42.304 |
| 44374.83866898149 | 41.725 |
| 44374.88033564815 | 41.204 |
| 44374.922002314815 | 40.972 |
| 44374.96366898149 | 40.856 |
| 44375.00533564815 | 40.682 |
| 44375.047002314815 | 40.567 |
| 44375.08866898149 | 40.277 |
| 44375.13033564815 | 40.026 |
| 44375.172002314815 | 39.891 |
| 44375.21366898149 | 39.929 |
| 44375.25533564815 | 39.736 |
| 44375.297002314815 | 39.872 |
| 44375.33866898149 | 40.335 |
| 44375.38033564815 | 40.586 |
| 44375.422002314815 | 41.995 |
| 44375.46366898149 | 43.694 |
| 44375.50533564815 | 45.065 |
| 44375.547002314815 | 45.431 |
| 44375.58866898149 | 45.624 |
| 44375.63033564815 | 45.373 |
| 44375.672002314815 | 45.586 |
| 44375.71366898149 | 45.045 |
| 44375.75533564815 | 43.289 |
| 44375.797002314815 | 43.655 |
| 44375.83866898149 | 43.018 |
| 44375.88033564815 | 42.574 |
| 44375.922002314815 | 42.42 |
| 44375.96366898149 | 42.478 |
| 44376.00533564815 | 42.285 |
| 44376.047002314815 | 42.458 |
| 44376.08866898149 | 42.516 |
| 44376.13033564815 | 42.613 |
| 44376.172002314815 | 42.478 |
| 44376.21366898149 | 42.4 |
| 44376.25533564815 | 42.265 |
| 44376.297002314815 | 42.458 |
| 44376.33866898149 | 42.864 |
| 44376.38033564815 | 43.617 |
| 44376.422002314815 | 45.026 |
| 44376.46366898149 | 46.474 |
| 44376.50533564815 | 47.323 |
| 44376.547002314815 | 46.821 |
| 44376.58866898149 | 46.995 |
| 44376.63033564815 | 48.115 |
| 44376.672002314815 | 47.014 |
| 44376.71366898149 | 46.126 |
| 44376.75533564815 | 46.011 |
| 44376.797002314815 | 46.068 |
| 44376.83866898149 | 46.165 |
| 44376.88033564815 | 46.319 |
| 44376.922002314815 | 46.416 |
| 44376.96366898149 | 46.358 |
| 44377.00533564815 | 46.3 |
| 44377.047002314815 | 46.223 |
| 44377.08866898149 | 46.223 |
| 44377.13033564815 | 46.165 |
| 44377.172002314815 | 46.184 |
| 44377.21366898149 | 46.126 |
| 44377.25533564815 | 46.126 |
| 44377.297002314815 | 46.146 |
| 44377.33866898149 | 46.551 |
| 44377.38033564815 | 47.285 |
| 44377.422002314815 | 48.424 |
| 44377.46366898149 | 49.679 |
| 44377.50533564815 | 50.991 |
| 44377.547002314815 | 51.319 |
| 44377.58866898149 | 50.721 |
| 44377.63033564815 | 50.605 |
| 44377.672002314815 | 49.814 |
| 44377.71366898149 | 50.393 |
| 44377.75533564815 | 49.64 |
| 44377.797002314815 | 49.254 |
| 44377.83866898149 | 49.022 |
| 44377.88033564815 | 48.887 |
| 44377.922002314815 | 48.906 |
| 44377.96366898149 | 49.041 |
| 44378.00533564815 | 49.254 |
| 44378.047002314815 | 49.235 |
| 44378.08866898149 | 49.235 |
| 44378.13033564815 | 49.196 |
| 44378.172002314815 | 49.215 |
| 44378.21366898149 | 49.292 |
| 44378.25533564815 | 49.235 |
| 44378.297002314815 | 49.273 |
| 44378.33866898149 | 49.485 |
| 44378.38033564815 | 49.93 |
| 44378.422002314815 | 50.818 |
| 44378.46366898149 | 51.841 |
| 44378.50533564815 | 52.555 |
| 44378.547002314815 | 52.594 |
| 44378.58866898149 | 52.362 |
| 44378.63033564815 | 51.686 |
| 44378.672002314815 | 51.59 |
| 44378.71366898149 | 51.957 |
| 44378.75533564815 | 51.493 |
| 44378.797002314815 | 51.3 |
| 44378.83866898149 | 50.972 |
| 44378.88033564815 | 50.818 |
| 44378.922002314815 | 50.721 |
| 44378.96366898149 | 50.528 |
| 44379.00533564815 | 50.431 |
| 44379.047002314815 | 50.412 |
| 44379.08866898149 | 50.335 |
| 44379.13033564815 | 50.2 |
| 44379.172002314815 | 50.045 |
| 44379.21366898149 | 49.872 |
| 44379.25533564815 | 49.775 |
| 44379.297002314815 | 49.814 |
| 44379.33866898149 | 50.103 |
| 44379.38033564815 | 50.644 |
| 44379.422002314815 | 51.551 |
| 44379.46366898149 | 52.516 |
| 44379.50533564815 | 53.057 |
| 44379.547002314815 | 52.883 |
| 44379.58866898149 | 53.733 |
| 44379.63033564815 | 52.574 |
| 44379.672002314815 | 51.937 |
| 44379.71366898149 | 51.686 |
| 44379.75533564815 | 51.706 |
| 44379.797002314815 | 51.319 |
| 44379.83866898149 | 50.972 |
| 44379.88033564815 | 50.644 |
| 44379.922002314815 | 50.509 |
| 44379.96366898149 | 50.412 |
| 44380.00533564815 | 50.277 |
| 44380.047002314815 | 50.238 |
| 44380.08866898149 | 50.142 |
| 44380.13033564815 | 49.968 |
| 44380.172002314815 | 49.872 |
| 44380.21366898149 | 49.756 |
| 44380.25533564815 | 49.717 |
| 44380.297002314815 | 49.679 |
| 44380.33866898149 | 49.987 |
| 44380.38033564815 | 50.567 |
| 44380.422002314815 | 51.532 |
| 44380.46366898149 | 52.574 |
| 44380.50533564815 | 52.072 |
| 44380.547002314815 | 51.551 |
| 44380.58866898149 | 52.98 |
| 44380.63033564815 | 52.806 |
| 44380.672002314815 | 53.578 |
| 44380.71366898149 | 52.999 |
| 44380.75533564815 | 52.265 |
| 44380.797002314815 | 51.764 |
| 44380.83866898149 | 51.358 |
| 44380.88033564815 | 50.972 |
| 44380.922002314815 | 50.875 |
| 44380.96366898149 | 50.856 |
| 44381.00533564815 | 50.76 |
| 44381.047002314815 | 50.721 |
| 44381.08866898149 | 50.682 |
| 44381.13033564815 | 50.547 |
| 44381.172002314815 | 50.354 |
| 44381.21366898149 | 50.2 |
| 44381.25533564815 | 50.142 |
| 44381.297002314815 | 50.219 |
| 44381.33866898149 | 50.451 |
| 44381.38033564815 | 51.011 |
| 44381.422002314815 | 51.937 |
| 44381.46366898149 | 52.941 |
| 44381.50533564815 | 53.347 |
| 44381.547002314815 | 53.829 |
| 44381.58866898149 | 54.022 |
| 44381.63033564815 | 52.787 |
| 44381.672002314815 | 52.555 |
| 44381.71366898149 | 51.995 |
| 44381.75533564815 | 51.744 |
| 44381.797002314815 | 51.725 |
| 44381.83866898149 | 51.146 |
| 44381.88033564815 | 50.991 |
| 44381.922002314815 | 50.875 |
| 44381.96366898149 | 50.837 |
| 44382.00533564815 | 50.76 |
| 44382.047002314815 | 50.682 |
| 44382.08866898149 | 50.682 |
| 44382.13033564815 | 50.605 |
| 44382.172002314815 | 50.374 |
| 44382.21366898149 | 50.238 |
| 44382.25533564815 | 50.161 |
| 44382.297002314815 | 50.161 |
| 44382.33866898149 | 50.393 |
| 44382.38033564815 | 50.856 |
| 44382.422002314815 | 51.802 |
| 44382.46366898149 | 52.806 |
| 44382.50533564815 | 52.594 |
| 44382.547002314815 | 53.81 |
| 44382.58866898149 | 53.617 |
| 44382.63033564815 | 53.945 |
| 44382.672002314815 | 52.729 |
| 44382.71366898149 | 51.976 |
| 44382.75533564815 | 52.362 |
| 44382.797002314815 | 52.362 |
| 44382.83866898149 | 51.821 |
| 44382.88033564815 | 51.59 |
| 44382.922002314815 | 51.551 |
| 44382.96366898149 | 51.397 |
| 44383.00533564815 | 51.358 |
| 44383.047002314815 | 51.3 |
| 44383.08866898149 | 51.3 |
| 44383.13033564815 | 51.184 |
| 44383.172002314815 | 51.146 |
| 44383.21366898149 | 51.088 |
| 44383.25533564815 | 51.03 |
| 44383.297002314815 | 51.069 |
| 44383.33866898149 | 51.281 |
| 44383.38033564815 | 51.802 |
| 44383.422002314815 | 52.709 |
| 44383.46366898149 | 53.636 |
| 44383.50533564815 | 54.273 |
| 44383.547002314815 | 54.737 |
| 44383.58866898149 | 54.814 |
| 44383.63033564815 | 54.621 |
| 44383.672002314815 | 54.35 |
| 44383.71366898149 | 53.868 |
| 44383.75533564815 | 53.385 |
| 44383.797002314815 | 52.652 |
| 44383.83866898149 | 52.208 |
| 44383.88033564815 | 51.976 |
| 44383.922002314815 | 51.899 |
| 44383.96366898149 | 51.86 |
| 44384.00533564815 | 51.802 |
| 44384.047002314815 | 51.706 |
| 44384.08866898149 | 51.493 |
| 44384.13033564815 | 51.377 |
| 44384.172002314815 | 51.204 |
| 44384.21366898149 | 51.069 |
| 44384.25533564815 | 50.914 |
| 44384.297002314815 | 50.76 |
| 44384.33866898149 | 50.991 |
| 44384.38033564815 | 51.551 |
| 44384.422002314815 | 52.478 |
| 44384.46366898149 | 53.404 |
| 44384.50533564815 | 54.061 |
| 44384.547002314815 | 54.621 |
| 44384.58866898149 | 54.872 |
| 44384.63033564815 | 54.968 |
| 44384.672002314815 | 54.486 |
| 44384.71366898149 | 53.984 |
| 44384.75533564815 | 53.385 |
| 44384.797002314815 | 52.825 |
| 44384.83866898149 | 52.478 |
| 44384.88033564815 | 52.401 |
| 44384.922002314815 | 52.285 |
| 44384.96366898149 | 52.072 |
| 44385.00533564815 | 51.86 |
| 44385.047002314815 | 51.686 |
| 44385.08866898149 | 51.59 |
| 44385.13033564815 | 51.493 |
| 44385.172002314815 | 51.319 |
| 44385.21366898149 | 51.223 |
| 44385.25533564815 | 51.107 |
| 44385.297002314815 | 50.895 |
| 44385.33866898149 | 51.146 |
| 44385.38033564815 | 51.165 |
| 44385.422002314815 | 52.362 |
| 44385.46366898149 | 53.269 |
| 44385.50533564815 | 54.254 |
| 44385.547002314815 | 54.312 |
| 44385.58866898149 | 54.215 |
| 44385.63033564815 | 54.447 |
| 44385.672002314815 | 53.057 |
| 44385.71366898149 | 52.478 |
| 44385.75533564815 | 52.227 |
| 44385.797002314815 | 51.879 |
| 44385.83866898149 | 51.532 |
| 44385.88033564815 | 51.107 |
| 44385.922002314815 | 50.856 |
| 44385.96366898149 | 50.779 |
| 44386.00533564815 | 50.721 |
| 44386.047002314815 | 50.605 |
| 44386.08866898149 | 50.509 |
| 44386.13033564815 | 50.412 |
| 44386.172002314815 | 50.374 |
| 44386.21366898149 | 50.393 |
| 44386.25533564815 | 50.316 |
| 44386.297002314815 | 50.277 |
| 44386.33866898149 | 50.18 |
| 44386.38033564815 | 50.818 |
| 44386.422002314815 | 51.995 |
| 44386.46366898149 | 53.076 |
| 44386.50533564815 | 53.153 |
| 44386.547002314815 | 52.709 |
| 44386.58866898149 | 52.999 |
| 44386.63033564815 | 52.188 |
| 44386.672002314815 | 52.227 |
| 44386.71366898149 | 52.246 |
| 44386.75533564815 | 51.57 |
| 44386.797002314815 | 51.706 |
| 44386.83866898149 | 51.184 |
| 44386.88033564815 | 50.818 |
| 44386.922002314815 | 50.682 |
| 44386.96366898149 | 50.354 |
| 44387.00533564815 | 50.238 |
| 44387.047002314815 | 50.123 |
| 44387.08866898149 | 49.93 |
| 44387.13033564815 | 49.717 |
| 44387.172002314815 | 49.466 |
| 44387.21366898149 | 49.312 |
| 44387.25533564815 | 49.254 |
| 44387.297002314815 | 49.157 |
| 44387.33866898149 | 49.254 |
| 44387.38033564815 | 49.756 |
| 44387.422002314815 | 50.74 |
| 44387.46366898149 | 51.686 |
| 44387.50533564815 | 52.362 |
| 44387.547002314815 | 52.709 |
| 44387.58866898149 | 52.98 |
| 44387.63033564815 | 52.806 |
| 44387.672002314815 | 52.304 |
| 44387.71366898149 | 51.725 |
| 44387.75533564815 | 51.011 |
| 44387.797002314815 | 50.335 |
| 44387.83866898149 | 49.833 |
| 44387.88033564815 | 49.447 |
| 44387.922002314815 | 49.292 |
| 44387.96366898149 | 49.119 |
| 44388.00533564815 | 48.964 |
| 44388.047002314815 | 48.81 |
| 44388.08866898149 | 48.636 |
| 44388.13033564815 | 48.443 |
| 44388.172002314815 | 48.192 |
| 44388.21366898149 | 48.018 |
| 44388.25533564815 | 47.845 |
| 44388.297002314815 | 47.845 |
| 44388.33866898149 | 48.038 |
| 44388.38033564815 | 48.559 |
| 44388.422002314815 | 49.543 |
| 44388.46366898149 | 50.605 |
| 44388.50533564815 | 51.242 |
| 44388.547002314815 | 51.744 |
| 44388.58866898149 | 51.976 |
| 44388.63033564815 | 51.686 |
| 44388.672002314815 | 51.339 |
| 44388.71366898149 | 50.76 |
| 44388.75533564815 | 50.065 |
| 44388.797002314815 | 49.447 |
| 44388.83866898149 | 48.906 |
| 44388.88033564815 | 48.501 |
| 44388.922002314815 | 48.231 |
| 44388.96366898149 | 48.076 |
| 44389.00533564815 | 47.941 |
| 44389.047002314815 | 47.729 |
| 44389.08866898149 | 47.632 |
| 44389.13033564815 | 47.516 |
| 44389.172002314815 | 47.458 |
| 44389.21366898149 | 47.362 |
| 44389.25533564815 | 46.995 |
| 44389.297002314815 | 46.86 |
| 44389.33866898149 | 47.13 |
| 44389.38033564815 | 47.613 |
| 44389.422002314815 | 48.482 |
| 44389.46366898149 | 49.524 |
| 44389.50533564815 | 50.374 |
| 44389.547002314815 | 50.856 |
| 44389.58866898149 | 51.223 |
| 44389.63033564815 | 51.107 |
| 44389.672002314815 | 50.509 |
| 44389.71366898149 | 49.466 |
| 44389.75533564815 | 48.346 |
| 44389.797002314815 | 48.153 |
| 44389.83866898149 | 47.497 |
| 44389.88033564815 | 46.918 |
| 44389.922002314815 | 46.609 |
| 44389.96366898149 | 46.339 |
| 44390.00533564815 | 46.3 |
| 44390.047002314815 | 46.3 |
| 44390.08866898149 | 46.165 |
| 44390.13033564815 | 45.895 |
| 44390.172002314815 | 45.779 |
| 44390.21366898149 | 45.586 |
| 44390.25533564815 | 45.451 |
| 44390.297002314815 | 45.316 |
| 44390.33866898149 | 45.451 |
| 44390.38033564815 | 46.03 |
| 44390.422002314815 | 46.725 |
| 44390.46366898149 | 47.362 |
| 44390.50533564815 | 46.841 |
| 44390.547002314815 | 47.767 |
| 44390.58866898149 | 49.003 |
| 44390.63033564815 | 48.115 |
| 44390.672002314815 | 47.748 |
| 44390.71366898149 | 46.455 |
| 44390.75533564815 | 45.837 |
| 44390.797002314815 | 45.412 |
| 44390.83866898149 | 45.238 |
| 44390.88033564815 | 45.045 |
| 44390.922002314815 | 44.91 |
| 44390.96366898149 | 44.794 |
| 44391.00533564815 | 44.833 |
| 44391.047002314815 | 44.466 |
| 44391.08866898149 | 44.157 |
| 44391.13033564815 | 44.08 |
| 44391.172002314815 | 43.829 |
| 44391.21366898149 | 43.713 |
| 44391.25533564815 | 43.443 |
| 44391.297002314815 | 43.424 |
| 44391.33866898149 | 43.443 |
| 44391.38033564815 | 43.617 |
| 44391.422002314815 | 43.655 |
| 44391.46366898149 | 43.848 |
| 44391.50533564815 | 44.447 |
| 44391.547002314815 | 44.794 |
| 44391.58866898149 | 44.929 |
| 44391.63033564815 | 44.852 |
| 44391.672002314815 | 44.428 |
| 44391.71366898149 | 44.177 |
| 44391.75533564815 | 44.37 |
| 44391.797002314815 | 44.582 |
| 44391.83866898149 | 43.868 |
| 44391.88033564815 | 43.559 |
| 44391.922002314815 | 43.346 |
| 44391.96366898149 | 43.095 |
| 44392.00533564815 | 42.748 |
| 44392.047002314815 | 42.497 |
| 44392.08866898149 | 42.381 |
| 44392.13033564815 | 42.227 |
| 44392.172002314815 | 42.072 |
| 44392.21366898149 | 41.976 |
| 44392.25533564815 | 41.899 |
| 44392.297002314815 | 41.879 |
| 44392.33866898149 | 42.092 |
| 44392.38033564815 | 42.632 |
| 44392.422002314815 | 43.79 |
| 44392.46366898149 | 45.2 |
| 44392.50533564815 | 46.339 |
| 44392.547002314815 | 47.034 |
| 44392.58866898149 | 46.995 |
| 44392.63033564815 | 47.902 |
| 44392.672002314815 | 47.497 |
| 44392.71366898149 | 46.435 |
| 44392.75533564815 | 46.068 |
| 44392.797002314815 | 45.277 |
| 44392.83866898149 | 44.292 |
| 44392.88033564815 | 43.655 |
| 44392.922002314815 | 43.346 |
| 44392.96366898149 | 43.964 |
| 44393.00533564815 | 43.366 |
| 44393.047002314815 | 42.98 |
| 44393.08866898149 | 41.918 |
| 44393.13033564815 | 41.783 |
| 44393.172002314815 | 41.609 |
| 44393.21366898149 | 41.455 |
| 44393.25533564815 | 41.339 |
| 44393.297002314815 | 41.397 |
| 44393.33866898149 | 41.821 |
| 44393.38033564815 | 42.613 |
| 44393.422002314815 | 44.621 |
| 44393.46366898149 | 48.636 |
| 44393.50533564815 | 46.049 |
| 44393.547002314815 | 46.744 |
| 44393.58866898149 | 46.918 |
| 44393.63033564815 | 45.547 |
| 44393.672002314815 | 44.91 |
| 44393.71366898149 | 45.682 |
| 44393.75533564815 | 44.968 |
| 44393.797002314815 | 44.138 |
| 44393.83866898149 | 43.25 |
| 44393.88033564815 | 42.4 |
| 44393.922002314815 | 42.15 |
| 44393.96366898149 | 41.841 |
| 44394.00533564815 | 41.841 |
| 44394.047002314815 | 41.918 |
| 44394.08866898149 | 41.956 |
| 44394.13033564815 | 41.995 |
| 44394.172002314815 | 41.783 |
| 44394.21366898149 | 41.802 |
| 44394.25533564815 | 41.628 |
| 44394.297002314815 | 41.725 |
| 44394.33866898149 | 42.343 |
| 44394.38033564815 | 43.501 |
| 44394.422002314815 | 44.949 |
| 44394.46366898149 | 49.235 |
| 44394.50533564815 | 48.597 |
| 44394.547002314815 | 49.37 |
| 44394.58866898149 | 48.404 |
| 44394.63033564815 | 46.455 |
| 44394.672002314815 | 45.74 |
| 44394.71366898149 | 45.76 |
| 44394.75533564815 | 47.304 |
| 44394.797002314815 | 47.343 |
| 44394.83866898149 | 44.08 |
| 44394.88033564815 | 43.231 |
| 44394.922002314815 | 42.439 |
| 44394.96366898149 | 42.207 |
| 44395.00533564815 | 42.111 |
| 44395.047002314815 | 41.918 |
| 44395.08866898149 | 41.821 |
| 44395.13033564815 | 41.59 |
| 44395.172002314815 | 41.416 |
| 44395.21366898149 | 41.184 |
| 44395.25533564815 | 41.088 |
| 44395.297002314815 | 41.049 |
| 44395.33866898149 | 41.648 |
| 44395.38033564815 | 42.632 |
| 44395.422002314815 | 45.953 |
| 44395.46366898149 | 49.466 |
| 44395.50533564815 | 48.501 |
| 44395.547002314815 | 49.717 |
| 44395.58866898149 | 48.346 |
| 44395.63033564815 | 48.578 |
| 44395.672002314815 | 48.269 |
| 44395.71366898149 | 47.285 |
| 44395.75533564815 | 46.686 |
| 44395.797002314815 | 45.47 |
| 44395.83866898149 | 44.428 |
| 44395.88033564815 | 43.231 |
| 44395.922002314815 | 42.748 |
| 44395.96366898149 | 42.304 |
| 44396.00533564815 | 41.648 |
| 44396.047002314815 | 41.59 |
| 44396.08866898149 | 41.358 |
| 44396.13033564815 | 41.339 |
| 44396.172002314815 | 41.146 |
| 44396.21366898149 | 40.856 |
| 44396.25533564815 | 40.605 |
| 44396.297002314815 | 40.605 |
| 44396.33866898149 | 41.107 |
| 44396.38033564815 | 42.15 |
| 44396.422002314815 | 44.601 |
| 44396.46366898149 | 49.582 |
| 44396.50533564815 | 48.134 |
| 44396.547002314815 | 49.08 |
| 44396.58866898149 | 48.887 |
| 44396.63033564815 | 48.443 |
| 44396.672002314815 | 47.69 |
| 44396.71366898149 | 47.034 |
| 44396.75533564815 | 45.779 |
| 44396.797002314815 | 44.621 |
| 44396.83866898149 | 43.713 |
| 44396.88033564815 | 43.076 |
| 44396.922002314815 | 42.536 |
| 44396.96366898149 | 42.227 |
| 44397.00533564815 | 42.169 |
| 44397.047002314815 | 41.667 |
| 44397.08866898149 | 41.686 |
| 44397.13033564815 | 41.493 |
| 44397.172002314815 | 41.281 |
| 44397.21366898149 | 41.126 |
| 44397.25533564815 | 40.895 |
| 44397.297002314815 | 40.953 |
| 44397.33866898149 | 41.416 |
| 44397.38033564815 | 42.439 |
| 44397.422002314815 | 44.717 |
| 44397.46366898149 | 49.679 |
| 44397.50533564815 | 49.061 |
| 44397.547002314815 | 50.258 |
| 44397.58866898149 | 49.196 |
| 44397.63033564815 | 48.173 |
| 44397.672002314815 | 47.632 |
| 44397.71366898149 | 48.462 |
| 44397.75533564815 | 46.686 |
| 44397.797002314815 | 45.451 |
| 44397.83866898149 | 43.501 |
| 44397.88033564815 | 43.308 |
| 44397.922002314815 | 43.25 |
| 44397.96366898149 | 42.671 |
| 44398.00533564815 | 42.304 |
| 44398.047002314815 | 42.246 |
| 44398.08866898149 | 41.956 |
| 44398.13033564815 | 41.783 |
| 44398.172002314815 | 41.416 |
| 44398.21366898149 | 41.339 |
| 44398.25533564815 | 41.068 |
| 44398.297002314815 | 41.3 |
| 44398.33866898149 | 41.763 |
| 44398.38033564815 | 42.362 |
| 44398.422002314815 | 44.389 |
| 44398.46366898149 | 49.601 |
| 44398.50533564815 | 49.138 |
| 44398.547002314815 | 47.42 |
| 44398.58866898149 | 47.709 |
| 44398.63033564815 | 47.285 |
| 44398.672002314815 | 46.03 |
| 44398.71366898149 | 45.933 |
| 44398.75533564815 | 44.91 |
| 44398.797002314815 | 44.929 |
| 44398.83866898149 | 44.061 |
| 44398.88033564815 | 45.007 |
| 44398.922002314815 | 45.586 |
| 44398.96366898149 | 44.37 |
| 44399.00533564815 | 43.559 |
| 44399.047002314815 | 42.671 |
| 44399.08866898149 | 42.671 |
| 44399.13033564815 | 42.555 |
| 44399.172002314815 | 42.265 |
| 44399.21366898149 | 41.821 |
| 44399.25533564815 | 41.358 |
| 44399.297002314815 | 41.416 |
| 44399.33866898149 | 41.956 |
| 44399.38033564815 | 42.864 |
| 44399.422002314815 | 44.466 |
| 44399.46366898149 | 49.041 |
| 44399.50533564815 | 49.003 |
| 44399.547002314815 | 50.586 |
| 44399.58866898149 | 49.041 |
| 44399.63033564815 | 46.918 |
| 44399.672002314815 | 44.833 |
| 44399.71366898149 | 44.37 |
| 44399.75533564815 | 44.022 |
| 44399.797002314815 | 43.829 |
| 44399.83866898149 | 43.926 |
| 44399.88033564815 | 43.289 |
| 44399.922002314815 | 42.787 |
| 44399.96366898149 | 42.536 |
| 44400.00533564815 | 42.246 |
| 44400.047002314815 | 41.937 |
| 44400.08866898149 | 41.821 |
| 44400.13033564815 | 41.879 |
| 44400.172002314815 | 41.628 |
| 44400.21366898149 | 41.397 |
| 44400.25533564815 | 41.223 |
| 44400.297002314815 | 41.223 |
| 44400.33866898149 | 41.899 |
| 44400.38033564815 | 43.076 |
| 44400.422002314815 | 45.335 |
| 44400.46366898149 | 50.933 |
| 44400.50533564815 | 49.756 |
| 44400.547002314815 | 51.764 |
| 44400.58866898149 | 50.045 |
| 44400.63033564815 | 47.111 |
| 44400.672002314815 | 50.277 |
| 44400.71366898149 | 47.767 |
| 44400.75533564815 | 45.354 |
| 44400.797002314815 | 45.972 |
| 44400.83866898149 | 45.316 |
| 44400.88033564815 | 44.485 |
| 44400.922002314815 | 43.945 |
| 44400.96366898149 | 43.462 |
| 44401.00533564815 | 43.134 |
| 44401.047002314815 | 42.845 |
| 44401.08866898149 | 42.516 |
| 44401.13033564815 | 42.285 |
| 44401.172002314815 | 42.053 |
| 44401.21366898149 | 41.879 |
| 44401.25533564815 | 41.706 |
| 44401.297002314815 | 41.763 |
| 44401.33866898149 | 41.995 |
| 44401.38033564815 | 42.69 |
| 44401.422002314815 | 43.984 |
| 44401.46366898149 | 45.586 |
| 44401.50533564815 | 46.455 |
| 44401.547002314815 | 46.223 |
| 44401.58866898149 | 45.393 |
| 44401.63033564815 | 45.586 |
| 44401.672002314815 | 44.621 |
| 44401.71366898149 | 44.08 |
| 44401.75533564815 | 43.404 |
| 44401.797002314815 | 42.883 |
| 44401.83866898149 | 42.574 |
| 44401.88033564815 | 42.207 |
| 44401.922002314815 | 41.918 |
| 44401.96366898149 | 41.783 |
| 44402.00533564815 | 41.667 |
| 44402.047002314815 | 41.59 |
| 44402.08866898149 | 41.59 |
| 44402.13033564815 | 41.261 |
| 44402.172002314815 | 41.165 |
| 44402.21366898149 | 41.107 |
| 44402.25533564815 | 41.068 |
| 44402.297002314815 | 41.107 |
| 44402.33866898149 | 41.667 |
| 44402.38033564815 | 42.632 |
| 44402.422002314815 | 43.578 |
| 44402.46366898149 | 45.277 |
| 44402.50533564815 | 46.628 |
| 44402.547002314815 | 47.362 |
| 44402.58866898149 | 47.845 |
| 44402.63033564815 | 47.806 |
| 44402.672002314815 | 47.516 |
| 44402.71366898149 | 46.551 |
| 44402.75533564815 | 46.3 |
| 44402.797002314815 | 46.165 |
| 44402.83866898149 | 45.103 |
| 44402.88033564815 | 44.466 |
| 44402.922002314815 | 44.08 |
| 44402.96366898149 | 43.868 |
| 44403.00533564815 | 43.984 |
| 44403.047002314815 | 44.003 |
| 44403.08866898149 | 43.964 |
| 44403.13033564815 | 43.964 |
| 44403.172002314815 | 43.964 |
| 44403.21366898149 | 43.964 |
| 44403.25533564815 | 44.08 |
| 44403.297002314815 | 44.273 |
| 44403.33866898149 | 44.621 |
| 44403.38033564815 | 45.258 |
| 44403.422002314815 | 46.551 |
| 44403.46366898149 | 47.98 |
| 44403.50533564815 | 49.312 |
| 44403.547002314815 | 50.123 |
| 44403.58866898149 | 48.617 |
| 44403.63033564815 | 47.729 |
| 44403.672002314815 | 48.366 |
| 44403.71366898149 | 48.636 |
| 44403.75533564815 | 48.269 |
| 44403.797002314815 | 47.922 |
| 44403.83866898149 | 47.169 |
| 44403.88033564815 | 46.86 |
| 44403.922002314815 | 46.474 |
| 44403.96366898149 | 46.339 |
| 44404.00533564815 | 46.262 |
| 44404.047002314815 | 46.126 |
| 44404.08866898149 | 45.953 |
| 44404.13033564815 | 45.798 |
| 44404.172002314815 | 45.74 |
| 44404.21366898149 | 45.605 |
| 44404.25533564815 | 45.547 |
| 44404.297002314815 | 45.567 |
| 44404.33866898149 | 45.875 |
| 44404.38033564815 | 46.532 |
| 44404.422002314815 | 47.729 |
| 44404.46366898149 | 49.08 |
| 44404.50533564815 | 50.2 |
| 44404.547002314815 | 52.014 |
| 44404.58866898149 | 51.648 |
| 44404.63033564815 | 51.937 |
| 44404.672002314815 | 50.625 |
| 44404.71366898149 | 50.277 |
| 44404.75533564815 | 49.505 |
| 44404.797002314815 | 48.694 |
| 44404.83866898149 | 48.385 |
| 44404.88033564815 | 48.134 |
| 44404.922002314815 | 47.864 |
| 44404.96366898149 | 47.613 |
| 44405.00533564815 | 47.439 |
| 44405.047002314815 | 47.323 |
| 44405.08866898149 | 47.111 |
| 44405.13033564815 | 46.937 |
| 44405.172002314815 | 46.802 |
| 44405.21366898149 | 46.609 |
| 44405.25533564815 | 46.474 |
| 44405.297002314815 | 46.474 |
| 44405.33866898149 | 46.744 |
| 44405.38033564815 | 47.285 |
| 44405.422002314815 | 48.404 |
| 44405.46366898149 | 49.756 |
| 44405.50533564815 | 50.74 |
| 44405.547002314815 | 51.474 |
| 44405.58866898149 | 51.686 |
| 44405.63033564815 | 51.455 |
| 44405.672002314815 | 50.953 |
| 44405.71366898149 | 49.949 |
| 44405.75533564815 | 49.563 |
| 44405.797002314815 | 49.524 |
| 44405.83866898149 | 48.289 |
| 44405.88033564815 | 47.806 |
| 44405.922002314815 | 47.613 |
| 44405.96366898149 | 47.401 |
| 44406.00533564815 | 47.362 |
| 44406.047002314815 | 47.072 |
| 44406.08866898149 | 46.821 |
| 44406.13033564815 | 46.686 |
| 44406.172002314815 | 46.686 |
| 44406.21366898149 | 46.474 |
| 44406.25533564815 | 46.435 |
| 44406.297002314815 | 46.532 |
| 44406.33866898149 | 46.783 |
| 44406.38033564815 | 47.227 |
| 44406.422002314815 | 48.327 |
| 44406.46366898149 | 49.659 |
| 44406.50533564815 | 49.659 |
| 44406.547002314815 | 50.586 |
| 44406.58866898149 | 49.698 |
| 44406.63033564815 | 50.818 |
| 44406.672002314815 | 51.126 |
| 44406.71366898149 | 50.933 |
| 44406.75533564815 | 51.3 |
| 44406.797002314815 | 49.543 |
| 44406.83866898149 | 48.906 |
| 44406.88033564815 | 49.003 |
| 44406.922002314815 | 48.211 |
| 44406.96366898149 | 48.115 |
| 44407.00533564815 | 47.613 |
| 44407.047002314815 | 47.343 |
| 44407.08866898149 | 47.265 |
| 44407.13033564815 | 47.15 |
| 44407.172002314815 | 47.034 |
| 44407.21366898149 | 46.937 |
| 44407.25533564815 | 46.879 |
| 44407.297002314815 | 46.86 |
| 44407.33866898149 | 47.092 |
| 44407.38033564815 | 47.69 |
| 44407.422002314815 | 48.597 |
| 44407.46366898149 | 50.007 |
| 44407.50533564815 | 51.069 |
| 44407.547002314815 | 51.957 |
| 44407.58866898149 | 52.188 |
| 44407.63033564815 | 49.794 |
| 44407.672002314815 | 50.374 |
| 44407.71366898149 | 51.57 |
| 44407.75533564815 | 51.107 |
| 44407.797002314815 | 49.775 |
| 44407.83866898149 | 49.601 |
| 44407.88033564815 | 49.91 |
| 44407.922002314815 | 50.393 |
| 44407.96366898149 | 50.509 |
| 44408.00533564815 | 50.277 |
| 44408.047002314815 | 50.142 |
| 44408.08866898149 | 50.142 |
| 44408.13033564815 | 50.142 |
| 44408.172002314815 | 50.18 |
| 44408.21366898149 | 50.2 |
| 44408.25533564815 | 50.277 |
| 44408.297002314815 | 50.374 |
| 44408.33866898149 | 50.625 |
| 44408.38033564815 | 51.126 |
| 44408.422002314815 | 52.285 |
| 44408.46366898149 | 53.366 |
| 44408.50533564815 | 54.312 |
| 44408.547002314815 | 53.578 |
| 44408.58866898149 | 52.709 |
| 44408.63033564815 | 53.038 |
| 44408.672002314815 | 53.076 |
| 44408.71366898149 | 52.767 |
| 44408.75533564815 | 52.748 |
| 44408.797002314815 | 52.806 |
| 44408.83866898149 | 52.825 |
| 44408.88033564815 | 52.825 |
| 44408.922002314815 | 52.883 |
| 44408.96366898149 | 52.941 |
| 44409.00533564815 | 52.999 |
| 44409.047002314815 | 53.153 |
| 44409.08866898149 | 53.308 |
| 44409.13033564815 | 53.289 |
| 44409.172002314815 | 53.424 |
| 44409.21366898149 | 53.462 |
| 44409.25533564815 | 53.559 |
| 44409.297002314815 | 53.655 |
| 44409.33866898149 | 53.771 |
| 44409.38033564815 | 53.906 |
| 44409.422002314815 | 54.37 |
| 44409.46366898149 | 54.582 |
| 44409.50533564815 | 55.123 |
| 44409.547002314815 | 55.74 |
| 44409.58866898149 | 56.416 |
| 44409.63033564815 | 56.088 |
| 44409.672002314815 | 56.358 |
| 44409.71366898149 | 56.107 |
| 44409.75533564815 | 55.528 |
| 44409.797002314815 | 55.335 |
| 44409.83866898149 | 55.238 |
| 44409.88033564815 | 55.103 |
| 44409.922002314815 | 55.045 |
| 44409.96366898149 | 54.93 |
| 44410.00533564815 | 54.872 |
| 44410.047002314815 | 54.775 |
| 44410.08866898149 | 54.737 |
| 44410.13033564815 | 54.679 |
| 44410.172002314815 | 54.64 |
| 44410.21366898149 | 54.64 |
| 44410.25533564815 | 54.717 |
| 44410.297002314815 | 54.872 |
| 44410.33866898149 | 55.142 |
| 44410.38033564815 | 55.76 |
| 44410.422002314815 | 56.223 |
| 44410.46366898149 | 56.957 |
| 44410.50533564815 | 56.57 |
| 44410.547002314815 | 57.381 |
| 44410.58866898149 | 57.825 |
| 44410.63033564815 | 57.246 |
| 44410.672002314815 | 56.976 |
| 44410.71366898149 | 56.725 |
| 44410.75533564815 | 56.474 |
| 44410.797002314815 | 56.764 |
| 44410.83866898149 | 56.937 |
| 44410.88033564815 | 56.648 |
| 44410.922002314815 | 56.59 |
| 44410.96366898149 | 56.455 |
| 44411.00533564815 | 56.339 |
| 44411.047002314815 | 56.204 |
| 44411.08866898149 | 56.3 |
| 44411.13033564815 | 56.416 |
| 44411.172002314815 | 56.455 |
| 44411.21366898149 | 56.532 |
| 44411.25533564815 | 56.513 |
| 44411.297002314815 | 56.667 |
| 44411.33866898149 | 56.86 |
| 44411.38033564815 | 56.879 |
| 44411.422002314815 | 57.034 |
| 44411.46366898149 | 57.15 |
| 44411.50533564815 | 57.285 |
| 44411.547002314815 | 57.806 |
| 44411.58866898149 | 57.71 |
| 44411.63033564815 | 57.96 |
| 44411.672002314815 | 57.903 |
| 44411.71366898149 | 57.594 |
| 44411.75533564815 | 57.516 |
| 44411.797002314815 | 57.555 |
| 44411.83866898149 | 57.497 |
| 44411.88033564815 | 57.304 |
| 44411.922002314815 | 57.246 |
| 44411.96366898149 | 56.976 |
| 44412.00533564815 | 56.976 |
| 44412.047002314815 | 56.918 |
| 44412.08866898149 | 56.918 |
| 44412.13033564815 | 56.821 |
| 44412.172002314815 | 56.783 |
| 44412.21366898149 | 56.841 |
| 44412.25533564815 | 56.86 |
| 44412.297002314815 | 56.706 |
| 44412.33866898149 | 56.976 |
| 44412.38033564815 | 57.208 |
| 44412.422002314815 | 57.613 |
| 44412.46366898149 | 58.443 |
| 44412.50533564815 | 58.868 |
| 44412.547002314815 | 59.08 |
| 44412.58866898149 | 59.215 |
| 44412.63033564815 | 59.177 |
| 44412.672002314815 | 58.945 |
| 44412.71366898149 | 58.791 |
| 44412.75533564815 | 58.52 |
| 44412.797002314815 | 58.134 |
| 44412.83866898149 | 57.883 |
| 44412.88033564815 | 57.304 |
| 44412.922002314815 | 57.362 |
| 44412.96366898149 | 57.169 |
| 44413.00533564815 | 57.072 |
| 44413.047002314815 | 56.879 |
| 44413.08866898149 | 56.802 |
| 44413.13033564815 | 56.706 |
| 44413.172002314815 | 56.648 |
| 44413.21366898149 | 56.532 |
| 44413.25533564815 | 56.416 |
| 44413.297002314815 | 56.416 |
| 44413.33866898149 | 56.532 |
| 44413.38033564815 | 56.937 |
| 44413.422002314815 | 57.497 |
| 44413.46366898149 | 58.096 |
| 44413.50533564815 | 58.443 |
| 44413.547002314815 | 58.752 |
| 44413.58866898149 | 58.964 |
| 44413.63033564815 | 59.119 |
| 44413.672002314815 | 59.235 |
| 44413.71366898149 | 59.022 |
| 44413.75533564815 | 58.849 |
| 44413.797002314815 | 58.54 |
| 44413.83866898149 | 57.864 |
| 44413.88033564815 | 57.555 |
| 44413.922002314815 | 57.459 |
| 44413.96366898149 | 57.478 |
| 44414.00533564815 | 57.304 |
| 44414.047002314815 | 57.246 |
| 44414.08866898149 | 57.188 |
| 44414.13033564815 | 57.053 |
| 44414.172002314815 | 56.879 |
| 44414.21366898149 | 56.725 |
| 44414.25533564815 | 56.57 |
| 44414.297002314815 | 56.493 |
| 44414.33866898149 | 56.609 |
| 44414.38033564815 | 56.976 |
| 44414.422002314815 | 57.516 |
| 44414.46366898149 | 57.999 |
| 44414.50533564815 | 57.574 |
| 44414.547002314815 | 58.173 |
| 44414.58866898149 | 57.265 |
| 44414.63033564815 | 57.767 |
| 44414.672002314815 | 57.304 |
| 44414.71366898149 | 57.343 |
| 44414.75533564815 | 57.246 |
| 44414.797002314815 | 57.072 |
| 44414.83866898149 | 56.957 |
| 44414.88033564815 | 56.744 |
| 44414.922002314815 | 56.648 |
| 44414.96366898149 | 56.532 |
| 44415.00533564815 | 56.397 |
| 44415.047002314815 | 56.049 |
| 44415.08866898149 | 55.933 |
| 44415.13033564815 | 55.798 |
| 44415.172002314815 | 55.74 |
| 44415.21366898149 | 55.605 |
| 44415.25533564815 | 55.451 |
| 44415.297002314815 | 55.277 |
| 44415.33866898149 | 55.354 |
| 44415.38033564815 | 55.682 |
| 44415.422002314815 | 55.644 |
| 44415.46366898149 | 55.856 |
| 44415.50533564815 | 56.184 |
| 44415.547002314815 | 56.59 |
| 44415.58866898149 | 56.262 |
| 44415.63033564815 | 56.165 |
| 44415.672002314815 | 56.088 |
| 44415.71366898149 | 56.107 |
| 44415.75533564815 | 55.76 |
| 44415.797002314815 | 55.489 |
| 44415.83866898149 | 55.2 |
| 44415.88033564815 | 54.93 |
| 44415.922002314815 | 54.756 |
| 44415.96366898149 | 54.64 |
| 44416.00533564815 | 54.524 |
| 44416.047002314815 | 54.331 |
| 44416.08866898149 | 54.196 |
| 44416.13033564815 | 54.003 |
| 44416.172002314815 | 53.848 |
| 44416.21366898149 | 53.636 |
| 44416.25533564815 | 53.52 |
| 44416.297002314815 | 53.404 |
| 44416.33866898149 | 53.52 |
| 44416.38033564815 | 53.887 |
| 44416.422002314815 | 54.524 |
| 44416.46366898149 | 55.296 |
| 44416.50533564815 | 55.914 |
| 44416.547002314815 | 56.262 |
| 44416.58866898149 | 56.493 |
| 44416.63033564815 | 56.86 |
| 44416.672002314815 | 56.532 |
| 44416.71366898149 | 55.605 |
| 44416.75533564815 | 54.949 |
| 44416.797002314815 | 54.37 |
| 44416.83866898149 | 53.906 |
| 44416.88033564815 | 53.655 |
| 44416.922002314815 | 53.424 |
| 44416.96366898149 | 53.231 |
| 44417.00533564815 | 53.057 |
| 44417.047002314815 | 52.864 |
| 44417.08866898149 | 52.69 |
| 44417.13033564815 | 52.594 |
| 44417.172002314815 | 52.401 |
| 44417.21366898149 | 52.188 |
| 44417.25533564815 | 52.072 |
| 44417.297002314815 | 51.957 |
| 44417.33866898149 | 52.053 |
| 44417.38033564815 | 52.478 |
| 44417.422002314815 | 53.076 |
| 44417.46366898149 | 53.906 |
| 44417.50533564815 | 54.37 |
| 44417.547002314815 | 54.737 |
| 44417.58866898149 | 54.91 |
| 44417.63033564815 | 54.524 |
| 44417.672002314815 | 54.177 |
| 44417.71366898149 | 53.694 |
| 44417.75533564815 | 52.883 |
| 44417.797002314815 | 52.458 |
| 44417.83866898149 | 52.014 |
| 44417.88033564815 | 51.821 |
| 44417.922002314815 | 51.474 |
| 44417.96366898149 | 51.319 |
| 44418.00533564815 | 51.049 |
| 44418.047002314815 | 50.837 |
| 44418.08866898149 | 50.779 |
| 44418.13033564815 | 50.547 |
| 44418.172002314815 | 50.354 |
| 44418.21366898149 | 50.277 |
| 44418.25533564815 | 50.084 |
| 44418.297002314815 | 49.968 |
| 44418.33866898149 | 50.045 |
| 44418.38033564815 | 50.489 |
| 44418.422002314815 | 49.292 |
| 44418.46366898149 | 48.462 |
| 44418.50533564815 | 48.713 |
| 44418.547002314815 | 48.289 |
| 44418.58866898149 | 48.54 |
| 44418.63033564815 | 48.578 |
| 44418.672002314815 | 47.767 |
| 44418.71366898149 | 47.343 |
| 44418.75533564815 | 47.092 |
| 44418.797002314815 | 46.513 |
| 44418.83866898149 | 45.953 |
| 44418.88033564815 | 45.624 |
| 44418.922002314815 | 45.354 |
| 44418.96366898149 | 45.026 |
| 44419.00533564815 | 44.814 |
| 44419.047002314815 | 44.582 |
| 44419.08866898149 | 44.37 |
| 44419.13033564815 | 44.08 |
| 44419.172002314815 | 43.906 |
| 44419.21366898149 | 43.675 |
| 44419.25533564815 | 43.501 |
| 44419.297002314815 | 43.269 |
| 44419.33866898149 | 43.192 |
| 44419.38033564815 | 43.443 |
| 44419.422002314815 | 43.829 |
| 44419.46366898149 | 44.119 |
| 44419.50533564815 | 44.292 |
| 44419.547002314815 | 44.138 |
| 44419.58866898149 | 43.887 |
| 44419.63033564815 | 43.578 |
| 44419.672002314815 | 43.095 |
| 44419.71366898149 | 42.574 |
| 44419.75533564815 | 42.13 |
| 44419.797002314815 | 41.648 |
| 44419.83866898149 | 41.261 |
| 44419.88033564815 | 41.068 |
| 44419.922002314815 | 41.049 |
| 44419.96366898149 | 40.991 |
| 44420.00533564815 | 40.895 |
| 44420.047002314815 | 40.74 |
| 44420.08866898149 | 40.644 |
| 44420.13033564815 | 40.644 |
| 44420.172002314815 | 40.586 |
| 44420.21366898149 | 40.702 |
| 44420.25533564815 | 40.586 |
| 44420.297002314815 | 40.373 |
| 44420.33866898149 | 40.489 |
| 44420.38033564815 | 40.837 |
| 44420.422002314815 | 41.628 |
| 44420.46366898149 | 42.594 |
| 44420.50533564815 | 43.79 |
| 44420.547002314815 | 42.883 |
| 44420.58866898149 | 42.4 |
| 44420.63033564815 | 42.574 |
| 44420.672002314815 | 43.134 |
| 44420.71366898149 | 43.733 |
| 44420.75533564815 | 43.81 |
| 44420.797002314815 | 42.941 |
| 44420.83866898149 | 42.15 |
| 44420.88033564815 | 41.879 |
| 44420.922002314815 | 41.995 |
| 44420.96366898149 | 41.976 |
| 44421.00533564815 | 41.976 |
| 44421.047002314815 | 41.706 |
| 44421.08866898149 | 41.455 |
| 44421.13033564815 | 41.358 |
| 44421.172002314815 | 41.281 |
| 44421.21366898149 | 41.204 |
| 44421.25533564815 | 41.088 |
| 44421.297002314815 | 40.972 |
| 44421.33866898149 | 41.03 |
| 44421.38033564815 | 41.57 |
| 44421.422002314815 | 42.671 |
| 44421.46366898149 | 44.119 |
| 44421.50533564815 | 44.949 |
| 44421.547002314815 | 46.068 |
| 44421.58866898149 | 46.763 |
| 44421.63033564815 | 45.972 |
| 44421.672002314815 | 45.393 |
| 44421.71366898149 | 44.794 |
| 44421.75533564815 | 45.026 |
| 44421.797002314815 | 43.289 |
| 44421.83866898149 | 42.381 |
| 44421.88033564815 | 42.034 |
| 44421.922002314815 | 41.841 |
| 44421.96366898149 | 41.628 |
| 44422.00533564815 | 41.455 |
| 44422.047002314815 | 41.319 |
| 44422.08866898149 | 41.146 |
| 44422.13033564815 | 41.03 |
| 44422.172002314815 | 40.875 |
| 44422.21366898149 | 40.856 |
| 44422.25533564815 | 40.74 |
| 44422.297002314815 | 40.682 |
| 44422.33866898149 | 40.798 |
| 44422.38033564815 | 41.416 |
| 44422.422002314815 | 42.632 |
| 44422.46366898149 | 44.254 |
| 44422.50533564815 | 45.509 |
| 44422.547002314815 | 46.474 |
| 44422.58866898149 | 46.899 |
| 44422.63033564815 | 46.551 |
| 44422.672002314815 | 45.837 |
| 44422.71366898149 | 44.891 |
| 44422.75533564815 | 43.848 |
| 44422.797002314815 | 43.173 |
| 44422.83866898149 | 42.651 |
| 44422.88033564815 | 43.443 |
| 44422.922002314815 | 42.227 |
| 44422.96366898149 | 41.59 |
| 44423.00533564815 | 41.474 |
| 44423.047002314815 | 41.397 |
| 44423.08866898149 | 41.3 |
| 44423.13033564815 | 41.242 |
| 44423.172002314815 | 41.049 |
| 44423.21366898149 | 40.895 |
| 44423.25533564815 | 40.875 |
| 44423.297002314815 | 40.837 |
| 44423.33866898149 | 41.107 |
| 44423.38033564815 | 41.744 |
| 44423.422002314815 | 42.845 |
| 44423.46366898149 | 44.196 |
| 44423.50533564815 | 45.18 |
| 44423.547002314815 | 45.219 |
| 44423.58866898149 | 44.022 |
| 44423.63033564815 | 43.192 |
| 44423.672002314815 | 43.462 |
| 44423.71366898149 | 43.057 |
| 44423.75533564815 | 42.536 |
| 44423.797002314815 | 42.265 |
| 44423.83866898149 | 41.976 |
| 44423.88033564815 | 41.821 |
| 44423.922002314815 | 41.725 |
| 44423.96366898149 | 41.686 |
| 44424.00533564815 | 41.628 |
| 44424.047002314815 | 41.416 |
| 44424.08866898149 | 41.223 |
| 44424.13033564815 | 41.088 |
| 44424.172002314815 | 41.03 |
| 44424.21366898149 | 40.76 |
| 44424.25533564815 | 40.586 |
| 44424.297002314815 | 40.547 |
| 44424.33866898149 | 40.798 |
| 44424.38033564815 | 41.377 |
| 44424.422002314815 | 42.439 |
| 44424.46366898149 | 43.964 |
| 44424.50533564815 | 45.123 |
| 44424.547002314815 | 45.933 |
| 44424.58866898149 | 46.3 |
| 44424.63033564815 | 45.914 |
| 44424.672002314815 | 44.987 |
| 44424.71366898149 | 43.366 |
| 44424.75533564815 | 42.574 |
| 44424.797002314815 | 42.188 |
| 44424.83866898149 | 41.783 |
| 44424.88033564815 | 41.628 |
| 44424.922002314815 | 41.551 |
| 44424.96366898149 | 41.281 |
| 44425.00533564815 | 41.146 |
| 44425.047002314815 | 41.011 |
| 44425.08866898149 | 40.953 |
| 44425.13033564815 | 40.914 |
| 44425.172002314815 | 40.779 |
| 44425.21366898149 | 40.74 |
| 44425.25533564815 | 40.624 |
| 44425.297002314815 | 40.682 |
| 44425.33866898149 | 40.837 |
| 44425.38033564815 | 41.281 |
| 44425.422002314815 | 42.323 |
| 44425.46366898149 | 43.829 |
| 44425.50533564815 | 45.084 |
| 44425.547002314815 | 45.972 |
| 44425.58866898149 | 45.663 |
| 44425.63033564815 | 45.528 |
| 44425.672002314815 | 45.084 |
| 44425.71366898149 | 43.829 |
| 44425.75533564815 | 43.366 |
| 44425.797002314815 | 42.555 |
| 44425.83866898149 | 42.285 |
| 44425.88033564815 | 42.188 |
| 44425.922002314815 | 42.072 |
| 44425.96366898149 | 41.879 |
| 44426.00533564815 | 41.706 |
| 44426.047002314815 | 41.435 |
| 44426.08866898149 | 41.358 |
| 44426.13033564815 | 41.223 |
| 44426.172002314815 | 41.184 |
| 44426.21366898149 | 41.068 |
| 44426.25533564815 | 40.895 |
| 44426.297002314815 | 40.856 |
| 44426.33866898149 | 40.991 |
| 44426.38033564815 | 41.474 |
| 44426.422002314815 | 42.613 |
| 44426.46366898149 | 43.713 |
| 44426.50533564815 | 45.74 |
| 44426.547002314815 | 46.204 |
| 44426.58866898149 | 45.316 |
| 44426.63033564815 | 43.482 |
| 44426.672002314815 | 43.868 |
| 44426.71366898149 | 43.482 |
| 44426.75533564815 | 42.536 |
| 44426.797002314815 | 42.111 |
| 44426.83866898149 | 41.976 |
| 44426.88033564815 | 41.918 |
| 44426.922002314815 | 41.706 |
| 44426.96366898149 | 41.551 |
| 44427.00533564815 | 41.416 |
| 44427.047002314815 | 41.377 |
| 44427.08866898149 | 41.3 |
| 44427.13033564815 | 41.184 |
| 44427.172002314815 | 41.184 |
| 44427.21366898149 | 41.204 |
| 44427.25533564815 | 41.204 |
| 44427.297002314815 | 41.204 |
| 44427.33866898149 | 41.416 |
| 44427.38033564815 | 41.802 |
| 44427.422002314815 | 42.4 |
| 44427.46366898149 | 43.269 |
| 44427.50533564815 | 43.25 |
| 44427.547002314815 | 43.52 |
| 44427.58866898149 | 43.636 |
| 44427.63033564815 | 43.984 |
| 44427.672002314815 | 44.061 |
| 44427.71366898149 | 43.289 |
| 44427.75533564815 | 43.385 |
| 44427.797002314815 | 43.173 |
| 44427.83866898149 | 42.709 |
| 44427.88033564815 | 42.343 |
| 44427.922002314815 | 42.304 |
| 44427.96366898149 | 41.802 |
| 44428.00533564815 | 41.512 |
| 44428.047002314815 | 41.59 |
| 44428.08866898149 | 41.435 |
| 44428.13033564815 | 41.223 |
| 44428.172002314815 | 40.914 |
| 44428.21366898149 | 40.644 |
| 44428.25533564815 | 40.489 |
| 44428.297002314815 | 40.547 |
| 44428.33866898149 | 40.624 |
| 44428.38033564815 | 41.146 |
| 44428.422002314815 | 42.188 |
| 44428.46366898149 | 43.733 |
| 44428.50533564815 | 44.833 |
| 44428.547002314815 | 45.682 |
| 44428.58866898149 | 46.03 |
| 44428.63033564815 | 45.779 |
| 44428.672002314815 | 45.103 |
| 44428.71366898149 | 44.138 |
| 44428.75533564815 | 42.999 |
| 44428.797002314815 | 42.15 |
| 44428.83866898149 | 41.416 |
| 44428.88033564815 | 41.03 |
| 44428.922002314815 | 40.837 |
| 44428.96366898149 | 40.721 |
| 44429.00533564815 | 40.586 |
| 44429.047002314815 | 40.489 |
| 44429.08866898149 | 40.489 |
| 44429.13033564815 | 40.47 |
| 44429.172002314815 | 40.393 |
| 44429.21366898149 | 40.373 |
| 44429.25533564815 | 40.354 |
| 44429.297002314815 | 40.296 |
| 44429.33866898149 | 40.431 |
| 44429.38033564815 | 40.991 |
| 44429.422002314815 | 42.15 |
| 44429.46366898149 | 43.733 |
| 44429.50533564815 | 43.54 |
| 44429.547002314815 | 42.98 |
| 44429.58866898149 | 43.81 |
| 44429.63033564815 | 44.64 |
| 44429.672002314815 | 44.003 |
| 44429.71366898149 | 43.404 |
| 44429.75533564815 | 42.767 |
| 44429.797002314815 | 42.15 |
| 44429.83866898149 | 41.59 |
| 44429.88033564815 | 41.377 |
| 44429.922002314815 | 41.223 |
| 44429.96366898149 | 41.03 |
| 44430.00533564815 | 41.03 |
| 44430.047002314815 | 40.953 |
| 44430.08866898149 | 40.933 |
| 44430.13033564815 | 40.972 |
| 44430.172002314815 | 40.895 |
| 44430.21366898149 | 40.817 |
| 44430.25533564815 | 40.721 |
| 44430.297002314815 | 40.74 |
| 44430.33866898149 | 40.953 |
| 44430.38033564815 | 41.319 |
| 44430.422002314815 | 42.034 |
| 44430.46366898149 | 43.346 |
| 44430.50533564815 | 44.659 |
| 44430.547002314815 | 45.123 |
| 44430.58866898149 | 46.011 |
| 44430.63033564815 | 45.721 |
| 44430.672002314815 | 45.065 |
| 44430.71366898149 | 44.505 |
| 44430.75533564815 | 43.655 |
| 44430.797002314815 | 42.632 |
| 44430.83866898149 | 41.802 |
| 44430.88033564815 | 41.319 |
| 44430.922002314815 | 41.088 |
| 44430.96366898149 | 40.914 |
| 44431.00533564815 | 40.76 |
| 44431.047002314815 | 40.663 |
| 44431.08866898149 | 40.567 |
| 44431.13033564815 | 40.431 |
| 44431.172002314815 | 40.373 |
| 44431.21366898149 | 40.296 |
| 44431.25533564815 | 40.316 |
| 44431.297002314815 | 40.316 |
| 44431.33866898149 | 40.547 |
| 44431.38033564815 | 41.107 |
| 44431.422002314815 | 41.628 |
| 44431.46366898149 | 42.98 |
| 44431.50533564815 | 43.404 |
| 44431.547002314815 | 43.829 |
| 44431.58866898149 | 45.798 |
| 44431.63033564815 | 45.895 |
| 44431.672002314815 | 45.373 |
| 44431.71366898149 | 44.601 |
| 44431.75533564815 | 43.327 |
| 44431.797002314815 | 42.536 |
| 44431.83866898149 | 41.86 |
| 44431.88033564815 | 41.474 |
| 44431.922002314815 | 41.165 |
| 44431.96366898149 | 40.972 |
| 44432.00533564815 | 40.914 |
| 44432.047002314815 | 40.895 |
| 44432.08866898149 | 40.779 |
| 44432.13033564815 | 40.721 |
| 44432.172002314815 | 40.624 |
| 44432.21366898149 | 40.489 |
| 44432.25533564815 | 40.373 |
| 44432.297002314815 | 40.316 |
| 44432.33866898149 | 40.489 |
| 44432.38033564815 | 41.03 |
| 44432.422002314815 | 42.439 |
| 44432.46366898149 | 42.594 |
| 44432.50533564815 | 44.621 |
| 44432.547002314815 | 45.74 |
| 44432.58866898149 | 46.03 |
| 44432.63033564815 | 45.74 |
| 44432.672002314815 | 44.987 |
| 44432.71366898149 | 44.022 |
| 44432.75533564815 | 43.095 |
| 44432.797002314815 | 42.15 |
| 44432.83866898149 | 41.435 |
| 44432.88033564815 | 41.088 |
| 44432.922002314815 | 40.895 |
| 44432.96366898149 | 40.74 |
| 44433.00533564815 | 40.624 |
| 44433.047002314815 | 40.509 |
| 44433.08866898149 | 40.451 |
| 44433.13033564815 | 40.335 |
| 44433.172002314815 | 40.277 |
| 44433.21366898149 | 40.296 |
| 44433.25533564815 | 40.18 |
| 44433.297002314815 | 40.161 |
| 44433.33866898149 | 40.219 |
| 44433.38033564815 | 40.856 |
| 44433.422002314815 | 42.053 |
| 44433.46366898149 | 43.655 |
| 44433.50533564815 | 44.929 |
| 44433.547002314815 | 45.644 |
| 44433.58866898149 | 45.895 |
| 44433.63033564815 | 45.74 |
| 44433.672002314815 | 45.084 |
| 44433.71366898149 | 44.234 |
| 44433.75533564815 | 43.424 |
| 44433.797002314815 | 42.574 |
| 44433.83866898149 | 41.976 |
| 44433.88033564815 | 41.57 |
| 44433.922002314815 | 41.416 |
| 44433.96366898149 | 41.3 |
| 44434.00533564815 | 41.146 |
| 44434.047002314815 | 41.146 |
| 44434.08866898149 | 41.107 |
| 44434.13033564815 | 40.972 |
| 44434.172002314815 | 40.837 |
| 44434.21366898149 | 40.702 |
| 44434.25533564815 | 40.624 |
| 44434.297002314815 | 40.489 |
| 44434.33866898149 | 40.76 |
| 44434.38033564815 | 41.358 |
| 44434.422002314815 | 42.574 |
| 44434.46366898149 | 43.81 |
| 44434.50533564815 | 44.872 |
| 44434.547002314815 | 45.277 |
| 44434.58866898149 | 44.157 |
| 44434.63033564815 | 43.424 |
| 44434.672002314815 | 43.597 |
| 44434.71366898149 | 43.733 |
| 44434.75533564815 | 43.173 |
| 44434.797002314815 | 42.111 |
| 44434.83866898149 | 41.474 |
| 44434.88033564815 | 41.3 |
| 44434.922002314815 | 41.261 |
| 44434.96366898149 | 41.204 |
| 44435.00533564815 | 40.933 |
| 44435.047002314815 | 40.76 |
| 44435.08866898149 | 40.702 |
| 44435.13033564815 | 40.624 |
| 44435.172002314815 | 40.586 |
| 44435.21366898149 | 40.431 |
| 44435.25533564815 | 40.393 |
| 44435.297002314815 | 40.354 |
| 44435.33866898149 | 40.509 |
| 44435.38033564815 | 41.107 |
| 44435.422002314815 | 42.227 |
| 44435.46366898149 | 43.578 |
| 44435.50533564815 | 44.987 |
| 44435.547002314815 | 45.779 |
| 44435.58866898149 | 45.567 |
| 44435.63033564815 | 45.663 |
| 44435.672002314815 | 45.007 |
| 44435.71366898149 | 44.003 |
| 44435.75533564815 | 43.25 |
| 44435.797002314815 | 42.343 |
| 44435.83866898149 | 41.706 |
| 44435.88033564815 | 41.339 |
| 44435.922002314815 | 41.146 |
| 44435.96366898149 | 41.068 |
| 44436.00533564815 | 40.953 |
| 44436.047002314815 | 40.914 |
| 44436.08866898149 | 40.74 |
| 44436.13033564815 | 40.663 |
| 44436.172002314815 | 40.605 |
| 44436.21366898149 | 40.547 |
| 44436.25533564815 | 40.489 |
| 44436.297002314815 | 40.431 |
| 44436.33866898149 | 40.586 |
| 44436.38033564815 | 41.184 |
| 44436.422002314815 | 42.246 |
| 44436.46366898149 | 43.868 |
| 44436.50533564815 | 45.142 |
| 44436.547002314815 | 45.914 |
| 44436.58866898149 | 46.146 |
| 44436.63033564815 | 45.895 |
| 44436.672002314815 | 45.161 |
| 44436.71366898149 | 44.196 |
| 44436.75533564815 | 43.269 |
| 44436.797002314815 | 42.304 |
| 44436.83866898149 | 41.628 |
| 44436.88033564815 | 41.339 |
| 44436.922002314815 | 41.223 |
| 44436.96366898149 | 41.03 |
| 44437.00533564815 | 40.895 |
| 44437.047002314815 | 40.779 |
| 44437.08866898149 | 40.779 |
| 44437.13033564815 | 40.779 |
| 44437.172002314815 | 40.779 |
| 44437.21366898149 | 40.837 |
| 44437.25533564815 | 40.721 |
| 44437.297002314815 | 40.605 |
| 44437.33866898149 | 40.644 |
| 44437.38033564815 | 41.204 |
| 44437.422002314815 | 42.343 |
| 44437.46366898149 | 43.848 |
| 44437.50533564815 | 45.007 |
| 44437.547002314815 | 45.605 |
| 44437.58866898149 | 46.068 |
| 44437.63033564815 | 45.875 |
| 44437.672002314815 | 45.161 |
| 44437.71366898149 | 44.254 |
| 44437.75533564815 | 43.694 |
| 44437.797002314815 | 43.018 |
| 44437.83866898149 | 42.13 |
| 44437.88033564815 | 41.532 |
| 44437.922002314815 | 41.339 |
| 44437.96366898149 | 41.223 |
| 44438.00533564815 | 41.03 |
| 44438.047002314815 | 40.953 |
| 44438.08866898149 | 40.895 |
| 44438.13033564815 | 40.817 |
| 44438.172002314815 | 40.779 |
| 44438.21366898149 | 40.74 |
| 44438.25533564815 | 40.586 |
| 44438.297002314815 | 40.509 |
| 44438.33866898149 | 40.682 |
| 44438.38033564815 | 41.184 |
| 44438.422002314815 | 42.15 |
| 44438.46366898149 | 43.559 |
| 44438.50533564815 | 44.679 |
| 44438.547002314815 | 45.393 |
| 44438.58866898149 | 45.103 |
| 44438.63033564815 | 44.833 |
| 44438.672002314815 | 44.196 |
| 44438.71366898149 | 43.655 |
| 44438.75533564815 | 42.883 |
| 44438.797002314815 | 42.053 |
| 44438.83866898149 | 41.435 |
| 44438.88033564815 | 41.107 |
| 44438.922002314815 | 40.895 |
| 44438.96366898149 | 40.837 |
| 44439.00533564815 | 40.779 |
| 44439.047002314815 | 40.779 |
| 44439.08866898149 | 40.702 |
| 44439.13033564815 | 40.682 |
| 44439.172002314815 | 40.605 |
| 44439.21366898149 | 40.528 |
| 44439.25533564815 | 40.335 |
| 44439.297002314815 | 40.277 |
| 44439.33866898149 | 40.393 |
| 44439.38033564815 | 40.914 |
| 44439.422002314815 | 41.86 |
| 44439.46366898149 | 43.134 |
| 44439.50533564815 | 44.312 |
| 44439.547002314815 | 45.296 |
| 44439.58866898149 | 45.682 |
| 44439.63033564815 | 45.644 |
| 44439.672002314815 | 44.312 |
| 44439.71366898149 | 43.54 |
| 44439.75533564815 | 43.018 |
| 44439.797002314815 | 42.516 |
| 44439.83866898149 | 42.072 |
| 44439.88033564815 | 41.821 |
| 44439.922002314815 | 41.686 |
| 44439.96366898149 | 41.512 |
| 44440.00533564815 | 41.455 |
| 44440.047002314815 | 41.397 |
| 44440.08866898149 | 41.319 |
| 44440.13033564815 | 41.242 |
| 44440.172002314815 | 41.223 |
| 44440.21366898149 | 41.146 |
| 44440.25533564815 | 41.165 |
| 44440.297002314815 | 41.242 |
| 44440.33866898149 | 41.261 |
| 44440.38033564815 | 41.841 |
| 44440.422002314815 | 42.362 |
| 44440.46366898149 | 43.115 |
| 44440.50533564815 | 43.269 |
| 44440.547002314815 | 43.54 |
| 44440.58866898149 | 43.076 |
| 44440.63033564815 | 42.555 |
| 44440.672002314815 | 42.304 |
| 44440.71366898149 | 41.956 |
| 44440.75533564815 | 41.995 |
| 44440.797002314815 | 41.802 |
| 44440.83866898149 | 41.628 |
| 44440.88033564815 | 41.435 |
| 44440.922002314815 | 41.435 |
| 44440.96366898149 | 41.416 |
| 44441.00533564815 | 41.358 |
| 44441.047002314815 | 41.532 |
| 44441.08866898149 | 41.551 |
| 44441.13033564815 | 41.416 |
| 44441.172002314815 | 41.281 |
| 44441.21366898149 | 41.242 |
| 44441.25533564815 | 41.242 |
| 44441.297002314815 | 41.261 |
| 44441.33866898149 | 41.377 |
| 44441.38033564815 | 41.706 |
| 44441.422002314815 | 42.536 |
| 44441.46366898149 | 42.883 |
| 44441.50533564815 | 44.003 |
| 44441.547002314815 | 45.026 |
| 44441.58866898149 | 44.987 |
| 44441.63033564815 | 45.354 |
| 44441.672002314815 | 44.37 |
| 44441.71366898149 | 43.848 |
| 44441.75533564815 | 43.269 |
| 44441.797002314815 | 42.594 |
| 44441.83866898149 | 41.995 |
| 44441.88033564815 | 41.706 |
| 44441.922002314815 | 41.648 |
| 44441.96366898149 | 41.57 |
| 44442.00533564815 | 41.551 |
| 44442.047002314815 | 41.551 |
| 44442.08866898149 | 41.435 |
| 44442.13033564815 | 41.3 |
| 44442.172002314815 | 41.319 |
| 44442.21366898149 | 41.319 |
| 44442.25533564815 | 41.242 |
| 44442.297002314815 | 41.165 |
| 44442.33866898149 | 41.204 |
| 44442.38033564815 | 41.667 |
| 44442.422002314815 | 42.555 |
| 44442.46366898149 | 42.613 |
| 44442.50533564815 | 43.906 |
| 44442.547002314815 | 44.563 |
| 44442.58866898149 | 44.64 |
| 44442.63033564815 | 43.578 |
| 44442.672002314815 | 43.752 |
| 44442.71366898149 | 43.482 |
| 44442.75533564815 | 42.999 |
| 44442.797002314815 | 42.323 |
| 44442.83866898149 | 41.706 |
| 44442.88033564815 | 41.204 |
| 44442.922002314815 | 41.126 |
| 44442.96366898149 | 40.991 |
| 44443.00533564815 | 40.933 |
| 44443.047002314815 | 40.914 |
| 44443.08866898149 | 40.856 |
| 44443.13033564815 | 40.856 |
| 44443.172002314815 | 40.721 |
| 44443.21366898149 | 40.605 |
| 44443.25533564815 | 40.489 |
| 44443.297002314815 | 40.489 |
| 44443.33866898149 | 40.702 |
| 44443.38033564815 | 41.165 |
| 44443.422002314815 | 42.13 |
| 44443.46366898149 | 43.81 |
| 44443.50533564815 | 45.123 |
| 44443.547002314815 | 45.007 |
| 44443.58866898149 | 45.895 |
| 44443.63033564815 | 45.953 |
| 44443.672002314815 | 45.123 |
| 44443.71366898149 | 44.37 |
| 44443.75533564815 | 43.385 |
| 44443.797002314815 | 42.42 |
| 44443.83866898149 | 41.86 |
| 44443.88033564815 | 41.435 |
| 44443.922002314815 | 41.204 |
| 44443.96366898149 | 41.03 |
| 44444.00533564815 | 40.895 |
| 44444.047002314815 | 40.779 |
| 44444.08866898149 | 40.644 |
| 44444.13033564815 | 40.567 |
| 44444.172002314815 | 40.47 |
| 44444.21366898149 | 40.354 |
| 44444.25533564815 | 40.277 |
| 44444.297002314815 | 40.161 |
| 44444.33866898149 | 40.161 |
| 44444.38033564815 | 40.624 |
| 44444.422002314815 | 41.628 |
| 44444.46366898149 | 43.173 |
| 44444.50533564815 | 44.466 |
| 44444.547002314815 | 45.373 |
| 44444.58866898149 | 45.586 |
| 44444.63033564815 | 45.509 |
| 44444.672002314815 | 44.872 |
| 44444.71366898149 | 43.984 |
| 44444.75533564815 | 43.057 |
| 44444.797002314815 | 42.227 |
| 44444.83866898149 | 41.59 |
| 44444.88033564815 | 41.223 |
| 44444.922002314815 | 41.03 |
| 44444.96366898149 | 40.953 |
| 44445.00533564815 | 40.837 |
| 44445.047002314815 | 40.74 |
| 44445.08866898149 | 40.644 |
| 44445.13033564815 | 40.605 |
| 44445.172002314815 | 40.451 |
| 44445.21366898149 | 40.354 |
| 44445.25533564815 | 40.2 |
| 44445.297002314815 | 40.122 |
| 44445.33866898149 | 40.161 |
| 44445.38033564815 | 40.624 |
| 44445.422002314815 | 41.667 |
| 44445.46366898149 | 43.115 |
| 44445.50533564815 | 44.466 |
| 44445.547002314815 | 45.354 |
| 44445.58866898149 | 45.644 |
| 44445.63033564815 | 45.431 |
| 44445.672002314815 | 44.775 |
| 44445.71366898149 | 43.945 |
| 44445.75533564815 | 43.095 |
| 44445.797002314815 | 42.343 |
| 44445.83866898149 | 41.744 |
| 44445.88033564815 | 41.435 |
| 44445.922002314815 | 41.242 |
| 44445.96366898149 | 41.068 |
| 44446.00533564815 | 40.972 |
| 44446.047002314815 | 40.895 |
| 44446.08866898149 | 40.837 |
| 44446.13033564815 | 40.721 |
| 44446.172002314815 | 40.586 |
| 44446.21366898149 | 40.335 |
| 44446.25533564815 | 40.2 |
| 44446.297002314815 | 40.161 |
| 44446.33866898149 | 40.219 |
| 44446.38033564815 | 40.721 |
| 44446.422002314815 | 41.686 |
| 44446.46366898149 | 43.54 |
| 44446.50533564815 | 44.736 |
| 44446.547002314815 | 45.586 |
| 44446.58866898149 | 45.837 |
| 44446.63033564815 | 45.875 |
| 44446.672002314815 | 44.814 |
| 44446.71366898149 | 43.829 |
| 44446.75533564815 | 42.98 |
| 44446.797002314815 | 42.13 |
| 44446.83866898149 | 41.59 |
| 44446.88033564815 | 41.242 |
| 44446.922002314815 | 41.088 |
| 44446.96366898149 | 41.03 |
| 44447.00533564815 | 40.914 |
| 44447.047002314815 | 40.875 |
| 44447.08866898149 | 40.779 |
| 44447.13033564815 | 40.817 |
| 44447.172002314815 | 40.702 |
| 44447.21366898149 | 40.605 |
| 44447.25533564815 | 40.354 |
| 44447.297002314815 | 40.277 |
| 44447.33866898149 | 40.393 |
| 44447.38033564815 | 40.875 |
| 44447.422002314815 | 41.918 |
| 44447.46366898149 | 43.443 |
| 44447.50533564815 | 44.814 |
| 44447.547002314815 | 45.586 |
| 44447.58866898149 | 45.837 |
| 44447.63033564815 | 45.624 |
| 44447.672002314815 | 44.814 |
| 44447.71366898149 | 43.887 |
| 44447.75533564815 | 43.115 |
| 44447.797002314815 | 42.265 |
| 44447.83866898149 | 41.59 |
| 44447.88033564815 | 41.242 |
| 44447.922002314815 | 41.068 |
| 44447.96366898149 | 40.933 |
| 44448.00533564815 | 40.875 |
| 44448.047002314815 | 40.798 |
| 44448.08866898149 | 40.74 |
| 44448.13033564815 | 40.682 |
| 44448.172002314815 | 40.644 |
| 44448.21366898149 | 40.605 |
| 44448.25533564815 | 40.451 |
| 44448.297002314815 | 40.316 |
| 44448.33866898149 | 40.277 |
| 44448.38033564815 | 40.682 |
| 44448.422002314815 | 41.821 |
| 44448.46366898149 | 43.366 |
| 44448.50533564815 | 44.736 |
| 44448.547002314815 | 45.586 |
| 44448.58866898149 | 45.895 |
| 44448.63033564815 | 45.663 |
| 44448.672002314815 | 44.929 |
| 44448.71366898149 | 44.022 |
| 44448.75533564815 | 43.115 |
| 44448.797002314815 | 42.381 |
| 44448.83866898149 | 41.879 |
| 44448.88033564815 | 41.551 |
| 44448.922002314815 | 41.3 |
| 44448.96366898149 | 41.184 |
| 44449.00533564815 | 41.068 |
| 44449.047002314815 | 40.991 |
| 44449.08866898149 | 40.914 |
| 44449.13033564815 | 40.837 |
| 44449.172002314815 | 40.682 |
| 44449.21366898149 | 40.605 |
| 44449.25533564815 | 40.547 |
| 44449.297002314815 | 40.547 |
| 44449.33866898149 | 40.605 |
| 44449.38033564815 | 40.837 |
| 44449.422002314815 | 41.706 |
| 44449.46366898149 | 43.269 |
| 44449.50533564815 | 44.717 |
| 44449.547002314815 | 45.586 |
| 44449.58866898149 | 45.895 |
| 44449.63033564815 | 45.624 |
| 44449.672002314815 | 44.987 |
| 44449.71366898149 | 44.08 |
| 44449.75533564815 | 43.192 |
| 44449.797002314815 | 42.362 |
| 44449.83866898149 | 41.744 |
| 44449.88033564815 | 41.435 |
| 44449.922002314815 | 41.261 |
| 44449.96366898149 | 41.165 |
| 44450.00533564815 | 41.049 |
| 44450.047002314815 | 40.991 |
| 44450.08866898149 | 40.953 |
| 44450.13033564815 | 40.837 |
| 44450.172002314815 | 40.817 |
| 44450.21366898149 | 40.74 |
| 44450.25533564815 | 40.74 |
| 44450.297002314815 | 40.644 |
| 44450.33866898149 | 40.74 |
| 44450.38033564815 | 41.204 |
| 44450.422002314815 | 42.304 |
| 44450.46366898149 | 43.597 |
| 44450.50533564815 | 44.601 |
| 44450.547002314815 | 44.91 |
| 44450.58866898149 | 45.142 |
| 44450.63033564815 | 44.929 |
| 44450.672002314815 | 44.872 |
| 44450.71366898149 | 44.428 |
| 44450.75533564815 | 43.482 |
| 44450.797002314815 | 42.458 |
| 44450.83866898149 | 41.899 |
| 44450.88033564815 | 41.725 |
| 44450.922002314815 | 41.686 |
| 44450.96366898149 | 41.416 |
| 44451.00533564815 | 41.146 |
| 44451.047002314815 | 41.088 |
| 44451.08866898149 | 41.011 |
| 44451.13033564815 | 40.972 |
| 44451.172002314815 | 40.933 |
| 44451.21366898149 | 41.011 |
| 44451.25533564815 | 41.088 |
| 44451.297002314815 | 40.953 |
| 44451.33866898149 | 40.972 |
| 44451.38033564815 | 41.474 |
| 44451.422002314815 | 42.497 |
| 44451.46366898149 | 43.713 |
| 44451.50533564815 | 45.123 |
| 44451.547002314815 | 45.605 |
| 44451.58866898149 | 45.18 |
| 44451.63033564815 | 45.238 |
| 44451.672002314815 | 44.621 |
| 44451.71366898149 | 44.08 |
| 44451.75533564815 | 43.173 |
| 44451.797002314815 | 42.536 |
| 44451.83866898149 | 41.956 |
| 44451.88033564815 | 41.59 |
| 44451.922002314815 | 41.435 |
| 44451.96366898149 | 41.319 |
| 44452.00533564815 | 41.242 |
| 44452.047002314815 | 41.184 |
| 44452.08866898149 | 41.107 |
| 44452.13033564815 | 41.049 |
| 44452.172002314815 | 40.972 |
| 44452.21366898149 | 40.953 |
| 44452.25533564815 | 41.068 |
| 44452.297002314815 | 41.126 |
| 44452.33866898149 | 41.011 |
| 44452.38033564815 | 41.107 |
| 44452.422002314815 | 41.841 |
| 44452.46366898149 | 43.597 |
| 44452.50533564815 | 44.872 |
| 44452.547002314815 | 46.088 |
| 44452.58866898149 | 46.609 |
| 44452.63033564815 | 45.779 |
| 44452.672002314815 | 44.543 |
| 44452.71366898149 | 43.694 |
| 44452.75533564815 | 43.231 |
| 44452.797002314815 | 42.651 |
| 44452.83866898149 | 42.246 |
| 44452.88033564815 | 41.937 |
| 44452.922002314815 | 41.455 |
| 44452.96366898149 | 41.184 |
| 44453.00533564815 | 41.107 |
| 44453.047002314815 | 41.011 |
| 44453.08866898149 | 40.875 |
| 44453.13033564815 | 40.702 |
| 44453.172002314815 | 40.624 |
| 44453.21366898149 | 40.663 |
| 44453.25533564815 | 40.605 |
| 44453.297002314815 | 40.721 |
| 44453.33866898149 | 40.837 |
| 44453.38033564815 | 41.242 |
| 44453.422002314815 | 42.188 |
| 44453.46366898149 | 43.578 |
| 44453.50533564815 | 44.563 |
| 44453.547002314815 | 44.601 |
| 44453.58866898149 | 44.621 |
| 44453.63033564815 | 43.482 |
| 44453.672002314815 | 44.022 |
| 44453.71366898149 | 44.041 |
| 44453.75533564815 | 42.845 |
| 44453.797002314815 | 42.285 |
| 44453.83866898149 | 41.821 |
| 44453.88033564815 | 41.455 |
| 44453.922002314815 | 41.3 |
| 44453.96366898149 | 41.146 |
| 44454.00533564815 | 40.914 |
| 44454.047002314815 | 40.779 |
| 44454.08866898149 | 40.644 |
| 44454.13033564815 | 40.624 |
| 44454.172002314815 | 40.547 |
| 44454.21366898149 | 40.489 |
| 44454.25533564815 | 40.412 |
| 44454.297002314815 | 40.335 |
| 44454.33866898149 | 40.373 |
| 44454.38033564815 | 40.779 |
| 44454.422002314815 | 41.783 |
| 44454.46366898149 | 43.385 |
| 44454.50533564815 | 44.717 |
| 44454.547002314815 | 45.547 |
| 44454.58866898149 | 45.721 |
| 44454.63033564815 | 45.489 |
| 44454.672002314815 | 44.717 |
| 44454.71366898149 | 43.655 |
| 44454.75533564815 | 42.709 |
| 44454.797002314815 | 41.976 |
| 44454.83866898149 | 41.397 |
| 44454.88033564815 | 41.146 |
| 44454.922002314815 | 41.107 |
| 44454.96366898149 | 41.068 |
| 44455.00533564815 | 40.972 |
| 44455.047002314815 | 40.875 |
| 44455.08866898149 | 40.702 |
| 44455.13033564815 | 40.586 |
| 44455.172002314815 | 40.528 |
| 44455.21366898149 | 40.431 |
| 44455.25533564815 | 40.393 |
| 44455.297002314815 | 40.238 |
| 44455.33866898149 | 40.335 |
| 44455.38033564815 | 40.721 |
| 44455.422002314815 | 41.763 |
| 44455.46366898149 | 43.404 |
| 44455.50533564815 | 44.833 |
| 44455.547002314815 | 44.987 |
| 44455.58866898149 | 44.872 |
| 44455.63033564815 | 44.466 |
| 44455.672002314815 | 44.138 |
| 44455.71366898149 | 43.52 |
| 44455.75533564815 | 42.632 |
| 44455.797002314815 | 41.995 |
| 44455.83866898149 | 41.686 |
| 44455.88033564815 | 41.474 |
| 44455.922002314815 | 41.242 |
| 44455.96366898149 | 41.049 |
| 44456.00533564815 | 40.972 |
| 44456.047002314815 | 40.856 |
| 44456.08866898149 | 40.76 |
| 44456.13033564815 | 40.721 |
| 44456.172002314815 | 40.682 |
| 44456.21366898149 | 40.644 |
| 44456.25533564815 | 40.547 |
| 44456.297002314815 | 40.47 |
| 44456.33866898149 | 40.451 |
| 44456.38033564815 | 40.779 |
| 44456.422002314815 | 41.86 |
| 44456.46366898149 | 43.366 |
| 44456.50533564815 | 44.582 |
| 44456.547002314815 | 45.451 |
| 44456.58866898149 | 45.258 |
| 44456.63033564815 | 44.872 |
| 44456.672002314815 | 44.621 |
| 44456.71366898149 | 43.79 |
| 44456.75533564815 | 42.941 |
| 44456.797002314815 | 42.169 |
| 44456.83866898149 | 41.667 |
| 44456.88033564815 | 41.416 |
| 44456.922002314815 | 41.319 |
| 44456.96366898149 | 41.184 |
| 44457.00533564815 | 40.972 |
| 44457.047002314815 | 40.779 |
| 44457.08866898149 | 40.663 |
| 44457.13033564815 | 40.605 |
| 44457.172002314815 | 40.567 |
| 44457.21366898149 | 40.509 |
| 44457.25533564815 | 40.451 |
| 44457.297002314815 | 40.393 |
| 44457.33866898149 | 40.431 |
| 44457.38033564815 | 40.74 |
| 44457.422002314815 | 41.744 |
| 44457.46366898149 | 43.308 |
| 44457.50533564815 | 44.679 |
| 44457.547002314815 | 45.026 |
| 44457.58866898149 | 44.659 |
| 44457.63033564815 | 44.234 |
| 44457.672002314815 | 43.848 |
| 44457.71366898149 | 43.385 |
| 44457.75533564815 | 42.748 |
| 44457.797002314815 | 42.246 |
| 44457.83866898149 | 41.821 |
| 44457.88033564815 | 41.628 |
| 44457.922002314815 | 41.474 |
| 44457.96366898149 | 41.57 |
| 44458.00533564815 | 41.59 |
| 44458.047002314815 | 41.455 |
| 44458.08866898149 | 41.242 |
| 44458.13033564815 | 41.281 |
| 44458.172002314815 | 41.3 |
| 44458.21366898149 | 41.107 |
| 44458.25533564815 | 40.933 |
| 44458.297002314815 | 40.875 |
| 44458.33866898149 | 40.914 |
| 44458.38033564815 | 41.242 |
| 44458.422002314815 | 42.265 |
| 44458.46366898149 | 42.787 |
| 44458.50533564815 | 44.37 |
| 44458.547002314815 | 44.35 |
| 44458.58866898149 | 44.196 |
| 44458.63033564815 | 44.563 |
| 44458.672002314815 | 43.848 |
| 44458.71366898149 | 43.482 |
| 44458.75533564815 | 42.478 |
| 44458.797002314815 | 41.976 |
| 44458.83866898149 | 41.706 |
| 44458.88033564815 | 41.512 |
| 44458.922002314815 | 41.319 |
| 44458.96366898149 | 41.146 |
| 44459.00533564815 | 41.107 |
| 44459.047002314815 | 41.107 |
| 44459.08866898149 | 41.088 |
| 44459.13033564815 | 40.721 |
| 44459.172002314815 | 40.605 |
| 44459.21366898149 | 40.624 |
| 44459.25533564815 | 40.605 |
| 44459.297002314815 | 40.47 |
| 44459.33866898149 | 40.47 |
| 44459.38033564815 | 40.605 |
| 44459.422002314815 | 40.702 |
| 44459.46366898149 | 41.146 |
| 44459.50533564815 | 41.86 |
| 44459.547002314815 | 43.115 |
| 44459.58866898149 | 44.234 |
| 44459.63033564815 | 44.312 |
| 44459.672002314815 | 43.887 |
| 44459.71366898149 | 43.095 |
| 44459.75533564815 | 42.304 |
| 44459.797002314815 | 41.493 |
| 44459.83866898149 | 40.991 |
| 44459.88033564815 | 40.875 |
| 44459.922002314815 | 40.74 |
| 44459.96366898149 | 40.663 |
| 44460.00533564815 | 40.605 |
| 44460.047002314815 | 40.624 |
| 44460.08866898149 | 40.624 |
| 44460.13033564815 | 40.567 |
| 44460.172002314815 | 40.509 |
| 44460.21366898149 | 40.431 |
| 44460.25533564815 | 40.335 |
| 44460.297002314815 | 40.238 |
| 44460.33866898149 | 40.219 |
| 44460.38033564815 | 40.489 |
| 44460.422002314815 | 41.416 |
| 44460.46366898149 | 42.941 |
| 44460.50533564815 | 44.177 |
| 44460.547002314815 | 44.872 |
| 44460.58866898149 | 45.026 |
| 44460.63033564815 | 44.679 |
| 44460.672002314815 | 43.906 |
| 44460.71366898149 | 43.018 |
| 44460.75533564815 | 42.246 |
| 44460.797002314815 | 41.609 |
| 44460.83866898149 | 41.242 |
| 44460.88033564815 | 41.011 |
| 44460.922002314815 | 40.721 |
| 44460.96366898149 | 40.528 |
| 44461.00533564815 | 40.47 |
| 44461.047002314815 | 40.354 |
| 44461.08866898149 | 40.219 |
| 44461.13033564815 | 40.122 |
| 44461.172002314815 | 40.084 |
| 44461.21366898149 | 40.065 |
| 44461.25533564815 | 39.987 |
| 44461.297002314815 | 39.91 |
| 44461.33866898149 | 39.949 |
| 44461.38033564815 | 40.296 |
| 44461.422002314815 | 41.281 |
| 44461.46366898149 | 42.883 |
| 44461.50533564815 | 44.234 |
| 44461.547002314815 | 45.026 |
| 44461.58866898149 | 45.258 |
| 44461.63033564815 | 44.91 |
| 44461.672002314815 | 44.157 |
| 44461.71366898149 | 43.192 |
| 44461.75533564815 | 42.343 |
| 44461.797002314815 | 41.551 |
| 44461.83866898149 | 41.165 |
| 44461.88033564815 | 40.972 |
| 44461.922002314815 | 40.875 |
| 44461.96366898149 | 40.837 |
| 44462.00533564815 | 40.663 |
| 44462.047002314815 | 40.586 |
| 44462.08866898149 | 40.509 |
| 44462.13033564815 | 40.373 |
| 44462.172002314815 | 40.316 |
| 44462.21366898149 | 40.238 |
| 44462.25533564815 | 40.161 |
| 44462.297002314815 | 40.142 |
| 44462.33866898149 | 40.142 |
| 44462.38033564815 | 40.451 |
| 44462.422002314815 | 41.339 |
| 44462.46366898149 | 42.806 |
| 44462.50533564815 | 44.08 |
| 44462.547002314815 | 44.91 |
| 44462.58866898149 | 45.258 |
| 44462.63033564815 | 44.331 |
| 44462.672002314815 | 42.883 |
| 44462.71366898149 | 42.555 |
| 44462.75533564815 | 42.111 |
| 44462.797002314815 | 41.918 |
| 44462.83866898149 | 41.763 |
| 44462.88033564815 | 41.763 |
| 44462.922002314815 | 41.744 |
| 44462.96366898149 | 41.512 |
| 44463.00533564815 | 41.281 |
| 44463.047002314815 | 41.184 |
| 44463.08866898149 | 41.03 |
| 44463.13033564815 | 40.895 |
| 44463.172002314815 | 40.76 |
| 44463.21366898149 | 40.586 |
| 44463.25533564815 | 40.431 |
| 44463.297002314815 | 40.354 |
| 44463.33866898149 | 40.373 |
| 44463.38033564815 | 40.644 |
| 44463.422002314815 | 41.628 |
| 44463.46366898149 | 43.134 |
| 44463.50533564815 | 44.447 |
| 44463.547002314815 | 45.2 |
| 44463.58866898149 | 45.354 |
| 44463.63033564815 | 45.045 |
| 44463.672002314815 | 44.292 |
| 44463.71366898149 | 43.385 |
| 44463.75533564815 | 42.632 |
| 44463.797002314815 | 41.918 |
| 44463.83866898149 | 41.551 |
| 44463.88033564815 | 41.339 |
| 44463.922002314815 | 41.126 |
| 44463.96366898149 | 40.914 |
| 44464.00533564815 | 40.76 |
| 44464.047002314815 | 40.663 |
| 44464.08866898149 | 40.528 |
| 44464.13033564815 | 40.431 |
| 44464.172002314815 | 40.354 |
| 44464.21366898149 | 40.296 |
| 44464.25533564815 | 40.277 |
| 44464.297002314815 | 40.238 |
| 44464.33866898149 | 40.316 |
| 44464.38033564815 | 40.644 |
| 44464.422002314815 | 41.628 |
| 44464.46366898149 | 43.153 |
| 44464.50533564815 | 44.428 |
| 44464.547002314815 | 45.161 |
| 44464.58866898149 | 45.335 |
| 44464.63033564815 | 45.026 |
| 44464.672002314815 | 44.331 |
| 44464.71366898149 | 43.366 |
| 44464.75533564815 | 42.536 |
| 44464.797002314815 | 41.86 |
| 44464.83866898149 | 41.609 |
| 44464.88033564815 | 41.416 |
| 44464.922002314815 | 41.339 |
| 44464.96366898149 | 41.261 |
| 44465.00533564815 | 41.146 |
| 44465.047002314815 | 41.03 |
| 44465.08866898149 | 40.933 |
| 44465.13033564815 | 40.817 |
| 44465.172002314815 | 40.702 |
| 44465.21366898149 | 40.605 |
| 44465.25533564815 | 40.567 |
| 44465.297002314815 | 40.586 |
| 44465.33866898149 | 40.605 |
| 44465.38033564815 | 40.991 |
| 44465.422002314815 | 41.744 |
| 44465.46366898149 | 42.632 |
| 44465.50533564815 | 43.964 |
| 44465.547002314815 | 45.084 |
| 44465.58866898149 | 45.489 |
| 44465.63033564815 | 45.142 |
| 44465.672002314815 | 44.428 |
| 44465.71366898149 | 43.578 |
| 44465.75533564815 | 42.864 |
| 44465.797002314815 | 42.362 |
| 44465.83866898149 | 41.995 |
| 44465.88033564815 | 41.821 |
| 44465.922002314815 | 41.435 |
| 44465.96366898149 | 41.146 |
| 44466.00533564815 | 40.991 |
| 44466.047002314815 | 40.856 |
| 44466.08866898149 | 40.702 |
| 44466.13033564815 | 40.663 |
| 44466.172002314815 | 40.605 |
| 44466.21366898149 | 40.586 |
| 44466.25533564815 | 40.451 |
| 44466.297002314815 | 40.412 |
| 44466.33866898149 | 40.528 |
| 44466.38033564815 | 40.798 |
| 44466.422002314815 | 41.802 |
| 44466.46366898149 | 43.134 |
| 44466.50533564815 | 44.485 |
| 44466.547002314815 | 44.794 |
| 44466.58866898149 | 43.54 |
| 44466.63033564815 | 43.424 |
| 44466.672002314815 | 43.211 |
| 44466.71366898149 | 42.651 |
| 44466.75533564815 | 42.4 |
| 44466.797002314815 | 42.13 |
| 44466.83866898149 | 41.706 |
| 44466.88033564815 | 41.532 |
| 44466.922002314815 | 41.455 |
| 44466.96366898149 | 41.416 |
| 44467.00533564815 | 41.358 |
| 44467.047002314815 | 41.339 |
| 44467.08866898149 | 41.281 |
| 44467.13033564815 | 41.126 |
| 44467.172002314815 | 41.107 |
| 44467.21366898149 | 41.107 |
| 44467.25533564815 | 41.068 |
| 44467.297002314815 | 40.972 |
| 44467.33866898149 | 40.837 |
| 44467.38033564815 | 41.204 |
| 44467.422002314815 | 42.111 |
| 44467.46366898149 | 43.771 |
| 44467.50533564815 | 44.968 |
| 44467.547002314815 | 44.408 |
| 44467.58866898149 | 42.864 |
| 44467.63033564815 | 42.246 |
| 44467.672002314815 | 42.188 |
| 44467.71366898149 | 42.227 |
| 44467.75533564815 | 42.111 |
| 44467.797002314815 | 41.841 |
| 44467.83866898149 | 41.725 |
| 44467.88033564815 | 41.725 |
| 44467.922002314815 | 41.725 |
| 44467.96366898149 | 41.648 |
| 44468.00533564815 | 41.532 |
| 44468.047002314815 | 41.512 |
| 44468.08866898149 | 41.358 |
| 44468.13033564815 | 41.319 |
| 44468.172002314815 | 41.204 |
| 44468.21366898149 | 41.261 |
| 44468.25533564815 | 41.223 |
| 44468.297002314815 | 41.223 |
| 44468.33866898149 | 41.242 |
| 44468.38033564815 | 41.686 |
| 44468.422002314815 | 42.15 |
| 44468.46366898149 | 42.516 |
| 44468.50533564815 | 42.323 |
| 44468.547002314815 | 42.072 |
| 44468.58866898149 | 42.709 |
| 44468.63033564815 | 43.54 |
| 44468.672002314815 | 44.061 |
| 44468.71366898149 | 43.636 |
| 44468.75533564815 | 42.632 |
| 44468.797002314815 | 42.111 |
| 44468.83866898149 | 41.628 |
| 44468.88033564815 | 41.358 |
| 44468.922002314815 | 41.281 |
| 44468.96366898149 | 41.3 |
| 44469.00533564815 | 41.261 |
| 44469.047002314815 | 41.223 |
| 44469.08866898149 | 41.242 |
| 44469.13033564815 | 41.319 |
| 44469.172002314815 | 41.281 |
| 44469.21366898149 | 41.242 |
| 44469.25533564815 | 41.281 |
| 44469.297002314815 | 41.184 |
| 44469.33866898149 | 41.204 |
| 44469.38033564815 | 41.397 |
| 44469.422002314815 | 41.744 |
| 44469.46366898149 | 43.289 |
| 44469.50533564815 | 44.389 |
| 44469.547002314815 | 44.601 |
| 44469.58866898149 | 45.296 |
| 44469.63033564815 | 45.509 |
| 44469.672002314815 | 44.659 |
| 44469.71366898149 | 43.54 |
| 44469.75533564815 | 42.729 |
| 44469.797002314815 | 42.014 |
| 44469.83866898149 | 41.628 |
| 44469.88033564815 | 41.493 |
| 44469.922002314815 | 41.512 |
| 44469.96366898149 | 41.512 |
| 44470.00533564815 | 41.474 |
| 44470.047002314815 | 41.358 |
| 44470.08866898149 | 41.146 |
| 44470.13033564815 | 41.03 |
| 44470.172002314815 | 40.972 |
| 44470.21366898149 | 40.933 |
| 44470.25533564815 | 40.991 |
| 44470.297002314815 | 41.068 |
| 44470.33866898149 | 41.088 |
| 44470.38033564815 | 41.261 |
| 44470.422002314815 | 41.86 |
| 44470.46366898149 | 42.748 |
| 44470.50533564815 | 43.192 |
| 44470.547002314815 | 43.964 |
| 44470.58866898149 | 43.655 |
| 44470.63033564815 | 42.825 |
| 44470.672002314815 | 42.941 |
| 44470.71366898149 | 42.922 |
| 44470.75533564815 | 42.439 |
| 44470.797002314815 | 42.014 |
| 44470.83866898149 | 41.725 |
| 44470.88033564815 | 41.532 |
| 44470.922002314815 | 41.455 |
| 44470.96366898149 | 41.358 |
| 44471.00533564815 | 41.339 |
| 44471.047002314815 | 41.242 |
| 44471.08866898149 | 40.991 |
| 44471.13033564815 | 40.779 |
| 44471.172002314815 | 40.74 |
| 44471.21366898149 | 40.953 |
| 44471.25533564815 | 40.895 |
| 44471.297002314815 | 40.856 |
| 44471.33866898149 | 40.856 |
| 44471.38033564815 | 41.223 |
| 44471.422002314815 | 42.092 |
| 44471.46366898149 | 43.578 |
| 44471.50533564815 | 44.756 |
| 44471.547002314815 | 45.509 |
| 44471.58866898149 | 45.682 |
| 44471.63033564815 | 44.736 |
| 44471.672002314815 | 43.482 |
| 44471.71366898149 | 42.941 |
| 44471.75533564815 | 42.285 |
| 44471.797002314815 | 41.667 |
| 44471.83866898149 | 41.377 |
| 44471.88033564815 | 41.107 |
| 44471.922002314815 | 41.011 |
| 44471.96366898149 | 40.972 |
| 44472.00533564815 | 40.779 |
| 44472.047002314815 | 40.74 |
| 44472.08866898149 | 40.605 |
| 44472.13033564815 | 40.528 |
| 44472.172002314815 | 40.509 |
| 44472.21366898149 | 40.393 |
| 44472.25533564815 | 40.2 |
| 44472.297002314815 | 40.103 |
| 44472.33866898149 | 40.065 |
| 44472.38033564815 | 40.431 |
| 44472.422002314815 | 41.416 |
| 44472.46366898149 | 43.076 |
| 44472.50533564815 | 44.35 |
| 44472.547002314815 | 45.065 |
| 44472.58866898149 | 45.277 |
| 44472.63033564815 | 44.968 |
| 44472.672002314815 | 44.196 |
| 44472.71366898149 | 43.231 |
| 44472.75533564815 | 42.362 |
| 44472.797002314815 | 41.667 |
| 44472.83866898149 | 41.319 |
| 44472.88033564815 | 41.107 |
| 44472.922002314815 | 40.972 |
| 44472.96366898149 | 40.817 |
| 44473.00533564815 | 40.702 |
| 44473.047002314815 | 40.528 |
| 44473.08866898149 | 40.431 |
| 44473.13033564815 | 40.316 |
| 44473.172002314815 | 40.219 |
| 44473.21366898149 | 40.161 |
| 44473.25533564815 | 40.026 |
| 44473.297002314815 | 39.949 |
| 44473.33866898149 | 39.987 |
| 44473.38033564815 | 40.277 |
| 44473.422002314815 | 41.242 |
| 44473.46366898149 | 42.902 |
| 44473.50533564815 | 44.177 |
| 44473.547002314815 | 44.852 |
| 44473.58866898149 | 45.026 |
| 44473.63033564815 | 44.601 |
| 44473.672002314815 | 43.887 |
| 44473.71366898149 | 42.999 |
| 44473.75533564815 | 42.227 |
| 44473.797002314815 | 41.725 |
| 44473.83866898149 | 41.455 |
| 44473.88033564815 | 41.204 |
| 44473.922002314815 | 41.049 |
| 44473.96366898149 | 40.972 |
| 44474.00533564815 | 40.875 |
| 44474.047002314815 | 40.779 |
| 44474.08866898149 | 40.721 |
| 44474.13033564815 | 40.624 |
| 44474.172002314815 | 40.644 |
| 44474.21366898149 | 40.547 |
| 44474.25533564815 | 40.509 |
| 44474.297002314815 | 40.528 |
| 44474.33866898149 | 40.547 |
| 44474.38033564815 | 40.837 |
| 44474.422002314815 | 41.783 |
| 44474.46366898149 | 43.231 |
| 44474.50533564815 | 44.485 |
| 44474.547002314815 | 45.142 |
| 44474.58866898149 | 45.296 |
| 44474.63033564815 | 44.929 |
| 44474.672002314815 | 44.138 |
| 44474.71366898149 | 43.095 |
| 44474.75533564815 | 42.323 |
| 44474.797002314815 | 41.783 |
| 44474.83866898149 | 41.628 |
| 44474.88033564815 | 41.435 |
| 44474.922002314815 | 41.397 |
| 44474.96366898149 | 41.339 |
| 44475.00533564815 | 41.204 |
| 44475.047002314815 | 41.107 |
| 44475.08866898149 | 41.03 |
| 44475.13033564815 | 41.03 |
| 44475.172002314815 | 40.972 |
| 44475.21366898149 | 40.779 |
| 44475.25533564815 | 40.663 |
| 44475.297002314815 | 40.682 |
| 44475.33866898149 | 40.856 |
| 44475.38033564815 | 41.261 |
| 44475.422002314815 | 41.763 |
| 44475.46366898149 | 42.613 |
| 44475.50533564815 | 43.501 |
| 44475.547002314815 | 43.346 |
| 44475.58866898149 | 43.038 |
| 44475.63033564815 | 43.038 |
| 44475.672002314815 | 43.018 |
| 44475.71366898149 | 42.574 |
| 44475.75533564815 | 42.246 |
| 44475.797002314815 | 41.667 |
| 44475.83866898149 | 41.339 |
| 44475.88033564815 | 41.107 |
| 44475.922002314815 | 40.933 |
| 44475.96366898149 | 40.779 |
| 44476.00533564815 | 40.721 |
| 44476.047002314815 | 40.605 |
| 44476.08866898149 | 40.489 |
| 44476.13033564815 | 40.47 |
| 44476.172002314815 | 40.335 |
| 44476.21366898149 | 40.238 |
| 44476.25533564815 | 40.2 |
| 44476.297002314815 | 40.122 |
| 44476.33866898149 | 40.142 |
| 44476.38033564815 | 40.451 |
| 44476.422002314815 | 41.474 |
| 44476.46366898149 | 42.98 |
| 44476.50533564815 | 44.389 |
| 44476.547002314815 | 45.084 |
| 44476.58866898149 | 45.258 |
| 44476.63033564815 | 44.138 |
| 44476.672002314815 | 45.818 |
| 44476.71366898149 | 49.717 |
| 44476.75533564815 | 48.791 |
| 44476.797002314815 | 47.323 |
| 44476.83866898149 | 46.242 |
| 44476.88033564815 | 44.621 |
| 44476.922002314815 | 42.574 |
| 44476.96366898149 | 41.088 |
| 44477.00533564815 | 40.026 |
| 44477.047002314815 | 37.883 |
| 44477.08866898149 | 36.841 |
| 44477.13033564815 | 36.397 |
| 44477.172002314815 | 35.895 |
| 44477.21366898149 | 35.2 |
| 44477.25533564815 | 34.659 |
| 44477.297002314815 | 34.389 |
| 44477.33866898149 | 34.563 |
| 44477.38033564815 | 38.945 |
| 44477.422002314815 | 41.802 |
| 44477.46366898149 | 58.076 |
| 44477.50533564815 | 59.022 |
| 44477.547002314815 | 53.443 |
| 44477.58866898149 | 54.679 |
| 44477.63033564815 | 52.439 |
| 44477.672002314815 | 51.976 |
| 44477.71366898149 | 48.655 |
| 44477.75533564815 | 46.262 |
| 44477.797002314815 | 44.524 |
| 44477.83866898149 | 42.787 |
| 44477.88033564815 | 43.173 |
| 44477.922002314815 | 42.767 |
| 44477.96366898149 | 43.095 |
| 44478.00533564815 | 42.227 |
| 44478.047002314815 | 42.15 |
| 44478.08866898149 | 41.667 |
| 44478.13033564815 | 40.856 |
| 44478.172002314815 | 41.474 |
| 44478.21366898149 | 41.493 |
| 44478.25533564815 | 40.875 |
| 44478.297002314815 | 39.91 |
| 44478.33866898149 | 40.122 |
| 44478.38033564815 | 40.393 |
| 44478.422002314815 | 41.686 |
| 44478.46366898149 | 43.346 |
| 44478.50533564815 | 45.933 |
| 44478.547002314815 | 42.072 |
| 44478.58866898149 | 41.763 |
| 44478.63033564815 | 41.899 |
| 44478.672002314815 | 42.594 |
| 44478.71366898149 | 40.489 |
| 44478.75533564815 | 38.983 |
| 44478.797002314815 | 37.864 |
| 44478.83866898149 | 36.802 |
| 44478.88033564815 | 36.165 |
| 44478.922002314815 | 36.551 |
| 44478.96366898149 | 35.509 |
| 44479.00533564815 | 35.065 |
| 44479.047002314815 | 32.748 |
| 44479.08866898149 | 33.057 |
| 44479.13033564815 | 33.617 |
| 44479.172002314815 | 33.617 |
| 44479.21366898149 | 32.941 |
| 44479.25533564815 | 33.25 |
| 44479.297002314815 | 33.617 |
| 44479.33866898149 | 34.234 |
| 44479.38033564815 | 35.837 |
| 44479.422002314815 | 39.215 |
| 44479.46366898149 | 46.802 |
| 44479.50533564815 | 44.543 |
| 44479.547002314815 | 44.736 |
| 44479.58866898149 | 45.837 |
| 44479.63033564815 | 45.586 |
| 44479.672002314815 | 44.08 |
| 44479.71366898149 | 42.845 |
| 44479.75533564815 | 41.281 |
| 44479.797002314815 | 40.045 |
| 44479.83866898149 | 38.81 |
| 44479.88033564815 | 38.038 |
| 44479.922002314815 | 35.296 |
| 44479.96366898149 | 33.771 |
| 44480.00533564815 | 31.879 |
| 44480.047002314815 | 30.547 |
| 44480.08866898149 | 29.698 |
| 44480.13033564815 | 29.254 |
| 44480.172002314815 | 30.74 |
| 44480.21366898149 | 30.315 |
| 44480.25533564815 | 29.929 |
| 44480.297002314815 | 29.659 |
| 44480.33866898149 | 29.756 |
| 44480.38033564815 | 31.165 |
| 44480.422002314815 | 32.13 |
| 44480.46366898149 | 54.814 |
| 44480.50533564815 | 57.246 |
| 44480.547002314815 | 57.015 |
| 44480.58866898149 | 54.119 |
| 44480.63033564815 | 50.277 |
| 44480.672002314815 | 49.157 |
| 44480.71366898149 | 47.613 |
| 44480.75533564815 | 46.821 |
| 44480.797002314815 | 44.968 |
| 44480.83866898149 | 41.455 |
| 44480.88033564815 | 40.335 |
| 44480.922002314815 | 39.119 |
| 44480.96366898149 | 37.999 |
| 44481.00533564815 | 36.281 |
| 44481.047002314815 | 35.277 |
| 44481.08866898149 | 36.339 |
| 44481.13033564815 | 37.246 |
| 44481.172002314815 | 37.806 |
| 44481.21366898149 | 36.918 |
| 44481.25533564815 | 36.397 |
| 44481.297002314815 | 37.092 |
| 44481.33866898149 | 37.227 |
| 44481.38033564815 | 39.929 |
| 44481.422002314815 | 43.327 |
| 44481.46366898149 | 42.227 |
| 44481.50533564815 | 39.717 |
| 44481.547002314815 | 44.756 |
| 44481.58866898149 | 42.96 |
| 44481.63033564815 | 37.072 |
| 44481.672002314815 | 37.555 |
| 44481.71366898149 | 37.69 |
| 44481.75533564815 | 35.335 |
| 44481.797002314815 | 33.926 |
| 44481.83866898149 | 33.095 |
| 44481.88033564815 | 32.169 |
| 44481.922002314815 | 31.879 |
| 44481.96366898149 | 31.59 |
| 44482.00533564815 | 31.454 |
| 44482.047002314815 | 31.416 |
| 44482.08866898149 | 31.454 |
| 44482.13033564815 | 31.57 |
| 44482.172002314815 | 31.763 |
| 44482.21366898149 | 31.802 |
| 44482.25533564815 | 31.841 |
| 44482.297002314815 | 31.918 |
| 44482.33866898149 | 31.976 |
| 44482.38033564815 | 32.246 |
| 44482.422002314815 | 33.173 |
| 44482.46366898149 | 33.732 |
| 44482.50533564815 | 34.35 |
| 44482.547002314815 | 36.59 |
| 44482.58866898149 | 39.428 |
| 44482.63033564815 | 39.775 |
| 44482.672002314815 | 38.617 |
| 44482.71366898149 | 38.385 |
| 44482.75533564815 | 37.632 |
| 44482.797002314815 | 36.474 |
| 44482.83866898149 | 35.798 |
| 44482.88033564815 | 33.288 |
| 44482.922002314815 | 32.323 |
| 44482.96366898149 | 31.86 |
| 44483.00533564815 | 31.049 |
| 44483.047002314815 | 30.914 |
| 44483.08866898149 | 30.817 |
| 44483.13033564815 | 31.628 |
| 44483.172002314815 | 31.744 |
| 44483.21366898149 | 31.956 |
| 44483.25533564815 | 32.014 |
| 44483.297002314815 | 32.323 |
| 44483.33866898149 | 31.686 |
| 44483.38033564815 | 32.265 |
| 44483.422002314815 | 34.389 |
| 44483.46366898149 | 40.991 |
| 44483.50533564815 | 39.37 |
| 44483.547002314815 | 35.682 |
| 44483.58866898149 | 36.397 |
| 44483.63033564815 | 36.261 |
| 44483.672002314815 | 35.451 |
| 44483.71366898149 | 35.47 |
| 44483.75533564815 | 35.509 |
| 44483.797002314815 | 35.2 |
| 44483.83866898149 | 35.065 |
| 44483.88033564815 | 34.891 |
| 44483.922002314815 | 34.659 |
| 44483.96366898149 | 34.543 |
| 44484.00533564815 | 34.563 |
| 44484.047002314815 | 34.408 |
| 44484.08866898149 | 34.427 |
| 44484.13033564815 | 34.08 |
| 44484.172002314815 | 33.771 |
| 44484.21366898149 | 33.25 |
| 44484.25533564815 | 33.057 |
| 44484.297002314815 | 32.651 |
| 44484.33866898149 | 32.304 |
| 44484.38033564815 | 32.478 |
| 44484.422002314815 | 32.806 |
| 44484.46366898149 | 38.153 |
| 44484.50533564815 | 38.733 |
| 44484.547002314815 | 39.041 |
| 44484.58866898149 | 37.999 |
| 44484.63033564815 | 36.435 |
| 44484.672002314815 | 35.702 |
| 44484.71366898149 | 35.547 |
| 44484.75533564815 | 34.273 |
| 44484.797002314815 | 32.593 |
| 44484.83866898149 | 31.628 |
| 44484.88033564815 | 30.759 |
| 44484.922002314815 | 30.759 |
| 44484.96366898149 | 30.064 |
| 44485.00533564815 | 29.254 |
| 44485.047002314815 | 28.636 |
| 44485.08866898149 | 28.366 |
| 44485.13033564815 | 27.729 |
| 44485.172002314815 | 27.381 |
| 44485.21366898149 | 27.69 |
| 44485.25533564815 | 28.153 |
| 44485.297002314815 | 28.115 |
| 44485.33866898149 | 28.308 |
| 44485.38033564815 | 29.678 |
| 44485.422002314815 | 31.474 |
| 44485.46366898149 | 48.096 |
| 44485.50533564815 | 50.258 |
| 44485.547002314815 | 51.049 |
| 44485.58866898149 | 49.099 |
| 44485.63033564815 | 44.891 |
| 44485.672002314815 | 43.713 |
| 44485.71366898149 | 42.651 |
| 44485.75533564815 | 39.563 |
| 44485.797002314815 | 37.246 |
| 44485.83866898149 | 35.663 |
| 44485.88033564815 | 35.2 |
| 44485.922002314815 | 34.968 |
| 44485.96366898149 | 34.601 |
| 44486.00533564815 | 34.138 |
| 44486.047002314815 | 33.52 |
| 44486.08866898149 | 33.134 |
| 44486.13033564815 | 32.806 |
| 44486.172002314815 | 32.555 |
| 44486.21366898149 | 32.246 |
| 44486.25533564815 | 31.995 |
| 44486.297002314815 | 31.686 |
| 44486.33866898149 | 31.358 |
| 44486.38033564815 | 33.057 |
| 44486.422002314815 | 35.566 |
| 44486.46366898149 | 53.848 |
| 44486.50533564815 | 53.482 |
| 44486.547002314815 | 52.806 |
| 44486.58866898149 | 52.034 |
| 44486.63033564815 | 47.555 |
| 44486.672002314815 | 46.184 |
| 44486.71366898149 | 45.316 |
| 44486.75533564815 | 42.092 |
| 44486.797002314815 | 39.003 |
| 44486.83866898149 | 37.323 |
| 44486.88033564815 | 36.667 |
| 44486.922002314815 | 35.991 |
| 44486.96366898149 | 35.489 |
| 44487.00533564815 | 34.871 |
| 44487.047002314815 | 35.045 |
| 44487.08866898149 | 35.161 |
| 44487.13033564815 | 34.003 |
| 44487.172002314815 | 34.157 |
| 44487.21366898149 | 34.563 |
| 44487.25533564815 | 34.273 |
| 44487.297002314815 | 33.095 |
| 44487.33866898149 | 33.288 |
| 44487.38033564815 | 34.949 |
| 44487.422002314815 | 37.787 |
| 44487.46366898149 | 55.277 |
| 44487.50533564815 | 55.837 |
| 44487.547002314815 | 54.987 |
| 44487.58866898149 | 53.018 |
| 44487.63033564815 | 48.945 |
| 44487.672002314815 | 47.671 |
| 44487.71366898149 | 46.879 |
| 44487.75533564815 | 44.717 |
| 44487.797002314815 | 42.13 |
| 44487.83866898149 | 40.277 |
| 44487.88033564815 | 39.003 |
| 44487.922002314815 | 38.153 |
| 44487.96366898149 | 36.802 |
| 44488.00533564815 | 36.319 |
| 44488.047002314815 | 35.74 |
| 44488.08866898149 | 34.408 |
| 44488.13033564815 | 34.234 |
| 44488.172002314815 | 33.945 |
| 44488.21366898149 | 36.01 |
| 44488.25533564815 | 37.207 |
| 44488.297002314815 | 35.528 |
| 44488.33866898149 | 35.702 |
| 44488.38033564815 | 35.605 |
| 44488.422002314815 | 36.802 |
| 44488.46366898149 | 42.864 |
| 44488.50533564815 | 41.802 |
| 44488.547002314815 | 46.03 |
| 44488.58866898149 | 45.586 |
| 44488.63033564815 | 44.08 |
| 44488.672002314815 | 42.034 |
| 44488.71366898149 | 40.779 |
| 44488.75533564815 | 39.003 |
| 44488.797002314815 | 36.609 |
| 44488.83866898149 | 37.111 |
| 44488.88033564815 | 37.42 |
| 44488.922002314815 | 37.227 |
| 44488.96366898149 | 35.953 |
| 44489.00533564815 | 34.775 |
| 44489.047002314815 | 33.848 |
| 44489.08866898149 | 33.578 |
| 44489.13033564815 | 33.037 |
| 44489.172002314815 | 32.671 |
| 44489.21366898149 | 32.014 |
| 44489.25533564815 | 31.57 |
| 44489.297002314815 | 30.856 |
| 44489.33866898149 | 30.624 |
| 44489.38033564815 | 31.512 |
| 44489.422002314815 | 32.806 |
| 44489.46366898149 | 47.941 |
| 44489.50533564815 | 49.756 |
| 44489.547002314815 | 49.408 |
| 44489.58866898149 | 48.443 |
| 44489.63033564815 | 43.984 |
| 44489.672002314815 | 42.478 |
| 44489.71366898149 | 41.416 |
| 44489.75533564815 | 39.331 |
| 44489.797002314815 | 37.864 |
| 44489.83866898149 | 36.435 |
| 44489.88033564815 | 35.586 |
| 44489.922002314815 | 34.949 |
| 44489.96366898149 | 34.794 |
| 44490.00533564815 | 34.196 |
| 44490.047002314815 | 33.926 |
| 44490.08866898149 | 33.906 |
| 44490.13033564815 | 33.597 |
| 44490.172002314815 | 33.424 |
| 44490.21366898149 | 32.632 |
| 44490.25533564815 | 31.898 |
| 44490.297002314815 | 31.512 |
| 44490.33866898149 | 31.648 |
| 44490.38033564815 | 33.192 |
| 44490.422002314815 | 35.76 |
| 44490.46366898149 | 50.547 |
| 44490.50533564815 | 51.628 |
| 44490.547002314815 | 49.235 |
| 44490.58866898149 | 47.729 |
| 44490.63033564815 | 45.258 |
| 44490.672002314815 | 44.022 |
| 44490.71366898149 | 43.173 |
| 44490.75533564815 | 40.605 |
| 44490.797002314815 | 38.713 |
| 44490.83866898149 | 37.246 |
| 44490.88033564815 | 36.667 |
| 44490.922002314815 | 36.397 |
| 44490.96366898149 | 35.277 |
| 44491.00533564815 | 35.045 |
| 44491.047002314815 | 34.833 |
| 44491.08866898149 | 34.891 |
| 44491.13033564815 | 34.563 |
| 44491.172002314815 | 34.119 |
| 44491.21366898149 | 33.404 |
| 44491.25533564815 | 33.327 |
| 44491.297002314815 | 32.767 |
| 44491.33866898149 | 32.381 |
| 44491.38033564815 | 33.443 |
| 44491.422002314815 | 36.03 |
| 44491.46366898149 | 52.652 |
| 44491.50533564815 | 53.192 |
| 44491.547002314815 | 51.918 |
| 44491.58866898149 | 49.022 |
| 44491.63033564815 | 47.748 |
| 44491.672002314815 | 46.262 |
| 44491.71366898149 | 44.91 |
| 44491.75533564815 | 43.211 |
| 44491.797002314815 | 41.435 |
| 44491.83866898149 | 40.682 |
| 44491.88033564815 | 40.18 |
| 44491.922002314815 | 38.018 |
| 44491.96366898149 | 37.111 |
| 44492.00533564815 | 36.339 |
| 44492.047002314815 | 34.64 |
| 44492.08866898149 | 33.868 |
| 44492.13033564815 | 33.945 |
| 44492.172002314815 | 33.153 |
| 44492.21366898149 | 34.119 |
| 44492.25533564815 | 34.215 |
| 44492.297002314815 | 33.887 |
| 44492.33866898149 | 33.79 |
| 44492.38033564815 | 35.509 |
| 44492.422002314815 | 38.675 |
| 44492.46366898149 | 43.675 |
| 44492.50533564815 | 45.972 |
| 44492.547002314815 | 49.428 |
| 44492.58866898149 | 52.111 |
| 44492.63033564815 | 49.968 |
| 44492.672002314815 | 46.57 |
| 44492.71366898149 | 45.045 |
| 44492.75533564815 | 41.512 |
| 44492.797002314815 | 40.914 |
| 44492.83866898149 | 39.563 |
| 44492.88033564815 | 37.516 |
| 44492.922002314815 | 37.787 |
| 44492.96366898149 | 37.574 |
| 44493.00533564815 | 37.381 |
| 44493.047002314815 | 37.227 |
| 44493.08866898149 | 37.13 |
| 44493.13033564815 | 37.014 |
| 44493.172002314815 | 37.014 |
| 44493.21366898149 | 36.107 |
| 44493.25533564815 | 33.906 |
| 44493.297002314815 | 33.211 |
| 44493.33866898149 | 33.211 |
| 44493.38033564815 | 33.617 |
| 44493.422002314815 | 34.852 |
| 44493.46366898149 | 35.682 |
| 44493.50533564815 | 40.296 |
| 44493.547002314815 | 46.011 |
| 44493.58866898149 | 45.509 |
| 44493.63033564815 | 44.621 |
| 44493.672002314815 | 44.736 |
| 44493.71366898149 | 44.949 |
| 44493.75533564815 | 41.57 |
| 44493.797002314815 | 38.675 |
| 44493.83866898149 | 36.744 |
| 44493.88033564815 | 35.74 |
| 44493.922002314815 | 34.505 |
| 44493.96366898149 | 34.563 |
| 44494.00533564815 | 34.061 |
| 44494.047002314815 | 33.694 |
| 44494.08866898149 | 33.964 |
| 44494.13033564815 | 34.022 |
| 44494.172002314815 | 33.501 |
| 44494.21366898149 | 33.79 |
| 44494.25533564815 | 33.597 |
| 44494.297002314815 | 34.485 |
| 44494.33866898149 | 35.644 |
| 44494.38033564815 | 37.69 |
| 44494.422002314815 | 42.516 |
| 44494.46366898149 | 62.439 |
| 44494.50533564815 | 64.215 |
| 44494.547002314815 | 62.304 |
| 44494.58866898149 | 60.374 |
| 44494.63033564815 | 57.362 |
| 44494.672002314815 | 55.933 |
| 44494.71366898149 | 55.219 |
| 44494.75533564815 | 49.794 |
| 44494.797002314815 | 45.103 |
| 44494.83866898149 | 42.98 |
| 44494.88033564815 | 41.706 |
| 44494.922002314815 | 40.2 |
| 44494.96366898149 | 39.37 |
| 44495.00533564815 | 38.597 |
| 44495.047002314815 | 37.555 |
| 44495.08866898149 | 36.204 |
| 44495.13033564815 | 34.833 |
| 44495.172002314815 | 35.875 |
| 44495.21366898149 | 40.586 |
| 44495.25533564815 | 42.072 |
| 44495.297002314815 | 39.061 |
| 44495.33866898149 | 38.269 |
| 44495.38033564815 | 42.285 |
| 44495.422002314815 | 46.551 |
| 44495.46366898149 | 39.64 |
| 44495.50533564815 | 39.061 |
| 44495.547002314815 | 38.018 |
| 44495.58866898149 | 40.18 |
| 44495.63033564815 | 40.296 |
| 44495.672002314815 | 38.829 |
| 44495.71366898149 | 34.968 |
| 44495.75533564815 | 33.018 |
| 44495.797002314815 | 32.478 |
| 44495.83866898149 | 31.937 |
| 44495.88033564815 | 31.358 |
| 44495.922002314815 | 31.184 |
| 44495.96366898149 | 31.126 |
| 44496.00533564815 | 30.933 |
| 44496.047002314815 | 31.107 |
| 44496.08866898149 | 30.412 |
| 44496.13033564815 | 29.91 |
| 44496.172002314815 | 29.64 |
| 44496.21366898149 | 29.196 |
| 44496.25533564815 | 28.848 |
| 44496.297002314815 | 29.041 |
| 44496.33866898149 | 29.041 |
| 44496.38033564815 | 30.393 |